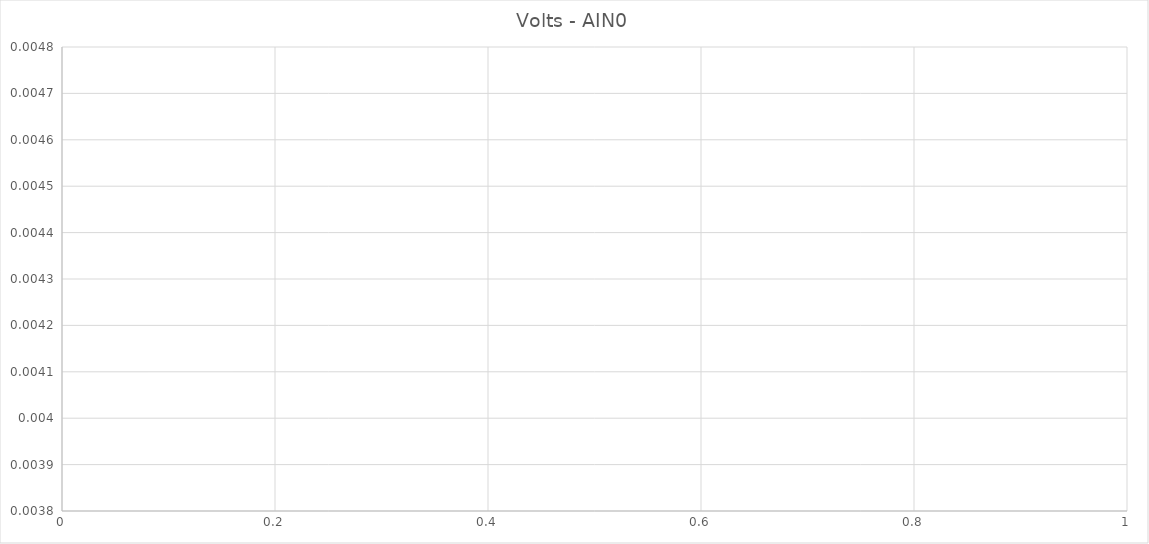
| Category | Volts - AIN0 |
|---|---|
| 0 | 0.004 |
| 1 | 0.004 |
| 2 | 0.004 |
| 3 | 0.004 |
| 4 | 0.004 |
| 5 | 0.004 |
| 6 | 0.004 |
| 7 | 0.004 |
| 8 | 0.004 |
| 9 | 0.004 |
| 10 | 0.004 |
| 11 | 0.004 |
| 12 | 0.004 |
| 13 | 0.004 |
| 14 | 0.004 |
| 15 | 0.004 |
| 16 | 0.004 |
| 17 | 0.004 |
| 18 | 0.004 |
| 19 | 0.004 |
| 20 | 0.004 |
| 21 | 0.004 |
| 22 | 0.004 |
| 23 | 0.004 |
| 24 | 0.004 |
| 25 | 0.004 |
| 26 | 0.004 |
| 27 | 0.004 |
| 28 | 0.004 |
| 29 | 0.004 |
| 30 | 0.004 |
| 31 | 0.004 |
| 32 | 0.004 |
| 33 | 0.004 |
| 34 | 0.004 |
| 35 | 0.004 |
| 36 | 0.004 |
| 37 | 0.004 |
| 38 | 0.004 |
| 39 | 0.004 |
| 40 | 0.004 |
| 41 | 0.004 |
| 42 | 0.004 |
| 43 | 0.004 |
| 44 | 0.004 |
| 45 | 0.004 |
| 46 | 0.004 |
| 47 | 0.004 |
| 48 | 0.004 |
| 49 | 0.004 |
| 50 | 0.004 |
| 51 | 0.004 |
| 52 | 0.004 |
| 53 | 0.004 |
| 54 | 0.004 |
| 55 | 0.004 |
| 56 | 0.004 |
| 57 | 0.004 |
| 58 | 0.004 |
| 59 | 0.004 |
| 60 | 0.004 |
| 61 | 0.004 |
| 62 | 0.004 |
| 63 | 0.004 |
| 64 | 0.004 |
| 65 | 0.004 |
| 66 | 0.004 |
| 67 | 0.004 |
| 68 | 0.004 |
| 69 | 0.004 |
| 70 | 0.004 |
| 71 | 0.004 |
| 72 | 0.004 |
| 73 | 0.004 |
| 74 | 0.004 |
| 75 | 0.004 |
| 76 | 0.004 |
| 77 | 0.004 |
| 78 | 0.004 |
| 79 | 0.004 |
| 80 | 0.004 |
| 81 | 0.004 |
| 82 | 0.004 |
| 83 | 0.004 |
| 84 | 0.004 |
| 85 | 0.004 |
| 86 | 0.004 |
| 87 | 0.004 |
| 88 | 0.004 |
| 89 | 0.004 |
| 90 | 0.004 |
| 91 | 0.004 |
| 92 | 0.004 |
| 93 | 0.004 |
| 94 | 0.004 |
| 95 | 0.004 |
| 96 | 0.004 |
| 97 | 0.004 |
| 98 | 0.004 |
| 99 | 0.004 |
| 100 | 0.004 |
| 101 | 0.004 |
| 102 | 0.004 |
| 103 | 0.004 |
| 104 | 0.004 |
| 105 | 0.004 |
| 106 | 0.004 |
| 107 | 0.004 |
| 108 | 0.004 |
| 109 | 0.004 |
| 110 | 0.004 |
| 111 | 0.004 |
| 112 | 0.004 |
| 113 | 0.004 |
| 114 | 0.004 |
| 115 | 0.004 |
| 116 | 0.004 |
| 117 | 0.004 |
| 118 | 0.004 |
| 119 | 0.004 |
| 120 | 0.004 |
| 121 | 0.004 |
| 122 | 0.004 |
| 123 | 0.004 |
| 124 | 0.004 |
| 125 | 0.004 |
| 126 | 0.004 |
| 127 | 0.004 |
| 128 | 0.004 |
| 129 | 0.004 |
| 130 | 0.004 |
| 131 | 0.004 |
| 132 | 0.004 |
| 133 | 0.004 |
| 134 | 0.004 |
| 135 | 0.004 |
| 136 | 0.004 |
| 137 | 0.004 |
| 138 | 0.004 |
| 139 | 0.004 |
| 140 | 0.004 |
| 141 | 0.004 |
| 142 | 0.004 |
| 143 | 0.004 |
| 144 | 0.004 |
| 145 | 0.004 |
| 146 | 0.004 |
| 147 | 0.004 |
| 148 | 0.004 |
| 149 | 0.004 |
| 150 | 0.004 |
| 151 | 0.004 |
| 152 | 0.004 |
| 153 | 0.004 |
| 154 | 0.004 |
| 155 | 0.004 |
| 156 | 0.004 |
| 157 | 0.004 |
| 158 | 0.004 |
| 159 | 0.004 |
| 160 | 0.004 |
| 161 | 0.004 |
| 162 | 0.004 |
| 163 | 0.004 |
| 164 | 0.004 |
| 165 | 0.004 |
| 166 | 0.004 |
| 167 | 0.004 |
| 168 | 0.004 |
| 169 | 0.004 |
| 170 | 0.004 |
| 171 | 0.004 |
| 172 | 0.004 |
| 173 | 0.004 |
| 174 | 0.004 |
| 175 | 0.004 |
| 176 | 0.004 |
| 177 | 0.004 |
| 178 | 0.004 |
| 179 | 0.004 |
| 180 | 0.004 |
| 181 | 0.004 |
| 182 | 0.004 |
| 183 | 0.004 |
| 184 | 0.004 |
| 185 | 0.004 |
| 186 | 0.004 |
| 187 | 0.004 |
| 188 | 0.004 |
| 189 | 0.004 |
| 190 | 0.004 |
| 191 | 0.004 |
| 192 | 0.004 |
| 193 | 0.004 |
| 194 | 0.004 |
| 195 | 0.004 |
| 196 | 0.004 |
| 197 | 0.004 |
| 198 | 0.004 |
| 199 | 0.004 |
| 200 | 0.004 |
| 201 | 0.004 |
| 202 | 0.004 |
| 203 | 0.004 |
| 204 | 0.004 |
| 205 | 0.004 |
| 206 | 0.004 |
| 207 | 0.004 |
| 208 | 0.004 |
| 209 | 0.004 |
| 210 | 0.004 |
| 211 | 0.004 |
| 212 | 0.004 |
| 213 | 0.004 |
| 214 | 0.004 |
| 215 | 0.004 |
| 216 | 0.004 |
| 217 | 0.004 |
| 218 | 0.004 |
| 219 | 0.004 |
| 220 | 0.004 |
| 221 | 0.004 |
| 222 | 0.004 |
| 223 | 0.004 |
| 224 | 0.004 |
| 225 | 0.004 |
| 226 | 0.004 |
| 227 | 0.004 |
| 228 | 0.004 |
| 229 | 0.004 |
| 230 | 0.004 |
| 231 | 0.004 |
| 232 | 0.004 |
| 233 | 0.004 |
| 234 | 0.004 |
| 235 | 0.004 |
| 236 | 0.004 |
| 237 | 0.004 |
| 238 | 0.004 |
| 239 | 0.004 |
| 240 | 0.004 |
| 241 | 0.004 |
| 242 | 0.004 |
| 243 | 0.004 |
| 244 | 0.004 |
| 245 | 0.004 |
| 246 | 0.004 |
| 247 | 0.004 |
| 248 | 0.004 |
| 249 | 0.004 |
| 250 | 0.004 |
| 251 | 0.004 |
| 252 | 0.004 |
| 253 | 0.004 |
| 254 | 0.004 |
| 255 | 0.004 |
| 256 | 0.004 |
| 257 | 0.004 |
| 258 | 0.004 |
| 259 | 0.004 |
| 260 | 0.004 |
| 261 | 0.004 |
| 262 | 0.004 |
| 263 | 0.004 |
| 264 | 0.004 |
| 265 | 0.004 |
| 266 | 0.004 |
| 267 | 0.004 |
| 268 | 0.004 |
| 269 | 0.004 |
| 270 | 0.004 |
| 271 | 0.004 |
| 272 | 0.004 |
| 273 | 0.004 |
| 274 | 0.004 |
| 275 | 0.004 |
| 276 | 0.004 |
| 277 | 0.004 |
| 278 | 0.004 |
| 279 | 0.004 |
| 280 | 0.004 |
| 281 | 0.004 |
| 282 | 0.004 |
| 283 | 0.004 |
| 284 | 0.004 |
| 285 | 0.004 |
| 286 | 0.004 |
| 287 | 0.004 |
| 288 | 0.004 |
| 289 | 0.004 |
| 290 | 0.004 |
| 291 | 0.004 |
| 292 | 0.004 |
| 293 | 0.004 |
| 294 | 0.004 |
| 295 | 0.004 |
| 296 | 0.004 |
| 297 | 0.004 |
| 298 | 0.004 |
| 299 | 0.004 |
| 300 | 0.004 |
| 301 | 0.004 |
| 302 | 0.004 |
| 303 | 0.004 |
| 304 | 0.004 |
| 305 | 0.004 |
| 306 | 0.004 |
| 307 | 0.004 |
| 308 | 0.004 |
| 309 | 0.004 |
| 310 | 0.004 |
| 311 | 0.004 |
| 312 | 0.004 |
| 313 | 0.004 |
| 314 | 0.004 |
| 315 | 0.004 |
| 316 | 0.004 |
| 317 | 0.004 |
| 318 | 0.004 |
| 319 | 0.004 |
| 320 | 0.004 |
| 321 | 0.004 |
| 322 | 0.004 |
| 323 | 0.004 |
| 324 | 0.004 |
| 325 | 0.004 |
| 326 | 0.004 |
| 327 | 0.004 |
| 328 | 0.004 |
| 329 | 0.004 |
| 330 | 0.004 |
| 331 | 0.004 |
| 332 | 0.004 |
| 333 | 0.004 |
| 334 | 0.004 |
| 335 | 0.004 |
| 336 | 0.004 |
| 337 | 0.004 |
| 338 | 0.004 |
| 339 | 0.004 |
| 340 | 0.004 |
| 341 | 0.004 |
| 342 | 0.004 |
| 343 | 0.004 |
| 344 | 0.004 |
| 345 | 0.004 |
| 346 | 0.004 |
| 347 | 0.004 |
| 348 | 0.004 |
| 349 | 0.004 |
| 350 | 0.004 |
| 351 | 0.004 |
| 352 | 0.004 |
| 353 | 0.004 |
| 354 | 0.004 |
| 355 | 0.004 |
| 356 | 0.004 |
| 357 | 0.004 |
| 358 | 0.004 |
| 359 | 0.004 |
| 360 | 0.004 |
| 361 | 0.004 |
| 362 | 0.004 |
| 363 | 0.004 |
| 364 | 0.004 |
| 365 | 0.004 |
| 366 | 0.004 |
| 367 | 0.004 |
| 368 | 0.004 |
| 369 | 0.004 |
| 370 | 0.004 |
| 371 | 0.004 |
| 372 | 0.004 |
| 373 | 0.004 |
| 374 | 0.004 |
| 375 | 0.004 |
| 376 | 0.004 |
| 377 | 0.004 |
| 378 | 0.004 |
| 379 | 0.004 |
| 380 | 0.004 |
| 381 | 0.004 |
| 382 | 0.004 |
| 383 | 0.004 |
| 384 | 0.004 |
| 385 | 0.004 |
| 386 | 0.004 |
| 387 | 0.004 |
| 388 | 0.004 |
| 389 | 0.004 |
| 390 | 0.004 |
| 391 | 0.004 |
| 392 | 0.004 |
| 393 | 0.004 |
| 394 | 0.004 |
| 395 | 0.004 |
| 396 | 0.004 |
| 397 | 0.004 |
| 398 | 0.004 |
| 399 | 0.004 |
| 400 | 0.004 |
| 401 | 0.004 |
| 402 | 0.004 |
| 403 | 0.004 |
| 404 | 0.004 |
| 405 | 0.004 |
| 406 | 0.004 |
| 407 | 0.004 |
| 408 | 0.004 |
| 409 | 0.004 |
| 410 | 0.004 |
| 411 | 0.004 |
| 412 | 0.004 |
| 413 | 0.004 |
| 414 | 0.004 |
| 415 | 0.004 |
| 416 | 0.004 |
| 417 | 0.004 |
| 418 | 0.004 |
| 419 | 0.004 |
| 420 | 0.004 |
| 421 | 0.004 |
| 422 | 0.004 |
| 423 | 0.004 |
| 424 | 0.004 |
| 425 | 0.004 |
| 426 | 0.004 |
| 427 | 0.004 |
| 428 | 0.004 |
| 429 | 0.004 |
| 430 | 0.004 |
| 431 | 0.004 |
| 432 | 0.004 |
| 433 | 0.004 |
| 434 | 0.004 |
| 435 | 0.004 |
| 436 | 0.004 |
| 437 | 0.004 |
| 438 | 0.004 |
| 439 | 0.004 |
| 440 | 0.004 |
| 441 | 0.004 |
| 442 | 0.004 |
| 443 | 0.004 |
| 444 | 0.004 |
| 445 | 0.004 |
| 446 | 0.004 |
| 447 | 0.004 |
| 448 | 0.004 |
| 449 | 0.004 |
| 450 | 0.004 |
| 451 | 0.004 |
| 452 | 0.004 |
| 453 | 0.004 |
| 454 | 0.004 |
| 455 | 0.004 |
| 456 | 0.004 |
| 457 | 0.004 |
| 458 | 0.004 |
| 459 | 0.004 |
| 460 | 0.004 |
| 461 | 0.004 |
| 462 | 0.004 |
| 463 | 0.004 |
| 464 | 0.004 |
| 465 | 0.004 |
| 466 | 0.004 |
| 467 | 0.004 |
| 468 | 0.004 |
| 469 | 0.004 |
| 470 | 0.004 |
| 471 | 0.004 |
| 472 | 0.004 |
| 473 | 0.004 |
| 474 | 0.004 |
| 475 | 0.004 |
| 476 | 0.004 |
| 477 | 0.004 |
| 478 | 0.004 |
| 479 | 0.004 |
| 480 | 0.004 |
| 481 | 0.004 |
| 482 | 0.004 |
| 483 | 0.004 |
| 484 | 0.004 |
| 485 | 0.004 |
| 486 | 0.004 |
| 487 | 0.004 |
| 488 | 0.004 |
| 489 | 0.004 |
| 490 | 0.004 |
| 491 | 0.004 |
| 492 | 0.004 |
| 493 | 0.004 |
| 494 | 0.004 |
| 495 | 0.004 |
| 496 | 0.004 |
| 497 | 0.004 |
| 498 | 0.004 |
| 499 | 0.004 |
| 500 | 0.004 |
| 501 | 0.004 |
| 502 | 0.004 |
| 503 | 0.004 |
| 504 | 0.004 |
| 505 | 0.004 |
| 506 | 0.004 |
| 507 | 0.004 |
| 508 | 0.004 |
| 509 | 0.004 |
| 510 | 0.004 |
| 511 | 0.004 |
| 512 | 0.004 |
| 513 | 0.004 |
| 514 | 0.004 |
| 515 | 0.004 |
| 516 | 0.004 |
| 517 | 0.004 |
| 518 | 0.004 |
| 519 | 0.004 |
| 520 | 0.004 |
| 521 | 0.004 |
| 522 | 0.004 |
| 523 | 0.004 |
| 524 | 0.004 |
| 525 | 0.004 |
| 526 | 0.004 |
| 527 | 0.004 |
| 528 | 0.004 |
| 529 | 0.004 |
| 530 | 0.004 |
| 531 | 0.004 |
| 532 | 0.004 |
| 533 | 0.004 |
| 534 | 0.004 |
| 535 | 0.004 |
| 536 | 0.004 |
| 537 | 0.004 |
| 538 | 0.004 |
| 539 | 0.004 |
| 540 | 0.004 |
| 541 | 0.004 |
| 542 | 0.004 |
| 543 | 0.004 |
| 544 | 0.004 |
| 545 | 0.004 |
| 546 | 0.004 |
| 547 | 0.004 |
| 548 | 0.004 |
| 549 | 0.004 |
| 550 | 0.004 |
| 551 | 0.004 |
| 552 | 0.004 |
| 553 | 0.004 |
| 554 | 0.004 |
| 555 | 0.004 |
| 556 | 0.004 |
| 557 | 0.004 |
| 558 | 0.004 |
| 559 | 0.004 |
| 560 | 0.004 |
| 561 | 0.004 |
| 562 | 0.004 |
| 563 | 0.004 |
| 564 | 0.004 |
| 565 | 0.004 |
| 566 | 0.004 |
| 567 | 0.004 |
| 568 | 0.004 |
| 569 | 0.004 |
| 570 | 0.004 |
| 571 | 0.004 |
| 572 | 0.004 |
| 573 | 0.004 |
| 574 | 0.004 |
| 575 | 0.004 |
| 576 | 0.004 |
| 577 | 0.004 |
| 578 | 0.004 |
| 579 | 0.004 |
| 580 | 0.004 |
| 581 | 0.004 |
| 582 | 0.004 |
| 583 | 0.004 |
| 584 | 0.004 |
| 585 | 0.004 |
| 586 | 0.004 |
| 587 | 0.004 |
| 588 | 0.004 |
| 589 | 0.004 |
| 590 | 0.004 |
| 591 | 0.004 |
| 592 | 0.004 |
| 593 | 0.004 |
| 594 | 0.004 |
| 595 | 0.004 |
| 596 | 0.004 |
| 597 | 0.004 |
| 598 | 0.004 |
| 599 | 0.004 |
| 600 | 0.004 |
| 601 | 0.004 |
| 602 | 0.004 |
| 603 | 0.004 |
| 604 | 0.004 |
| 605 | 0.004 |
| 606 | 0.004 |
| 607 | 0.004 |
| 608 | 0.004 |
| 609 | 0.004 |
| 610 | 0.004 |
| 611 | 0.004 |
| 612 | 0.004 |
| 613 | 0.004 |
| 614 | 0.004 |
| 615 | 0.004 |
| 616 | 0.004 |
| 617 | 0.004 |
| 618 | 0.004 |
| 619 | 0.004 |
| 620 | 0.004 |
| 621 | 0.004 |
| 622 | 0.004 |
| 623 | 0.004 |
| 624 | 0.004 |
| 625 | 0.004 |
| 626 | 0.004 |
| 627 | 0.004 |
| 628 | 0.004 |
| 629 | 0.004 |
| 630 | 0.004 |
| 631 | 0.004 |
| 632 | 0.004 |
| 633 | 0.004 |
| 634 | 0.004 |
| 635 | 0.004 |
| 636 | 0.004 |
| 637 | 0.004 |
| 638 | 0.004 |
| 639 | 0.004 |
| 640 | 0.004 |
| 641 | 0.004 |
| 642 | 0.004 |
| 643 | 0.004 |
| 644 | 0.004 |
| 645 | 0.004 |
| 646 | 0.004 |
| 647 | 0.004 |
| 648 | 0.004 |
| 649 | 0.004 |
| 650 | 0.004 |
| 651 | 0.004 |
| 652 | 0.004 |
| 653 | 0.004 |
| 654 | 0.004 |
| 655 | 0.004 |
| 656 | 0.004 |
| 657 | 0.004 |
| 658 | 0.004 |
| 659 | 0.004 |
| 660 | 0.004 |
| 661 | 0.004 |
| 662 | 0.004 |
| 663 | 0.004 |
| 664 | 0.004 |
| 665 | 0.004 |
| 666 | 0.004 |
| 667 | 0.004 |
| 668 | 0.004 |
| 669 | 0.004 |
| 670 | 0.004 |
| 671 | 0.004 |
| 672 | 0.004 |
| 673 | 0.004 |
| 674 | 0.004 |
| 675 | 0.004 |
| 676 | 0.004 |
| 677 | 0.004 |
| 678 | 0.004 |
| 679 | 0.004 |
| 680 | 0.004 |
| 681 | 0.004 |
| 682 | 0.004 |
| 683 | 0.004 |
| 684 | 0.004 |
| 685 | 0.004 |
| 686 | 0.004 |
| 687 | 0.004 |
| 688 | 0.004 |
| 689 | 0.004 |
| 690 | 0.004 |
| 691 | 0.004 |
| 692 | 0.004 |
| 693 | 0.004 |
| 694 | 0.004 |
| 695 | 0.004 |
| 696 | 0.004 |
| 697 | 0.004 |
| 698 | 0.004 |
| 699 | 0.004 |
| 700 | 0.004 |
| 701 | 0.004 |
| 702 | 0.004 |
| 703 | 0.004 |
| 704 | 0.004 |
| 705 | 0.004 |
| 706 | 0.004 |
| 707 | 0.004 |
| 708 | 0.004 |
| 709 | 0.004 |
| 710 | 0.004 |
| 711 | 0.004 |
| 712 | 0.004 |
| 713 | 0.004 |
| 714 | 0.004 |
| 715 | 0.004 |
| 716 | 0.004 |
| 717 | 0.004 |
| 718 | 0.004 |
| 719 | 0.004 |
| 720 | 0.004 |
| 721 | 0.004 |
| 722 | 0.004 |
| 723 | 0.004 |
| 724 | 0.004 |
| 725 | 0.004 |
| 726 | 0.004 |
| 727 | 0.004 |
| 728 | 0.004 |
| 729 | 0.004 |
| 730 | 0.004 |
| 731 | 0.004 |
| 732 | 0.004 |
| 733 | 0.004 |
| 734 | 0.004 |
| 735 | 0.004 |
| 736 | 0.004 |
| 737 | 0.004 |
| 738 | 0.004 |
| 739 | 0.004 |
| 740 | 0.004 |
| 741 | 0.004 |
| 742 | 0.004 |
| 743 | 0.004 |
| 744 | 0.004 |
| 745 | 0.004 |
| 746 | 0.004 |
| 747 | 0.004 |
| 748 | 0.004 |
| 749 | 0.004 |
| 750 | 0.004 |
| 751 | 0.004 |
| 752 | 0.004 |
| 753 | 0.004 |
| 754 | 0.004 |
| 755 | 0.004 |
| 756 | 0.004 |
| 757 | 0.004 |
| 758 | 0.004 |
| 759 | 0.004 |
| 760 | 0.004 |
| 761 | 0.004 |
| 762 | 0.004 |
| 763 | 0.004 |
| 764 | 0.004 |
| 765 | 0.004 |
| 766 | 0.004 |
| 767 | 0.004 |
| 768 | 0.004 |
| 769 | 0.004 |
| 770 | 0.004 |
| 771 | 0.004 |
| 772 | 0.004 |
| 773 | 0.004 |
| 774 | 0.004 |
| 775 | 0.004 |
| 776 | 0.004 |
| 777 | 0.004 |
| 778 | 0.004 |
| 779 | 0.004 |
| 780 | 0.004 |
| 781 | 0.004 |
| 782 | 0.004 |
| 783 | 0.004 |
| 784 | 0.004 |
| 785 | 0.004 |
| 786 | 0.004 |
| 787 | 0.004 |
| 788 | 0.004 |
| 789 | 0.004 |
| 790 | 0.004 |
| 791 | 0.004 |
| 792 | 0.004 |
| 793 | 0.004 |
| 794 | 0.004 |
| 795 | 0.004 |
| 796 | 0.004 |
| 797 | 0.004 |
| 798 | 0.004 |
| 799 | 0.004 |
| 800 | 0.004 |
| 801 | 0.004 |
| 802 | 0.004 |
| 803 | 0.004 |
| 804 | 0.004 |
| 805 | 0.004 |
| 806 | 0.004 |
| 807 | 0.004 |
| 808 | 0.004 |
| 809 | 0.004 |
| 810 | 0.004 |
| 811 | 0.004 |
| 812 | 0.004 |
| 813 | 0.004 |
| 814 | 0.004 |
| 815 | 0.004 |
| 816 | 0.004 |
| 817 | 0.004 |
| 818 | 0.004 |
| 819 | 0.004 |
| 820 | 0.004 |
| 821 | 0.004 |
| 822 | 0.004 |
| 823 | 0.004 |
| 824 | 0.004 |
| 825 | 0.004 |
| 826 | 0.004 |
| 827 | 0.004 |
| 828 | 0.004 |
| 829 | 0.004 |
| 830 | 0.004 |
| 831 | 0.004 |
| 832 | 0.004 |
| 833 | 0.004 |
| 834 | 0.004 |
| 835 | 0.004 |
| 836 | 0.004 |
| 837 | 0.004 |
| 838 | 0.004 |
| 839 | 0.004 |
| 840 | 0.004 |
| 841 | 0.004 |
| 842 | 0.004 |
| 843 | 0.004 |
| 844 | 0.004 |
| 845 | 0.004 |
| 846 | 0.004 |
| 847 | 0.004 |
| 848 | 0.004 |
| 849 | 0.004 |
| 850 | 0.004 |
| 851 | 0.004 |
| 852 | 0.004 |
| 853 | 0.004 |
| 854 | 0.004 |
| 855 | 0.004 |
| 856 | 0.004 |
| 857 | 0.004 |
| 858 | 0.004 |
| 859 | 0.004 |
| 860 | 0.004 |
| 861 | 0.004 |
| 862 | 0.004 |
| 863 | 0.004 |
| 864 | 0.004 |
| 865 | 0.004 |
| 866 | 0.004 |
| 867 | 0.004 |
| 868 | 0.004 |
| 869 | 0.004 |
| 870 | 0.004 |
| 871 | 0.004 |
| 872 | 0.004 |
| 873 | 0.004 |
| 874 | 0.004 |
| 875 | 0.004 |
| 876 | 0.004 |
| 877 | 0.004 |
| 878 | 0.004 |
| 879 | 0.004 |
| 880 | 0.004 |
| 881 | 0.004 |
| 882 | 0.004 |
| 883 | 0.004 |
| 884 | 0.004 |
| 885 | 0.004 |
| 886 | 0.004 |
| 887 | 0.004 |
| 888 | 0.004 |
| 889 | 0.004 |
| 890 | 0.004 |
| 891 | 0.004 |
| 892 | 0.004 |
| 893 | 0.004 |
| 894 | 0.004 |
| 895 | 0.004 |
| 896 | 0.004 |
| 897 | 0.004 |
| 898 | 0.004 |
| 899 | 0.004 |
| 900 | 0.004 |
| 901 | 0.004 |
| 902 | 0.004 |
| 903 | 0.004 |
| 904 | 0.004 |
| 905 | 0.004 |
| 906 | 0.004 |
| 907 | 0.004 |
| 908 | 0.004 |
| 909 | 0.004 |
| 910 | 0.004 |
| 911 | 0.004 |
| 912 | 0.004 |
| 913 | 0.004 |
| 914 | 0.004 |
| 915 | 0.004 |
| 916 | 0.004 |
| 917 | 0.004 |
| 918 | 0.004 |
| 919 | 0.004 |
| 920 | 0.004 |
| 921 | 0.004 |
| 922 | 0.004 |
| 923 | 0.004 |
| 924 | 0.004 |
| 925 | 0.004 |
| 926 | 0.004 |
| 927 | 0.004 |
| 928 | 0.004 |
| 929 | 0.004 |
| 930 | 0.004 |
| 931 | 0.004 |
| 932 | 0.004 |
| 933 | 0.004 |
| 934 | 0.004 |
| 935 | 0.004 |
| 936 | 0.004 |
| 937 | 0.004 |
| 938 | 0.004 |
| 939 | 0.004 |
| 940 | 0.004 |
| 941 | 0.004 |
| 942 | 0.004 |
| 943 | 0.004 |
| 944 | 0.004 |
| 945 | 0.004 |
| 946 | 0.004 |
| 947 | 0.004 |
| 948 | 0.004 |
| 949 | 0.004 |
| 950 | 0.004 |
| 951 | 0.004 |
| 952 | 0.004 |
| 953 | 0.004 |
| 954 | 0.004 |
| 955 | 0.004 |
| 956 | 0.004 |
| 957 | 0.004 |
| 958 | 0.004 |
| 959 | 0.004 |
| 960 | 0.004 |
| 961 | 0.004 |
| 962 | 0.004 |
| 963 | 0.004 |
| 964 | 0.004 |
| 965 | 0.004 |
| 966 | 0.004 |
| 967 | 0.004 |
| 968 | 0.004 |
| 969 | 0.004 |
| 970 | 0.004 |
| 971 | 0.004 |
| 972 | 0.004 |
| 973 | 0.004 |
| 974 | 0.004 |
| 975 | 0.004 |
| 976 | 0.004 |
| 977 | 0.004 |
| 978 | 0.004 |
| 979 | 0.004 |
| 980 | 0.004 |
| 981 | 0.004 |
| 982 | 0.004 |
| 983 | 0.004 |
| 984 | 0.004 |
| 985 | 0.004 |
| 986 | 0.004 |
| 987 | 0.004 |
| 988 | 0.004 |
| 989 | 0.004 |
| 990 | 0.004 |
| 991 | 0.004 |
| 992 | 0.004 |
| 993 | 0.004 |
| 994 | 0.004 |
| 995 | 0.004 |
| 996 | 0.004 |
| 997 | 0.004 |
| 998 | 0.004 |
| 999 | 0.004 |
| 1000 | 0.004 |
| 1001 | 0.004 |
| 1002 | 0.004 |
| 1003 | 0.004 |
| 1004 | 0.004 |
| 1005 | 0.004 |
| 1006 | 0.004 |
| 1007 | 0.004 |
| 1008 | 0.004 |
| 1009 | 0.004 |
| 1010 | 0.004 |
| 1011 | 0.004 |
| 1012 | 0.004 |
| 1013 | 0.004 |
| 1014 | 0.004 |
| 1015 | 0.004 |
| 1016 | 0.004 |
| 1017 | 0.004 |
| 1018 | 0.004 |
| 1019 | 0.004 |
| 1020 | 0.004 |
| 1021 | 0.004 |
| 1022 | 0.004 |
| 1023 | 0.004 |
| 1024 | 0.004 |
| 1025 | 0.004 |
| 1026 | 0.004 |
| 1027 | 0.004 |
| 1028 | 0.004 |
| 1029 | 0.004 |
| 1030 | 0.004 |
| 1031 | 0.004 |
| 1032 | 0.004 |
| 1033 | 0.004 |
| 1034 | 0.004 |
| 1035 | 0.004 |
| 1036 | 0.004 |
| 1037 | 0.004 |
| 1038 | 0.004 |
| 1039 | 0.004 |
| 1040 | 0.004 |
| 1041 | 0.004 |
| 1042 | 0.004 |
| 1043 | 0.004 |
| 1044 | 0.004 |
| 1045 | 0.004 |
| 1046 | 0.004 |
| 1047 | 0.004 |
| 1048 | 0.004 |
| 1049 | 0.004 |
| 1050 | 0.004 |
| 1051 | 0.004 |
| 1052 | 0.004 |
| 1053 | 0.004 |
| 1054 | 0.004 |
| 1055 | 0.004 |
| 1056 | 0.004 |
| 1057 | 0.004 |
| 1058 | 0.004 |
| 1059 | 0.004 |
| 1060 | 0.004 |
| 1061 | 0.004 |
| 1062 | 0.004 |
| 1063 | 0.004 |
| 1064 | 0.004 |
| 1065 | 0.004 |
| 1066 | 0.004 |
| 1067 | 0.004 |
| 1068 | 0.004 |
| 1069 | 0.004 |
| 1070 | 0.004 |
| 1071 | 0.004 |
| 1072 | 0.004 |
| 1073 | 0.004 |
| 1074 | 0.004 |
| 1075 | 0.004 |
| 1076 | 0.004 |
| 1077 | 0.004 |
| 1078 | 0.004 |
| 1079 | 0.004 |
| 1080 | 0.004 |
| 1081 | 0.004 |
| 1082 | 0.004 |
| 1083 | 0.004 |
| 1084 | 0.004 |
| 1085 | 0.004 |
| 1086 | 0.004 |
| 1087 | 0.004 |
| 1088 | 0.004 |
| 1089 | 0.004 |
| 1090 | 0.004 |
| 1091 | 0.004 |
| 1092 | 0.004 |
| 1093 | 0.004 |
| 1094 | 0.004 |
| 1095 | 0.004 |
| 1096 | 0.004 |
| 1097 | 0.004 |
| 1098 | 0.004 |
| 1099 | 0.004 |
| 1100 | 0.004 |
| 1101 | 0.004 |
| 1102 | 0.004 |
| 1103 | 0.004 |
| 1104 | 0.004 |
| 1105 | 0.004 |
| 1106 | 0.004 |
| 1107 | 0.004 |
| 1108 | 0.004 |
| 1109 | 0.004 |
| 1110 | 0.004 |
| 1111 | 0.004 |
| 1112 | 0.004 |
| 1113 | 0.004 |
| 1114 | 0.004 |
| 1115 | 0.004 |
| 1116 | 0.004 |
| 1117 | 0.004 |
| 1118 | 0.004 |
| 1119 | 0.004 |
| 1120 | 0.004 |
| 1121 | 0.004 |
| 1122 | 0.004 |
| 1123 | 0.004 |
| 1124 | 0.004 |
| 1125 | 0.004 |
| 1126 | 0.004 |
| 1127 | 0.004 |
| 1128 | 0.004 |
| 1129 | 0.004 |
| 1130 | 0.004 |
| 1131 | 0.004 |
| 1132 | 0.004 |
| 1133 | 0.004 |
| 1134 | 0.004 |
| 1135 | 0.004 |
| 1136 | 0.004 |
| 1137 | 0.004 |
| 1138 | 0.004 |
| 1139 | 0.004 |
| 1140 | 0.004 |
| 1141 | 0.004 |
| 1142 | 0.004 |
| 1143 | 0.004 |
| 1144 | 0.004 |
| 1145 | 0.004 |
| 1146 | 0.004 |
| 1147 | 0.004 |
| 1148 | 0.004 |
| 1149 | 0.004 |
| 1150 | 0.004 |
| 1151 | 0.004 |
| 1152 | 0.004 |
| 1153 | 0.004 |
| 1154 | 0.004 |
| 1155 | 0.004 |
| 1156 | 0.004 |
| 1157 | 0.004 |
| 1158 | 0.004 |
| 1159 | 0.004 |
| 1160 | 0.004 |
| 1161 | 0.004 |
| 1162 | 0.004 |
| 1163 | 0.004 |
| 1164 | 0.004 |
| 1165 | 0.004 |
| 1166 | 0.004 |
| 1167 | 0.004 |
| 1168 | 0.004 |
| 1169 | 0.004 |
| 1170 | 0.004 |
| 1171 | 0.004 |
| 1172 | 0.004 |
| 1173 | 0.004 |
| 1174 | 0.004 |
| 1175 | 0.004 |
| 1176 | 0.004 |
| 1177 | 0.004 |
| 1178 | 0.004 |
| 1179 | 0.004 |
| 1180 | 0.004 |
| 1181 | 0.004 |
| 1182 | 0.004 |
| 1183 | 0.004 |
| 1184 | 0.004 |
| 1185 | 0.004 |
| 1186 | 0.004 |
| 1187 | 0.004 |
| 1188 | 0.004 |
| 1189 | 0.004 |
| 1190 | 0.004 |
| 1191 | 0.004 |
| 1192 | 0.004 |
| 1193 | 0.004 |
| 1194 | 0.004 |
| 1195 | 0.004 |
| 1196 | 0.004 |
| 1197 | 0.004 |
| 1198 | 0.004 |
| 1199 | 0.004 |
| 1200 | 0.004 |
| 1201 | 0.004 |
| 1202 | 0.004 |
| 1203 | 0.004 |
| 1204 | 0.004 |
| 1205 | 0.004 |
| 1206 | 0.004 |
| 1207 | 0.004 |
| 1208 | 0.004 |
| 1209 | 0.004 |
| 1210 | 0.004 |
| 1211 | 0.004 |
| 1212 | 0.004 |
| 1213 | 0.004 |
| 1214 | 0.004 |
| 1215 | 0.004 |
| 1216 | 0.004 |
| 1217 | 0.004 |
| 1218 | 0.004 |
| 1219 | 0.004 |
| 1220 | 0.004 |
| 1221 | 0.004 |
| 1222 | 0.004 |
| 1223 | 0.004 |
| 1224 | 0.004 |
| 1225 | 0.004 |
| 1226 | 0.004 |
| 1227 | 0.004 |
| 1228 | 0.004 |
| 1229 | 0.004 |
| 1230 | 0.004 |
| 1231 | 0.004 |
| 1232 | 0.004 |
| 1233 | 0.004 |
| 1234 | 0.004 |
| 1235 | 0.004 |
| 1236 | 0.004 |
| 1237 | 0.004 |
| 1238 | 0.004 |
| 1239 | 0.004 |
| 1240 | 0.004 |
| 1241 | 0.004 |
| 1242 | 0.004 |
| 1243 | 0.004 |
| 1244 | 0.004 |
| 1245 | 0.004 |
| 1246 | 0.004 |
| 1247 | 0.004 |
| 1248 | 0.004 |
| 1249 | 0.004 |
| 1250 | 0.004 |
| 1251 | 0.004 |
| 1252 | 0.004 |
| 1253 | 0.004 |
| 1254 | 0.004 |
| 1255 | 0.004 |
| 1256 | 0.004 |
| 1257 | 0.004 |
| 1258 | 0.004 |
| 1259 | 0.004 |
| 1260 | 0.004 |
| 1261 | 0.004 |
| 1262 | 0.004 |
| 1263 | 0.004 |
| 1264 | 0.004 |
| 1265 | 0.004 |
| 1266 | 0.004 |
| 1267 | 0.004 |
| 1268 | 0.004 |
| 1269 | 0.004 |
| 1270 | 0.004 |
| 1271 | 0.004 |
| 1272 | 0.004 |
| 1273 | 0.004 |
| 1274 | 0.004 |
| 1275 | 0.004 |
| 1276 | 0.004 |
| 1277 | 0.004 |
| 1278 | 0.004 |
| 1279 | 0.004 |
| 1280 | 0.004 |
| 1281 | 0.004 |
| 1282 | 0.004 |
| 1283 | 0.004 |
| 1284 | 0.004 |
| 1285 | 0.004 |
| 1286 | 0.004 |
| 1287 | 0.004 |
| 1288 | 0.004 |
| 1289 | 0.004 |
| 1290 | 0.004 |
| 1291 | 0.004 |
| 1292 | 0.004 |
| 1293 | 0.004 |
| 1294 | 0.004 |
| 1295 | 0.004 |
| 1296 | 0.004 |
| 1297 | 0.004 |
| 1298 | 0.004 |
| 1299 | 0.004 |
| 1300 | 0.004 |
| 1301 | 0.004 |
| 1302 | 0.004 |
| 1303 | 0.004 |
| 1304 | 0.004 |
| 1305 | 0.004 |
| 1306 | 0.004 |
| 1307 | 0.004 |
| 1308 | 0.004 |
| 1309 | 0.004 |
| 1310 | 0.004 |
| 1311 | 0.004 |
| 1312 | 0.004 |
| 1313 | 0.004 |
| 1314 | 0.004 |
| 1315 | 0.004 |
| 1316 | 0.004 |
| 1317 | 0.004 |
| 1318 | 0.004 |
| 1319 | 0.004 |
| 1320 | 0.004 |
| 1321 | 0.004 |
| 1322 | 0.004 |
| 1323 | 0.004 |
| 1324 | 0.004 |
| 1325 | 0.004 |
| 1326 | 0.004 |
| 1327 | 0.004 |
| 1328 | 0.004 |
| 1329 | 0.004 |
| 1330 | 0.004 |
| 1331 | 0.004 |
| 1332 | 0.004 |
| 1333 | 0.004 |
| 1334 | 0.004 |
| 1335 | 0.004 |
| 1336 | 0.004 |
| 1337 | 0.004 |
| 1338 | 0.004 |
| 1339 | 0.004 |
| 1340 | 0.004 |
| 1341 | 0.004 |
| 1342 | 0.004 |
| 1343 | 0.004 |
| 1344 | 0.004 |
| 1345 | 0.004 |
| 1346 | 0.004 |
| 1347 | 0.004 |
| 1348 | 0.004 |
| 1349 | 0.004 |
| 1350 | 0.004 |
| 1351 | 0.004 |
| 1352 | 0.004 |
| 1353 | 0.004 |
| 1354 | 0.004 |
| 1355 | 0.004 |
| 1356 | 0.004 |
| 1357 | 0.004 |
| 1358 | 0.004 |
| 1359 | 0.004 |
| 1360 | 0.004 |
| 1361 | 0.004 |
| 1362 | 0.004 |
| 1363 | 0.004 |
| 1364 | 0.004 |
| 1365 | 0.004 |
| 1366 | 0.004 |
| 1367 | 0.004 |
| 1368 | 0.004 |
| 1369 | 0.004 |
| 1370 | 0.004 |
| 1371 | 0.004 |
| 1372 | 0.004 |
| 1373 | 0.004 |
| 1374 | 0.004 |
| 1375 | 0.004 |
| 1376 | 0.004 |
| 1377 | 0.004 |
| 1378 | 0.004 |
| 1379 | 0.004 |
| 1380 | 0.004 |
| 1381 | 0.004 |
| 1382 | 0.004 |
| 1383 | 0.004 |
| 1384 | 0.004 |
| 1385 | 0.004 |
| 1386 | 0.004 |
| 1387 | 0.004 |
| 1388 | 0.004 |
| 1389 | 0.004 |
| 1390 | 0.004 |
| 1391 | 0.004 |
| 1392 | 0.004 |
| 1393 | 0.004 |
| 1394 | 0.004 |
| 1395 | 0.004 |
| 1396 | 0.004 |
| 1397 | 0.004 |
| 1398 | 0.004 |
| 1399 | 0.004 |
| 1400 | 0.004 |
| 1401 | 0.004 |
| 1402 | 0.004 |
| 1403 | 0.004 |
| 1404 | 0.004 |
| 1405 | 0.004 |
| 1406 | 0.004 |
| 1407 | 0.004 |
| 1408 | 0.004 |
| 1409 | 0.004 |
| 1410 | 0.004 |
| 1411 | 0.004 |
| 1412 | 0.004 |
| 1413 | 0.004 |
| 1414 | 0.004 |
| 1415 | 0.004 |
| 1416 | 0.004 |
| 1417 | 0.004 |
| 1418 | 0.004 |
| 1419 | 0.004 |
| 1420 | 0.004 |
| 1421 | 0.004 |
| 1422 | 0.004 |
| 1423 | 0.004 |
| 1424 | 0.004 |
| 1425 | 0.004 |
| 1426 | 0.004 |
| 1427 | 0.004 |
| 1428 | 0.004 |
| 1429 | 0.004 |
| 1430 | 0.004 |
| 1431 | 0.004 |
| 1432 | 0.004 |
| 1433 | 0.004 |
| 1434 | 0.004 |
| 1435 | 0.004 |
| 1436 | 0.004 |
| 1437 | 0.004 |
| 1438 | 0.004 |
| 1439 | 0.004 |
| 1440 | 0.004 |
| 1441 | 0.004 |
| 1442 | 0.004 |
| 1443 | 0.004 |
| 1444 | 0.004 |
| 1445 | 0.004 |
| 1446 | 0.004 |
| 1447 | 0.004 |
| 1448 | 0.004 |
| 1449 | 0.004 |
| 1450 | 0.004 |
| 1451 | 0.004 |
| 1452 | 0.004 |
| 1453 | 0.004 |
| 1454 | 0.004 |
| 1455 | 0.004 |
| 1456 | 0.004 |
| 1457 | 0.004 |
| 1458 | 0.004 |
| 1459 | 0.004 |
| 1460 | 0.004 |
| 1461 | 0.004 |
| 1462 | 0.004 |
| 1463 | 0.004 |
| 1464 | 0.004 |
| 1465 | 0.004 |
| 1466 | 0.004 |
| 1467 | 0.004 |
| 1468 | 0.004 |
| 1469 | 0.004 |
| 1470 | 0.004 |
| 1471 | 0.004 |
| 1472 | 0.004 |
| 1473 | 0.004 |
| 1474 | 0.004 |
| 1475 | 0.004 |
| 1476 | 0.004 |
| 1477 | 0.004 |
| 1478 | 0.004 |
| 1479 | 0.004 |
| 1480 | 0.004 |
| 1481 | 0.004 |
| 1482 | 0.004 |
| 1483 | 0.004 |
| 1484 | 0.004 |
| 1485 | 0.004 |
| 1486 | 0.004 |
| 1487 | 0.004 |
| 1488 | 0.004 |
| 1489 | 0.004 |
| 1490 | 0.004 |
| 1491 | 0.004 |
| 1492 | 0.004 |
| 1493 | 0.004 |
| 1494 | 0.004 |
| 1495 | 0.004 |
| 1496 | 0.004 |
| 1497 | 0.004 |
| 1498 | 0.004 |
| 1499 | 0.004 |
| 1500 | 0.004 |
| 1501 | 0.004 |
| 1502 | 0.004 |
| 1503 | 0.004 |
| 1504 | 0.004 |
| 1505 | 0.004 |
| 1506 | 0.004 |
| 1507 | 0.004 |
| 1508 | 0.004 |
| 1509 | 0.004 |
| 1510 | 0.004 |
| 1511 | 0.004 |
| 1512 | 0.004 |
| 1513 | 0.004 |
| 1514 | 0.004 |
| 1515 | 0.004 |
| 1516 | 0.004 |
| 1517 | 0.004 |
| 1518 | 0.004 |
| 1519 | 0.004 |
| 1520 | 0.004 |
| 1521 | 0.004 |
| 1522 | 0.004 |
| 1523 | 0.004 |
| 1524 | 0.004 |
| 1525 | 0.004 |
| 1526 | 0.004 |
| 1527 | 0.004 |
| 1528 | 0.004 |
| 1529 | 0.004 |
| 1530 | 0.004 |
| 1531 | 0.004 |
| 1532 | 0.004 |
| 1533 | 0.004 |
| 1534 | 0.004 |
| 1535 | 0.004 |
| 1536 | 0.004 |
| 1537 | 0.004 |
| 1538 | 0.004 |
| 1539 | 0.004 |
| 1540 | 0.004 |
| 1541 | 0.004 |
| 1542 | 0.004 |
| 1543 | 0.004 |
| 1544 | 0.004 |
| 1545 | 0.004 |
| 1546 | 0.004 |
| 1547 | 0.004 |
| 1548 | 0.004 |
| 1549 | 0.004 |
| 1550 | 0.004 |
| 1551 | 0.004 |
| 1552 | 0.004 |
| 1553 | 0.004 |
| 1554 | 0.004 |
| 1555 | 0.004 |
| 1556 | 0.004 |
| 1557 | 0.004 |
| 1558 | 0.004 |
| 1559 | 0.004 |
| 1560 | 0.004 |
| 1561 | 0.004 |
| 1562 | 0.004 |
| 1563 | 0.004 |
| 1564 | 0.004 |
| 1565 | 0.004 |
| 1566 | 0.004 |
| 1567 | 0.004 |
| 1568 | 0.004 |
| 1569 | 0.004 |
| 1570 | 0.004 |
| 1571 | 0.004 |
| 1572 | 0.004 |
| 1573 | 0.004 |
| 1574 | 0.004 |
| 1575 | 0.004 |
| 1576 | 0.004 |
| 1577 | 0.004 |
| 1578 | 0.004 |
| 1579 | 0.004 |
| 1580 | 0.004 |
| 1581 | 0.004 |
| 1582 | 0.004 |
| 1583 | 0.004 |
| 1584 | 0.004 |
| 1585 | 0.004 |
| 1586 | 0.004 |
| 1587 | 0.004 |
| 1588 | 0.004 |
| 1589 | 0.004 |
| 1590 | 0.004 |
| 1591 | 0.004 |
| 1592 | 0.004 |
| 1593 | 0.004 |
| 1594 | 0.004 |
| 1595 | 0.004 |
| 1596 | 0.004 |
| 1597 | 0.004 |
| 1598 | 0.004 |
| 1599 | 0.004 |
| 1600 | 0.004 |
| 1601 | 0.004 |
| 1602 | 0.004 |
| 1603 | 0.004 |
| 1604 | 0.004 |
| 1605 | 0.004 |
| 1606 | 0.004 |
| 1607 | 0.004 |
| 1608 | 0.004 |
| 1609 | 0.004 |
| 1610 | 0.004 |
| 1611 | 0.004 |
| 1612 | 0.004 |
| 1613 | 0.004 |
| 1614 | 0.004 |
| 1615 | 0.004 |
| 1616 | 0.004 |
| 1617 | 0.004 |
| 1618 | 0.004 |
| 1619 | 0.004 |
| 1620 | 0.004 |
| 1621 | 0.004 |
| 1622 | 0.004 |
| 1623 | 0.004 |
| 1624 | 0.004 |
| 1625 | 0.004 |
| 1626 | 0.004 |
| 1627 | 0.004 |
| 1628 | 0.004 |
| 1629 | 0.004 |
| 1630 | 0.004 |
| 1631 | 0.004 |
| 1632 | 0.004 |
| 1633 | 0.004 |
| 1634 | 0.004 |
| 1635 | 0.004 |
| 1636 | 0.004 |
| 1637 | 0.004 |
| 1638 | 0.004 |
| 1639 | 0.004 |
| 1640 | 0.004 |
| 1641 | 0.004 |
| 1642 | 0.004 |
| 1643 | 0.004 |
| 1644 | 0.004 |
| 1645 | 0.004 |
| 1646 | 0.004 |
| 1647 | 0.004 |
| 1648 | 0.004 |
| 1649 | 0.004 |
| 1650 | 0.004 |
| 1651 | 0.004 |
| 1652 | 0.004 |
| 1653 | 0.004 |
| 1654 | 0.004 |
| 1655 | 0.004 |
| 1656 | 0.004 |
| 1657 | 0.004 |
| 1658 | 0.004 |
| 1659 | 0.004 |
| 1660 | 0.004 |
| 1661 | 0.004 |
| 1662 | 0.004 |
| 1663 | 0.004 |
| 1664 | 0.004 |
| 1665 | 0.004 |
| 1666 | 0.004 |
| 1667 | 0.004 |
| 1668 | 0.004 |
| 1669 | 0.004 |
| 1670 | 0.004 |
| 1671 | 0.004 |
| 1672 | 0.004 |
| 1673 | 0.004 |
| 1674 | 0.004 |
| 1675 | 0.004 |
| 1676 | 0.004 |
| 1677 | 0.004 |
| 1678 | 0.004 |
| 1679 | 0.004 |
| 1680 | 0.004 |
| 1681 | 0.004 |
| 1682 | 0.004 |
| 1683 | 0.004 |
| 1684 | 0.004 |
| 1685 | 0.004 |
| 1686 | 0.004 |
| 1687 | 0.004 |
| 1688 | 0.004 |
| 1689 | 0.004 |
| 1690 | 0.004 |
| 1691 | 0.004 |
| 1692 | 0.004 |
| 1693 | 0.004 |
| 1694 | 0.004 |
| 1695 | 0.004 |
| 1696 | 0.004 |
| 1697 | 0.004 |
| 1698 | 0.004 |
| 1699 | 0.004 |
| 1700 | 0.004 |
| 1701 | 0.004 |
| 1702 | 0.004 |
| 1703 | 0.004 |
| 1704 | 0.004 |
| 1705 | 0.004 |
| 1706 | 0.004 |
| 1707 | 0.004 |
| 1708 | 0.004 |
| 1709 | 0.004 |
| 1710 | 0.004 |
| 1711 | 0.004 |
| 1712 | 0.004 |
| 1713 | 0.004 |
| 1714 | 0.004 |
| 1715 | 0.004 |
| 1716 | 0.004 |
| 1717 | 0.004 |
| 1718 | 0.004 |
| 1719 | 0.004 |
| 1720 | 0.004 |
| 1721 | 0.004 |
| 1722 | 0.004 |
| 1723 | 0.004 |
| 1724 | 0.004 |
| 1725 | 0.004 |
| 1726 | 0.004 |
| 1727 | 0.004 |
| 1728 | 0.004 |
| 1729 | 0.004 |
| 1730 | 0.004 |
| 1731 | 0.004 |
| 1732 | 0.004 |
| 1733 | 0.004 |
| 1734 | 0.004 |
| 1735 | 0.004 |
| 1736 | 0.004 |
| 1737 | 0.004 |
| 1738 | 0.004 |
| 1739 | 0.004 |
| 1740 | 0.004 |
| 1741 | 0.004 |
| 1742 | 0.004 |
| 1743 | 0.004 |
| 1744 | 0.004 |
| 1745 | 0.004 |
| 1746 | 0.004 |
| 1747 | 0.004 |
| 1748 | 0.004 |
| 1749 | 0.004 |
| 1750 | 0.004 |
| 1751 | 0.004 |
| 1752 | 0.004 |
| 1753 | 0.004 |
| 1754 | 0.004 |
| 1755 | 0.004 |
| 1756 | 0.004 |
| 1757 | 0.004 |
| 1758 | 0.004 |
| 1759 | 0.004 |
| 1760 | 0.004 |
| 1761 | 0.004 |
| 1762 | 0.004 |
| 1763 | 0.004 |
| 1764 | 0.004 |
| 1765 | 0.004 |
| 1766 | 0.004 |
| 1767 | 0.004 |
| 1768 | 0.004 |
| 1769 | 0.004 |
| 1770 | 0.004 |
| 1771 | 0.004 |
| 1772 | 0.004 |
| 1773 | 0.004 |
| 1774 | 0.004 |
| 1775 | 0.004 |
| 1776 | 0.004 |
| 1777 | 0.004 |
| 1778 | 0.004 |
| 1779 | 0.004 |
| 1780 | 0.004 |
| 1781 | 0.004 |
| 1782 | 0.004 |
| 1783 | 0.004 |
| 1784 | 0.004 |
| 1785 | 0.004 |
| 1786 | 0.004 |
| 1787 | 0.004 |
| 1788 | 0.004 |
| 1789 | 0.004 |
| 1790 | 0.004 |
| 1791 | 0.004 |
| 1792 | 0.004 |
| 1793 | 0.004 |
| 1794 | 0.004 |
| 1795 | 0.004 |
| 1796 | 0.004 |
| 1797 | 0.004 |
| 1798 | 0.004 |
| 1799 | 0.004 |
| 1800 | 0.004 |
| 1801 | 0.004 |
| 1802 | 0.004 |
| 1803 | 0.004 |
| 1804 | 0.004 |
| 1805 | 0.004 |
| 1806 | 0.004 |
| 1807 | 0.004 |
| 1808 | 0.004 |
| 1809 | 0.004 |
| 1810 | 0.004 |
| 1811 | 0.004 |
| 1812 | 0.004 |
| 1813 | 0.004 |
| 1814 | 0.004 |
| 1815 | 0.004 |
| 1816 | 0.004 |
| 1817 | 0.004 |
| 1818 | 0.004 |
| 1819 | 0.004 |
| 1820 | 0.004 |
| 1821 | 0.004 |
| 1822 | 0.004 |
| 1823 | 0.004 |
| 1824 | 0.004 |
| 1825 | 0.004 |
| 1826 | 0.004 |
| 1827 | 0.004 |
| 1828 | 0.004 |
| 1829 | 0.004 |
| 1830 | 0.004 |
| 1831 | 0.004 |
| 1832 | 0.004 |
| 1833 | 0.004 |
| 1834 | 0.004 |
| 1835 | 0.004 |
| 1836 | 0.004 |
| 1837 | 0.004 |
| 1838 | 0.004 |
| 1839 | 0.004 |
| 1840 | 0.004 |
| 1841 | 0.004 |
| 1842 | 0.004 |
| 1843 | 0.004 |
| 1844 | 0.004 |
| 1845 | 0.004 |
| 1846 | 0.004 |
| 1847 | 0.004 |
| 1848 | 0.004 |
| 1849 | 0.004 |
| 1850 | 0.004 |
| 1851 | 0.004 |
| 1852 | 0.004 |
| 1853 | 0.004 |
| 1854 | 0.004 |
| 1855 | 0.004 |
| 1856 | 0.004 |
| 1857 | 0.004 |
| 1858 | 0.004 |
| 1859 | 0.004 |
| 1860 | 0.004 |
| 1861 | 0.004 |
| 1862 | 0.004 |
| 1863 | 0.004 |
| 1864 | 0.004 |
| 1865 | 0.004 |
| 1866 | 0.004 |
| 1867 | 0.004 |
| 1868 | 0.004 |
| 1869 | 0.004 |
| 1870 | 0.004 |
| 1871 | 0.004 |
| 1872 | 0.004 |
| 1873 | 0.004 |
| 1874 | 0.004 |
| 1875 | 0.004 |
| 1876 | 0.004 |
| 1877 | 0.004 |
| 1878 | 0.004 |
| 1879 | 0.004 |
| 1880 | 0.004 |
| 1881 | 0.004 |
| 1882 | 0.004 |
| 1883 | 0.004 |
| 1884 | 0.004 |
| 1885 | 0.004 |
| 1886 | 0.004 |
| 1887 | 0.004 |
| 1888 | 0.004 |
| 1889 | 0.004 |
| 1890 | 0.004 |
| 1891 | 0.004 |
| 1892 | 0.004 |
| 1893 | 0.004 |
| 1894 | 0.004 |
| 1895 | 0.004 |
| 1896 | 0.004 |
| 1897 | 0.004 |
| 1898 | 0.004 |
| 1899 | 0.004 |
| 1900 | 0.004 |
| 1901 | 0.004 |
| 1902 | 0.004 |
| 1903 | 0.004 |
| 1904 | 0.004 |
| 1905 | 0.004 |
| 1906 | 0.004 |
| 1907 | 0.004 |
| 1908 | 0.004 |
| 1909 | 0.004 |
| 1910 | 0.004 |
| 1911 | 0.004 |
| 1912 | 0.004 |
| 1913 | 0.004 |
| 1914 | 0.004 |
| 1915 | 0.004 |
| 1916 | 0.004 |
| 1917 | 0.004 |
| 1918 | 0.004 |
| 1919 | 0.004 |
| 1920 | 0.004 |
| 1921 | 0.004 |
| 1922 | 0.004 |
| 1923 | 0.004 |
| 1924 | 0.004 |
| 1925 | 0.004 |
| 1926 | 0.004 |
| 1927 | 0.004 |
| 1928 | 0.004 |
| 1929 | 0.004 |
| 1930 | 0.004 |
| 1931 | 0.004 |
| 1932 | 0.004 |
| 1933 | 0.004 |
| 1934 | 0.004 |
| 1935 | 0.004 |
| 1936 | 0.004 |
| 1937 | 0.004 |
| 1938 | 0.004 |
| 1939 | 0.004 |
| 1940 | 0.004 |
| 1941 | 0.004 |
| 1942 | 0.004 |
| 1943 | 0.004 |
| 1944 | 0.004 |
| 1945 | 0.004 |
| 1946 | 0.004 |
| 1947 | 0.004 |
| 1948 | 0.004 |
| 1949 | 0.004 |
| 1950 | 0.004 |
| 1951 | 0.004 |
| 1952 | 0.004 |
| 1953 | 0.004 |
| 1954 | 0.004 |
| 1955 | 0.004 |
| 1956 | 0.004 |
| 1957 | 0.004 |
| 1958 | 0.004 |
| 1959 | 0.004 |
| 1960 | 0.004 |
| 1961 | 0.004 |
| 1962 | 0.004 |
| 1963 | 0.004 |
| 1964 | 0.004 |
| 1965 | 0.004 |
| 1966 | 0.004 |
| 1967 | 0.004 |
| 1968 | 0.004 |
| 1969 | 0.004 |
| 1970 | 0.004 |
| 1971 | 0.004 |
| 1972 | 0.004 |
| 1973 | 0.004 |
| 1974 | 0.004 |
| 1975 | 0.004 |
| 1976 | 0.004 |
| 1977 | 0.004 |
| 1978 | 0.004 |
| 1979 | 0.004 |
| 1980 | 0.004 |
| 1981 | 0.004 |
| 1982 | 0.004 |
| 1983 | 0.004 |
| 1984 | 0.004 |
| 1985 | 0.004 |
| 1986 | 0.004 |
| 1987 | 0.004 |
| 1988 | 0.004 |
| 1989 | 0.004 |
| 1990 | 0.004 |
| 1991 | 0.004 |
| 1992 | 0.004 |
| 1993 | 0.004 |
| 1994 | 0.004 |
| 1995 | 0.004 |
| 1996 | 0.004 |
| 1997 | 0.004 |
| 1998 | 0.004 |
| 1999 | 0.004 |
| 2000 | 0.004 |
| 2001 | 0.004 |
| 2002 | 0.004 |
| 2003 | 0.004 |
| 2004 | 0.004 |
| 2005 | 0.004 |
| 2006 | 0.004 |
| 2007 | 0.004 |
| 2008 | 0.004 |
| 2009 | 0.004 |
| 2010 | 0.004 |
| 2011 | 0.004 |
| 2012 | 0.004 |
| 2013 | 0.004 |
| 2014 | 0.004 |
| 2015 | 0.004 |
| 2016 | 0.004 |
| 2017 | 0.004 |
| 2018 | 0.004 |
| 2019 | 0.004 |
| 2020 | 0.004 |
| 2021 | 0.004 |
| 2022 | 0.004 |
| 2023 | 0.004 |
| 2024 | 0.004 |
| 2025 | 0.004 |
| 2026 | 0.004 |
| 2027 | 0.004 |
| 2028 | 0.004 |
| 2029 | 0.004 |
| 2030 | 0.004 |
| 2031 | 0.004 |
| 2032 | 0.004 |
| 2033 | 0.004 |
| 2034 | 0.004 |
| 2035 | 0.004 |
| 2036 | 0.004 |
| 2037 | 0.004 |
| 2038 | 0.004 |
| 2039 | 0.004 |
| 2040 | 0.004 |
| 2041 | 0.004 |
| 2042 | 0.004 |
| 2043 | 0.004 |
| 2044 | 0.004 |
| 2045 | 0.004 |
| 2046 | 0.004 |
| 2047 | 0.004 |
| 2048 | 0.004 |
| 2049 | 0.004 |
| 2050 | 0.004 |
| 2051 | 0.004 |
| 2052 | 0.004 |
| 2053 | 0.004 |
| 2054 | 0.004 |
| 2055 | 0.004 |
| 2056 | 0.004 |
| 2057 | 0.004 |
| 2058 | 0.004 |
| 2059 | 0.004 |
| 2060 | 0.004 |
| 2061 | 0.004 |
| 2062 | 0.004 |
| 2063 | 0.004 |
| 2064 | 0.004 |
| 2065 | 0.004 |
| 2066 | 0.004 |
| 2067 | 0.004 |
| 2068 | 0.004 |
| 2069 | 0.004 |
| 2070 | 0.004 |
| 2071 | 0.004 |
| 2072 | 0.004 |
| 2073 | 0.004 |
| 2074 | 0.004 |
| 2075 | 0.004 |
| 2076 | 0.004 |
| 2077 | 0.004 |
| 2078 | 0.004 |
| 2079 | 0.004 |
| 2080 | 0.004 |
| 2081 | 0.004 |
| 2082 | 0.004 |
| 2083 | 0.004 |
| 2084 | 0.004 |
| 2085 | 0.004 |
| 2086 | 0.004 |
| 2087 | 0.004 |
| 2088 | 0.004 |
| 2089 | 0.004 |
| 2090 | 0.004 |
| 2091 | 0.004 |
| 2092 | 0.004 |
| 2093 | 0.004 |
| 2094 | 0.004 |
| 2095 | 0.004 |
| 2096 | 0.004 |
| 2097 | 0.004 |
| 2098 | 0.004 |
| 2099 | 0.004 |
| 2100 | 0.004 |
| 2101 | 0.004 |
| 2102 | 0.004 |
| 2103 | 0.004 |
| 2104 | 0.004 |
| 2105 | 0.004 |
| 2106 | 0.004 |
| 2107 | 0.004 |
| 2108 | 0.004 |
| 2109 | 0.004 |
| 2110 | 0.004 |
| 2111 | 0.004 |
| 2112 | 0.004 |
| 2113 | 0.004 |
| 2114 | 0.004 |
| 2115 | 0.004 |
| 2116 | 0.004 |
| 2117 | 0.004 |
| 2118 | 0.004 |
| 2119 | 0.004 |
| 2120 | 0.004 |
| 2121 | 0.004 |
| 2122 | 0.004 |
| 2123 | 0.004 |
| 2124 | 0.004 |
| 2125 | 0.004 |
| 2126 | 0.004 |
| 2127 | 0.004 |
| 2128 | 0.004 |
| 2129 | 0.004 |
| 2130 | 0.004 |
| 2131 | 0.004 |
| 2132 | 0.004 |
| 2133 | 0.004 |
| 2134 | 0.004 |
| 2135 | 0.004 |
| 2136 | 0.004 |
| 2137 | 0.004 |
| 2138 | 0.004 |
| 2139 | 0.004 |
| 2140 | 0.004 |
| 2141 | 0.004 |
| 2142 | 0.004 |
| 2143 | 0.004 |
| 2144 | 0.004 |
| 2145 | 0.004 |
| 2146 | 0.004 |
| 2147 | 0.004 |
| 2148 | 0.004 |
| 2149 | 0.004 |
| 2150 | 0.004 |
| 2151 | 0.004 |
| 2152 | 0.004 |
| 2153 | 0.004 |
| 2154 | 0.004 |
| 2155 | 0.004 |
| 2156 | 0.004 |
| 2157 | 0.004 |
| 2158 | 0.004 |
| 2159 | 0.004 |
| 2160 | 0.004 |
| 2161 | 0.004 |
| 2162 | 0.004 |
| 2163 | 0.004 |
| 2164 | 0.004 |
| 2165 | 0.004 |
| 2166 | 0.004 |
| 2167 | 0.004 |
| 2168 | 0.004 |
| 2169 | 0.004 |
| 2170 | 0.004 |
| 2171 | 0.004 |
| 2172 | 0.004 |
| 2173 | 0.004 |
| 2174 | 0.004 |
| 2175 | 0.004 |
| 2176 | 0.004 |
| 2177 | 0.004 |
| 2178 | 0.004 |
| 2179 | 0.004 |
| 2180 | 0.004 |
| 2181 | 0.004 |
| 2182 | 0.004 |
| 2183 | 0.004 |
| 2184 | 0.004 |
| 2185 | 0.004 |
| 2186 | 0.004 |
| 2187 | 0.004 |
| 2188 | 0.004 |
| 2189 | 0.004 |
| 2190 | 0.004 |
| 2191 | 0.004 |
| 2192 | 0.004 |
| 2193 | 0.004 |
| 2194 | 0.004 |
| 2195 | 0.004 |
| 2196 | 0.004 |
| 2197 | 0.004 |
| 2198 | 0.004 |
| 2199 | 0.004 |
| 2200 | 0.004 |
| 2201 | 0.004 |
| 2202 | 0.004 |
| 2203 | 0.004 |
| 2204 | 0.004 |
| 2205 | 0.004 |
| 2206 | 0.004 |
| 2207 | 0.004 |
| 2208 | 0.004 |
| 2209 | 0.004 |
| 2210 | 0.004 |
| 2211 | 0.004 |
| 2212 | 0.004 |
| 2213 | 0.004 |
| 2214 | 0.004 |
| 2215 | 0.004 |
| 2216 | 0.004 |
| 2217 | 0.004 |
| 2218 | 0.004 |
| 2219 | 0.004 |
| 2220 | 0.004 |
| 2221 | 0.004 |
| 2222 | 0.004 |
| 2223 | 0.004 |
| 2224 | 0.004 |
| 2225 | 0.004 |
| 2226 | 0.004 |
| 2227 | 0.004 |
| 2228 | 0.004 |
| 2229 | 0.004 |
| 2230 | 0.004 |
| 2231 | 0.004 |
| 2232 | 0.004 |
| 2233 | 0.004 |
| 2234 | 0.004 |
| 2235 | 0.004 |
| 2236 | 0.004 |
| 2237 | 0.004 |
| 2238 | 0.004 |
| 2239 | 0.004 |
| 2240 | 0.004 |
| 2241 | 0.004 |
| 2242 | 0.004 |
| 2243 | 0.004 |
| 2244 | 0.004 |
| 2245 | 0.004 |
| 2246 | 0.004 |
| 2247 | 0.004 |
| 2248 | 0.004 |
| 2249 | 0.004 |
| 2250 | 0.004 |
| 2251 | 0.004 |
| 2252 | 0.004 |
| 2253 | 0.004 |
| 2254 | 0.004 |
| 2255 | 0.004 |
| 2256 | 0.004 |
| 2257 | 0.004 |
| 2258 | 0.004 |
| 2259 | 0.004 |
| 2260 | 0.004 |
| 2261 | 0.004 |
| 2262 | 0.004 |
| 2263 | 0.004 |
| 2264 | 0.004 |
| 2265 | 0.004 |
| 2266 | 0.004 |
| 2267 | 0.004 |
| 2268 | 0.004 |
| 2269 | 0.004 |
| 2270 | 0.004 |
| 2271 | 0.004 |
| 2272 | 0.004 |
| 2273 | 0.004 |
| 2274 | 0.004 |
| 2275 | 0.004 |
| 2276 | 0.004 |
| 2277 | 0.004 |
| 2278 | 0.004 |
| 2279 | 0.004 |
| 2280 | 0.004 |
| 2281 | 0.004 |
| 2282 | 0.004 |
| 2283 | 0.004 |
| 2284 | 0.004 |
| 2285 | 0.004 |
| 2286 | 0.004 |
| 2287 | 0.004 |
| 2288 | 0.004 |
| 2289 | 0.004 |
| 2290 | 0.004 |
| 2291 | 0.004 |
| 2292 | 0.004 |
| 2293 | 0.004 |
| 2294 | 0.004 |
| 2295 | 0.004 |
| 2296 | 0.004 |
| 2297 | 0.004 |
| 2298 | 0.004 |
| 2299 | 0.004 |
| 2300 | 0.004 |
| 2301 | 0.004 |
| 2302 | 0.004 |
| 2303 | 0.004 |
| 2304 | 0.004 |
| 2305 | 0.004 |
| 2306 | 0.004 |
| 2307 | 0.004 |
| 2308 | 0.004 |
| 2309 | 0.004 |
| 2310 | 0.004 |
| 2311 | 0.004 |
| 2312 | 0.004 |
| 2313 | 0.004 |
| 2314 | 0.004 |
| 2315 | 0.004 |
| 2316 | 0.004 |
| 2317 | 0.004 |
| 2318 | 0.004 |
| 2319 | 0.004 |
| 2320 | 0.004 |
| 2321 | 0.004 |
| 2322 | 0.004 |
| 2323 | 0.004 |
| 2324 | 0.004 |
| 2325 | 0.004 |
| 2326 | 0.004 |
| 2327 | 0.004 |
| 2328 | 0.004 |
| 2329 | 0.004 |
| 2330 | 0.004 |
| 2331 | 0.004 |
| 2332 | 0.004 |
| 2333 | 0.004 |
| 2334 | 0.004 |
| 2335 | 0.004 |
| 2336 | 0.004 |
| 2337 | 0.004 |
| 2338 | 0.004 |
| 2339 | 0.004 |
| 2340 | 0.004 |
| 2341 | 0.004 |
| 2342 | 0.004 |
| 2343 | 0.004 |
| 2344 | 0.004 |
| 2345 | 0.004 |
| 2346 | 0.004 |
| 2347 | 0.004 |
| 2348 | 0.004 |
| 2349 | 0.004 |
| 2350 | 0.004 |
| 2351 | 0.004 |
| 2352 | 0.004 |
| 2353 | 0.004 |
| 2354 | 0.004 |
| 2355 | 0.004 |
| 2356 | 0.004 |
| 2357 | 0.004 |
| 2358 | 0.004 |
| 2359 | 0.004 |
| 2360 | 0.004 |
| 2361 | 0.004 |
| 2362 | 0.004 |
| 2363 | 0.004 |
| 2364 | 0.004 |
| 2365 | 0.004 |
| 2366 | 0.004 |
| 2367 | 0.004 |
| 2368 | 0.004 |
| 2369 | 0.004 |
| 2370 | 0.004 |
| 2371 | 0.004 |
| 2372 | 0.004 |
| 2373 | 0.004 |
| 2374 | 0.004 |
| 2375 | 0.004 |
| 2376 | 0.004 |
| 2377 | 0.004 |
| 2378 | 0.004 |
| 2379 | 0.004 |
| 2380 | 0.004 |
| 2381 | 0.004 |
| 2382 | 0.004 |
| 2383 | 0.004 |
| 2384 | 0.004 |
| 2385 | 0.004 |
| 2386 | 0.004 |
| 2387 | 0.004 |
| 2388 | 0.004 |
| 2389 | 0.004 |
| 2390 | 0.004 |
| 2391 | 0.004 |
| 2392 | 0.004 |
| 2393 | 0.004 |
| 2394 | 0.004 |
| 2395 | 0.004 |
| 2396 | 0.004 |
| 2397 | 0.004 |
| 2398 | 0.004 |
| 2399 | 0.004 |
| 2400 | 0.004 |
| 2401 | 0.004 |
| 2402 | 0.004 |
| 2403 | 0.004 |
| 2404 | 0.004 |
| 2405 | 0.004 |
| 2406 | 0.004 |
| 2407 | 0.004 |
| 2408 | 0.004 |
| 2409 | 0.004 |
| 2410 | 0.004 |
| 2411 | 0.004 |
| 2412 | 0.004 |
| 2413 | 0.004 |
| 2414 | 0.004 |
| 2415 | 0.004 |
| 2416 | 0.004 |
| 2417 | 0.004 |
| 2418 | 0.004 |
| 2419 | 0.004 |
| 2420 | 0.004 |
| 2421 | 0.004 |
| 2422 | 0.004 |
| 2423 | 0.004 |
| 2424 | 0.004 |
| 2425 | 0.004 |
| 2426 | 0.004 |
| 2427 | 0.004 |
| 2428 | 0.004 |
| 2429 | 0.004 |
| 2430 | 0.004 |
| 2431 | 0.004 |
| 2432 | 0.004 |
| 2433 | 0.004 |
| 2434 | 0.004 |
| 2435 | 0.004 |
| 2436 | 0.004 |
| 2437 | 0.004 |
| 2438 | 0.004 |
| 2439 | 0.004 |
| 2440 | 0.004 |
| 2441 | 0.004 |
| 2442 | 0.004 |
| 2443 | 0.004 |
| 2444 | 0.004 |
| 2445 | 0.004 |
| 2446 | 0.004 |
| 2447 | 0.004 |
| 2448 | 0.004 |
| 2449 | 0.004 |
| 2450 | 0.004 |
| 2451 | 0.004 |
| 2452 | 0.004 |
| 2453 | 0.004 |
| 2454 | 0.004 |
| 2455 | 0.004 |
| 2456 | 0.004 |
| 2457 | 0.004 |
| 2458 | 0.004 |
| 2459 | 0.004 |
| 2460 | 0.004 |
| 2461 | 0.004 |
| 2462 | 0.004 |
| 2463 | 0.004 |
| 2464 | 0.004 |
| 2465 | 0.004 |
| 2466 | 0.004 |
| 2467 | 0.004 |
| 2468 | 0.004 |
| 2469 | 0.004 |
| 2470 | 0.004 |
| 2471 | 0.004 |
| 2472 | 0.004 |
| 2473 | 0.004 |
| 2474 | 0.004 |
| 2475 | 0.004 |
| 2476 | 0.004 |
| 2477 | 0.004 |
| 2478 | 0.004 |
| 2479 | 0.004 |
| 2480 | 0.004 |
| 2481 | 0.004 |
| 2482 | 0.004 |
| 2483 | 0.004 |
| 2484 | 0.004 |
| 2485 | 0.004 |
| 2486 | 0.004 |
| 2487 | 0.004 |
| 2488 | 0.004 |
| 2489 | 0.004 |
| 2490 | 0.004 |
| 2491 | 0.004 |
| 2492 | 0.004 |
| 2493 | 0.004 |
| 2494 | 0.004 |
| 2495 | 0.004 |
| 2496 | 0.004 |
| 2497 | 0.004 |
| 2498 | 0.004 |
| 2499 | 0.004 |
| 2500 | 0.004 |
| 2501 | 0.004 |
| 2502 | 0.004 |
| 2503 | 0.004 |
| 2504 | 0.004 |
| 2505 | 0.004 |
| 2506 | 0.004 |
| 2507 | 0.004 |
| 2508 | 0.004 |
| 2509 | 0.004 |
| 2510 | 0.004 |
| 2511 | 0.004 |
| 2512 | 0.004 |
| 2513 | 0.004 |
| 2514 | 0.004 |
| 2515 | 0.004 |
| 2516 | 0.004 |
| 2517 | 0.004 |
| 2518 | 0.004 |
| 2519 | 0.004 |
| 2520 | 0.004 |
| 2521 | 0.004 |
| 2522 | 0.004 |
| 2523 | 0.004 |
| 2524 | 0.004 |
| 2525 | 0.004 |
| 2526 | 0.004 |
| 2527 | 0.004 |
| 2528 | 0.004 |
| 2529 | 0.004 |
| 2530 | 0.004 |
| 2531 | 0.004 |
| 2532 | 0.004 |
| 2533 | 0.004 |
| 2534 | 0.004 |
| 2535 | 0.004 |
| 2536 | 0.004 |
| 2537 | 0.004 |
| 2538 | 0.004 |
| 2539 | 0.004 |
| 2540 | 0.004 |
| 2541 | 0.004 |
| 2542 | 0.004 |
| 2543 | 0.004 |
| 2544 | 0.004 |
| 2545 | 0.004 |
| 2546 | 0.004 |
| 2547 | 0.004 |
| 2548 | 0.004 |
| 2549 | 0.004 |
| 2550 | 0.004 |
| 2551 | 0.004 |
| 2552 | 0.004 |
| 2553 | 0.004 |
| 2554 | 0.004 |
| 2555 | 0.004 |
| 2556 | 0.004 |
| 2557 | 0.004 |
| 2558 | 0.004 |
| 2559 | 0.004 |
| 2560 | 0.004 |
| 2561 | 0.004 |
| 2562 | 0.004 |
| 2563 | 0.004 |
| 2564 | 0.004 |
| 2565 | 0.004 |
| 2566 | 0.004 |
| 2567 | 0.004 |
| 2568 | 0.004 |
| 2569 | 0.004 |
| 2570 | 0.004 |
| 2571 | 0.004 |
| 2572 | 0.004 |
| 2573 | 0.004 |
| 2574 | 0.004 |
| 2575 | 0.004 |
| 2576 | 0.004 |
| 2577 | 0.004 |
| 2578 | 0.004 |
| 2579 | 0.004 |
| 2580 | 0.004 |
| 2581 | 0.004 |
| 2582 | 0.004 |
| 2583 | 0.004 |
| 2584 | 0.004 |
| 2585 | 0.004 |
| 2586 | 0.004 |
| 2587 | 0.004 |
| 2588 | 0.004 |
| 2589 | 0.004 |
| 2590 | 0.004 |
| 2591 | 0.004 |
| 2592 | 0.004 |
| 2593 | 0.004 |
| 2594 | 0.004 |
| 2595 | 0.004 |
| 2596 | 0.004 |
| 2597 | 0.004 |
| 2598 | 0.004 |
| 2599 | 0.004 |
| 2600 | 0.004 |
| 2601 | 0.004 |
| 2602 | 0.004 |
| 2603 | 0.004 |
| 2604 | 0.004 |
| 2605 | 0.004 |
| 2606 | 0.004 |
| 2607 | 0.004 |
| 2608 | 0.004 |
| 2609 | 0.004 |
| 2610 | 0.004 |
| 2611 | 0.004 |
| 2612 | 0.004 |
| 2613 | 0.004 |
| 2614 | 0.004 |
| 2615 | 0.004 |
| 2616 | 0.004 |
| 2617 | 0.004 |
| 2618 | 0.004 |
| 2619 | 0.004 |
| 2620 | 0.004 |
| 2621 | 0.004 |
| 2622 | 0.004 |
| 2623 | 0.004 |
| 2624 | 0.004 |
| 2625 | 0.004 |
| 2626 | 0.004 |
| 2627 | 0.004 |
| 2628 | 0.004 |
| 2629 | 0.004 |
| 2630 | 0.004 |
| 2631 | 0.004 |
| 2632 | 0.004 |
| 2633 | 0.004 |
| 2634 | 0.004 |
| 2635 | 0.004 |
| 2636 | 0.004 |
| 2637 | 0.004 |
| 2638 | 0.004 |
| 2639 | 0.004 |
| 2640 | 0.004 |
| 2641 | 0.004 |
| 2642 | 0.004 |
| 2643 | 0.004 |
| 2644 | 0.004 |
| 2645 | 0.004 |
| 2646 | 0.004 |
| 2647 | 0.004 |
| 2648 | 0.004 |
| 2649 | 0.004 |
| 2650 | 0.004 |
| 2651 | 0.004 |
| 2652 | 0.004 |
| 2653 | 0.004 |
| 2654 | 0.004 |
| 2655 | 0.004 |
| 2656 | 0.004 |
| 2657 | 0.004 |
| 2658 | 0.004 |
| 2659 | 0.004 |
| 2660 | 0.004 |
| 2661 | 0.004 |
| 2662 | 0.004 |
| 2663 | 0.004 |
| 2664 | 0.004 |
| 2665 | 0.004 |
| 2666 | 0.004 |
| 2667 | 0.004 |
| 2668 | 0.004 |
| 2669 | 0.004 |
| 2670 | 0.004 |
| 2671 | 0.004 |
| 2672 | 0.004 |
| 2673 | 0.004 |
| 2674 | 0.004 |
| 2675 | 0.004 |
| 2676 | 0.004 |
| 2677 | 0.004 |
| 2678 | 0.004 |
| 2679 | 0.004 |
| 2680 | 0.004 |
| 2681 | 0.004 |
| 2682 | 0.004 |
| 2683 | 0.004 |
| 2684 | 0.004 |
| 2685 | 0.004 |
| 2686 | 0.004 |
| 2687 | 0.004 |
| 2688 | 0.004 |
| 2689 | 0.004 |
| 2690 | 0.004 |
| 2691 | 0.004 |
| 2692 | 0.004 |
| 2693 | 0.004 |
| 2694 | 0.004 |
| 2695 | 0.004 |
| 2696 | 0.004 |
| 2697 | 0.004 |
| 2698 | 0.004 |
| 2699 | 0.004 |
| 2700 | 0.004 |
| 2701 | 0.004 |
| 2702 | 0.004 |
| 2703 | 0.004 |
| 2704 | 0.004 |
| 2705 | 0.004 |
| 2706 | 0.004 |
| 2707 | 0.004 |
| 2708 | 0.004 |
| 2709 | 0.004 |
| 2710 | 0.004 |
| 2711 | 0.004 |
| 2712 | 0.004 |
| 2713 | 0.004 |
| 2714 | 0.004 |
| 2715 | 0.004 |
| 2716 | 0.004 |
| 2717 | 0.004 |
| 2718 | 0.004 |
| 2719 | 0.004 |
| 2720 | 0.004 |
| 2721 | 0.004 |
| 2722 | 0.004 |
| 2723 | 0.004 |
| 2724 | 0.004 |
| 2725 | 0.004 |
| 2726 | 0.004 |
| 2727 | 0.004 |
| 2728 | 0.004 |
| 2729 | 0.004 |
| 2730 | 0.004 |
| 2731 | 0.004 |
| 2732 | 0.004 |
| 2733 | 0.004 |
| 2734 | 0.004 |
| 2735 | 0.004 |
| 2736 | 0.004 |
| 2737 | 0.004 |
| 2738 | 0.004 |
| 2739 | 0.004 |
| 2740 | 0.004 |
| 2741 | 0.004 |
| 2742 | 0.004 |
| 2743 | 0.004 |
| 2744 | 0.004 |
| 2745 | 0.004 |
| 2746 | 0.004 |
| 2747 | 0.004 |
| 2748 | 0.004 |
| 2749 | 0.004 |
| 2750 | 0.004 |
| 2751 | 0.004 |
| 2752 | 0.004 |
| 2753 | 0.004 |
| 2754 | 0.004 |
| 2755 | 0.004 |
| 2756 | 0.004 |
| 2757 | 0.004 |
| 2758 | 0.004 |
| 2759 | 0.004 |
| 2760 | 0.004 |
| 2761 | 0.004 |
| 2762 | 0.004 |
| 2763 | 0.004 |
| 2764 | 0.004 |
| 2765 | 0.004 |
| 2766 | 0.004 |
| 2767 | 0.004 |
| 2768 | 0.004 |
| 2769 | 0.004 |
| 2770 | 0.004 |
| 2771 | 0.004 |
| 2772 | 0.004 |
| 2773 | 0.004 |
| 2774 | 0.004 |
| 2775 | 0.004 |
| 2776 | 0.004 |
| 2777 | 0.004 |
| 2778 | 0.004 |
| 2779 | 0.004 |
| 2780 | 0.004 |
| 2781 | 0.004 |
| 2782 | 0.004 |
| 2783 | 0.004 |
| 2784 | 0.004 |
| 2785 | 0.004 |
| 2786 | 0.004 |
| 2787 | 0.004 |
| 2788 | 0.004 |
| 2789 | 0.004 |
| 2790 | 0.004 |
| 2791 | 0.004 |
| 2792 | 0.004 |
| 2793 | 0.004 |
| 2794 | 0.004 |
| 2795 | 0.004 |
| 2796 | 0.004 |
| 2797 | 0.004 |
| 2798 | 0.004 |
| 2799 | 0.004 |
| 2800 | 0.004 |
| 2801 | 0.004 |
| 2802 | 0.004 |
| 2803 | 0.004 |
| 2804 | 0.004 |
| 2805 | 0.004 |
| 2806 | 0.004 |
| 2807 | 0.004 |
| 2808 | 0.004 |
| 2809 | 0.004 |
| 2810 | 0.004 |
| 2811 | 0.004 |
| 2812 | 0.004 |
| 2813 | 0.004 |
| 2814 | 0.004 |
| 2815 | 0.004 |
| 2816 | 0.004 |
| 2817 | 0.004 |
| 2818 | 0.004 |
| 2819 | 0.004 |
| 2820 | 0.004 |
| 2821 | 0.004 |
| 2822 | 0.004 |
| 2823 | 0.004 |
| 2824 | 0.004 |
| 2825 | 0.004 |
| 2826 | 0.004 |
| 2827 | 0.004 |
| 2828 | 0.004 |
| 2829 | 0.004 |
| 2830 | 0.004 |
| 2831 | 0.004 |
| 2832 | 0.004 |
| 2833 | 0.004 |
| 2834 | 0.004 |
| 2835 | 0.004 |
| 2836 | 0.004 |
| 2837 | 0.004 |
| 2838 | 0.004 |
| 2839 | 0.004 |
| 2840 | 0.004 |
| 2841 | 0.004 |
| 2842 | 0.004 |
| 2843 | 0.004 |
| 2844 | 0.004 |
| 2845 | 0.004 |
| 2846 | 0.004 |
| 2847 | 0.004 |
| 2848 | 0.004 |
| 2849 | 0.004 |
| 2850 | 0.004 |
| 2851 | 0.004 |
| 2852 | 0.004 |
| 2853 | 0.004 |
| 2854 | 0.004 |
| 2855 | 0.004 |
| 2856 | 0.004 |
| 2857 | 0.004 |
| 2858 | 0.004 |
| 2859 | 0.004 |
| 2860 | 0.004 |
| 2861 | 0.004 |
| 2862 | 0.004 |
| 2863 | 0.004 |
| 2864 | 0.004 |
| 2865 | 0.004 |
| 2866 | 0.004 |
| 2867 | 0.004 |
| 2868 | 0.004 |
| 2869 | 0.004 |
| 2870 | 0.004 |
| 2871 | 0.004 |
| 2872 | 0.004 |
| 2873 | 0.004 |
| 2874 | 0.004 |
| 2875 | 0.004 |
| 2876 | 0.004 |
| 2877 | 0.004 |
| 2878 | 0.004 |
| 2879 | 0.004 |
| 2880 | 0.004 |
| 2881 | 0.004 |
| 2882 | 0.004 |
| 2883 | 0.004 |
| 2884 | 0.004 |
| 2885 | 0.004 |
| 2886 | 0.004 |
| 2887 | 0.004 |
| 2888 | 0.004 |
| 2889 | 0.004 |
| 2890 | 0.004 |
| 2891 | 0.004 |
| 2892 | 0.004 |
| 2893 | 0.004 |
| 2894 | 0.004 |
| 2895 | 0.004 |
| 2896 | 0.004 |
| 2897 | 0.004 |
| 2898 | 0.004 |
| 2899 | 0.004 |
| 2900 | 0.004 |
| 2901 | 0.004 |
| 2902 | 0.004 |
| 2903 | 0.004 |
| 2904 | 0.004 |
| 2905 | 0.004 |
| 2906 | 0.004 |
| 2907 | 0.004 |
| 2908 | 0.004 |
| 2909 | 0.004 |
| 2910 | 0.004 |
| 2911 | 0.004 |
| 2912 | 0.004 |
| 2913 | 0.004 |
| 2914 | 0.004 |
| 2915 | 0.004 |
| 2916 | 0.004 |
| 2917 | 0.004 |
| 2918 | 0.004 |
| 2919 | 0.004 |
| 2920 | 0.004 |
| 2921 | 0.004 |
| 2922 | 0.004 |
| 2923 | 0.004 |
| 2924 | 0.004 |
| 2925 | 0.004 |
| 2926 | 0.004 |
| 2927 | 0.004 |
| 2928 | 0.004 |
| 2929 | 0.004 |
| 2930 | 0.004 |
| 2931 | 0.004 |
| 2932 | 0.004 |
| 2933 | 0.004 |
| 2934 | 0.004 |
| 2935 | 0.004 |
| 2936 | 0.004 |
| 2937 | 0.004 |
| 2938 | 0.004 |
| 2939 | 0.004 |
| 2940 | 0.004 |
| 2941 | 0.004 |
| 2942 | 0.004 |
| 2943 | 0.004 |
| 2944 | 0.004 |
| 2945 | 0.004 |
| 2946 | 0.004 |
| 2947 | 0.004 |
| 2948 | 0.004 |
| 2949 | 0.004 |
| 2950 | 0.004 |
| 2951 | 0.004 |
| 2952 | 0.004 |
| 2953 | 0.004 |
| 2954 | 0.004 |
| 2955 | 0.004 |
| 2956 | 0.004 |
| 2957 | 0.004 |
| 2958 | 0.004 |
| 2959 | 0.004 |
| 2960 | 0.004 |
| 2961 | 0.004 |
| 2962 | 0.004 |
| 2963 | 0.004 |
| 2964 | 0.004 |
| 2965 | 0.004 |
| 2966 | 0.004 |
| 2967 | 0.004 |
| 2968 | 0.004 |
| 2969 | 0.004 |
| 2970 | 0.004 |
| 2971 | 0.004 |
| 2972 | 0.004 |
| 2973 | 0.004 |
| 2974 | 0.004 |
| 2975 | 0.004 |
| 2976 | 0.004 |
| 2977 | 0.004 |
| 2978 | 0.004 |
| 2979 | 0.004 |
| 2980 | 0.004 |
| 2981 | 0.004 |
| 2982 | 0.004 |
| 2983 | 0.004 |
| 2984 | 0.004 |
| 2985 | 0.004 |
| 2986 | 0.004 |
| 2987 | 0.004 |
| 2988 | 0.004 |
| 2989 | 0.004 |
| 2990 | 0.004 |
| 2991 | 0.004 |
| 2992 | 0.004 |
| 2993 | 0.004 |
| 2994 | 0.004 |
| 2995 | 0.004 |
| 2996 | 0.004 |
| 2997 | 0.004 |
| 2998 | 0.004 |
| 2999 | 0.004 |
| 3000 | 0.004 |
| 3001 | 0.004 |
| 3002 | 0.004 |
| 3003 | 0.004 |
| 3004 | 0.004 |
| 3005 | 0.004 |
| 3006 | 0.004 |
| 3007 | 0.004 |
| 3008 | 0.004 |
| 3009 | 0.004 |
| 3010 | 0.004 |
| 3011 | 0.004 |
| 3012 | 0.004 |
| 3013 | 0.004 |
| 3014 | 0.004 |
| 3015 | 0.004 |
| 3016 | 0.004 |
| 3017 | 0.004 |
| 3018 | 0.004 |
| 3019 | 0.004 |
| 3020 | 0.004 |
| 3021 | 0.004 |
| 3022 | 0.004 |
| 3023 | 0.004 |
| 3024 | 0.004 |
| 3025 | 0.004 |
| 3026 | 0.004 |
| 3027 | 0.004 |
| 3028 | 0.004 |
| 3029 | 0.004 |
| 3030 | 0.004 |
| 3031 | 0.004 |
| 3032 | 0.004 |
| 3033 | 0.004 |
| 3034 | 0.004 |
| 3035 | 0.004 |
| 3036 | 0.004 |
| 3037 | 0.004 |
| 3038 | 0.004 |
| 3039 | 0.004 |
| 3040 | 0.004 |
| 3041 | 0.004 |
| 3042 | 0.004 |
| 3043 | 0.004 |
| 3044 | 0.004 |
| 3045 | 0.004 |
| 3046 | 0.004 |
| 3047 | 0.004 |
| 3048 | 0.004 |
| 3049 | 0.004 |
| 3050 | 0.004 |
| 3051 | 0.004 |
| 3052 | 0.004 |
| 3053 | 0.004 |
| 3054 | 0.004 |
| 3055 | 0.004 |
| 3056 | 0.004 |
| 3057 | 0.004 |
| 3058 | 0.004 |
| 3059 | 0.004 |
| 3060 | 0.004 |
| 3061 | 0.004 |
| 3062 | 0.004 |
| 3063 | 0.004 |
| 3064 | 0.004 |
| 3065 | 0.004 |
| 3066 | 0.004 |
| 3067 | 0.004 |
| 3068 | 0.004 |
| 3069 | 0.004 |
| 3070 | 0.004 |
| 3071 | 0.004 |
| 3072 | 0.004 |
| 3073 | 0.004 |
| 3074 | 0.004 |
| 3075 | 0.004 |
| 3076 | 0.004 |
| 3077 | 0.004 |
| 3078 | 0.004 |
| 3079 | 0.004 |
| 3080 | 0.004 |
| 3081 | 0.004 |
| 3082 | 0.004 |
| 3083 | 0.004 |
| 3084 | 0.004 |
| 3085 | 0.004 |
| 3086 | 0.004 |
| 3087 | 0.004 |
| 3088 | 0.004 |
| 3089 | 0.004 |
| 3090 | 0.004 |
| 3091 | 0.004 |
| 3092 | 0.004 |
| 3093 | 0.004 |
| 3094 | 0.004 |
| 3095 | 0.004 |
| 3096 | 0.004 |
| 3097 | 0.004 |
| 3098 | 0.004 |
| 3099 | 0.004 |
| 3100 | 0.004 |
| 3101 | 0.004 |
| 3102 | 0.004 |
| 3103 | 0.004 |
| 3104 | 0.004 |
| 3105 | 0.004 |
| 3106 | 0.004 |
| 3107 | 0.004 |
| 3108 | 0.004 |
| 3109 | 0.004 |
| 3110 | 0.004 |
| 3111 | 0.004 |
| 3112 | 0.004 |
| 3113 | 0.004 |
| 3114 | 0.004 |
| 3115 | 0.004 |
| 3116 | 0.004 |
| 3117 | 0.004 |
| 3118 | 0.004 |
| 3119 | 0.004 |
| 3120 | 0.004 |
| 3121 | 0.004 |
| 3122 | 0.004 |
| 3123 | 0.004 |
| 3124 | 0.004 |
| 3125 | 0.004 |
| 3126 | 0.004 |
| 3127 | 0.004 |
| 3128 | 0.004 |
| 3129 | 0.004 |
| 3130 | 0.004 |
| 3131 | 0.004 |
| 3132 | 0.004 |
| 3133 | 0.004 |
| 3134 | 0.004 |
| 3135 | 0.004 |
| 3136 | 0.004 |
| 3137 | 0.004 |
| 3138 | 0.004 |
| 3139 | 0.004 |
| 3140 | 0.004 |
| 3141 | 0.004 |
| 3142 | 0.004 |
| 3143 | 0.004 |
| 3144 | 0.004 |
| 3145 | 0.004 |
| 3146 | 0.004 |
| 3147 | 0.004 |
| 3148 | 0.004 |
| 3149 | 0.004 |
| 3150 | 0.004 |
| 3151 | 0.004 |
| 3152 | 0.004 |
| 3153 | 0.004 |
| 3154 | 0.004 |
| 3155 | 0.004 |
| 3156 | 0.004 |
| 3157 | 0.004 |
| 3158 | 0.004 |
| 3159 | 0.004 |
| 3160 | 0.004 |
| 3161 | 0.004 |
| 3162 | 0.004 |
| 3163 | 0.004 |
| 3164 | 0.004 |
| 3165 | 0.004 |
| 3166 | 0.004 |
| 3167 | 0.004 |
| 3168 | 0.004 |
| 3169 | 0.004 |
| 3170 | 0.004 |
| 3171 | 0.004 |
| 3172 | 0.004 |
| 3173 | 0.004 |
| 3174 | 0.004 |
| 3175 | 0.004 |
| 3176 | 0.004 |
| 3177 | 0.004 |
| 3178 | 0.004 |
| 3179 | 0.004 |
| 3180 | 0.004 |
| 3181 | 0.004 |
| 3182 | 0.004 |
| 3183 | 0.004 |
| 3184 | 0.004 |
| 3185 | 0.004 |
| 3186 | 0.004 |
| 3187 | 0.004 |
| 3188 | 0.004 |
| 3189 | 0.004 |
| 3190 | 0.004 |
| 3191 | 0.004 |
| 3192 | 0.004 |
| 3193 | 0.004 |
| 3194 | 0.004 |
| 3195 | 0.004 |
| 3196 | 0.004 |
| 3197 | 0.004 |
| 3198 | 0.004 |
| 3199 | 0.004 |
| 3200 | 0.004 |
| 3201 | 0.004 |
| 3202 | 0.004 |
| 3203 | 0.004 |
| 3204 | 0.004 |
| 3205 | 0.004 |
| 3206 | 0.004 |
| 3207 | 0.004 |
| 3208 | 0.004 |
| 3209 | 0.004 |
| 3210 | 0.004 |
| 3211 | 0.004 |
| 3212 | 0.004 |
| 3213 | 0.004 |
| 3214 | 0.004 |
| 3215 | 0.004 |
| 3216 | 0.004 |
| 3217 | 0.004 |
| 3218 | 0.004 |
| 3219 | 0.004 |
| 3220 | 0.004 |
| 3221 | 0.004 |
| 3222 | 0.004 |
| 3223 | 0.004 |
| 3224 | 0.004 |
| 3225 | 0.004 |
| 3226 | 0.004 |
| 3227 | 0.004 |
| 3228 | 0.004 |
| 3229 | 0.004 |
| 3230 | 0.004 |
| 3231 | 0.004 |
| 3232 | 0.004 |
| 3233 | 0.004 |
| 3234 | 0.004 |
| 3235 | 0.004 |
| 3236 | 0.004 |
| 3237 | 0.004 |
| 3238 | 0.004 |
| 3239 | 0.004 |
| 3240 | 0.004 |
| 3241 | 0.004 |
| 3242 | 0.004 |
| 3243 | 0.004 |
| 3244 | 0.004 |
| 3245 | 0.004 |
| 3246 | 0.004 |
| 3247 | 0.004 |
| 3248 | 0.004 |
| 3249 | 0.004 |
| 3250 | 0.004 |
| 3251 | 0.004 |
| 3252 | 0.004 |
| 3253 | 0.004 |
| 3254 | 0.004 |
| 3255 | 0.004 |
| 3256 | 0.004 |
| 3257 | 0.004 |
| 3258 | 0.004 |
| 3259 | 0.004 |
| 3260 | 0.004 |
| 3261 | 0.004 |
| 3262 | 0.004 |
| 3263 | 0.004 |
| 3264 | 0.004 |
| 3265 | 0.004 |
| 3266 | 0.004 |
| 3267 | 0.004 |
| 3268 | 0.004 |
| 3269 | 0.004 |
| 3270 | 0.004 |
| 3271 | 0.004 |
| 3272 | 0.004 |
| 3273 | 0.004 |
| 3274 | 0.004 |
| 3275 | 0.004 |
| 3276 | 0.004 |
| 3277 | 0.004 |
| 3278 | 0.004 |
| 3279 | 0.004 |
| 3280 | 0.004 |
| 3281 | 0.004 |
| 3282 | 0.004 |
| 3283 | 0.004 |
| 3284 | 0.004 |
| 3285 | 0.004 |
| 3286 | 0.004 |
| 3287 | 0.004 |
| 3288 | 0.004 |
| 3289 | 0.004 |
| 3290 | 0.004 |
| 3291 | 0.004 |
| 3292 | 0.004 |
| 3293 | 0.004 |
| 3294 | 0.004 |
| 3295 | 0.004 |
| 3296 | 0.004 |
| 3297 | 0.004 |
| 3298 | 0.004 |
| 3299 | 0.004 |
| 3300 | 0.004 |
| 3301 | 0.004 |
| 3302 | 0.004 |
| 3303 | 0.004 |
| 3304 | 0.004 |
| 3305 | 0.004 |
| 3306 | 0.004 |
| 3307 | 0.004 |
| 3308 | 0.004 |
| 3309 | 0.004 |
| 3310 | 0.004 |
| 3311 | 0.004 |
| 3312 | 0.004 |
| 3313 | 0.004 |
| 3314 | 0.004 |
| 3315 | 0.004 |
| 3316 | 0.004 |
| 3317 | 0.004 |
| 3318 | 0.004 |
| 3319 | 0.004 |
| 3320 | 0.004 |
| 3321 | 0.004 |
| 3322 | 0.004 |
| 3323 | 0.004 |
| 3324 | 0.004 |
| 3325 | 0.004 |
| 3326 | 0.004 |
| 3327 | 0.004 |
| 3328 | 0.004 |
| 3329 | 0.004 |
| 3330 | 0.004 |
| 3331 | 0.004 |
| 3332 | 0.004 |
| 3333 | 0.004 |
| 3334 | 0.004 |
| 3335 | 0.004 |
| 3336 | 0.004 |
| 3337 | 0.004 |
| 3338 | 0.004 |
| 3339 | 0.004 |
| 3340 | 0.004 |
| 3341 | 0.004 |
| 3342 | 0.004 |
| 3343 | 0.004 |
| 3344 | 0.004 |
| 3345 | 0.004 |
| 3346 | 0.004 |
| 3347 | 0.004 |
| 3348 | 0.004 |
| 3349 | 0.004 |
| 3350 | 0.004 |
| 3351 | 0.004 |
| 3352 | 0.004 |
| 3353 | 0.004 |
| 3354 | 0.004 |
| 3355 | 0.004 |
| 3356 | 0.004 |
| 3357 | 0.004 |
| 3358 | 0.004 |
| 3359 | 0.004 |
| 3360 | 0.004 |
| 3361 | 0.004 |
| 3362 | 0.004 |
| 3363 | 0.004 |
| 3364 | 0.004 |
| 3365 | 0.004 |
| 3366 | 0.004 |
| 3367 | 0.004 |
| 3368 | 0.004 |
| 3369 | 0.004 |
| 3370 | 0.004 |
| 3371 | 0.004 |
| 3372 | 0.004 |
| 3373 | 0.004 |
| 3374 | 0.004 |
| 3375 | 0.004 |
| 3376 | 0.004 |
| 3377 | 0.004 |
| 3378 | 0.004 |
| 3379 | 0.004 |
| 3380 | 0.004 |
| 3381 | 0.004 |
| 3382 | 0.004 |
| 3383 | 0.004 |
| 3384 | 0.004 |
| 3385 | 0.004 |
| 3386 | 0.004 |
| 3387 | 0.004 |
| 3388 | 0.004 |
| 3389 | 0.004 |
| 3390 | 0.004 |
| 3391 | 0.004 |
| 3392 | 0.004 |
| 3393 | 0.004 |
| 3394 | 0.004 |
| 3395 | 0.004 |
| 3396 | 0.004 |
| 3397 | 0.004 |
| 3398 | 0.004 |
| 3399 | 0.004 |
| 3400 | 0.004 |
| 3401 | 0.004 |
| 3402 | 0.004 |
| 3403 | 0.004 |
| 3404 | 0.004 |
| 3405 | 0.004 |
| 3406 | 0.004 |
| 3407 | 0.004 |
| 3408 | 0.004 |
| 3409 | 0.004 |
| 3410 | 0.004 |
| 3411 | 0.004 |
| 3412 | 0.004 |
| 3413 | 0.004 |
| 3414 | 0.004 |
| 3415 | 0.004 |
| 3416 | 0.004 |
| 3417 | 0.004 |
| 3418 | 0.004 |
| 3419 | 0.004 |
| 3420 | 0.004 |
| 3421 | 0.004 |
| 3422 | 0.004 |
| 3423 | 0.004 |
| 3424 | 0.004 |
| 3425 | 0.004 |
| 3426 | 0.004 |
| 3427 | 0.004 |
| 3428 | 0.004 |
| 3429 | 0.004 |
| 3430 | 0.004 |
| 3431 | 0.004 |
| 3432 | 0.004 |
| 3433 | 0.004 |
| 3434 | 0.004 |
| 3435 | 0.004 |
| 3436 | 0.004 |
| 3437 | 0.004 |
| 3438 | 0.004 |
| 3439 | 0.004 |
| 3440 | 0.004 |
| 3441 | 0.004 |
| 3442 | 0.004 |
| 3443 | 0.004 |
| 3444 | 0.004 |
| 3445 | 0.004 |
| 3446 | 0.004 |
| 3447 | 0.004 |
| 3448 | 0.004 |
| 3449 | 0.004 |
| 3450 | 0.004 |
| 3451 | 0.004 |
| 3452 | 0.004 |
| 3453 | 0.004 |
| 3454 | 0.004 |
| 3455 | 0.004 |
| 3456 | 0.004 |
| 3457 | 0.004 |
| 3458 | 0.004 |
| 3459 | 0.004 |
| 3460 | 0.004 |
| 3461 | 0.004 |
| 3462 | 0.004 |
| 3463 | 0.004 |
| 3464 | 0.004 |
| 3465 | 0.004 |
| 3466 | 0.004 |
| 3467 | 0.004 |
| 3468 | 0.004 |
| 3469 | 0.004 |
| 3470 | 0.004 |
| 3471 | 0.004 |
| 3472 | 0.004 |
| 3473 | 0.004 |
| 3474 | 0.004 |
| 3475 | 0.004 |
| 3476 | 0.004 |
| 3477 | 0.004 |
| 3478 | 0.004 |
| 3479 | 0.004 |
| 3480 | 0.004 |
| 3481 | 0.004 |
| 3482 | 0.004 |
| 3483 | 0.004 |
| 3484 | 0.004 |
| 3485 | 0.004 |
| 3486 | 0.004 |
| 3487 | 0.004 |
| 3488 | 0.004 |
| 3489 | 0.004 |
| 3490 | 0.004 |
| 3491 | 0.004 |
| 3492 | 0.004 |
| 3493 | 0.004 |
| 3494 | 0.004 |
| 3495 | 0.004 |
| 3496 | 0.004 |
| 3497 | 0.004 |
| 3498 | 0.004 |
| 3499 | 0.004 |
| 3500 | 0.004 |
| 3501 | 0.004 |
| 3502 | 0.004 |
| 3503 | 0.004 |
| 3504 | 0.004 |
| 3505 | 0.004 |
| 3506 | 0.004 |
| 3507 | 0.004 |
| 3508 | 0.004 |
| 3509 | 0.004 |
| 3510 | 0.004 |
| 3511 | 0.004 |
| 3512 | 0.004 |
| 3513 | 0.004 |
| 3514 | 0.004 |
| 3515 | 0.004 |
| 3516 | 0.004 |
| 3517 | 0.004 |
| 3518 | 0.004 |
| 3519 | 0.004 |
| 3520 | 0.004 |
| 3521 | 0.004 |
| 3522 | 0.004 |
| 3523 | 0.004 |
| 3524 | 0.004 |
| 3525 | 0.004 |
| 3526 | 0.004 |
| 3527 | 0.004 |
| 3528 | 0.004 |
| 3529 | 0.004 |
| 3530 | 0.004 |
| 3531 | 0.004 |
| 3532 | 0.004 |
| 3533 | 0.004 |
| 3534 | 0.004 |
| 3535 | 0.004 |
| 3536 | 0.004 |
| 3537 | 0.004 |
| 3538 | 0.004 |
| 3539 | 0.004 |
| 3540 | 0.004 |
| 3541 | 0.004 |
| 3542 | 0.004 |
| 3543 | 0.004 |
| 3544 | 0.004 |
| 3545 | 0.004 |
| 3546 | 0.004 |
| 3547 | 0.004 |
| 3548 | 0.004 |
| 3549 | 0.004 |
| 3550 | 0.004 |
| 3551 | 0.004 |
| 3552 | 0.004 |
| 3553 | 0.004 |
| 3554 | 0.004 |
| 3555 | 0.004 |
| 3556 | 0.004 |
| 3557 | 0.004 |
| 3558 | 0.004 |
| 3559 | 0.004 |
| 3560 | 0.004 |
| 3561 | 0.004 |
| 3562 | 0.004 |
| 3563 | 0.004 |
| 3564 | 0.004 |
| 3565 | 0.004 |
| 3566 | 0.004 |
| 3567 | 0.004 |
| 3568 | 0.004 |
| 3569 | 0.004 |
| 3570 | 0.004 |
| 3571 | 0.004 |
| 3572 | 0.004 |
| 3573 | 0.004 |
| 3574 | 0.004 |
| 3575 | 0.004 |
| 3576 | 0.004 |
| 3577 | 0.004 |
| 3578 | 0.004 |
| 3579 | 0.004 |
| 3580 | 0.004 |
| 3581 | 0.004 |
| 3582 | 0.004 |
| 3583 | 0.004 |
| 3584 | 0.004 |
| 3585 | 0.004 |
| 3586 | 0.004 |
| 3587 | 0.004 |
| 3588 | 0.004 |
| 3589 | 0.004 |
| 3590 | 0.004 |
| 3591 | 0.004 |
| 3592 | 0.004 |
| 3593 | 0.004 |
| 3594 | 0.004 |
| 3595 | 0.004 |
| 3596 | 0.004 |
| 3597 | 0.004 |
| 3598 | 0.004 |
| 3599 | 0.004 |
| 3600 | 0.004 |
| 3601 | 0.004 |
| 3602 | 0.004 |
| 3603 | 0.004 |
| 3604 | 0.004 |
| 3605 | 0.004 |
| 3606 | 0.004 |
| 3607 | 0.004 |
| 3608 | 0.004 |
| 3609 | 0.004 |
| 3610 | 0.004 |
| 3611 | 0.004 |
| 3612 | 0.004 |
| 3613 | 0.004 |
| 3614 | 0.004 |
| 3615 | 0.004 |
| 3616 | 0.004 |
| 3617 | 0.004 |
| 3618 | 0.004 |
| 3619 | 0.004 |
| 3620 | 0.004 |
| 3621 | 0.004 |
| 3622 | 0.004 |
| 3623 | 0.004 |
| 3624 | 0.004 |
| 3625 | 0.004 |
| 3626 | 0.004 |
| 3627 | 0.004 |
| 3628 | 0.004 |
| 3629 | 0.004 |
| 3630 | 0.004 |
| 3631 | 0.004 |
| 3632 | 0.004 |
| 3633 | 0.004 |
| 3634 | 0.004 |
| 3635 | 0.004 |
| 3636 | 0.004 |
| 3637 | 0.004 |
| 3638 | 0.004 |
| 3639 | 0.004 |
| 3640 | 0.004 |
| 3641 | 0.004 |
| 3642 | 0.004 |
| 3643 | 0.004 |
| 3644 | 0.004 |
| 3645 | 0.004 |
| 3646 | 0.004 |
| 3647 | 0.004 |
| 3648 | 0.004 |
| 3649 | 0.004 |
| 3650 | 0.004 |
| 3651 | 0.004 |
| 3652 | 0.004 |
| 3653 | 0.004 |
| 3654 | 0.004 |
| 3655 | 0.004 |
| 3656 | 0.004 |
| 3657 | 0.004 |
| 3658 | 0.004 |
| 3659 | 0.004 |
| 3660 | 0.004 |
| 3661 | 0.004 |
| 3662 | 0.004 |
| 3663 | 0.004 |
| 3664 | 0.004 |
| 3665 | 0.004 |
| 3666 | 0.004 |
| 3667 | 0.004 |
| 3668 | 0.004 |
| 3669 | 0.004 |
| 3670 | 0.004 |
| 3671 | 0.004 |
| 3672 | 0.004 |
| 3673 | 0.004 |
| 3674 | 0.004 |
| 3675 | 0.004 |
| 3676 | 0.004 |
| 3677 | 0.004 |
| 3678 | 0.004 |
| 3679 | 0.004 |
| 3680 | 0.004 |
| 3681 | 0.004 |
| 3682 | 0.004 |
| 3683 | 0.004 |
| 3684 | 0.004 |
| 3685 | 0.004 |
| 3686 | 0.004 |
| 3687 | 0.004 |
| 3688 | 0.004 |
| 3689 | 0.004 |
| 3690 | 0.004 |
| 3691 | 0.004 |
| 3692 | 0.004 |
| 3693 | 0.004 |
| 3694 | 0.004 |
| 3695 | 0.004 |
| 3696 | 0.004 |
| 3697 | 0.004 |
| 3698 | 0.004 |
| 3699 | 0.004 |
| 3700 | 0.004 |
| 3701 | 0.004 |
| 3702 | 0.004 |
| 3703 | 0.004 |
| 3704 | 0.004 |
| 3705 | 0.004 |
| 3706 | 0.004 |
| 3707 | 0.004 |
| 3708 | 0.004 |
| 3709 | 0.004 |
| 3710 | 0.004 |
| 3711 | 0.004 |
| 3712 | 0.004 |
| 3713 | 0.004 |
| 3714 | 0.004 |
| 3715 | 0.004 |
| 3716 | 0.004 |
| 3717 | 0.004 |
| 3718 | 0.004 |
| 3719 | 0.004 |
| 3720 | 0.004 |
| 3721 | 0.004 |
| 3722 | 0.004 |
| 3723 | 0.004 |
| 3724 | 0.004 |
| 3725 | 0.004 |
| 3726 | 0.004 |
| 3727 | 0.004 |
| 3728 | 0.004 |
| 3729 | 0.004 |
| 3730 | 0.004 |
| 3731 | 0.004 |
| 3732 | 0.004 |
| 3733 | 0.004 |
| 3734 | 0.004 |
| 3735 | 0.004 |
| 3736 | 0.004 |
| 3737 | 0.004 |
| 3738 | 0.004 |
| 3739 | 0.004 |
| 3740 | 0.004 |
| 3741 | 0.004 |
| 3742 | 0.004 |
| 3743 | 0.004 |
| 3744 | 0.004 |
| 3745 | 0.004 |
| 3746 | 0.004 |
| 3747 | 0.004 |
| 3748 | 0.004 |
| 3749 | 0.004 |
| 3750 | 0.004 |
| 3751 | 0.004 |
| 3752 | 0.004 |
| 3753 | 0.004 |
| 3754 | 0.004 |
| 3755 | 0.004 |
| 3756 | 0.004 |
| 3757 | 0.004 |
| 3758 | 0.004 |
| 3759 | 0.004 |
| 3760 | 0.004 |
| 3761 | 0.004 |
| 3762 | 0.004 |
| 3763 | 0.004 |
| 3764 | 0.004 |
| 3765 | 0.004 |
| 3766 | 0.004 |
| 3767 | 0.004 |
| 3768 | 0.004 |
| 3769 | 0.004 |
| 3770 | 0.004 |
| 3771 | 0.004 |
| 3772 | 0.004 |
| 3773 | 0.004 |
| 3774 | 0.004 |
| 3775 | 0.004 |
| 3776 | 0.004 |
| 3777 | 0.004 |
| 3778 | 0.004 |
| 3779 | 0.004 |
| 3780 | 0.004 |
| 3781 | 0.004 |
| 3782 | 0.004 |
| 3783 | 0.004 |
| 3784 | 0.004 |
| 3785 | 0.004 |
| 3786 | 0.004 |
| 3787 | 0.004 |
| 3788 | 0.004 |
| 3789 | 0.004 |
| 3790 | 0.004 |
| 3791 | 0.004 |
| 3792 | 0.004 |
| 3793 | 0.004 |
| 3794 | 0.004 |
| 3795 | 0.004 |
| 3796 | 0.004 |
| 3797 | 0.004 |
| 3798 | 0.004 |
| 3799 | 0.004 |
| 3800 | 0.004 |
| 3801 | 0.004 |
| 3802 | 0.004 |
| 3803 | 0.004 |
| 3804 | 0.004 |
| 3805 | 0.004 |
| 3806 | 0.004 |
| 3807 | 0.004 |
| 3808 | 0.004 |
| 3809 | 0.004 |
| 3810 | 0.004 |
| 3811 | 0.004 |
| 3812 | 0.004 |
| 3813 | 0.004 |
| 3814 | 0.004 |
| 3815 | 0.004 |
| 3816 | 0.004 |
| 3817 | 0.004 |
| 3818 | 0.004 |
| 3819 | 0.004 |
| 3820 | 0.004 |
| 3821 | 0.004 |
| 3822 | 0.004 |
| 3823 | 0.004 |
| 3824 | 0.004 |
| 3825 | 0.004 |
| 3826 | 0.004 |
| 3827 | 0.004 |
| 3828 | 0.004 |
| 3829 | 0.004 |
| 3830 | 0.004 |
| 3831 | 0.004 |
| 3832 | 0.004 |
| 3833 | 0.004 |
| 3834 | 0.004 |
| 3835 | 0.004 |
| 3836 | 0.004 |
| 3837 | 0.004 |
| 3838 | 0.004 |
| 3839 | 0.004 |
| 3840 | 0.004 |
| 3841 | 0.004 |
| 3842 | 0.004 |
| 3843 | 0.004 |
| 3844 | 0.004 |
| 3845 | 0.004 |
| 3846 | 0.004 |
| 3847 | 0.004 |
| 3848 | 0.004 |
| 3849 | 0.004 |
| 3850 | 0.004 |
| 3851 | 0.004 |
| 3852 | 0.004 |
| 3853 | 0.004 |
| 3854 | 0.004 |
| 3855 | 0.004 |
| 3856 | 0.004 |
| 3857 | 0.004 |
| 3858 | 0.004 |
| 3859 | 0.004 |
| 3860 | 0.004 |
| 3861 | 0.004 |
| 3862 | 0.004 |
| 3863 | 0.004 |
| 3864 | 0.004 |
| 3865 | 0.004 |
| 3866 | 0.004 |
| 3867 | 0.004 |
| 3868 | 0.004 |
| 3869 | 0.004 |
| 3870 | 0.004 |
| 3871 | 0.004 |
| 3872 | 0.004 |
| 3873 | 0.004 |
| 3874 | 0.004 |
| 3875 | 0.004 |
| 3876 | 0.004 |
| 3877 | 0.004 |
| 3878 | 0.004 |
| 3879 | 0.004 |
| 3880 | 0.004 |
| 3881 | 0.004 |
| 3882 | 0.004 |
| 3883 | 0.004 |
| 3884 | 0.004 |
| 3885 | 0.004 |
| 3886 | 0.004 |
| 3887 | 0.004 |
| 3888 | 0.004 |
| 3889 | 0.004 |
| 3890 | 0.004 |
| 3891 | 0.004 |
| 3892 | 0.004 |
| 3893 | 0.004 |
| 3894 | 0.004 |
| 3895 | 0.004 |
| 3896 | 0.004 |
| 3897 | 0.004 |
| 3898 | 0.004 |
| 3899 | 0.004 |
| 3900 | 0.004 |
| 3901 | 0.004 |
| 3902 | 0.004 |
| 3903 | 0.004 |
| 3904 | 0.004 |
| 3905 | 0.004 |
| 3906 | 0.004 |
| 3907 | 0.004 |
| 3908 | 0.004 |
| 3909 | 0.004 |
| 3910 | 0.004 |
| 3911 | 0.004 |
| 3912 | 0.004 |
| 3913 | 0.004 |
| 3914 | 0.004 |
| 3915 | 0.004 |
| 3916 | 0.004 |
| 3917 | 0.004 |
| 3918 | 0.004 |
| 3919 | 0.004 |
| 3920 | 0.004 |
| 3921 | 0.004 |
| 3922 | 0.004 |
| 3923 | 0.004 |
| 3924 | 0.004 |
| 3925 | 0.004 |
| 3926 | 0.004 |
| 3927 | 0.004 |
| 3928 | 0.004 |
| 3929 | 0.004 |
| 3930 | 0.004 |
| 3931 | 0.004 |
| 3932 | 0.004 |
| 3933 | 0.004 |
| 3934 | 0.004 |
| 3935 | 0.004 |
| 3936 | 0.004 |
| 3937 | 0.004 |
| 3938 | 0.004 |
| 3939 | 0.004 |
| 3940 | 0.004 |
| 3941 | 0.004 |
| 3942 | 0.004 |
| 3943 | 0.004 |
| 3944 | 0.004 |
| 3945 | 0.004 |
| 3946 | 0.004 |
| 3947 | 0.004 |
| 3948 | 0.004 |
| 3949 | 0.004 |
| 3950 | 0.004 |
| 3951 | 0.004 |
| 3952 | 0.004 |
| 3953 | 0.004 |
| 3954 | 0.004 |
| 3955 | 0.004 |
| 3956 | 0.004 |
| 3957 | 0.004 |
| 3958 | 0.004 |
| 3959 | 0.004 |
| 3960 | 0.004 |
| 3961 | 0.004 |
| 3962 | 0.004 |
| 3963 | 0.004 |
| 3964 | 0.004 |
| 3965 | 0.004 |
| 3966 | 0.004 |
| 3967 | 0.004 |
| 3968 | 0.004 |
| 3969 | 0.004 |
| 3970 | 0.004 |
| 3971 | 0.004 |
| 3972 | 0.004 |
| 3973 | 0.004 |
| 3974 | 0.004 |
| 3975 | 0.004 |
| 3976 | 0.004 |
| 3977 | 0.004 |
| 3978 | 0.004 |
| 3979 | 0.004 |
| 3980 | 0.004 |
| 3981 | 0.004 |
| 3982 | 0.004 |
| 3983 | 0.004 |
| 3984 | 0.004 |
| 3985 | 0.004 |
| 3986 | 0.004 |
| 3987 | 0.004 |
| 3988 | 0.004 |
| 3989 | 0.004 |
| 3990 | 0.004 |
| 3991 | 0.004 |
| 3992 | 0.004 |
| 3993 | 0.004 |
| 3994 | 0.004 |
| 3995 | 0.004 |
| 3996 | 0.004 |
| 3997 | 0.004 |
| 3998 | 0.004 |
| 3999 | 0.004 |
| 4000 | 0.004 |
| 4001 | 0.004 |
| 4002 | 0.004 |
| 4003 | 0.004 |
| 4004 | 0.004 |
| 4005 | 0.004 |
| 4006 | 0.004 |
| 4007 | 0.004 |
| 4008 | 0.004 |
| 4009 | 0.004 |
| 4010 | 0.004 |
| 4011 | 0.004 |
| 4012 | 0.004 |
| 4013 | 0.004 |
| 4014 | 0.004 |
| 4015 | 0.004 |
| 4016 | 0.004 |
| 4017 | 0.004 |
| 4018 | 0.004 |
| 4019 | 0.004 |
| 4020 | 0.004 |
| 4021 | 0.004 |
| 4022 | 0.004 |
| 4023 | 0.004 |
| 4024 | 0.004 |
| 4025 | 0.004 |
| 4026 | 0.004 |
| 4027 | 0.004 |
| 4028 | 0.004 |
| 4029 | 0.004 |
| 4030 | 0.004 |
| 4031 | 0.004 |
| 4032 | 0.004 |
| 4033 | 0.004 |
| 4034 | 0.004 |
| 4035 | 0.004 |
| 4036 | 0.004 |
| 4037 | 0.004 |
| 4038 | 0.004 |
| 4039 | 0.004 |
| 4040 | 0.004 |
| 4041 | 0.004 |
| 4042 | 0.004 |
| 4043 | 0.004 |
| 4044 | 0.004 |
| 4045 | 0.004 |
| 4046 | 0.004 |
| 4047 | 0.004 |
| 4048 | 0.004 |
| 4049 | 0.004 |
| 4050 | 0.004 |
| 4051 | 0.004 |
| 4052 | 0.004 |
| 4053 | 0.004 |
| 4054 | 0.004 |
| 4055 | 0.004 |
| 4056 | 0.004 |
| 4057 | 0.004 |
| 4058 | 0.004 |
| 4059 | 0.004 |
| 4060 | 0.004 |
| 4061 | 0.004 |
| 4062 | 0.004 |
| 4063 | 0.004 |
| 4064 | 0.004 |
| 4065 | 0.004 |
| 4066 | 0.004 |
| 4067 | 0.004 |
| 4068 | 0.004 |
| 4069 | 0.004 |
| 4070 | 0.004 |
| 4071 | 0.004 |
| 4072 | 0.004 |
| 4073 | 0.004 |
| 4074 | 0.004 |
| 4075 | 0.004 |
| 4076 | 0.004 |
| 4077 | 0.004 |
| 4078 | 0.004 |
| 4079 | 0.004 |
| 4080 | 0.004 |
| 4081 | 0.004 |
| 4082 | 0.004 |
| 4083 | 0.004 |
| 4084 | 0.004 |
| 4085 | 0.004 |
| 4086 | 0.004 |
| 4087 | 0.004 |
| 4088 | 0.004 |
| 4089 | 0.004 |
| 4090 | 0.004 |
| 4091 | 0.004 |
| 4092 | 0.004 |
| 4093 | 0.004 |
| 4094 | 0.004 |
| 4095 | 0.004 |
| 4096 | 0.004 |
| 4097 | 0.004 |
| 4098 | 0.004 |
| 4099 | 0.004 |
| 4100 | 0.004 |
| 4101 | 0.004 |
| 4102 | 0.004 |
| 4103 | 0.004 |
| 4104 | 0.004 |
| 4105 | 0.004 |
| 4106 | 0.004 |
| 4107 | 0.004 |
| 4108 | 0.004 |
| 4109 | 0.004 |
| 4110 | 0.004 |
| 4111 | 0.004 |
| 4112 | 0.004 |
| 4113 | 0.004 |
| 4114 | 0.004 |
| 4115 | 0.004 |
| 4116 | 0.004 |
| 4117 | 0.004 |
| 4118 | 0.004 |
| 4119 | 0.004 |
| 4120 | 0.004 |
| 4121 | 0.004 |
| 4122 | 0.004 |
| 4123 | 0.004 |
| 4124 | 0.004 |
| 4125 | 0.004 |
| 4126 | 0.004 |
| 4127 | 0.004 |
| 4128 | 0.004 |
| 4129 | 0.004 |
| 4130 | 0.004 |
| 4131 | 0.004 |
| 4132 | 0.004 |
| 4133 | 0.004 |
| 4134 | 0.004 |
| 4135 | 0.004 |
| 4136 | 0.004 |
| 4137 | 0.004 |
| 4138 | 0.004 |
| 4139 | 0.004 |
| 4140 | 0.004 |
| 4141 | 0.004 |
| 4142 | 0.004 |
| 4143 | 0.004 |
| 4144 | 0.004 |
| 4145 | 0.004 |
| 4146 | 0.004 |
| 4147 | 0.004 |
| 4148 | 0.004 |
| 4149 | 0.004 |
| 4150 | 0.004 |
| 4151 | 0.004 |
| 4152 | 0.004 |
| 4153 | 0.004 |
| 4154 | 0.004 |
| 4155 | 0.004 |
| 4156 | 0.004 |
| 4157 | 0.004 |
| 4158 | 0.004 |
| 4159 | 0.004 |
| 4160 | 0.004 |
| 4161 | 0.004 |
| 4162 | 0.004 |
| 4163 | 0.004 |
| 4164 | 0.004 |
| 4165 | 0.004 |
| 4166 | 0.004 |
| 4167 | 0.004 |
| 4168 | 0.004 |
| 4169 | 0.004 |
| 4170 | 0.004 |
| 4171 | 0.004 |
| 4172 | 0.004 |
| 4173 | 0.004 |
| 4174 | 0.004 |
| 4175 | 0.004 |
| 4176 | 0.004 |
| 4177 | 0.004 |
| 4178 | 0.004 |
| 4179 | 0.004 |
| 4180 | 0.004 |
| 4181 | 0.004 |
| 4182 | 0.004 |
| 4183 | 0.004 |
| 4184 | 0.004 |
| 4185 | 0.004 |
| 4186 | 0.004 |
| 4187 | 0.004 |
| 4188 | 0.004 |
| 4189 | 0.004 |
| 4190 | 0.004 |
| 4191 | 0.004 |
| 4192 | 0.004 |
| 4193 | 0.004 |
| 4194 | 0.004 |
| 4195 | 0.004 |
| 4196 | 0.004 |
| 4197 | 0.004 |
| 4198 | 0.004 |
| 4199 | 0.004 |
| 4200 | 0.004 |
| 4201 | 0.004 |
| 4202 | 0.004 |
| 4203 | 0.004 |
| 4204 | 0.004 |
| 4205 | 0.004 |
| 4206 | 0.004 |
| 4207 | 0.004 |
| 4208 | 0.004 |
| 4209 | 0.004 |
| 4210 | 0.004 |
| 4211 | 0.004 |
| 4212 | 0.004 |
| 4213 | 0.004 |
| 4214 | 0.004 |
| 4215 | 0.004 |
| 4216 | 0.004 |
| 4217 | 0.004 |
| 4218 | 0.004 |
| 4219 | 0.004 |
| 4220 | 0.004 |
| 4221 | 0.004 |
| 4222 | 0.004 |
| 4223 | 0.004 |
| 4224 | 0.004 |
| 4225 | 0.004 |
| 4226 | 0.004 |
| 4227 | 0.004 |
| 4228 | 0.004 |
| 4229 | 0.004 |
| 4230 | 0.004 |
| 4231 | 0.004 |
| 4232 | 0.004 |
| 4233 | 0.004 |
| 4234 | 0.004 |
| 4235 | 0.004 |
| 4236 | 0.004 |
| 4237 | 0.004 |
| 4238 | 0.004 |
| 4239 | 0.004 |
| 4240 | 0.004 |
| 4241 | 0.004 |
| 4242 | 0.004 |
| 4243 | 0.004 |
| 4244 | 0.004 |
| 4245 | 0.004 |
| 4246 | 0.004 |
| 4247 | 0.004 |
| 4248 | 0.004 |
| 4249 | 0.004 |
| 4250 | 0.004 |
| 4251 | 0.004 |
| 4252 | 0.004 |
| 4253 | 0.004 |
| 4254 | 0.004 |
| 4255 | 0.004 |
| 4256 | 0.004 |
| 4257 | 0.004 |
| 4258 | 0.004 |
| 4259 | 0.004 |
| 4260 | 0.004 |
| 4261 | 0.004 |
| 4262 | 0.004 |
| 4263 | 0.004 |
| 4264 | 0.004 |
| 4265 | 0.004 |
| 4266 | 0.004 |
| 4267 | 0.004 |
| 4268 | 0.004 |
| 4269 | 0.004 |
| 4270 | 0.004 |
| 4271 | 0.004 |
| 4272 | 0.004 |
| 4273 | 0.004 |
| 4274 | 0.004 |
| 4275 | 0.004 |
| 4276 | 0.004 |
| 4277 | 0.004 |
| 4278 | 0.004 |
| 4279 | 0.004 |
| 4280 | 0.004 |
| 4281 | 0.004 |
| 4282 | 0.004 |
| 4283 | 0.004 |
| 4284 | 0.004 |
| 4285 | 0.004 |
| 4286 | 0.004 |
| 4287 | 0.004 |
| 4288 | 0.004 |
| 4289 | 0.004 |
| 4290 | 0.004 |
| 4291 | 0.004 |
| 4292 | 0.004 |
| 4293 | 0.004 |
| 4294 | 0.004 |
| 4295 | 0.004 |
| 4296 | 0.004 |
| 4297 | 0.004 |
| 4298 | 0.004 |
| 4299 | 0.004 |
| 4300 | 0.004 |
| 4301 | 0.004 |
| 4302 | 0.004 |
| 4303 | 0.004 |
| 4304 | 0.004 |
| 4305 | 0.004 |
| 4306 | 0.004 |
| 4307 | 0.004 |
| 4308 | 0.004 |
| 4309 | 0.004 |
| 4310 | 0.004 |
| 4311 | 0.004 |
| 4312 | 0.004 |
| 4313 | 0.004 |
| 4314 | 0.004 |
| 4315 | 0.004 |
| 4316 | 0.004 |
| 4317 | 0.004 |
| 4318 | 0.004 |
| 4319 | 0.004 |
| 4320 | 0.004 |
| 4321 | 0.004 |
| 4322 | 0.004 |
| 4323 | 0.004 |
| 4324 | 0.004 |
| 4325 | 0.004 |
| 4326 | 0.004 |
| 4327 | 0.004 |
| 4328 | 0.004 |
| 4329 | 0.004 |
| 4330 | 0.004 |
| 4331 | 0.004 |
| 4332 | 0.004 |
| 4333 | 0.004 |
| 4334 | 0.004 |
| 4335 | 0.004 |
| 4336 | 0.004 |
| 4337 | 0.004 |
| 4338 | 0.004 |
| 4339 | 0.004 |
| 4340 | 0.004 |
| 4341 | 0.004 |
| 4342 | 0.004 |
| 4343 | 0.004 |
| 4344 | 0.004 |
| 4345 | 0.004 |
| 4346 | 0.004 |
| 4347 | 0.004 |
| 4348 | 0.004 |
| 4349 | 0.004 |
| 4350 | 0.004 |
| 4351 | 0.004 |
| 4352 | 0.004 |
| 4353 | 0.004 |
| 4354 | 0.004 |
| 4355 | 0.004 |
| 4356 | 0.004 |
| 4357 | 0.004 |
| 4358 | 0.004 |
| 4359 | 0.004 |
| 4360 | 0.004 |
| 4361 | 0.004 |
| 4362 | 0.004 |
| 4363 | 0.004 |
| 4364 | 0.004 |
| 4365 | 0.004 |
| 4366 | 0.004 |
| 4367 | 0.004 |
| 4368 | 0.004 |
| 4369 | 0.004 |
| 4370 | 0.004 |
| 4371 | 0.004 |
| 4372 | 0.004 |
| 4373 | 0.004 |
| 4374 | 0.004 |
| 4375 | 0.004 |
| 4376 | 0.004 |
| 4377 | 0.004 |
| 4378 | 0.004 |
| 4379 | 0.004 |
| 4380 | 0.004 |
| 4381 | 0.004 |
| 4382 | 0.004 |
| 4383 | 0.004 |
| 4384 | 0.004 |
| 4385 | 0.004 |
| 4386 | 0.004 |
| 4387 | 0.004 |
| 4388 | 0.004 |
| 4389 | 0.004 |
| 4390 | 0.004 |
| 4391 | 0.004 |
| 4392 | 0.004 |
| 4393 | 0.004 |
| 4394 | 0.004 |
| 4395 | 0.004 |
| 4396 | 0.004 |
| 4397 | 0.004 |
| 4398 | 0.004 |
| 4399 | 0.004 |
| 4400 | 0.004 |
| 4401 | 0.004 |
| 4402 | 0.004 |
| 4403 | 0.004 |
| 4404 | 0.004 |
| 4405 | 0.004 |
| 4406 | 0.004 |
| 4407 | 0.004 |
| 4408 | 0.004 |
| 4409 | 0.004 |
| 4410 | 0.004 |
| 4411 | 0.004 |
| 4412 | 0.004 |
| 4413 | 0.004 |
| 4414 | 0.004 |
| 4415 | 0.004 |
| 4416 | 0.004 |
| 4417 | 0.004 |
| 4418 | 0.004 |
| 4419 | 0.004 |
| 4420 | 0.004 |
| 4421 | 0.004 |
| 4422 | 0.004 |
| 4423 | 0.004 |
| 4424 | 0.004 |
| 4425 | 0.004 |
| 4426 | 0.004 |
| 4427 | 0.004 |
| 4428 | 0.004 |
| 4429 | 0.004 |
| 4430 | 0.004 |
| 4431 | 0.004 |
| 4432 | 0.004 |
| 4433 | 0.004 |
| 4434 | 0.004 |
| 4435 | 0.004 |
| 4436 | 0.004 |
| 4437 | 0.004 |
| 4438 | 0.004 |
| 4439 | 0.004 |
| 4440 | 0.004 |
| 4441 | 0.004 |
| 4442 | 0.004 |
| 4443 | 0.004 |
| 4444 | 0.004 |
| 4445 | 0.004 |
| 4446 | 0.004 |
| 4447 | 0.004 |
| 4448 | 0.004 |
| 4449 | 0.004 |
| 4450 | 0.004 |
| 4451 | 0.004 |
| 4452 | 0.004 |
| 4453 | 0.004 |
| 4454 | 0.004 |
| 4455 | 0.004 |
| 4456 | 0.004 |
| 4457 | 0.004 |
| 4458 | 0.004 |
| 4459 | 0.004 |
| 4460 | 0.004 |
| 4461 | 0.004 |
| 4462 | 0.004 |
| 4463 | 0.004 |
| 4464 | 0.004 |
| 4465 | 0.004 |
| 4466 | 0.004 |
| 4467 | 0.004 |
| 4468 | 0.004 |
| 4469 | 0.004 |
| 4470 | 0.004 |
| 4471 | 0.004 |
| 4472 | 0.004 |
| 4473 | 0.004 |
| 4474 | 0.004 |
| 4475 | 0.004 |
| 4476 | 0.004 |
| 4477 | 0.004 |
| 4478 | 0.004 |
| 4479 | 0.004 |
| 4480 | 0.004 |
| 4481 | 0.004 |
| 4482 | 0.004 |
| 4483 | 0.004 |
| 4484 | 0.004 |
| 4485 | 0.004 |
| 4486 | 0.004 |
| 4487 | 0.004 |
| 4488 | 0.004 |
| 4489 | 0.004 |
| 4490 | 0.004 |
| 4491 | 0.004 |
| 4492 | 0.004 |
| 4493 | 0.004 |
| 4494 | 0.004 |
| 4495 | 0.004 |
| 4496 | 0.004 |
| 4497 | 0.004 |
| 4498 | 0.004 |
| 4499 | 0.004 |
| 4500 | 0.004 |
| 4501 | 0.004 |
| 4502 | 0.004 |
| 4503 | 0.004 |
| 4504 | 0.004 |
| 4505 | 0.004 |
| 4506 | 0.004 |
| 4507 | 0.004 |
| 4508 | 0.004 |
| 4509 | 0.004 |
| 4510 | 0.004 |
| 4511 | 0.004 |
| 4512 | 0.004 |
| 4513 | 0.004 |
| 4514 | 0.004 |
| 4515 | 0.004 |
| 4516 | 0.004 |
| 4517 | 0.004 |
| 4518 | 0.004 |
| 4519 | 0.004 |
| 4520 | 0.004 |
| 4521 | 0.004 |
| 4522 | 0.004 |
| 4523 | 0.004 |
| 4524 | 0.004 |
| 4525 | 0.004 |
| 4526 | 0.004 |
| 4527 | 0.004 |
| 4528 | 0.004 |
| 4529 | 0.004 |
| 4530 | 0.004 |
| 4531 | 0.004 |
| 4532 | 0.004 |
| 4533 | 0.004 |
| 4534 | 0.004 |
| 4535 | 0.004 |
| 4536 | 0.004 |
| 4537 | 0.004 |
| 4538 | 0.004 |
| 4539 | 0.004 |
| 4540 | 0.004 |
| 4541 | 0.004 |
| 4542 | 0.004 |
| 4543 | 0.004 |
| 4544 | 0.004 |
| 4545 | 0.004 |
| 4546 | 0.004 |
| 4547 | 0.004 |
| 4548 | 0.004 |
| 4549 | 0.004 |
| 4550 | 0.004 |
| 4551 | 0.004 |
| 4552 | 0.004 |
| 4553 | 0.004 |
| 4554 | 0.004 |
| 4555 | 0.004 |
| 4556 | 0.004 |
| 4557 | 0.004 |
| 4558 | 0.004 |
| 4559 | 0.004 |
| 4560 | 0.004 |
| 4561 | 0.004 |
| 4562 | 0.004 |
| 4563 | 0.004 |
| 4564 | 0.004 |
| 4565 | 0.004 |
| 4566 | 0.004 |
| 4567 | 0.004 |
| 4568 | 0.004 |
| 4569 | 0.004 |
| 4570 | 0.004 |
| 4571 | 0.004 |
| 4572 | 0.004 |
| 4573 | 0.004 |
| 4574 | 0.004 |
| 4575 | 0.004 |
| 4576 | 0.004 |
| 4577 | 0.004 |
| 4578 | 0.004 |
| 4579 | 0.004 |
| 4580 | 0.004 |
| 4581 | 0.004 |
| 4582 | 0.004 |
| 4583 | 0.004 |
| 4584 | 0.004 |
| 4585 | 0.004 |
| 4586 | 0.004 |
| 4587 | 0.004 |
| 4588 | 0.004 |
| 4589 | 0.004 |
| 4590 | 0.004 |
| 4591 | 0.004 |
| 4592 | 0.004 |
| 4593 | 0.004 |
| 4594 | 0.004 |
| 4595 | 0.004 |
| 4596 | 0.004 |
| 4597 | 0.004 |
| 4598 | 0.004 |
| 4599 | 0.004 |
| 4600 | 0.004 |
| 4601 | 0.004 |
| 4602 | 0.004 |
| 4603 | 0.004 |
| 4604 | 0.004 |
| 4605 | 0.004 |
| 4606 | 0.004 |
| 4607 | 0.004 |
| 4608 | 0.004 |
| 4609 | 0.004 |
| 4610 | 0.004 |
| 4611 | 0.004 |
| 4612 | 0.004 |
| 4613 | 0.004 |
| 4614 | 0.004 |
| 4615 | 0.004 |
| 4616 | 0.004 |
| 4617 | 0.004 |
| 4618 | 0.004 |
| 4619 | 0.004 |
| 4620 | 0.004 |
| 4621 | 0.004 |
| 4622 | 0.004 |
| 4623 | 0.004 |
| 4624 | 0.004 |
| 4625 | 0.004 |
| 4626 | 0.004 |
| 4627 | 0.004 |
| 4628 | 0.004 |
| 4629 | 0.004 |
| 4630 | 0.004 |
| 4631 | 0.004 |
| 4632 | 0.004 |
| 4633 | 0.004 |
| 4634 | 0.004 |
| 4635 | 0.004 |
| 4636 | 0.004 |
| 4637 | 0.004 |
| 4638 | 0.004 |
| 4639 | 0.004 |
| 4640 | 0.004 |
| 4641 | 0.004 |
| 4642 | 0.004 |
| 4643 | 0.004 |
| 4644 | 0.004 |
| 4645 | 0.004 |
| 4646 | 0.004 |
| 4647 | 0.004 |
| 4648 | 0.004 |
| 4649 | 0.004 |
| 4650 | 0.004 |
| 4651 | 0.004 |
| 4652 | 0.004 |
| 4653 | 0.004 |
| 4654 | 0.004 |
| 4655 | 0.004 |
| 4656 | 0.004 |
| 4657 | 0.004 |
| 4658 | 0.004 |
| 4659 | 0.004 |
| 4660 | 0.004 |
| 4661 | 0.004 |
| 4662 | 0.004 |
| 4663 | 0.004 |
| 4664 | 0.004 |
| 4665 | 0.004 |
| 4666 | 0.004 |
| 4667 | 0.004 |
| 4668 | 0.004 |
| 4669 | 0.004 |
| 4670 | 0.004 |
| 4671 | 0.004 |
| 4672 | 0.004 |
| 4673 | 0.004 |
| 4674 | 0.004 |
| 4675 | 0.004 |
| 4676 | 0.004 |
| 4677 | 0.004 |
| 4678 | 0.004 |
| 4679 | 0.004 |
| 4680 | 0.004 |
| 4681 | 0.004 |
| 4682 | 0.004 |
| 4683 | 0.004 |
| 4684 | 0.004 |
| 4685 | 0.004 |
| 4686 | 0.004 |
| 4687 | 0.004 |
| 4688 | 0.004 |
| 4689 | 0.004 |
| 4690 | 0.004 |
| 4691 | 0.004 |
| 4692 | 0.004 |
| 4693 | 0.004 |
| 4694 | 0.004 |
| 4695 | 0.004 |
| 4696 | 0.004 |
| 4697 | 0.004 |
| 4698 | 0.004 |
| 4699 | 0.004 |
| 4700 | 0.004 |
| 4701 | 0.004 |
| 4702 | 0.004 |
| 4703 | 0.004 |
| 4704 | 0.004 |
| 4705 | 0.004 |
| 4706 | 0.004 |
| 4707 | 0.004 |
| 4708 | 0.004 |
| 4709 | 0.004 |
| 4710 | 0.004 |
| 4711 | 0.004 |
| 4712 | 0.004 |
| 4713 | 0.004 |
| 4714 | 0.004 |
| 4715 | 0.004 |
| 4716 | 0.004 |
| 4717 | 0.004 |
| 4718 | 0.004 |
| 4719 | 0.004 |
| 4720 | 0.004 |
| 4721 | 0.004 |
| 4722 | 0.004 |
| 4723 | 0.004 |
| 4724 | 0.004 |
| 4725 | 0.004 |
| 4726 | 0.004 |
| 4727 | 0.004 |
| 4728 | 0.004 |
| 4729 | 0.004 |
| 4730 | 0.004 |
| 4731 | 0.004 |
| 4732 | 0.004 |
| 4733 | 0.004 |
| 4734 | 0.004 |
| 4735 | 0.004 |
| 4736 | 0.004 |
| 4737 | 0.004 |
| 4738 | 0.004 |
| 4739 | 0.004 |
| 4740 | 0.004 |
| 4741 | 0.004 |
| 4742 | 0.004 |
| 4743 | 0.004 |
| 4744 | 0.004 |
| 4745 | 0.004 |
| 4746 | 0.004 |
| 4747 | 0.004 |
| 4748 | 0.004 |
| 4749 | 0.004 |
| 4750 | 0.004 |
| 4751 | 0.004 |
| 4752 | 0.004 |
| 4753 | 0.004 |
| 4754 | 0.004 |
| 4755 | 0.004 |
| 4756 | 0.004 |
| 4757 | 0.004 |
| 4758 | 0.004 |
| 4759 | 0.004 |
| 4760 | 0.004 |
| 4761 | 0.004 |
| 4762 | 0.004 |
| 4763 | 0.004 |
| 4764 | 0.004 |
| 4765 | 0.004 |
| 4766 | 0.004 |
| 4767 | 0.004 |
| 4768 | 0.004 |
| 4769 | 0.004 |
| 4770 | 0.004 |
| 4771 | 0.004 |
| 4772 | 0.004 |
| 4773 | 0.004 |
| 4774 | 0.004 |
| 4775 | 0.004 |
| 4776 | 0.004 |
| 4777 | 0.004 |
| 4778 | 0.004 |
| 4779 | 0.004 |
| 4780 | 0.004 |
| 4781 | 0.004 |
| 4782 | 0.004 |
| 4783 | 0.004 |
| 4784 | 0.004 |
| 4785 | 0.004 |
| 4786 | 0.004 |
| 4787 | 0.004 |
| 4788 | 0.004 |
| 4789 | 0.004 |
| 4790 | 0.004 |
| 4791 | 0.004 |
| 4792 | 0.004 |
| 4793 | 0.004 |
| 4794 | 0.004 |
| 4795 | 0.004 |
| 4796 | 0.004 |
| 4797 | 0.004 |
| 4798 | 0.004 |
| 4799 | 0.004 |
| 4800 | 0.004 |
| 4801 | 0.004 |
| 4802 | 0.004 |
| 4803 | 0.004 |
| 4804 | 0.004 |
| 4805 | 0.004 |
| 4806 | 0.004 |
| 4807 | 0.004 |
| 4808 | 0.004 |
| 4809 | 0.004 |
| 4810 | 0.004 |
| 4811 | 0.004 |
| 4812 | 0.004 |
| 4813 | 0.004 |
| 4814 | 0.004 |
| 4815 | 0.004 |
| 4816 | 0.004 |
| 4817 | 0.004 |
| 4818 | 0.004 |
| 4819 | 0.004 |
| 4820 | 0.004 |
| 4821 | 0.004 |
| 4822 | 0.004 |
| 4823 | 0.004 |
| 4824 | 0.004 |
| 4825 | 0.004 |
| 4826 | 0.004 |
| 4827 | 0.004 |
| 4828 | 0.004 |
| 4829 | 0.004 |
| 4830 | 0.004 |
| 4831 | 0.004 |
| 4832 | 0.004 |
| 4833 | 0.004 |
| 4834 | 0.004 |
| 4835 | 0.004 |
| 4836 | 0.004 |
| 4837 | 0.004 |
| 4838 | 0.004 |
| 4839 | 0.004 |
| 4840 | 0.004 |
| 4841 | 0.004 |
| 4842 | 0.004 |
| 4843 | 0.004 |
| 4844 | 0.004 |
| 4845 | 0.004 |
| 4846 | 0.004 |
| 4847 | 0.004 |
| 4848 | 0.004 |
| 4849 | 0.004 |
| 4850 | 0.004 |
| 4851 | 0.004 |
| 4852 | 0.004 |
| 4853 | 0.004 |
| 4854 | 0.004 |
| 4855 | 0.004 |
| 4856 | 0.004 |
| 4857 | 0.004 |
| 4858 | 0.004 |
| 4859 | 0.004 |
| 4860 | 0.004 |
| 4861 | 0.004 |
| 4862 | 0.004 |
| 4863 | 0.004 |
| 4864 | 0.004 |
| 4865 | 0.004 |
| 4866 | 0.004 |
| 4867 | 0.004 |
| 4868 | 0.004 |
| 4869 | 0.004 |
| 4870 | 0.004 |
| 4871 | 0.004 |
| 4872 | 0.004 |
| 4873 | 0.004 |
| 4874 | 0.004 |
| 4875 | 0.004 |
| 4876 | 0.004 |
| 4877 | 0.004 |
| 4878 | 0.004 |
| 4879 | 0.004 |
| 4880 | 0.004 |
| 4881 | 0.004 |
| 4882 | 0.004 |
| 4883 | 0.004 |
| 4884 | 0.004 |
| 4885 | 0.004 |
| 4886 | 0.004 |
| 4887 | 0.004 |
| 4888 | 0.004 |
| 4889 | 0.004 |
| 4890 | 0.004 |
| 4891 | 0.004 |
| 4892 | 0.004 |
| 4893 | 0.004 |
| 4894 | 0.004 |
| 4895 | 0.004 |
| 4896 | 0.004 |
| 4897 | 0.004 |
| 4898 | 0.004 |
| 4899 | 0.004 |
| 4900 | 0.004 |
| 4901 | 0.004 |
| 4902 | 0.004 |
| 4903 | 0.004 |
| 4904 | 0.004 |
| 4905 | 0.004 |
| 4906 | 0.004 |
| 4907 | 0.004 |
| 4908 | 0.004 |
| 4909 | 0.004 |
| 4910 | 0.004 |
| 4911 | 0.004 |
| 4912 | 0.004 |
| 4913 | 0.004 |
| 4914 | 0.004 |
| 4915 | 0.004 |
| 4916 | 0.004 |
| 4917 | 0.004 |
| 4918 | 0.004 |
| 4919 | 0.004 |
| 4920 | 0.004 |
| 4921 | 0.004 |
| 4922 | 0.004 |
| 4923 | 0.004 |
| 4924 | 0.004 |
| 4925 | 0.004 |
| 4926 | 0.004 |
| 4927 | 0.004 |
| 4928 | 0.004 |
| 4929 | 0.004 |
| 4930 | 0.004 |
| 4931 | 0.004 |
| 4932 | 0.004 |
| 4933 | 0.004 |
| 4934 | 0.004 |
| 4935 | 0.004 |
| 4936 | 0.004 |
| 4937 | 0.004 |
| 4938 | 0.004 |
| 4939 | 0.004 |
| 4940 | 0.004 |
| 4941 | 0.004 |
| 4942 | 0.004 |
| 4943 | 0.004 |
| 4944 | 0.004 |
| 4945 | 0.004 |
| 4946 | 0.004 |
| 4947 | 0.004 |
| 4948 | 0.004 |
| 4949 | 0.004 |
| 4950 | 0.004 |
| 4951 | 0.004 |
| 4952 | 0.004 |
| 4953 | 0.004 |
| 4954 | 0.004 |
| 4955 | 0.004 |
| 4956 | 0.004 |
| 4957 | 0.004 |
| 4958 | 0.004 |
| 4959 | 0.004 |
| 4960 | 0.004 |
| 4961 | 0.004 |
| 4962 | 0.004 |
| 4963 | 0.004 |
| 4964 | 0.004 |
| 4965 | 0.004 |
| 4966 | 0.004 |
| 4967 | 0.004 |
| 4968 | 0.004 |
| 4969 | 0.004 |
| 4970 | 0.004 |
| 4971 | 0.004 |
| 4972 | 0.004 |
| 4973 | 0.004 |
| 4974 | 0.004 |
| 4975 | 0.004 |
| 4976 | 0.004 |
| 4977 | 0.004 |
| 4978 | 0.004 |
| 4979 | 0.004 |
| 4980 | 0.004 |
| 4981 | 0.004 |
| 4982 | 0.004 |
| 4983 | 0.004 |
| 4984 | 0.004 |
| 4985 | 0.004 |
| 4986 | 0.004 |
| 4987 | 0.004 |
| 4988 | 0.004 |
| 4989 | 0.004 |
| 4990 | 0.004 |
| 4991 | 0.004 |
| 4992 | 0.004 |
| 4993 | 0.004 |
| 4994 | 0.004 |
| 4995 | 0.004 |
| 4996 | 0.004 |
| 4997 | 0.004 |
| 4998 | 0.004 |
| 4999 | 0.004 |
| 5000 | 0.004 |
| 5001 | 0.004 |
| 5002 | 0.004 |
| 5003 | 0.004 |
| 5004 | 0.004 |
| 5005 | 0.004 |
| 5006 | 0.004 |
| 5007 | 0.004 |
| 5008 | 0.004 |
| 5009 | 0.004 |
| 5010 | 0.004 |
| 5011 | 0.004 |
| 5012 | 0.004 |
| 5013 | 0.004 |
| 5014 | 0.004 |
| 5015 | 0.004 |
| 5016 | 0.004 |
| 5017 | 0.004 |
| 5018 | 0.004 |
| 5019 | 0.004 |
| 5020 | 0.004 |
| 5021 | 0.004 |
| 5022 | 0.004 |
| 5023 | 0.004 |
| 5024 | 0.004 |
| 5025 | 0.004 |
| 5026 | 0.004 |
| 5027 | 0.004 |
| 5028 | 0.004 |
| 5029 | 0.004 |
| 5030 | 0.004 |
| 5031 | 0.004 |
| 5032 | 0.004 |
| 5033 | 0.004 |
| 5034 | 0.004 |
| 5035 | 0.004 |
| 5036 | 0.004 |
| 5037 | 0.004 |
| 5038 | 0.004 |
| 5039 | 0.004 |
| 5040 | 0.004 |
| 5041 | 0.004 |
| 5042 | 0.004 |
| 5043 | 0.004 |
| 5044 | 0.004 |
| 5045 | 0.004 |
| 5046 | 0.004 |
| 5047 | 0.004 |
| 5048 | 0.004 |
| 5049 | 0.004 |
| 5050 | 0.004 |
| 5051 | 0.004 |
| 5052 | 0.004 |
| 5053 | 0.004 |
| 5054 | 0.004 |
| 5055 | 0.004 |
| 5056 | 0.004 |
| 5057 | 0.004 |
| 5058 | 0.004 |
| 5059 | 0.004 |
| 5060 | 0.004 |
| 5061 | 0.004 |
| 5062 | 0.004 |
| 5063 | 0.004 |
| 5064 | 0.004 |
| 5065 | 0.004 |
| 5066 | 0.004 |
| 5067 | 0.004 |
| 5068 | 0.004 |
| 5069 | 0.004 |
| 5070 | 0.004 |
| 5071 | 0.004 |
| 5072 | 0.004 |
| 5073 | 0.004 |
| 5074 | 0.004 |
| 5075 | 0.004 |
| 5076 | 0.004 |
| 5077 | 0.004 |
| 5078 | 0.004 |
| 5079 | 0.004 |
| 5080 | 0.004 |
| 5081 | 0.004 |
| 5082 | 0.004 |
| 5083 | 0.004 |
| 5084 | 0.004 |
| 5085 | 0.004 |
| 5086 | 0.004 |
| 5087 | 0.004 |
| 5088 | 0.004 |
| 5089 | 0.004 |
| 5090 | 0.004 |
| 5091 | 0.004 |
| 5092 | 0.004 |
| 5093 | 0.004 |
| 5094 | 0.004 |
| 5095 | 0.004 |
| 5096 | 0.004 |
| 5097 | 0.004 |
| 5098 | 0.004 |
| 5099 | 0.004 |
| 5100 | 0.004 |
| 5101 | 0.004 |
| 5102 | 0.004 |
| 5103 | 0.004 |
| 5104 | 0.004 |
| 5105 | 0.004 |
| 5106 | 0.004 |
| 5107 | 0.004 |
| 5108 | 0.004 |
| 5109 | 0.004 |
| 5110 | 0.004 |
| 5111 | 0.004 |
| 5112 | 0.004 |
| 5113 | 0.004 |
| 5114 | 0.004 |
| 5115 | 0.004 |
| 5116 | 0.004 |
| 5117 | 0.004 |
| 5118 | 0.004 |
| 5119 | 0.004 |
| 5120 | 0.004 |
| 5121 | 0.004 |
| 5122 | 0.004 |
| 5123 | 0.004 |
| 5124 | 0.004 |
| 5125 | 0.004 |
| 5126 | 0.004 |
| 5127 | 0.004 |
| 5128 | 0.004 |
| 5129 | 0.004 |
| 5130 | 0.004 |
| 5131 | 0.004 |
| 5132 | 0.004 |
| 5133 | 0.004 |
| 5134 | 0.004 |
| 5135 | 0.004 |
| 5136 | 0.004 |
| 5137 | 0.004 |
| 5138 | 0.004 |
| 5139 | 0.004 |
| 5140 | 0.004 |
| 5141 | 0.004 |
| 5142 | 0.004 |
| 5143 | 0.004 |
| 5144 | 0.004 |
| 5145 | 0.004 |
| 5146 | 0.004 |
| 5147 | 0.004 |
| 5148 | 0.004 |
| 5149 | 0.004 |
| 5150 | 0.004 |
| 5151 | 0.004 |
| 5152 | 0.004 |
| 5153 | 0.004 |
| 5154 | 0.004 |
| 5155 | 0.004 |
| 5156 | 0.004 |
| 5157 | 0.004 |
| 5158 | 0.004 |
| 5159 | 0.004 |
| 5160 | 0.004 |
| 5161 | 0.004 |
| 5162 | 0.004 |
| 5163 | 0.004 |
| 5164 | 0.004 |
| 5165 | 0.004 |
| 5166 | 0.004 |
| 5167 | 0.004 |
| 5168 | 0.004 |
| 5169 | 0.004 |
| 5170 | 0.004 |
| 5171 | 0.004 |
| 5172 | 0.004 |
| 5173 | 0.004 |
| 5174 | 0.004 |
| 5175 | 0.004 |
| 5176 | 0.004 |
| 5177 | 0.004 |
| 5178 | 0.004 |
| 5179 | 0.004 |
| 5180 | 0.004 |
| 5181 | 0.004 |
| 5182 | 0.004 |
| 5183 | 0.004 |
| 5184 | 0.004 |
| 5185 | 0.004 |
| 5186 | 0.004 |
| 5187 | 0.004 |
| 5188 | 0.004 |
| 5189 | 0.004 |
| 5190 | 0.004 |
| 5191 | 0.004 |
| 5192 | 0.004 |
| 5193 | 0.004 |
| 5194 | 0.004 |
| 5195 | 0.004 |
| 5196 | 0.004 |
| 5197 | 0.004 |
| 5198 | 0.004 |
| 5199 | 0.004 |
| 5200 | 0.004 |
| 5201 | 0.004 |
| 5202 | 0.004 |
| 5203 | 0.004 |
| 5204 | 0.004 |
| 5205 | 0.004 |
| 5206 | 0.004 |
| 5207 | 0.004 |
| 5208 | 0.004 |
| 5209 | 0.004 |
| 5210 | 0.004 |
| 5211 | 0.004 |
| 5212 | 0.004 |
| 5213 | 0.004 |
| 5214 | 0.004 |
| 5215 | 0.004 |
| 5216 | 0.004 |
| 5217 | 0.004 |
| 5218 | 0.004 |
| 5219 | 0.004 |
| 5220 | 0.004 |
| 5221 | 0.004 |
| 5222 | 0.004 |
| 5223 | 0.004 |
| 5224 | 0.004 |
| 5225 | 0.004 |
| 5226 | 0.004 |
| 5227 | 0.004 |
| 5228 | 0.004 |
| 5229 | 0.004 |
| 5230 | 0.004 |
| 5231 | 0.004 |
| 5232 | 0.004 |
| 5233 | 0.004 |
| 5234 | 0.004 |
| 5235 | 0.004 |
| 5236 | 0.004 |
| 5237 | 0.004 |
| 5238 | 0.004 |
| 5239 | 0.004 |
| 5240 | 0.004 |
| 5241 | 0.004 |
| 5242 | 0.004 |
| 5243 | 0.004 |
| 5244 | 0.004 |
| 5245 | 0.004 |
| 5246 | 0.004 |
| 5247 | 0.004 |
| 5248 | 0.004 |
| 5249 | 0.004 |
| 5250 | 0.004 |
| 5251 | 0.004 |
| 5252 | 0.004 |
| 5253 | 0.004 |
| 5254 | 0.004 |
| 5255 | 0.004 |
| 5256 | 0.004 |
| 5257 | 0.004 |
| 5258 | 0.004 |
| 5259 | 0.004 |
| 5260 | 0.004 |
| 5261 | 0.004 |
| 5262 | 0.004 |
| 5263 | 0.004 |
| 5264 | 0.004 |
| 5265 | 0.004 |
| 5266 | 0.004 |
| 5267 | 0.004 |
| 5268 | 0.004 |
| 5269 | 0.004 |
| 5270 | 0.004 |
| 5271 | 0.004 |
| 5272 | 0.004 |
| 5273 | 0.004 |
| 5274 | 0.004 |
| 5275 | 0.004 |
| 5276 | 0.004 |
| 5277 | 0.004 |
| 5278 | 0.004 |
| 5279 | 0.004 |
| 5280 | 0.004 |
| 5281 | 0.004 |
| 5282 | 0.004 |
| 5283 | 0.004 |
| 5284 | 0.004 |
| 5285 | 0.004 |
| 5286 | 0.004 |
| 5287 | 0.004 |
| 5288 | 0.004 |
| 5289 | 0.004 |
| 5290 | 0.004 |
| 5291 | 0.004 |
| 5292 | 0.004 |
| 5293 | 0.004 |
| 5294 | 0.004 |
| 5295 | 0.004 |
| 5296 | 0.004 |
| 5297 | 0.004 |
| 5298 | 0.004 |
| 5299 | 0.004 |
| 5300 | 0.004 |
| 5301 | 0.004 |
| 5302 | 0.004 |
| 5303 | 0.004 |
| 5304 | 0.004 |
| 5305 | 0.004 |
| 5306 | 0.004 |
| 5307 | 0.004 |
| 5308 | 0.004 |
| 5309 | 0.004 |
| 5310 | 0.004 |
| 5311 | 0.004 |
| 5312 | 0.004 |
| 5313 | 0.004 |
| 5314 | 0.004 |
| 5315 | 0.004 |
| 5316 | 0.004 |
| 5317 | 0.004 |
| 5318 | 0.004 |
| 5319 | 0.004 |
| 5320 | 0.004 |
| 5321 | 0.004 |
| 5322 | 0.004 |
| 5323 | 0.004 |
| 5324 | 0.004 |
| 5325 | 0.004 |
| 5326 | 0.004 |
| 5327 | 0.004 |
| 5328 | 0.004 |
| 5329 | 0.004 |
| 5330 | 0.004 |
| 5331 | 0.004 |
| 5332 | 0.004 |
| 5333 | 0.004 |
| 5334 | 0.004 |
| 5335 | 0.004 |
| 5336 | 0.004 |
| 5337 | 0.004 |
| 5338 | 0.004 |
| 5339 | 0.004 |
| 5340 | 0.004 |
| 5341 | 0.004 |
| 5342 | 0.004 |
| 5343 | 0.004 |
| 5344 | 0.004 |
| 5345 | 0.004 |
| 5346 | 0.004 |
| 5347 | 0.004 |
| 5348 | 0.004 |
| 5349 | 0.004 |
| 5350 | 0.004 |
| 5351 | 0.004 |
| 5352 | 0.004 |
| 5353 | 0.004 |
| 5354 | 0.004 |
| 5355 | 0.004 |
| 5356 | 0.004 |
| 5357 | 0.004 |
| 5358 | 0.004 |
| 5359 | 0.004 |
| 5360 | 0.004 |
| 5361 | 0.004 |
| 5362 | 0.004 |
| 5363 | 0.004 |
| 5364 | 0.004 |
| 5365 | 0.004 |
| 5366 | 0.004 |
| 5367 | 0.004 |
| 5368 | 0.004 |
| 5369 | 0.004 |
| 5370 | 0.004 |
| 5371 | 0.004 |
| 5372 | 0.004 |
| 5373 | 0.004 |
| 5374 | 0.004 |
| 5375 | 0.004 |
| 5376 | 0.004 |
| 5377 | 0.004 |
| 5378 | 0.004 |
| 5379 | 0.004 |
| 5380 | 0.004 |
| 5381 | 0.004 |
| 5382 | 0.004 |
| 5383 | 0.004 |
| 5384 | 0.004 |
| 5385 | 0.004 |
| 5386 | 0.004 |
| 5387 | 0.004 |
| 5388 | 0.004 |
| 5389 | 0.004 |
| 5390 | 0.004 |
| 5391 | 0.004 |
| 5392 | 0.004 |
| 5393 | 0.004 |
| 5394 | 0.004 |
| 5395 | 0.004 |
| 5396 | 0.004 |
| 5397 | 0.004 |
| 5398 | 0.004 |
| 5399 | 0.004 |
| 5400 | 0.004 |
| 5401 | 0.004 |
| 5402 | 0.004 |
| 5403 | 0.004 |
| 5404 | 0.004 |
| 5405 | 0.004 |
| 5406 | 0.004 |
| 5407 | 0.004 |
| 5408 | 0.004 |
| 5409 | 0.004 |
| 5410 | 0.004 |
| 5411 | 0.004 |
| 5412 | 0.004 |
| 5413 | 0.004 |
| 5414 | 0.004 |
| 5415 | 0.004 |
| 5416 | 0.004 |
| 5417 | 0.004 |
| 5418 | 0.004 |
| 5419 | 0.004 |
| 5420 | 0.004 |
| 5421 | 0.004 |
| 5422 | 0.004 |
| 5423 | 0.004 |
| 5424 | 0.004 |
| 5425 | 0.004 |
| 5426 | 0.004 |
| 5427 | 0.004 |
| 5428 | 0.004 |
| 5429 | 0.004 |
| 5430 | 0.004 |
| 5431 | 0.004 |
| 5432 | 0.004 |
| 5433 | 0.004 |
| 5434 | 0.004 |
| 5435 | 0.004 |
| 5436 | 0.004 |
| 5437 | 0.004 |
| 5438 | 0.004 |
| 5439 | 0.004 |
| 5440 | 0.004 |
| 5441 | 0.004 |
| 5442 | 0.004 |
| 5443 | 0.004 |
| 5444 | 0.004 |
| 5445 | 0.004 |
| 5446 | 0.004 |
| 5447 | 0.004 |
| 5448 | 0.004 |
| 5449 | 0.004 |
| 5450 | 0.004 |
| 5451 | 0.004 |
| 5452 | 0.004 |
| 5453 | 0.004 |
| 5454 | 0.004 |
| 5455 | 0.004 |
| 5456 | 0.004 |
| 5457 | 0.004 |
| 5458 | 0.004 |
| 5459 | 0.004 |
| 5460 | 0.004 |
| 5461 | 0.004 |
| 5462 | 0.004 |
| 5463 | 0.004 |
| 5464 | 0.004 |
| 5465 | 0.004 |
| 5466 | 0.004 |
| 5467 | 0.004 |
| 5468 | 0.004 |
| 5469 | 0.004 |
| 5470 | 0.004 |
| 5471 | 0.004 |
| 5472 | 0.004 |
| 5473 | 0.004 |
| 5474 | 0.004 |
| 5475 | 0.004 |
| 5476 | 0.004 |
| 5477 | 0.004 |
| 5478 | 0.004 |
| 5479 | 0.004 |
| 5480 | 0.004 |
| 5481 | 0.004 |
| 5482 | 0.004 |
| 5483 | 0.004 |
| 5484 | 0.004 |
| 5485 | 0.004 |
| 5486 | 0.004 |
| 5487 | 0.004 |
| 5488 | 0.004 |
| 5489 | 0.004 |
| 5490 | 0.004 |
| 5491 | 0.004 |
| 5492 | 0.004 |
| 5493 | 0.004 |
| 5494 | 0.004 |
| 5495 | 0.004 |
| 5496 | 0.004 |
| 5497 | 0.004 |
| 5498 | 0.004 |
| 5499 | 0.004 |
| 5500 | 0.004 |
| 5501 | 0.004 |
| 5502 | 0.004 |
| 5503 | 0.004 |
| 5504 | 0.004 |
| 5505 | 0.004 |
| 5506 | 0.004 |
| 5507 | 0.004 |
| 5508 | 0.004 |
| 5509 | 0.004 |
| 5510 | 0.004 |
| 5511 | 0.004 |
| 5512 | 0.004 |
| 5513 | 0.004 |
| 5514 | 0.004 |
| 5515 | 0.004 |
| 5516 | 0.004 |
| 5517 | 0.004 |
| 5518 | 0.004 |
| 5519 | 0.004 |
| 5520 | 0.004 |
| 5521 | 0.004 |
| 5522 | 0.004 |
| 5523 | 0.004 |
| 5524 | 0.004 |
| 5525 | 0.004 |
| 5526 | 0.004 |
| 5527 | 0.004 |
| 5528 | 0.004 |
| 5529 | 0.004 |
| 5530 | 0.004 |
| 5531 | 0.004 |
| 5532 | 0.004 |
| 5533 | 0.004 |
| 5534 | 0.004 |
| 5535 | 0.004 |
| 5536 | 0.004 |
| 5537 | 0.004 |
| 5538 | 0.004 |
| 5539 | 0.004 |
| 5540 | 0.004 |
| 5541 | 0.004 |
| 5542 | 0.004 |
| 5543 | 0.004 |
| 5544 | 0.004 |
| 5545 | 0.004 |
| 5546 | 0.004 |
| 5547 | 0.004 |
| 5548 | 0.004 |
| 5549 | 0.004 |
| 5550 | 0.004 |
| 5551 | 0.004 |
| 5552 | 0.004 |
| 5553 | 0.004 |
| 5554 | 0.004 |
| 5555 | 0.004 |
| 5556 | 0.004 |
| 5557 | 0.004 |
| 5558 | 0.004 |
| 5559 | 0.004 |
| 5560 | 0.004 |
| 5561 | 0.004 |
| 5562 | 0.004 |
| 5563 | 0.004 |
| 5564 | 0.004 |
| 5565 | 0.004 |
| 5566 | 0.004 |
| 5567 | 0.004 |
| 5568 | 0.004 |
| 5569 | 0.004 |
| 5570 | 0.004 |
| 5571 | 0.004 |
| 5572 | 0.004 |
| 5573 | 0.004 |
| 5574 | 0.004 |
| 5575 | 0.004 |
| 5576 | 0.004 |
| 5577 | 0.004 |
| 5578 | 0.004 |
| 5579 | 0.004 |
| 5580 | 0.004 |
| 5581 | 0.004 |
| 5582 | 0.004 |
| 5583 | 0.004 |
| 5584 | 0.004 |
| 5585 | 0.004 |
| 5586 | 0.004 |
| 5587 | 0.004 |
| 5588 | 0.004 |
| 5589 | 0.004 |
| 5590 | 0.004 |
| 5591 | 0.004 |
| 5592 | 0.004 |
| 5593 | 0.004 |
| 5594 | 0.004 |
| 5595 | 0.004 |
| 5596 | 0.004 |
| 5597 | 0.004 |
| 5598 | 0.004 |
| 5599 | 0.004 |
| 5600 | 0.004 |
| 5601 | 0.004 |
| 5602 | 0.004 |
| 5603 | 0.004 |
| 5604 | 0.004 |
| 5605 | 0.004 |
| 5606 | 0.004 |
| 5607 | 0.004 |
| 5608 | 0.004 |
| 5609 | 0.004 |
| 5610 | 0.004 |
| 5611 | 0.004 |
| 5612 | 0.004 |
| 5613 | 0.004 |
| 5614 | 0.004 |
| 5615 | 0.004 |
| 5616 | 0.004 |
| 5617 | 0.004 |
| 5618 | 0.004 |
| 5619 | 0.004 |
| 5620 | 0.004 |
| 5621 | 0.004 |
| 5622 | 0.004 |
| 5623 | 0.004 |
| 5624 | 0.004 |
| 5625 | 0.004 |
| 5626 | 0.004 |
| 5627 | 0.004 |
| 5628 | 0.004 |
| 5629 | 0.004 |
| 5630 | 0.004 |
| 5631 | 0.004 |
| 5632 | 0.004 |
| 5633 | 0.004 |
| 5634 | 0.004 |
| 5635 | 0.004 |
| 5636 | 0.004 |
| 5637 | 0.004 |
| 5638 | 0.004 |
| 5639 | 0.004 |
| 5640 | 0.004 |
| 5641 | 0.004 |
| 5642 | 0.004 |
| 5643 | 0.004 |
| 5644 | 0.004 |
| 5645 | 0.004 |
| 5646 | 0.004 |
| 5647 | 0.004 |
| 5648 | 0.004 |
| 5649 | 0.004 |
| 5650 | 0.004 |
| 5651 | 0.004 |
| 5652 | 0.004 |
| 5653 | 0.004 |
| 5654 | 0.004 |
| 5655 | 0.004 |
| 5656 | 0.004 |
| 5657 | 0.004 |
| 5658 | 0.004 |
| 5659 | 0.004 |
| 5660 | 0.004 |
| 5661 | 0.004 |
| 5662 | 0.004 |
| 5663 | 0.004 |
| 5664 | 0.004 |
| 5665 | 0.004 |
| 5666 | 0.004 |
| 5667 | 0.004 |
| 5668 | 0.004 |
| 5669 | 0.004 |
| 5670 | 0.004 |
| 5671 | 0.004 |
| 5672 | 0.004 |
| 5673 | 0.004 |
| 5674 | 0.004 |
| 5675 | 0.004 |
| 5676 | 0.004 |
| 5677 | 0.004 |
| 5678 | 0.004 |
| 5679 | 0.004 |
| 5680 | 0.004 |
| 5681 | 0.004 |
| 5682 | 0.004 |
| 5683 | 0.004 |
| 5684 | 0.004 |
| 5685 | 0.004 |
| 5686 | 0.004 |
| 5687 | 0.004 |
| 5688 | 0.004 |
| 5689 | 0.004 |
| 5690 | 0.004 |
| 5691 | 0.004 |
| 5692 | 0.004 |
| 5693 | 0.004 |
| 5694 | 0.004 |
| 5695 | 0.004 |
| 5696 | 0.004 |
| 5697 | 0.004 |
| 5698 | 0.004 |
| 5699 | 0.004 |
| 5700 | 0.004 |
| 5701 | 0.004 |
| 5702 | 0.004 |
| 5703 | 0.004 |
| 5704 | 0.004 |
| 5705 | 0.004 |
| 5706 | 0.004 |
| 5707 | 0.004 |
| 5708 | 0.004 |
| 5709 | 0.004 |
| 5710 | 0.004 |
| 5711 | 0.004 |
| 5712 | 0.004 |
| 5713 | 0.004 |
| 5714 | 0.004 |
| 5715 | 0.004 |
| 5716 | 0.004 |
| 5717 | 0.004 |
| 5718 | 0.004 |
| 5719 | 0.004 |
| 5720 | 0.004 |
| 5721 | 0.004 |
| 5722 | 0.004 |
| 5723 | 0.004 |
| 5724 | 0.004 |
| 5725 | 0.004 |
| 5726 | 0.004 |
| 5727 | 0.004 |
| 5728 | 0.004 |
| 5729 | 0.004 |
| 5730 | 0.004 |
| 5731 | 0.004 |
| 5732 | 0.004 |
| 5733 | 0.004 |
| 5734 | 0.004 |
| 5735 | 0.004 |
| 5736 | 0.004 |
| 5737 | 0.004 |
| 5738 | 0.004 |
| 5739 | 0.004 |
| 5740 | 0.004 |
| 5741 | 0.004 |
| 5742 | 0.004 |
| 5743 | 0.004 |
| 5744 | 0.004 |
| 5745 | 0.004 |
| 5746 | 0.004 |
| 5747 | 0.004 |
| 5748 | 0.004 |
| 5749 | 0.004 |
| 5750 | 0.004 |
| 5751 | 0.004 |
| 5752 | 0.004 |
| 5753 | 0.004 |
| 5754 | 0.004 |
| 5755 | 0.004 |
| 5756 | 0.004 |
| 5757 | 0.004 |
| 5758 | 0.004 |
| 5759 | 0.004 |
| 5760 | 0.004 |
| 5761 | 0.004 |
| 5762 | 0.004 |
| 5763 | 0.004 |
| 5764 | 0.004 |
| 5765 | 0.004 |
| 5766 | 0.004 |
| 5767 | 0.004 |
| 5768 | 0.004 |
| 5769 | 0.004 |
| 5770 | 0.004 |
| 5771 | 0.004 |
| 5772 | 0.004 |
| 5773 | 0.004 |
| 5774 | 0.004 |
| 5775 | 0.004 |
| 5776 | 0.004 |
| 5777 | 0.004 |
| 5778 | 0.004 |
| 5779 | 0.004 |
| 5780 | 0.004 |
| 5781 | 0.004 |
| 5782 | 0.004 |
| 5783 | 0.004 |
| 5784 | 0.004 |
| 5785 | 0.004 |
| 5786 | 0.004 |
| 5787 | 0.004 |
| 5788 | 0.004 |
| 5789 | 0.004 |
| 5790 | 0.004 |
| 5791 | 0.004 |
| 5792 | 0.004 |
| 5793 | 0.004 |
| 5794 | 0.004 |
| 5795 | 0.004 |
| 5796 | 0.004 |
| 5797 | 0.004 |
| 5798 | 0.004 |
| 5799 | 0.004 |
| 5800 | 0.004 |
| 5801 | 0.004 |
| 5802 | 0.004 |
| 5803 | 0.004 |
| 5804 | 0.004 |
| 5805 | 0.004 |
| 5806 | 0.004 |
| 5807 | 0.004 |
| 5808 | 0.004 |
| 5809 | 0.004 |
| 5810 | 0.004 |
| 5811 | 0.004 |
| 5812 | 0.004 |
| 5813 | 0.004 |
| 5814 | 0.004 |
| 5815 | 0.004 |
| 5816 | 0.004 |
| 5817 | 0.004 |
| 5818 | 0.004 |
| 5819 | 0.004 |
| 5820 | 0.004 |
| 5821 | 0.004 |
| 5822 | 0.004 |
| 5823 | 0.004 |
| 5824 | 0.004 |
| 5825 | 0.004 |
| 5826 | 0.004 |
| 5827 | 0.004 |
| 5828 | 0.004 |
| 5829 | 0.004 |
| 5830 | 0.004 |
| 5831 | 0.004 |
| 5832 | 0.004 |
| 5833 | 0.004 |
| 5834 | 0.004 |
| 5835 | 0.004 |
| 5836 | 0.004 |
| 5837 | 0.004 |
| 5838 | 0.004 |
| 5839 | 0.004 |
| 5840 | 0.004 |
| 5841 | 0.004 |
| 5842 | 0.004 |
| 5843 | 0.004 |
| 5844 | 0.004 |
| 5845 | 0.004 |
| 5846 | 0.004 |
| 5847 | 0.004 |
| 5848 | 0.004 |
| 5849 | 0.004 |
| 5850 | 0.004 |
| 5851 | 0.004 |
| 5852 | 0.004 |
| 5853 | 0.004 |
| 5854 | 0.004 |
| 5855 | 0.004 |
| 5856 | 0.004 |
| 5857 | 0.004 |
| 5858 | 0.004 |
| 5859 | 0.004 |
| 5860 | 0.004 |
| 5861 | 0.004 |
| 5862 | 0.004 |
| 5863 | 0.004 |
| 5864 | 0.004 |
| 5865 | 0.004 |
| 5866 | 0.004 |
| 5867 | 0.004 |
| 5868 | 0.004 |
| 5869 | 0.004 |
| 5870 | 0.004 |
| 5871 | 0.004 |
| 5872 | 0.004 |
| 5873 | 0.004 |
| 5874 | 0.004 |
| 5875 | 0.004 |
| 5876 | 0.004 |
| 5877 | 0.004 |
| 5878 | 0.004 |
| 5879 | 0.004 |
| 5880 | 0.004 |
| 5881 | 0.004 |
| 5882 | 0.004 |
| 5883 | 0.004 |
| 5884 | 0.004 |
| 5885 | 0.004 |
| 5886 | 0.004 |
| 5887 | 0.004 |
| 5888 | 0.004 |
| 5889 | 0.004 |
| 5890 | 0.004 |
| 5891 | 0.004 |
| 5892 | 0.004 |
| 5893 | 0.004 |
| 5894 | 0.004 |
| 5895 | 0.004 |
| 5896 | 0.004 |
| 5897 | 0.004 |
| 5898 | 0.004 |
| 5899 | 0.004 |
| 5900 | 0.004 |
| 5901 | 0.004 |
| 5902 | 0.004 |
| 5903 | 0.004 |
| 5904 | 0.004 |
| 5905 | 0.004 |
| 5906 | 0.004 |
| 5907 | 0.004 |
| 5908 | 0.004 |
| 5909 | 0.004 |
| 5910 | 0.004 |
| 5911 | 0.004 |
| 5912 | 0.004 |
| 5913 | 0.004 |
| 5914 | 0.004 |
| 5915 | 0.004 |
| 5916 | 0.004 |
| 5917 | 0.004 |
| 5918 | 0.004 |
| 5919 | 0.004 |
| 5920 | 0.004 |
| 5921 | 0.004 |
| 5922 | 0.004 |
| 5923 | 0.004 |
| 5924 | 0.004 |
| 5925 | 0.004 |
| 5926 | 0.004 |
| 5927 | 0.004 |
| 5928 | 0.004 |
| 5929 | 0.004 |
| 5930 | 0.004 |
| 5931 | 0.004 |
| 5932 | 0.004 |
| 5933 | 0.004 |
| 5934 | 0.004 |
| 5935 | 0.004 |
| 5936 | 0.004 |
| 5937 | 0.004 |
| 5938 | 0.004 |
| 5939 | 0.004 |
| 5940 | 0.004 |
| 5941 | 0.004 |
| 5942 | 0.004 |
| 5943 | 0.004 |
| 5944 | 0.004 |
| 5945 | 0.004 |
| 5946 | 0.004 |
| 5947 | 0.004 |
| 5948 | 0.004 |
| 5949 | 0.004 |
| 5950 | 0.004 |
| 5951 | 0.004 |
| 5952 | 0.004 |
| 5953 | 0.004 |
| 5954 | 0.004 |
| 5955 | 0.004 |
| 5956 | 0.004 |
| 5957 | 0.004 |
| 5958 | 0.004 |
| 5959 | 0.004 |
| 5960 | 0.004 |
| 5961 | 0.004 |
| 5962 | 0.004 |
| 5963 | 0.004 |
| 5964 | 0.004 |
| 5965 | 0.004 |
| 5966 | 0.004 |
| 5967 | 0.004 |
| 5968 | 0.004 |
| 5969 | 0.004 |
| 5970 | 0.004 |
| 5971 | 0.004 |
| 5972 | 0.004 |
| 5973 | 0.004 |
| 5974 | 0.004 |
| 5975 | 0.004 |
| 5976 | 0.004 |
| 5977 | 0.004 |
| 5978 | 0.004 |
| 5979 | 0.004 |
| 5980 | 0.004 |
| 5981 | 0.004 |
| 5982 | 0.004 |
| 5983 | 0.004 |
| 5984 | 0.004 |
| 5985 | 0.004 |
| 5986 | 0.004 |
| 5987 | 0.004 |
| 5988 | 0.004 |
| 5989 | 0.004 |
| 5990 | 0.004 |
| 5991 | 0.004 |
| 5992 | 0.004 |
| 5993 | 0.004 |
| 5994 | 0.004 |
| 5995 | 0.004 |
| 5996 | 0.004 |
| 5997 | 0.004 |
| 5998 | 0.004 |
| 5999 | 0.004 |
| 6000 | 0.004 |
| 6001 | 0.004 |
| 6002 | 0.004 |
| 6003 | 0.004 |
| 6004 | 0.004 |
| 6005 | 0.004 |
| 6006 | 0.004 |
| 6007 | 0.004 |
| 6008 | 0.004 |
| 6009 | 0.004 |
| 6010 | 0.004 |
| 6011 | 0.004 |
| 6012 | 0.004 |
| 6013 | 0.004 |
| 6014 | 0.004 |
| 6015 | 0.004 |
| 6016 | 0.004 |
| 6017 | 0.004 |
| 6018 | 0.004 |
| 6019 | 0.004 |
| 6020 | 0.004 |
| 6021 | 0.004 |
| 6022 | 0.004 |
| 6023 | 0.004 |
| 6024 | 0.004 |
| 6025 | 0.004 |
| 6026 | 0.004 |
| 6027 | 0.004 |
| 6028 | 0.004 |
| 6029 | 0.004 |
| 6030 | 0.004 |
| 6031 | 0.004 |
| 6032 | 0.004 |
| 6033 | 0.004 |
| 6034 | 0.004 |
| 6035 | 0.004 |
| 6036 | 0.004 |
| 6037 | 0.004 |
| 6038 | 0.004 |
| 6039 | 0.004 |
| 6040 | 0.004 |
| 6041 | 0.004 |
| 6042 | 0.004 |
| 6043 | 0.004 |
| 6044 | 0.004 |
| 6045 | 0.004 |
| 6046 | 0.004 |
| 6047 | 0.004 |
| 6048 | 0.004 |
| 6049 | 0.004 |
| 6050 | 0.004 |
| 6051 | 0.004 |
| 6052 | 0.004 |
| 6053 | 0.004 |
| 6054 | 0.004 |
| 6055 | 0.004 |
| 6056 | 0.004 |
| 6057 | 0.004 |
| 6058 | 0.004 |
| 6059 | 0.004 |
| 6060 | 0.004 |
| 6061 | 0.004 |
| 6062 | 0.004 |
| 6063 | 0.004 |
| 6064 | 0.004 |
| 6065 | 0.004 |
| 6066 | 0.004 |
| 6067 | 0.004 |
| 6068 | 0.004 |
| 6069 | 0.004 |
| 6070 | 0.004 |
| 6071 | 0.004 |
| 6072 | 0.004 |
| 6073 | 0.004 |
| 6074 | 0.004 |
| 6075 | 0.004 |
| 6076 | 0.004 |
| 6077 | 0.004 |
| 6078 | 0.004 |
| 6079 | 0.004 |
| 6080 | 0.004 |
| 6081 | 0.004 |
| 6082 | 0.004 |
| 6083 | 0.004 |
| 6084 | 0.004 |
| 6085 | 0.004 |
| 6086 | 0.004 |
| 6087 | 0.004 |
| 6088 | 0.004 |
| 6089 | 0.004 |
| 6090 | 0.004 |
| 6091 | 0.004 |
| 6092 | 0.004 |
| 6093 | 0.004 |
| 6094 | 0.004 |
| 6095 | 0.004 |
| 6096 | 0.004 |
| 6097 | 0.004 |
| 6098 | 0.004 |
| 6099 | 0.004 |
| 6100 | 0.004 |
| 6101 | 0.004 |
| 6102 | 0.004 |
| 6103 | 0.004 |
| 6104 | 0.004 |
| 6105 | 0.004 |
| 6106 | 0.004 |
| 6107 | 0.004 |
| 6108 | 0.004 |
| 6109 | 0.004 |
| 6110 | 0.004 |
| 6111 | 0.004 |
| 6112 | 0.004 |
| 6113 | 0.004 |
| 6114 | 0.004 |
| 6115 | 0.004 |
| 6116 | 0.004 |
| 6117 | 0.004 |
| 6118 | 0.004 |
| 6119 | 0.004 |
| 6120 | 0.004 |
| 6121 | 0.004 |
| 6122 | 0.004 |
| 6123 | 0.004 |
| 6124 | 0.004 |
| 6125 | 0.004 |
| 6126 | 0.004 |
| 6127 | 0.004 |
| 6128 | 0.004 |
| 6129 | 0.004 |
| 6130 | 0.004 |
| 6131 | 0.004 |
| 6132 | 0.004 |
| 6133 | 0.004 |
| 6134 | 0.004 |
| 6135 | 0.004 |
| 6136 | 0.004 |
| 6137 | 0.004 |
| 6138 | 0.004 |
| 6139 | 0.004 |
| 6140 | 0.004 |
| 6141 | 0.004 |
| 6142 | 0.004 |
| 6143 | 0.004 |
| 6144 | 0.004 |
| 6145 | 0.004 |
| 6146 | 0.004 |
| 6147 | 0.004 |
| 6148 | 0.004 |
| 6149 | 0.004 |
| 6150 | 0.004 |
| 6151 | 0.004 |
| 6152 | 0.004 |
| 6153 | 0.004 |
| 6154 | 0.004 |
| 6155 | 0.004 |
| 6156 | 0.004 |
| 6157 | 0.004 |
| 6158 | 0.004 |
| 6159 | 0.004 |
| 6160 | 0.004 |
| 6161 | 0.004 |
| 6162 | 0.004 |
| 6163 | 0.004 |
| 6164 | 0.004 |
| 6165 | 0.004 |
| 6166 | 0.004 |
| 6167 | 0.004 |
| 6168 | 0.004 |
| 6169 | 0.004 |
| 6170 | 0.004 |
| 6171 | 0.004 |
| 6172 | 0.004 |
| 6173 | 0.004 |
| 6174 | 0.004 |
| 6175 | 0.004 |
| 6176 | 0.004 |
| 6177 | 0.004 |
| 6178 | 0.004 |
| 6179 | 0.004 |
| 6180 | 0.004 |
| 6181 | 0.004 |
| 6182 | 0.004 |
| 6183 | 0.004 |
| 6184 | 0.004 |
| 6185 | 0.004 |
| 6186 | 0.004 |
| 6187 | 0.004 |
| 6188 | 0.004 |
| 6189 | 0.004 |
| 6190 | 0.004 |
| 6191 | 0.004 |
| 6192 | 0.004 |
| 6193 | 0.004 |
| 6194 | 0.004 |
| 6195 | 0.004 |
| 6196 | 0.004 |
| 6197 | 0.004 |
| 6198 | 0.004 |
| 6199 | 0.004 |
| 6200 | 0.004 |
| 6201 | 0.004 |
| 6202 | 0.004 |
| 6203 | 0.004 |
| 6204 | 0.004 |
| 6205 | 0.004 |
| 6206 | 0.004 |
| 6207 | 0.004 |
| 6208 | 0.004 |
| 6209 | 0.004 |
| 6210 | 0.004 |
| 6211 | 0.004 |
| 6212 | 0.004 |
| 6213 | 0.004 |
| 6214 | 0.004 |
| 6215 | 0.004 |
| 6216 | 0.004 |
| 6217 | 0.004 |
| 6218 | 0.004 |
| 6219 | 0.004 |
| 6220 | 0.004 |
| 6221 | 0.004 |
| 6222 | 0.004 |
| 6223 | 0.004 |
| 6224 | 0.004 |
| 6225 | 0.004 |
| 6226 | 0.004 |
| 6227 | 0.004 |
| 6228 | 0.004 |
| 6229 | 0.004 |
| 6230 | 0.004 |
| 6231 | 0.004 |
| 6232 | 0.004 |
| 6233 | 0.004 |
| 6234 | 0.004 |
| 6235 | 0.004 |
| 6236 | 0.004 |
| 6237 | 0.004 |
| 6238 | 0.004 |
| 6239 | 0.004 |
| 6240 | 0.004 |
| 6241 | 0.004 |
| 6242 | 0.004 |
| 6243 | 0.004 |
| 6244 | 0.004 |
| 6245 | 0.004 |
| 6246 | 0.004 |
| 6247 | 0.004 |
| 6248 | 0.004 |
| 6249 | 0.004 |
| 6250 | 0.004 |
| 6251 | 0.004 |
| 6252 | 0.004 |
| 6253 | 0.004 |
| 6254 | 0.004 |
| 6255 | 0.004 |
| 6256 | 0.004 |
| 6257 | 0.004 |
| 6258 | 0.004 |
| 6259 | 0.004 |
| 6260 | 0.004 |
| 6261 | 0.004 |
| 6262 | 0.004 |
| 6263 | 0.004 |
| 6264 | 0.004 |
| 6265 | 0.004 |
| 6266 | 0.004 |
| 6267 | 0.004 |
| 6268 | 0.004 |
| 6269 | 0.004 |
| 6270 | 0.004 |
| 6271 | 0.004 |
| 6272 | 0.004 |
| 6273 | 0.004 |
| 6274 | 0.004 |
| 6275 | 0.004 |
| 6276 | 0.004 |
| 6277 | 0.004 |
| 6278 | 0.004 |
| 6279 | 0.004 |
| 6280 | 0.004 |
| 6281 | 0.004 |
| 6282 | 0.004 |
| 6283 | 0.004 |
| 6284 | 0.004 |
| 6285 | 0.004 |
| 6286 | 0.004 |
| 6287 | 0.004 |
| 6288 | 0.004 |
| 6289 | 0.004 |
| 6290 | 0.004 |
| 6291 | 0.004 |
| 6292 | 0.004 |
| 6293 | 0.004 |
| 6294 | 0.004 |
| 6295 | 0.004 |
| 6296 | 0.004 |
| 6297 | 0.004 |
| 6298 | 0.004 |
| 6299 | 0.004 |
| 6300 | 0.004 |
| 6301 | 0.004 |
| 6302 | 0.004 |
| 6303 | 0.004 |
| 6304 | 0.004 |
| 6305 | 0.004 |
| 6306 | 0.004 |
| 6307 | 0.004 |
| 6308 | 0.004 |
| 6309 | 0.004 |
| 6310 | 0.004 |
| 6311 | 0.004 |
| 6312 | 0.004 |
| 6313 | 0.004 |
| 6314 | 0.004 |
| 6315 | 0.004 |
| 6316 | 0.004 |
| 6317 | 0.004 |
| 6318 | 0.004 |
| 6319 | 0.004 |
| 6320 | 0.004 |
| 6321 | 0.004 |
| 6322 | 0.004 |
| 6323 | 0.004 |
| 6324 | 0.004 |
| 6325 | 0.004 |
| 6326 | 0.004 |
| 6327 | 0.004 |
| 6328 | 0.004 |
| 6329 | 0.004 |
| 6330 | 0.004 |
| 6331 | 0.004 |
| 6332 | 0.004 |
| 6333 | 0.004 |
| 6334 | 0.004 |
| 6335 | 0.004 |
| 6336 | 0.004 |
| 6337 | 0.004 |
| 6338 | 0.004 |
| 6339 | 0.004 |
| 6340 | 0.004 |
| 6341 | 0.004 |
| 6342 | 0.004 |
| 6343 | 0.004 |
| 6344 | 0.004 |
| 6345 | 0.004 |
| 6346 | 0.004 |
| 6347 | 0.004 |
| 6348 | 0.004 |
| 6349 | 0.004 |
| 6350 | 0.004 |
| 6351 | 0.004 |
| 6352 | 0.004 |
| 6353 | 0.004 |
| 6354 | 0.004 |
| 6355 | 0.004 |
| 6356 | 0.004 |
| 6357 | 0.004 |
| 6358 | 0.004 |
| 6359 | 0.004 |
| 6360 | 0.004 |
| 6361 | 0.004 |
| 6362 | 0.004 |
| 6363 | 0.004 |
| 6364 | 0.004 |
| 6365 | 0.004 |
| 6366 | 0.004 |
| 6367 | 0.004 |
| 6368 | 0.004 |
| 6369 | 0.004 |
| 6370 | 0.004 |
| 6371 | 0.004 |
| 6372 | 0.004 |
| 6373 | 0.004 |
| 6374 | 0.004 |
| 6375 | 0.004 |
| 6376 | 0.004 |
| 6377 | 0.004 |
| 6378 | 0.004 |
| 6379 | 0.004 |
| 6380 | 0.004 |
| 6381 | 0.004 |
| 6382 | 0.004 |
| 6383 | 0.004 |
| 6384 | 0.004 |
| 6385 | 0.004 |
| 6386 | 0.004 |
| 6387 | 0.004 |
| 6388 | 0.004 |
| 6389 | 0.004 |
| 6390 | 0.004 |
| 6391 | 0.004 |
| 6392 | 0.004 |
| 6393 | 0.004 |
| 6394 | 0.004 |
| 6395 | 0.004 |
| 6396 | 0.004 |
| 6397 | 0.004 |
| 6398 | 0.004 |
| 6399 | 0.004 |
| 6400 | 0.004 |
| 6401 | 0.004 |
| 6402 | 0.004 |
| 6403 | 0.004 |
| 6404 | 0.004 |
| 6405 | 0.004 |
| 6406 | 0.004 |
| 6407 | 0.004 |
| 6408 | 0.004 |
| 6409 | 0.004 |
| 6410 | 0.004 |
| 6411 | 0.004 |
| 6412 | 0.004 |
| 6413 | 0.004 |
| 6414 | 0.004 |
| 6415 | 0.004 |
| 6416 | 0.004 |
| 6417 | 0.004 |
| 6418 | 0.004 |
| 6419 | 0.004 |
| 6420 | 0.004 |
| 6421 | 0.004 |
| 6422 | 0.004 |
| 6423 | 0.004 |
| 6424 | 0.004 |
| 6425 | 0.004 |
| 6426 | 0.004 |
| 6427 | 0.004 |
| 6428 | 0.004 |
| 6429 | 0.004 |
| 6430 | 0.004 |
| 6431 | 0.004 |
| 6432 | 0.004 |
| 6433 | 0.004 |
| 6434 | 0.004 |
| 6435 | 0.004 |
| 6436 | 0.004 |
| 6437 | 0.004 |
| 6438 | 0.004 |
| 6439 | 0.004 |
| 6440 | 0.004 |
| 6441 | 0.004 |
| 6442 | 0.004 |
| 6443 | 0.004 |
| 6444 | 0.004 |
| 6445 | 0.004 |
| 6446 | 0.004 |
| 6447 | 0.004 |
| 6448 | 0.004 |
| 6449 | 0.004 |
| 6450 | 0.004 |
| 6451 | 0.004 |
| 6452 | 0.004 |
| 6453 | 0.004 |
| 6454 | 0.004 |
| 6455 | 0.004 |
| 6456 | 0.004 |
| 6457 | 0.004 |
| 6458 | 0.004 |
| 6459 | 0.004 |
| 6460 | 0.004 |
| 6461 | 0.004 |
| 6462 | 0.004 |
| 6463 | 0.004 |
| 6464 | 0.004 |
| 6465 | 0.004 |
| 6466 | 0.004 |
| 6467 | 0.004 |
| 6468 | 0.004 |
| 6469 | 0.004 |
| 6470 | 0.004 |
| 6471 | 0.004 |
| 6472 | 0.004 |
| 6473 | 0.004 |
| 6474 | 0.004 |
| 6475 | 0.004 |
| 6476 | 0.004 |
| 6477 | 0.004 |
| 6478 | 0.004 |
| 6479 | 0.004 |
| 6480 | 0.004 |
| 6481 | 0.004 |
| 6482 | 0.004 |
| 6483 | 0.004 |
| 6484 | 0.004 |
| 6485 | 0.004 |
| 6486 | 0.004 |
| 6487 | 0.004 |
| 6488 | 0.004 |
| 6489 | 0.004 |
| 6490 | 0.004 |
| 6491 | 0.004 |
| 6492 | 0.004 |
| 6493 | 0.004 |
| 6494 | 0.004 |
| 6495 | 0.004 |
| 6496 | 0.004 |
| 6497 | 0.004 |
| 6498 | 0.004 |
| 6499 | 0.004 |
| 6500 | 0.004 |
| 6501 | 0.004 |
| 6502 | 0.004 |
| 6503 | 0.004 |
| 6504 | 0.004 |
| 6505 | 0.004 |
| 6506 | 0.004 |
| 6507 | 0.004 |
| 6508 | 0.004 |
| 6509 | 0.004 |
| 6510 | 0.004 |
| 6511 | 0.004 |
| 6512 | 0.004 |
| 6513 | 0.004 |
| 6514 | 0.004 |
| 6515 | 0.004 |
| 6516 | 0.004 |
| 6517 | 0.004 |
| 6518 | 0.004 |
| 6519 | 0.004 |
| 6520 | 0.004 |
| 6521 | 0.004 |
| 6522 | 0.004 |
| 6523 | 0.004 |
| 6524 | 0.004 |
| 6525 | 0.004 |
| 6526 | 0.004 |
| 6527 | 0.004 |
| 6528 | 0.004 |
| 6529 | 0.004 |
| 6530 | 0.004 |
| 6531 | 0.004 |
| 6532 | 0.004 |
| 6533 | 0.004 |
| 6534 | 0.004 |
| 6535 | 0.004 |
| 6536 | 0.004 |
| 6537 | 0.004 |
| 6538 | 0.004 |
| 6539 | 0.004 |
| 6540 | 0.004 |
| 6541 | 0.004 |
| 6542 | 0.004 |
| 6543 | 0.004 |
| 6544 | 0.004 |
| 6545 | 0.004 |
| 6546 | 0.004 |
| 6547 | 0.004 |
| 6548 | 0.004 |
| 6549 | 0.004 |
| 6550 | 0.004 |
| 6551 | 0.004 |
| 6552 | 0.004 |
| 6553 | 0.004 |
| 6554 | 0.004 |
| 6555 | 0.004 |
| 6556 | 0.004 |
| 6557 | 0.004 |
| 6558 | 0.004 |
| 6559 | 0.004 |
| 6560 | 0.004 |
| 6561 | 0.004 |
| 6562 | 0.004 |
| 6563 | 0.004 |
| 6564 | 0.004 |
| 6565 | 0.004 |
| 6566 | 0.004 |
| 6567 | 0.004 |
| 6568 | 0.004 |
| 6569 | 0.004 |
| 6570 | 0.004 |
| 6571 | 0.004 |
| 6572 | 0.004 |
| 6573 | 0.004 |
| 6574 | 0.004 |
| 6575 | 0.004 |
| 6576 | 0.004 |
| 6577 | 0.004 |
| 6578 | 0.004 |
| 6579 | 0.004 |
| 6580 | 0.004 |
| 6581 | 0.004 |
| 6582 | 0.004 |
| 6583 | 0.004 |
| 6584 | 0.004 |
| 6585 | 0.004 |
| 6586 | 0.004 |
| 6587 | 0.004 |
| 6588 | 0.004 |
| 6589 | 0.004 |
| 6590 | 0.004 |
| 6591 | 0.004 |
| 6592 | 0.004 |
| 6593 | 0.004 |
| 6594 | 0.004 |
| 6595 | 0.004 |
| 6596 | 0.004 |
| 6597 | 0.004 |
| 6598 | 0.004 |
| 6599 | 0.004 |
| 6600 | 0.004 |
| 6601 | 0.004 |
| 6602 | 0.004 |
| 6603 | 0.004 |
| 6604 | 0.004 |
| 6605 | 0.004 |
| 6606 | 0.004 |
| 6607 | 0.004 |
| 6608 | 0.004 |
| 6609 | 0.004 |
| 6610 | 0.004 |
| 6611 | 0.004 |
| 6612 | 0.004 |
| 6613 | 0.004 |
| 6614 | 0.004 |
| 6615 | 0.004 |
| 6616 | 0.004 |
| 6617 | 0.004 |
| 6618 | 0.004 |
| 6619 | 0.004 |
| 6620 | 0.004 |
| 6621 | 0.004 |
| 6622 | 0.004 |
| 6623 | 0.004 |
| 6624 | 0.004 |
| 6625 | 0.004 |
| 6626 | 0.004 |
| 6627 | 0.004 |
| 6628 | 0.004 |
| 6629 | 0.004 |
| 6630 | 0.004 |
| 6631 | 0.004 |
| 6632 | 0.004 |
| 6633 | 0.004 |
| 6634 | 0.004 |
| 6635 | 0.004 |
| 6636 | 0.004 |
| 6637 | 0.004 |
| 6638 | 0.004 |
| 6639 | 0.004 |
| 6640 | 0.004 |
| 6641 | 0.004 |
| 6642 | 0.004 |
| 6643 | 0.004 |
| 6644 | 0.004 |
| 6645 | 0.004 |
| 6646 | 0.004 |
| 6647 | 0.004 |
| 6648 | 0.004 |
| 6649 | 0.004 |
| 6650 | 0.004 |
| 6651 | 0.004 |
| 6652 | 0.004 |
| 6653 | 0.004 |
| 6654 | 0.004 |
| 6655 | 0.004 |
| 6656 | 0.004 |
| 6657 | 0.004 |
| 6658 | 0.004 |
| 6659 | 0.004 |
| 6660 | 0.004 |
| 6661 | 0.004 |
| 6662 | 0.004 |
| 6663 | 0.004 |
| 6664 | 0.004 |
| 6665 | 0.004 |
| 6666 | 0.004 |
| 6667 | 0.004 |
| 6668 | 0.004 |
| 6669 | 0.004 |
| 6670 | 0.004 |
| 6671 | 0.004 |
| 6672 | 0.004 |
| 6673 | 0.004 |
| 6674 | 0.004 |
| 6675 | 0.004 |
| 6676 | 0.004 |
| 6677 | 0.004 |
| 6678 | 0.004 |
| 6679 | 0.004 |
| 6680 | 0.004 |
| 6681 | 0.004 |
| 6682 | 0.004 |
| 6683 | 0.004 |
| 6684 | 0.004 |
| 6685 | 0.004 |
| 6686 | 0.004 |
| 6687 | 0.004 |
| 6688 | 0.004 |
| 6689 | 0.004 |
| 6690 | 0.004 |
| 6691 | 0.004 |
| 6692 | 0.004 |
| 6693 | 0.004 |
| 6694 | 0.004 |
| 6695 | 0.004 |
| 6696 | 0.004 |
| 6697 | 0.004 |
| 6698 | 0.004 |
| 6699 | 0.004 |
| 6700 | 0.004 |
| 6701 | 0.004 |
| 6702 | 0.004 |
| 6703 | 0.004 |
| 6704 | 0.004 |
| 6705 | 0.004 |
| 6706 | 0.004 |
| 6707 | 0.004 |
| 6708 | 0.004 |
| 6709 | 0.004 |
| 6710 | 0.004 |
| 6711 | 0.004 |
| 6712 | 0.004 |
| 6713 | 0.004 |
| 6714 | 0.004 |
| 6715 | 0.004 |
| 6716 | 0.004 |
| 6717 | 0.004 |
| 6718 | 0.004 |
| 6719 | 0.004 |
| 6720 | 0.004 |
| 6721 | 0.004 |
| 6722 | 0.004 |
| 6723 | 0.004 |
| 6724 | 0.004 |
| 6725 | 0.004 |
| 6726 | 0.004 |
| 6727 | 0.004 |
| 6728 | 0.004 |
| 6729 | 0.004 |
| 6730 | 0.004 |
| 6731 | 0.004 |
| 6732 | 0.004 |
| 6733 | 0.004 |
| 6734 | 0.004 |
| 6735 | 0.004 |
| 6736 | 0.004 |
| 6737 | 0.004 |
| 6738 | 0.004 |
| 6739 | 0.004 |
| 6740 | 0.004 |
| 6741 | 0.004 |
| 6742 | 0.004 |
| 6743 | 0.004 |
| 6744 | 0.004 |
| 6745 | 0.004 |
| 6746 | 0.004 |
| 6747 | 0.004 |
| 6748 | 0.004 |
| 6749 | 0.004 |
| 6750 | 0.004 |
| 6751 | 0.004 |
| 6752 | 0.004 |
| 6753 | 0.004 |
| 6754 | 0.004 |
| 6755 | 0.004 |
| 6756 | 0.004 |
| 6757 | 0.004 |
| 6758 | 0.004 |
| 6759 | 0.004 |
| 6760 | 0.004 |
| 6761 | 0.004 |
| 6762 | 0.004 |
| 6763 | 0.004 |
| 6764 | 0.004 |
| 6765 | 0.004 |
| 6766 | 0.004 |
| 6767 | 0.004 |
| 6768 | 0.004 |
| 6769 | 0.004 |
| 6770 | 0.004 |
| 6771 | 0.004 |
| 6772 | 0.004 |
| 6773 | 0.004 |
| 6774 | 0.004 |
| 6775 | 0.004 |
| 6776 | 0.004 |
| 6777 | 0.004 |
| 6778 | 0.004 |
| 6779 | 0.004 |
| 6780 | 0.004 |
| 6781 | 0.004 |
| 6782 | 0.004 |
| 6783 | 0.004 |
| 6784 | 0.004 |
| 6785 | 0.004 |
| 6786 | 0.004 |
| 6787 | 0.004 |
| 6788 | 0.004 |
| 6789 | 0.004 |
| 6790 | 0.004 |
| 6791 | 0.004 |
| 6792 | 0.004 |
| 6793 | 0.004 |
| 6794 | 0.004 |
| 6795 | 0.004 |
| 6796 | 0.004 |
| 6797 | 0.004 |
| 6798 | 0.004 |
| 6799 | 0.004 |
| 6800 | 0.004 |
| 6801 | 0.004 |
| 6802 | 0.004 |
| 6803 | 0.004 |
| 6804 | 0.004 |
| 6805 | 0.004 |
| 6806 | 0.004 |
| 6807 | 0.004 |
| 6808 | 0.004 |
| 6809 | 0.004 |
| 6810 | 0.004 |
| 6811 | 0.004 |
| 6812 | 0.004 |
| 6813 | 0.004 |
| 6814 | 0.004 |
| 6815 | 0.004 |
| 6816 | 0.004 |
| 6817 | 0.004 |
| 6818 | 0.004 |
| 6819 | 0.004 |
| 6820 | 0.004 |
| 6821 | 0.004 |
| 6822 | 0.004 |
| 6823 | 0.004 |
| 6824 | 0.004 |
| 6825 | 0.004 |
| 6826 | 0.004 |
| 6827 | 0.004 |
| 6828 | 0.004 |
| 6829 | 0.004 |
| 6830 | 0.004 |
| 6831 | 0.004 |
| 6832 | 0.004 |
| 6833 | 0.004 |
| 6834 | 0.004 |
| 6835 | 0.004 |
| 6836 | 0.004 |
| 6837 | 0.004 |
| 6838 | 0.004 |
| 6839 | 0.004 |
| 6840 | 0.004 |
| 6841 | 0.004 |
| 6842 | 0.004 |
| 6843 | 0.004 |
| 6844 | 0.004 |
| 6845 | 0.004 |
| 6846 | 0.004 |
| 6847 | 0.004 |
| 6848 | 0.004 |
| 6849 | 0.004 |
| 6850 | 0.004 |
| 6851 | 0.004 |
| 6852 | 0.004 |
| 6853 | 0.004 |
| 6854 | 0.004 |
| 6855 | 0.004 |
| 6856 | 0.004 |
| 6857 | 0.004 |
| 6858 | 0.004 |
| 6859 | 0.004 |
| 6860 | 0.004 |
| 6861 | 0.004 |
| 6862 | 0.004 |
| 6863 | 0.004 |
| 6864 | 0.004 |
| 6865 | 0.004 |
| 6866 | 0.004 |
| 6867 | 0.004 |
| 6868 | 0.004 |
| 6869 | 0.004 |
| 6870 | 0.004 |
| 6871 | 0.004 |
| 6872 | 0.004 |
| 6873 | 0.004 |
| 6874 | 0.004 |
| 6875 | 0.004 |
| 6876 | 0.004 |
| 6877 | 0.004 |
| 6878 | 0.004 |
| 6879 | 0.004 |
| 6880 | 0.004 |
| 6881 | 0.004 |
| 6882 | 0.004 |
| 6883 | 0.004 |
| 6884 | 0.004 |
| 6885 | 0.004 |
| 6886 | 0.004 |
| 6887 | 0.004 |
| 6888 | 0.004 |
| 6889 | 0.004 |
| 6890 | 0.004 |
| 6891 | 0.004 |
| 6892 | 0.004 |
| 6893 | 0.004 |
| 6894 | 0.004 |
| 6895 | 0.004 |
| 6896 | 0.004 |
| 6897 | 0.004 |
| 6898 | 0.004 |
| 6899 | 0.004 |
| 6900 | 0.004 |
| 6901 | 0.004 |
| 6902 | 0.004 |
| 6903 | 0.004 |
| 6904 | 0.004 |
| 6905 | 0.004 |
| 6906 | 0.004 |
| 6907 | 0.004 |
| 6908 | 0.004 |
| 6909 | 0.004 |
| 6910 | 0.004 |
| 6911 | 0.004 |
| 6912 | 0.004 |
| 6913 | 0.004 |
| 6914 | 0.004 |
| 6915 | 0.004 |
| 6916 | 0.004 |
| 6917 | 0.004 |
| 6918 | 0.004 |
| 6919 | 0.004 |
| 6920 | 0.004 |
| 6921 | 0.004 |
| 6922 | 0.004 |
| 6923 | 0.004 |
| 6924 | 0.004 |
| 6925 | 0.004 |
| 6926 | 0.004 |
| 6927 | 0.004 |
| 6928 | 0.004 |
| 6929 | 0.004 |
| 6930 | 0.004 |
| 6931 | 0.004 |
| 6932 | 0.004 |
| 6933 | 0.004 |
| 6934 | 0.004 |
| 6935 | 0.004 |
| 6936 | 0.004 |
| 6937 | 0.004 |
| 6938 | 0.004 |
| 6939 | 0.004 |
| 6940 | 0.004 |
| 6941 | 0.004 |
| 6942 | 0.004 |
| 6943 | 0.004 |
| 6944 | 0.004 |
| 6945 | 0.004 |
| 6946 | 0.004 |
| 6947 | 0.004 |
| 6948 | 0.004 |
| 6949 | 0.004 |
| 6950 | 0.004 |
| 6951 | 0.004 |
| 6952 | 0.004 |
| 6953 | 0.004 |
| 6954 | 0.004 |
| 6955 | 0.004 |
| 6956 | 0.004 |
| 6957 | 0.004 |
| 6958 | 0.004 |
| 6959 | 0.004 |
| 6960 | 0.004 |
| 6961 | 0.004 |
| 6962 | 0.004 |
| 6963 | 0.004 |
| 6964 | 0.004 |
| 6965 | 0.004 |
| 6966 | 0.004 |
| 6967 | 0.004 |
| 6968 | 0.004 |
| 6969 | 0.004 |
| 6970 | 0.004 |
| 6971 | 0.004 |
| 6972 | 0.004 |
| 6973 | 0.004 |
| 6974 | 0.004 |
| 6975 | 0.004 |
| 6976 | 0.004 |
| 6977 | 0.004 |
| 6978 | 0.004 |
| 6979 | 0.004 |
| 6980 | 0.004 |
| 6981 | 0.004 |
| 6982 | 0.004 |
| 6983 | 0.004 |
| 6984 | 0.004 |
| 6985 | 0.004 |
| 6986 | 0.004 |
| 6987 | 0.004 |
| 6988 | 0.004 |
| 6989 | 0.004 |
| 6990 | 0.004 |
| 6991 | 0.004 |
| 6992 | 0.004 |
| 6993 | 0.004 |
| 6994 | 0.004 |
| 6995 | 0.004 |
| 6996 | 0.004 |
| 6997 | 0.004 |
| 6998 | 0.004 |
| 6999 | 0.004 |
| 7000 | 0.004 |
| 7001 | 0.004 |
| 7002 | 0.004 |
| 7003 | 0.004 |
| 7004 | 0.004 |
| 7005 | 0.004 |
| 7006 | 0.004 |
| 7007 | 0.004 |
| 7008 | 0.004 |
| 7009 | 0.004 |
| 7010 | 0.004 |
| 7011 | 0.004 |
| 7012 | 0.004 |
| 7013 | 0.004 |
| 7014 | 0.004 |
| 7015 | 0.004 |
| 7016 | 0.004 |
| 7017 | 0.004 |
| 7018 | 0.004 |
| 7019 | 0.004 |
| 7020 | 0.004 |
| 7021 | 0.004 |
| 7022 | 0.004 |
| 7023 | 0.004 |
| 7024 | 0.004 |
| 7025 | 0.004 |
| 7026 | 0.004 |
| 7027 | 0.004 |
| 7028 | 0.004 |
| 7029 | 0.004 |
| 7030 | 0.004 |
| 7031 | 0.004 |
| 7032 | 0.004 |
| 7033 | 0.004 |
| 7034 | 0.004 |
| 7035 | 0.004 |
| 7036 | 0.004 |
| 7037 | 0.004 |
| 7038 | 0.004 |
| 7039 | 0.004 |
| 7040 | 0.004 |
| 7041 | 0.004 |
| 7042 | 0.004 |
| 7043 | 0.004 |
| 7044 | 0.004 |
| 7045 | 0.004 |
| 7046 | 0.004 |
| 7047 | 0.004 |
| 7048 | 0.004 |
| 7049 | 0.004 |
| 7050 | 0.004 |
| 7051 | 0.004 |
| 7052 | 0.004 |
| 7053 | 0.004 |
| 7054 | 0.004 |
| 7055 | 0.004 |
| 7056 | 0.004 |
| 7057 | 0.004 |
| 7058 | 0.004 |
| 7059 | 0.004 |
| 7060 | 0.004 |
| 7061 | 0.004 |
| 7062 | 0.004 |
| 7063 | 0.004 |
| 7064 | 0.004 |
| 7065 | 0.004 |
| 7066 | 0.004 |
| 7067 | 0.004 |
| 7068 | 0.004 |
| 7069 | 0.004 |
| 7070 | 0.004 |
| 7071 | 0.004 |
| 7072 | 0.004 |
| 7073 | 0.004 |
| 7074 | 0.004 |
| 7075 | 0.004 |
| 7076 | 0.004 |
| 7077 | 0.004 |
| 7078 | 0.004 |
| 7079 | 0.004 |
| 7080 | 0.004 |
| 7081 | 0.004 |
| 7082 | 0.004 |
| 7083 | 0.004 |
| 7084 | 0.004 |
| 7085 | 0.004 |
| 7086 | 0.004 |
| 7087 | 0.004 |
| 7088 | 0.004 |
| 7089 | 0.004 |
| 7090 | 0.004 |
| 7091 | 0.004 |
| 7092 | 0.004 |
| 7093 | 0.004 |
| 7094 | 0.004 |
| 7095 | 0.004 |
| 7096 | 0.004 |
| 7097 | 0.004 |
| 7098 | 0.004 |
| 7099 | 0.004 |
| 7100 | 0.004 |
| 7101 | 0.004 |
| 7102 | 0.004 |
| 7103 | 0.004 |
| 7104 | 0.004 |
| 7105 | 0.004 |
| 7106 | 0.004 |
| 7107 | 0.004 |
| 7108 | 0.004 |
| 7109 | 0.004 |
| 7110 | 0.004 |
| 7111 | 0.004 |
| 7112 | 0.004 |
| 7113 | 0.004 |
| 7114 | 0.004 |
| 7115 | 0.004 |
| 7116 | 0.004 |
| 7117 | 0.004 |
| 7118 | 0.004 |
| 7119 | 0.004 |
| 7120 | 0.004 |
| 7121 | 0.004 |
| 7122 | 0.004 |
| 7123 | 0.004 |
| 7124 | 0.004 |
| 7125 | 0.004 |
| 7126 | 0.004 |
| 7127 | 0.004 |
| 7128 | 0.004 |
| 7129 | 0.004 |
| 7130 | 0.004 |
| 7131 | 0.004 |
| 7132 | 0.004 |
| 7133 | 0.004 |
| 7134 | 0.004 |
| 7135 | 0.004 |
| 7136 | 0.004 |
| 7137 | 0.004 |
| 7138 | 0.004 |
| 7139 | 0.004 |
| 7140 | 0.004 |
| 7141 | 0.004 |
| 7142 | 0.004 |
| 7143 | 0.004 |
| 7144 | 0.004 |
| 7145 | 0.004 |
| 7146 | 0.004 |
| 7147 | 0.004 |
| 7148 | 0.004 |
| 7149 | 0.004 |
| 7150 | 0.004 |
| 7151 | 0.004 |
| 7152 | 0.004 |
| 7153 | 0.004 |
| 7154 | 0.004 |
| 7155 | 0.004 |
| 7156 | 0.004 |
| 7157 | 0.004 |
| 7158 | 0.004 |
| 7159 | 0.004 |
| 7160 | 0.004 |
| 7161 | 0.004 |
| 7162 | 0.004 |
| 7163 | 0.004 |
| 7164 | 0.004 |
| 7165 | 0.004 |
| 7166 | 0.004 |
| 7167 | 0.004 |
| 7168 | 0.004 |
| 7169 | 0.004 |
| 7170 | 0.004 |
| 7171 | 0.004 |
| 7172 | 0.004 |
| 7173 | 0.004 |
| 7174 | 0.004 |
| 7175 | 0.004 |
| 7176 | 0.004 |
| 7177 | 0.004 |
| 7178 | 0.004 |
| 7179 | 0.004 |
| 7180 | 0.004 |
| 7181 | 0.004 |
| 7182 | 0.004 |
| 7183 | 0.004 |
| 7184 | 0.004 |
| 7185 | 0.004 |
| 7186 | 0.004 |
| 7187 | 0.004 |
| 7188 | 0.004 |
| 7189 | 0.004 |
| 7190 | 0.004 |
| 7191 | 0.004 |
| 7192 | 0.004 |
| 7193 | 0.004 |
| 7194 | 0.004 |
| 7195 | 0.004 |
| 7196 | 0.004 |
| 7197 | 0.004 |
| 7198 | 0.004 |
| 7199 | 0.004 |
| 7200 | 0.004 |
| 7201 | 0.004 |
| 7202 | 0.004 |
| 7203 | 0.004 |
| 7204 | 0.004 |
| 7205 | 0.004 |
| 7206 | 0.004 |
| 7207 | 0.004 |
| 7208 | 0.004 |
| 7209 | 0.004 |
| 7210 | 0.004 |
| 7211 | 0.004 |
| 7212 | 0.004 |
| 7213 | 0.004 |
| 7214 | 0.004 |
| 7215 | 0.004 |
| 7216 | 0.004 |
| 7217 | 0.004 |
| 7218 | 0.004 |
| 7219 | 0.004 |
| 7220 | 0.004 |
| 7221 | 0.004 |
| 7222 | 0.004 |
| 7223 | 0.004 |
| 7224 | 0.004 |
| 7225 | 0.004 |
| 7226 | 0.004 |
| 7227 | 0.004 |
| 7228 | 0.004 |
| 7229 | 0.004 |
| 7230 | 0.004 |
| 7231 | 0.004 |
| 7232 | 0.004 |
| 7233 | 0.004 |
| 7234 | 0.004 |
| 7235 | 0.004 |
| 7236 | 0.004 |
| 7237 | 0.004 |
| 7238 | 0.004 |
| 7239 | 0.004 |
| 7240 | 0.004 |
| 7241 | 0.004 |
| 7242 | 0.004 |
| 7243 | 0.004 |
| 7244 | 0.004 |
| 7245 | 0.004 |
| 7246 | 0.004 |
| 7247 | 0.004 |
| 7248 | 0.004 |
| 7249 | 0.004 |
| 7250 | 0.004 |
| 7251 | 0.004 |
| 7252 | 0.004 |
| 7253 | 0.004 |
| 7254 | 0.004 |
| 7255 | 0.004 |
| 7256 | 0.004 |
| 7257 | 0.004 |
| 7258 | 0.004 |
| 7259 | 0.004 |
| 7260 | 0.004 |
| 7261 | 0.004 |
| 7262 | 0.004 |
| 7263 | 0.004 |
| 7264 | 0.004 |
| 7265 | 0.004 |
| 7266 | 0.004 |
| 7267 | 0.004 |
| 7268 | 0.004 |
| 7269 | 0.004 |
| 7270 | 0.004 |
| 7271 | 0.004 |
| 7272 | 0.004 |
| 7273 | 0.004 |
| 7274 | 0.004 |
| 7275 | 0.004 |
| 7276 | 0.004 |
| 7277 | 0.004 |
| 7278 | 0.004 |
| 7279 | 0.004 |
| 7280 | 0.004 |
| 7281 | 0.004 |
| 7282 | 0.004 |
| 7283 | 0.004 |
| 7284 | 0.004 |
| 7285 | 0.004 |
| 7286 | 0.004 |
| 7287 | 0.004 |
| 7288 | 0.004 |
| 7289 | 0.004 |
| 7290 | 0.004 |
| 7291 | 0.004 |
| 7292 | 0.004 |
| 7293 | 0.004 |
| 7294 | 0.004 |
| 7295 | 0.004 |
| 7296 | 0.004 |
| 7297 | 0.004 |
| 7298 | 0.004 |
| 7299 | 0.004 |
| 7300 | 0.004 |
| 7301 | 0.004 |
| 7302 | 0.004 |
| 7303 | 0.004 |
| 7304 | 0.004 |
| 7305 | 0.004 |
| 7306 | 0.004 |
| 7307 | 0.004 |
| 7308 | 0.004 |
| 7309 | 0.004 |
| 7310 | 0.004 |
| 7311 | 0.004 |
| 7312 | 0.004 |
| 7313 | 0.004 |
| 7314 | 0.004 |
| 7315 | 0.004 |
| 7316 | 0.004 |
| 7317 | 0.004 |
| 7318 | 0.004 |
| 7319 | 0.004 |
| 7320 | 0.004 |
| 7321 | 0.004 |
| 7322 | 0.004 |
| 7323 | 0.004 |
| 7324 | 0.004 |
| 7325 | 0.004 |
| 7326 | 0.004 |
| 7327 | 0.004 |
| 7328 | 0.004 |
| 7329 | 0.004 |
| 7330 | 0.004 |
| 7331 | 0.004 |
| 7332 | 0.004 |
| 7333 | 0.004 |
| 7334 | 0.004 |
| 7335 | 0.004 |
| 7336 | 0.004 |
| 7337 | 0.004 |
| 7338 | 0.004 |
| 7339 | 0.004 |
| 7340 | 0.004 |
| 7341 | 0.004 |
| 7342 | 0.004 |
| 7343 | 0.004 |
| 7344 | 0.004 |
| 7345 | 0.004 |
| 7346 | 0.004 |
| 7347 | 0.004 |
| 7348 | 0.004 |
| 7349 | 0.004 |
| 7350 | 0.004 |
| 7351 | 0.004 |
| 7352 | 0.004 |
| 7353 | 0.004 |
| 7354 | 0.004 |
| 7355 | 0.004 |
| 7356 | 0.004 |
| 7357 | 0.004 |
| 7358 | 0.004 |
| 7359 | 0.004 |
| 7360 | 0.004 |
| 7361 | 0.004 |
| 7362 | 0.004 |
| 7363 | 0.004 |
| 7364 | 0.004 |
| 7365 | 0.004 |
| 7366 | 0.004 |
| 7367 | 0.004 |
| 7368 | 0.004 |
| 7369 | 0.004 |
| 7370 | 0.004 |
| 7371 | 0.004 |
| 7372 | 0.004 |
| 7373 | 0.004 |
| 7374 | 0.004 |
| 7375 | 0.004 |
| 7376 | 0.004 |
| 7377 | 0.004 |
| 7378 | 0.004 |
| 7379 | 0.004 |
| 7380 | 0.004 |
| 7381 | 0.004 |
| 7382 | 0.004 |
| 7383 | 0.004 |
| 7384 | 0.004 |
| 7385 | 0.004 |
| 7386 | 0.004 |
| 7387 | 0.004 |
| 7388 | 0.004 |
| 7389 | 0.004 |
| 7390 | 0.004 |
| 7391 | 0.004 |
| 7392 | 0.004 |
| 7393 | 0.004 |
| 7394 | 0.004 |
| 7395 | 0.004 |
| 7396 | 0.004 |
| 7397 | 0.004 |
| 7398 | 0.004 |
| 7399 | 0.004 |
| 7400 | 0.004 |
| 7401 | 0.004 |
| 7402 | 0.004 |
| 7403 | 0.004 |
| 7404 | 0.004 |
| 7405 | 0.004 |
| 7406 | 0.004 |
| 7407 | 0.004 |
| 7408 | 0.004 |
| 7409 | 0.004 |
| 7410 | 0.004 |
| 7411 | 0.004 |
| 7412 | 0.004 |
| 7413 | 0.004 |
| 7414 | 0.004 |
| 7415 | 0.004 |
| 7416 | 0.004 |
| 7417 | 0.004 |
| 7418 | 0.004 |
| 7419 | 0.004 |
| 7420 | 0.004 |
| 7421 | 0.004 |
| 7422 | 0.004 |
| 7423 | 0.004 |
| 7424 | 0.004 |
| 7425 | 0.004 |
| 7426 | 0.004 |
| 7427 | 0.004 |
| 7428 | 0.004 |
| 7429 | 0.004 |
| 7430 | 0.004 |
| 7431 | 0.004 |
| 7432 | 0.004 |
| 7433 | 0.004 |
| 7434 | 0.004 |
| 7435 | 0.004 |
| 7436 | 0.004 |
| 7437 | 0.004 |
| 7438 | 0.004 |
| 7439 | 0.004 |
| 7440 | 0.004 |
| 7441 | 0.004 |
| 7442 | 0.004 |
| 7443 | 0.004 |
| 7444 | 0.004 |
| 7445 | 0.004 |
| 7446 | 0.004 |
| 7447 | 0.004 |
| 7448 | 0.004 |
| 7449 | 0.004 |
| 7450 | 0.004 |
| 7451 | 0.004 |
| 7452 | 0.004 |
| 7453 | 0.004 |
| 7454 | 0.004 |
| 7455 | 0.004 |
| 7456 | 0.004 |
| 7457 | 0.004 |
| 7458 | 0.004 |
| 7459 | 0.004 |
| 7460 | 0.004 |
| 7461 | 0.004 |
| 7462 | 0.004 |
| 7463 | 0.004 |
| 7464 | 0.004 |
| 7465 | 0.004 |
| 7466 | 0.004 |
| 7467 | 0.004 |
| 7468 | 0.004 |
| 7469 | 0.004 |
| 7470 | 0.004 |
| 7471 | 0.004 |
| 7472 | 0.004 |
| 7473 | 0.004 |
| 7474 | 0.004 |
| 7475 | 0.004 |
| 7476 | 0.004 |
| 7477 | 0.004 |
| 7478 | 0.004 |
| 7479 | 0.004 |
| 7480 | 0.004 |
| 7481 | 0.004 |
| 7482 | 0.004 |
| 7483 | 0.004 |
| 7484 | 0.004 |
| 7485 | 0.004 |
| 7486 | 0.004 |
| 7487 | 0.004 |
| 7488 | 0.004 |
| 7489 | 0.004 |
| 7490 | 0.004 |
| 7491 | 0.004 |
| 7492 | 0.004 |
| 7493 | 0.004 |
| 7494 | 0.004 |
| 7495 | 0.004 |
| 7496 | 0.004 |
| 7497 | 0.004 |
| 7498 | 0.004 |
| 7499 | 0.004 |
| 7500 | 0.004 |
| 7501 | 0.004 |
| 7502 | 0.004 |
| 7503 | 0.004 |
| 7504 | 0.004 |
| 7505 | 0.004 |
| 7506 | 0.004 |
| 7507 | 0.004 |
| 7508 | 0.004 |
| 7509 | 0.004 |
| 7510 | 0.004 |
| 7511 | 0.004 |
| 7512 | 0.004 |
| 7513 | 0.004 |
| 7514 | 0.004 |
| 7515 | 0.004 |
| 7516 | 0.004 |
| 7517 | 0.004 |
| 7518 | 0.004 |
| 7519 | 0.004 |
| 7520 | 0.004 |
| 7521 | 0.004 |
| 7522 | 0.004 |
| 7523 | 0.004 |
| 7524 | 0.004 |
| 7525 | 0.004 |
| 7526 | 0.004 |
| 7527 | 0.004 |
| 7528 | 0.004 |
| 7529 | 0.004 |
| 7530 | 0.004 |
| 7531 | 0.004 |
| 7532 | 0.004 |
| 7533 | 0.004 |
| 7534 | 0.004 |
| 7535 | 0.004 |
| 7536 | 0.004 |
| 7537 | 0.004 |
| 7538 | 0.004 |
| 7539 | 0.004 |
| 7540 | 0.004 |
| 7541 | 0.004 |
| 7542 | 0.004 |
| 7543 | 0.004 |
| 7544 | 0.004 |
| 7545 | 0.004 |
| 7546 | 0.004 |
| 7547 | 0.004 |
| 7548 | 0.004 |
| 7549 | 0.004 |
| 7550 | 0.004 |
| 7551 | 0.004 |
| 7552 | 0.004 |
| 7553 | 0.004 |
| 7554 | 0.004 |
| 7555 | 0.004 |
| 7556 | 0.004 |
| 7557 | 0.004 |
| 7558 | 0.004 |
| 7559 | 0.004 |
| 7560 | 0.004 |
| 7561 | 0.004 |
| 7562 | 0.004 |
| 7563 | 0.004 |
| 7564 | 0.004 |
| 7565 | 0.004 |
| 7566 | 0.004 |
| 7567 | 0.004 |
| 7568 | 0.004 |
| 7569 | 0.004 |
| 7570 | 0.004 |
| 7571 | 0.004 |
| 7572 | 0.004 |
| 7573 | 0.004 |
| 7574 | 0.004 |
| 7575 | 0.004 |
| 7576 | 0.004 |
| 7577 | 0.004 |
| 7578 | 0.004 |
| 7579 | 0.004 |
| 7580 | 0.004 |
| 7581 | 0.004 |
| 7582 | 0.004 |
| 7583 | 0.004 |
| 7584 | 0.004 |
| 7585 | 0.004 |
| 7586 | 0.004 |
| 7587 | 0.004 |
| 7588 | 0.004 |
| 7589 | 0.004 |
| 7590 | 0.004 |
| 7591 | 0.004 |
| 7592 | 0.004 |
| 7593 | 0.004 |
| 7594 | 0.004 |
| 7595 | 0.004 |
| 7596 | 0.004 |
| 7597 | 0.004 |
| 7598 | 0.004 |
| 7599 | 0.004 |
| 7600 | 0.004 |
| 7601 | 0.004 |
| 7602 | 0.004 |
| 7603 | 0.004 |
| 7604 | 0.004 |
| 7605 | 0.004 |
| 7606 | 0.004 |
| 7607 | 0.004 |
| 7608 | 0.004 |
| 7609 | 0.004 |
| 7610 | 0.004 |
| 7611 | 0.004 |
| 7612 | 0.004 |
| 7613 | 0.004 |
| 7614 | 0.004 |
| 7615 | 0.004 |
| 7616 | 0.004 |
| 7617 | 0.004 |
| 7618 | 0.004 |
| 7619 | 0.004 |
| 7620 | 0.004 |
| 7621 | 0.004 |
| 7622 | 0.004 |
| 7623 | 0.004 |
| 7624 | 0.004 |
| 7625 | 0.004 |
| 7626 | 0.004 |
| 7627 | 0.004 |
| 7628 | 0.004 |
| 7629 | 0.004 |
| 7630 | 0.004 |
| 7631 | 0.004 |
| 7632 | 0.004 |
| 7633 | 0.004 |
| 7634 | 0.004 |
| 7635 | 0.004 |
| 7636 | 0.004 |
| 7637 | 0.004 |
| 7638 | 0.004 |
| 7639 | 0.004 |
| 7640 | 0.004 |
| 7641 | 0.004 |
| 7642 | 0.004 |
| 7643 | 0.004 |
| 7644 | 0.004 |
| 7645 | 0.004 |
| 7646 | 0.004 |
| 7647 | 0.004 |
| 7648 | 0.004 |
| 7649 | 0.004 |
| 7650 | 0.004 |
| 7651 | 0.004 |
| 7652 | 0.004 |
| 7653 | 0.004 |
| 7654 | 0.004 |
| 7655 | 0.004 |
| 7656 | 0.004 |
| 7657 | 0.004 |
| 7658 | 0.004 |
| 7659 | 0.004 |
| 7660 | 0.004 |
| 7661 | 0.004 |
| 7662 | 0.004 |
| 7663 | 0.004 |
| 7664 | 0.004 |
| 7665 | 0.004 |
| 7666 | 0.004 |
| 7667 | 0.004 |
| 7668 | 0.004 |
| 7669 | 0.004 |
| 7670 | 0.004 |
| 7671 | 0.004 |
| 7672 | 0.004 |
| 7673 | 0.004 |
| 7674 | 0.004 |
| 7675 | 0.004 |
| 7676 | 0.004 |
| 7677 | 0.004 |
| 7678 | 0.004 |
| 7679 | 0.004 |
| 7680 | 0.004 |
| 7681 | 0.004 |
| 7682 | 0.004 |
| 7683 | 0.004 |
| 7684 | 0.004 |
| 7685 | 0.004 |
| 7686 | 0.004 |
| 7687 | 0.004 |
| 7688 | 0.004 |
| 7689 | 0.004 |
| 7690 | 0.004 |
| 7691 | 0.004 |
| 7692 | 0.004 |
| 7693 | 0.004 |
| 7694 | 0.004 |
| 7695 | 0.004 |
| 7696 | 0.004 |
| 7697 | 0.004 |
| 7698 | 0.004 |
| 7699 | 0.004 |
| 7700 | 0.004 |
| 7701 | 0.004 |
| 7702 | 0.004 |
| 7703 | 0.004 |
| 7704 | 0.004 |
| 7705 | 0.004 |
| 7706 | 0.004 |
| 7707 | 0.004 |
| 7708 | 0.004 |
| 7709 | 0.004 |
| 7710 | 0.004 |
| 7711 | 0.004 |
| 7712 | 0.004 |
| 7713 | 0.004 |
| 7714 | 0.004 |
| 7715 | 0.004 |
| 7716 | 0.004 |
| 7717 | 0.004 |
| 7718 | 0.004 |
| 7719 | 0.004 |
| 7720 | 0.004 |
| 7721 | 0.004 |
| 7722 | 0.004 |
| 7723 | 0.004 |
| 7724 | 0.004 |
| 7725 | 0.004 |
| 7726 | 0.004 |
| 7727 | 0.004 |
| 7728 | 0.004 |
| 7729 | 0.004 |
| 7730 | 0.004 |
| 7731 | 0.004 |
| 7732 | 0.004 |
| 7733 | 0.004 |
| 7734 | 0.004 |
| 7735 | 0.004 |
| 7736 | 0.004 |
| 7737 | 0.004 |
| 7738 | 0.004 |
| 7739 | 0.004 |
| 7740 | 0.004 |
| 7741 | 0.004 |
| 7742 | 0.004 |
| 7743 | 0.004 |
| 7744 | 0.004 |
| 7745 | 0.004 |
| 7746 | 0.004 |
| 7747 | 0.004 |
| 7748 | 0.004 |
| 7749 | 0.004 |
| 7750 | 0.004 |
| 7751 | 0.004 |
| 7752 | 0.004 |
| 7753 | 0.004 |
| 7754 | 0.004 |
| 7755 | 0.004 |
| 7756 | 0.004 |
| 7757 | 0.004 |
| 7758 | 0.004 |
| 7759 | 0.004 |
| 7760 | 0.004 |
| 7761 | 0.004 |
| 7762 | 0.004 |
| 7763 | 0.004 |
| 7764 | 0.004 |
| 7765 | 0.004 |
| 7766 | 0.004 |
| 7767 | 0.004 |
| 7768 | 0.004 |
| 7769 | 0.004 |
| 7770 | 0.004 |
| 7771 | 0.004 |
| 7772 | 0.004 |
| 7773 | 0.004 |
| 7774 | 0.004 |
| 7775 | 0.004 |
| 7776 | 0.004 |
| 7777 | 0.004 |
| 7778 | 0.004 |
| 7779 | 0.004 |
| 7780 | 0.004 |
| 7781 | 0.004 |
| 7782 | 0.004 |
| 7783 | 0.004 |
| 7784 | 0.004 |
| 7785 | 0.004 |
| 7786 | 0.004 |
| 7787 | 0.004 |
| 7788 | 0.004 |
| 7789 | 0.004 |
| 7790 | 0.004 |
| 7791 | 0.004 |
| 7792 | 0.004 |
| 7793 | 0.004 |
| 7794 | 0.004 |
| 7795 | 0.004 |
| 7796 | 0.004 |
| 7797 | 0.004 |
| 7798 | 0.004 |
| 7799 | 0.004 |
| 7800 | 0.004 |
| 7801 | 0.004 |
| 7802 | 0.004 |
| 7803 | 0.004 |
| 7804 | 0.004 |
| 7805 | 0.004 |
| 7806 | 0.004 |
| 7807 | 0.004 |
| 7808 | 0.004 |
| 7809 | 0.004 |
| 7810 | 0.004 |
| 7811 | 0.004 |
| 7812 | 0.004 |
| 7813 | 0.004 |
| 7814 | 0.004 |
| 7815 | 0.004 |
| 7816 | 0.004 |
| 7817 | 0.004 |
| 7818 | 0.004 |
| 7819 | 0.004 |
| 7820 | 0.004 |
| 7821 | 0.004 |
| 7822 | 0.004 |
| 7823 | 0.004 |
| 7824 | 0.004 |
| 7825 | 0.004 |
| 7826 | 0.004 |
| 7827 | 0.004 |
| 7828 | 0.004 |
| 7829 | 0.004 |
| 7830 | 0.004 |
| 7831 | 0.004 |
| 7832 | 0.004 |
| 7833 | 0.004 |
| 7834 | 0.004 |
| 7835 | 0.004 |
| 7836 | 0.004 |
| 7837 | 0.004 |
| 7838 | 0.004 |
| 7839 | 0.004 |
| 7840 | 0.004 |
| 7841 | 0.004 |
| 7842 | 0.004 |
| 7843 | 0.004 |
| 7844 | 0.004 |
| 7845 | 0.004 |
| 7846 | 0.004 |
| 7847 | 0.004 |
| 7848 | 0.004 |
| 7849 | 0.004 |
| 7850 | 0.004 |
| 7851 | 0.004 |
| 7852 | 0.004 |
| 7853 | 0.004 |
| 7854 | 0.004 |
| 7855 | 0.004 |
| 7856 | 0.004 |
| 7857 | 0.004 |
| 7858 | 0.004 |
| 7859 | 0.004 |
| 7860 | 0.004 |
| 7861 | 0.004 |
| 7862 | 0.004 |
| 7863 | 0.004 |
| 7864 | 0.004 |
| 7865 | 0.004 |
| 7866 | 0.004 |
| 7867 | 0.004 |
| 7868 | 0.004 |
| 7869 | 0.004 |
| 7870 | 0.004 |
| 7871 | 0.004 |
| 7872 | 0.004 |
| 7873 | 0.004 |
| 7874 | 0.004 |
| 7875 | 0.004 |
| 7876 | 0.004 |
| 7877 | 0.004 |
| 7878 | 0.004 |
| 7879 | 0.004 |
| 7880 | 0.004 |
| 7881 | 0.004 |
| 7882 | 0.004 |
| 7883 | 0.004 |
| 7884 | 0.004 |
| 7885 | 0.004 |
| 7886 | 0.004 |
| 7887 | 0.004 |
| 7888 | 0.004 |
| 7889 | 0.004 |
| 7890 | 0.004 |
| 7891 | 0.004 |
| 7892 | 0.004 |
| 7893 | 0.004 |
| 7894 | 0.004 |
| 7895 | 0.004 |
| 7896 | 0.004 |
| 7897 | 0.004 |
| 7898 | 0.004 |
| 7899 | 0.004 |
| 7900 | 0.004 |
| 7901 | 0.004 |
| 7902 | 0.004 |
| 7903 | 0.004 |
| 7904 | 0.004 |
| 7905 | 0.004 |
| 7906 | 0.004 |
| 7907 | 0.004 |
| 7908 | 0.004 |
| 7909 | 0.004 |
| 7910 | 0.004 |
| 7911 | 0.004 |
| 7912 | 0.004 |
| 7913 | 0.004 |
| 7914 | 0.004 |
| 7915 | 0.004 |
| 7916 | 0.004 |
| 7917 | 0.004 |
| 7918 | 0.004 |
| 7919 | 0.004 |
| 7920 | 0.004 |
| 7921 | 0.004 |
| 7922 | 0.004 |
| 7923 | 0.004 |
| 7924 | 0.004 |
| 7925 | 0.004 |
| 7926 | 0.004 |
| 7927 | 0.004 |
| 7928 | 0.004 |
| 7929 | 0.004 |
| 7930 | 0.004 |
| 7931 | 0.004 |
| 7932 | 0.004 |
| 7933 | 0.004 |
| 7934 | 0.004 |
| 7935 | 0.004 |
| 7936 | 0.004 |
| 7937 | 0.004 |
| 7938 | 0.004 |
| 7939 | 0.004 |
| 7940 | 0.004 |
| 7941 | 0.004 |
| 7942 | 0.004 |
| 7943 | 0.004 |
| 7944 | 0.004 |
| 7945 | 0.004 |
| 7946 | 0.004 |
| 7947 | 0.004 |
| 7948 | 0.004 |
| 7949 | 0.004 |
| 7950 | 0.004 |
| 7951 | 0.004 |
| 7952 | 0.004 |
| 7953 | 0.004 |
| 7954 | 0.004 |
| 7955 | 0.004 |
| 7956 | 0.004 |
| 7957 | 0.004 |
| 7958 | 0.004 |
| 7959 | 0.004 |
| 7960 | 0.004 |
| 7961 | 0.004 |
| 7962 | 0.004 |
| 7963 | 0.004 |
| 7964 | 0.004 |
| 7965 | 0.004 |
| 7966 | 0.004 |
| 7967 | 0.004 |
| 7968 | 0.004 |
| 7969 | 0.004 |
| 7970 | 0.004 |
| 7971 | 0.004 |
| 7972 | 0.004 |
| 7973 | 0.004 |
| 7974 | 0.004 |
| 7975 | 0.004 |
| 7976 | 0.004 |
| 7977 | 0.004 |
| 7978 | 0.004 |
| 7979 | 0.004 |
| 7980 | 0.004 |
| 7981 | 0.004 |
| 7982 | 0.004 |
| 7983 | 0.004 |
| 7984 | 0.004 |
| 7985 | 0.004 |
| 7986 | 0.004 |
| 7987 | 0.004 |
| 7988 | 0.004 |
| 7989 | 0.004 |
| 7990 | 0.004 |
| 7991 | 0.004 |
| 7992 | 0.004 |
| 7993 | 0.004 |
| 7994 | 0.004 |
| 7995 | 0.004 |
| 7996 | 0.004 |
| 7997 | 0.004 |
| 7998 | 0.004 |
| 7999 | 0.004 |
| 8000 | 0.004 |
| 8001 | 0.004 |
| 8002 | 0.004 |
| 8003 | 0.004 |
| 8004 | 0.004 |
| 8005 | 0.004 |
| 8006 | 0.004 |
| 8007 | 0.004 |
| 8008 | 0.004 |
| 8009 | 0.004 |
| 8010 | 0.004 |
| 8011 | 0.004 |
| 8012 | 0.004 |
| 8013 | 0.004 |
| 8014 | 0.004 |
| 8015 | 0.004 |
| 8016 | 0.004 |
| 8017 | 0.004 |
| 8018 | 0.004 |
| 8019 | 0.004 |
| 8020 | 0.004 |
| 8021 | 0.004 |
| 8022 | 0.004 |
| 8023 | 0.004 |
| 8024 | 0.004 |
| 8025 | 0.004 |
| 8026 | 0.004 |
| 8027 | 0.004 |
| 8028 | 0.004 |
| 8029 | 0.004 |
| 8030 | 0.004 |
| 8031 | 0.004 |
| 8032 | 0.004 |
| 8033 | 0.004 |
| 8034 | 0.004 |
| 8035 | 0.004 |
| 8036 | 0.004 |
| 8037 | 0.004 |
| 8038 | 0.004 |
| 8039 | 0.004 |
| 8040 | 0.004 |
| 8041 | 0.004 |
| 8042 | 0.004 |
| 8043 | 0.004 |
| 8044 | 0.004 |
| 8045 | 0.004 |
| 8046 | 0.004 |
| 8047 | 0.004 |
| 8048 | 0.004 |
| 8049 | 0.004 |
| 8050 | 0.004 |
| 8051 | 0.004 |
| 8052 | 0.004 |
| 8053 | 0.004 |
| 8054 | 0.004 |
| 8055 | 0.004 |
| 8056 | 0.004 |
| 8057 | 0.004 |
| 8058 | 0.004 |
| 8059 | 0.004 |
| 8060 | 0.004 |
| 8061 | 0.004 |
| 8062 | 0.004 |
| 8063 | 0.004 |
| 8064 | 0.004 |
| 8065 | 0.004 |
| 8066 | 0.004 |
| 8067 | 0.004 |
| 8068 | 0.004 |
| 8069 | 0.004 |
| 8070 | 0.004 |
| 8071 | 0.004 |
| 8072 | 0.004 |
| 8073 | 0.004 |
| 8074 | 0.004 |
| 8075 | 0.004 |
| 8076 | 0.004 |
| 8077 | 0.004 |
| 8078 | 0.004 |
| 8079 | 0.004 |
| 8080 | 0.004 |
| 8081 | 0.004 |
| 8082 | 0.004 |
| 8083 | 0.004 |
| 8084 | 0.004 |
| 8085 | 0.004 |
| 8086 | 0.004 |
| 8087 | 0.004 |
| 8088 | 0.004 |
| 8089 | 0.004 |
| 8090 | 0.004 |
| 8091 | 0.004 |
| 8092 | 0.004 |
| 8093 | 0.004 |
| 8094 | 0.004 |
| 8095 | 0.004 |
| 8096 | 0.004 |
| 8097 | 0.004 |
| 8098 | 0.004 |
| 8099 | 0.004 |
| 8100 | 0.004 |
| 8101 | 0.004 |
| 8102 | 0.004 |
| 8103 | 0.004 |
| 8104 | 0.004 |
| 8105 | 0.004 |
| 8106 | 0.004 |
| 8107 | 0.004 |
| 8108 | 0.004 |
| 8109 | 0.004 |
| 8110 | 0.004 |
| 8111 | 0.004 |
| 8112 | 0.004 |
| 8113 | 0.004 |
| 8114 | 0.004 |
| 8115 | 0.004 |
| 8116 | 0.004 |
| 8117 | 0.004 |
| 8118 | 0.004 |
| 8119 | 0.004 |
| 8120 | 0.004 |
| 8121 | 0.004 |
| 8122 | 0.004 |
| 8123 | 0.004 |
| 8124 | 0.004 |
| 8125 | 0.004 |
| 8126 | 0.004 |
| 8127 | 0.004 |
| 8128 | 0.004 |
| 8129 | 0.004 |
| 8130 | 0.004 |
| 8131 | 0.004 |
| 8132 | 0.004 |
| 8133 | 0.004 |
| 8134 | 0.004 |
| 8135 | 0.004 |
| 8136 | 0.004 |
| 8137 | 0.004 |
| 8138 | 0.004 |
| 8139 | 0.004 |
| 8140 | 0.004 |
| 8141 | 0.004 |
| 8142 | 0.004 |
| 8143 | 0.004 |
| 8144 | 0.004 |
| 8145 | 0.004 |
| 8146 | 0.004 |
| 8147 | 0.004 |
| 8148 | 0.004 |
| 8149 | 0.004 |
| 8150 | 0.004 |
| 8151 | 0.004 |
| 8152 | 0.004 |
| 8153 | 0.004 |
| 8154 | 0.004 |
| 8155 | 0.004 |
| 8156 | 0.004 |
| 8157 | 0.004 |
| 8158 | 0.004 |
| 8159 | 0.004 |
| 8160 | 0.004 |
| 8161 | 0.004 |
| 8162 | 0.004 |
| 8163 | 0.004 |
| 8164 | 0.004 |
| 8165 | 0.004 |
| 8166 | 0.004 |
| 8167 | 0.004 |
| 8168 | 0.004 |
| 8169 | 0.004 |
| 8170 | 0.004 |
| 8171 | 0.004 |
| 8172 | 0.004 |
| 8173 | 0.004 |
| 8174 | 0.004 |
| 8175 | 0.004 |
| 8176 | 0.004 |
| 8177 | 0.004 |
| 8178 | 0.004 |
| 8179 | 0.004 |
| 8180 | 0.004 |
| 8181 | 0.004 |
| 8182 | 0.004 |
| 8183 | 0.004 |
| 8184 | 0.004 |
| 8185 | 0.004 |
| 8186 | 0.004 |
| 8187 | 0.004 |
| 8188 | 0.004 |
| 8189 | 0.004 |
| 8190 | 0.004 |
| 8191 | 0.004 |
| 8192 | 0.004 |
| 8193 | 0.004 |
| 8194 | 0.004 |
| 8195 | 0.004 |
| 8196 | 0.004 |
| 8197 | 0.004 |
| 8198 | 0.004 |
| 8199 | 0.004 |
| 8200 | 0.004 |
| 8201 | 0.004 |
| 8202 | 0.004 |
| 8203 | 0.004 |
| 8204 | 0.004 |
| 8205 | 0.004 |
| 8206 | 0.004 |
| 8207 | 0.004 |
| 8208 | 0.004 |
| 8209 | 0.004 |
| 8210 | 0.004 |
| 8211 | 0.004 |
| 8212 | 0.004 |
| 8213 | 0.004 |
| 8214 | 0.004 |
| 8215 | 0.004 |
| 8216 | 0.004 |
| 8217 | 0.004 |
| 8218 | 0.004 |
| 8219 | 0.004 |
| 8220 | 0.004 |
| 8221 | 0.004 |
| 8222 | 0.004 |
| 8223 | 0.004 |
| 8224 | 0.004 |
| 8225 | 0.004 |
| 8226 | 0.004 |
| 8227 | 0.004 |
| 8228 | 0.004 |
| 8229 | 0.004 |
| 8230 | 0.004 |
| 8231 | 0.004 |
| 8232 | 0.004 |
| 8233 | 0.004 |
| 8234 | 0.004 |
| 8235 | 0.004 |
| 8236 | 0.004 |
| 8237 | 0.004 |
| 8238 | 0.004 |
| 8239 | 0.004 |
| 8240 | 0.004 |
| 8241 | 0.004 |
| 8242 | 0.004 |
| 8243 | 0.004 |
| 8244 | 0.004 |
| 8245 | 0.004 |
| 8246 | 0.004 |
| 8247 | 0.004 |
| 8248 | 0.004 |
| 8249 | 0.004 |
| 8250 | 0.004 |
| 8251 | 0.004 |
| 8252 | 0.004 |
| 8253 | 0.004 |
| 8254 | 0.004 |
| 8255 | 0.004 |
| 8256 | 0.004 |
| 8257 | 0.004 |
| 8258 | 0.004 |
| 8259 | 0.004 |
| 8260 | 0.004 |
| 8261 | 0.004 |
| 8262 | 0.004 |
| 8263 | 0.004 |
| 8264 | 0.004 |
| 8265 | 0.004 |
| 8266 | 0.004 |
| 8267 | 0.004 |
| 8268 | 0.004 |
| 8269 | 0.004 |
| 8270 | 0.004 |
| 8271 | 0.004 |
| 8272 | 0.004 |
| 8273 | 0.004 |
| 8274 | 0.004 |
| 8275 | 0.004 |
| 8276 | 0.004 |
| 8277 | 0.004 |
| 8278 | 0.004 |
| 8279 | 0.004 |
| 8280 | 0.004 |
| 8281 | 0.004 |
| 8282 | 0.004 |
| 8283 | 0.004 |
| 8284 | 0.004 |
| 8285 | 0.004 |
| 8286 | 0.004 |
| 8287 | 0.004 |
| 8288 | 0.004 |
| 8289 | 0.004 |
| 8290 | 0.004 |
| 8291 | 0.004 |
| 8292 | 0.004 |
| 8293 | 0.004 |
| 8294 | 0.004 |
| 8295 | 0.004 |
| 8296 | 0.004 |
| 8297 | 0.004 |
| 8298 | 0.004 |
| 8299 | 0.004 |
| 8300 | 0.004 |
| 8301 | 0.004 |
| 8302 | 0.004 |
| 8303 | 0.004 |
| 8304 | 0.004 |
| 8305 | 0.004 |
| 8306 | 0.004 |
| 8307 | 0.004 |
| 8308 | 0.004 |
| 8309 | 0.004 |
| 8310 | 0.004 |
| 8311 | 0.004 |
| 8312 | 0.004 |
| 8313 | 0.004 |
| 8314 | 0.004 |
| 8315 | 0.004 |
| 8316 | 0.004 |
| 8317 | 0.004 |
| 8318 | 0.004 |
| 8319 | 0.004 |
| 8320 | 0.004 |
| 8321 | 0.004 |
| 8322 | 0.004 |
| 8323 | 0.004 |
| 8324 | 0.004 |
| 8325 | 0.004 |
| 8326 | 0.004 |
| 8327 | 0.004 |
| 8328 | 0.004 |
| 8329 | 0.004 |
| 8330 | 0.004 |
| 8331 | 0.004 |
| 8332 | 0.004 |
| 8333 | 0.004 |
| 8334 | 0.004 |
| 8335 | 0.004 |
| 8336 | 0.004 |
| 8337 | 0.004 |
| 8338 | 0.004 |
| 8339 | 0.004 |
| 8340 | 0.004 |
| 8341 | 0.004 |
| 8342 | 0.004 |
| 8343 | 0.004 |
| 8344 | 0.004 |
| 8345 | 0.004 |
| 8346 | 0.004 |
| 8347 | 0.004 |
| 8348 | 0.004 |
| 8349 | 0.004 |
| 8350 | 0.004 |
| 8351 | 0.004 |
| 8352 | 0.004 |
| 8353 | 0.004 |
| 8354 | 0.004 |
| 8355 | 0.004 |
| 8356 | 0.004 |
| 8357 | 0.004 |
| 8358 | 0.004 |
| 8359 | 0.004 |
| 8360 | 0.004 |
| 8361 | 0.004 |
| 8362 | 0.004 |
| 8363 | 0.004 |
| 8364 | 0.004 |
| 8365 | 0.004 |
| 8366 | 0.004 |
| 8367 | 0.004 |
| 8368 | 0.004 |
| 8369 | 0.004 |
| 8370 | 0.004 |
| 8371 | 0.004 |
| 8372 | 0.004 |
| 8373 | 0.004 |
| 8374 | 0.004 |
| 8375 | 0.004 |
| 8376 | 0.004 |
| 8377 | 0.004 |
| 8378 | 0.004 |
| 8379 | 0.004 |
| 8380 | 0.004 |
| 8381 | 0.004 |
| 8382 | 0.004 |
| 8383 | 0.004 |
| 8384 | 0.004 |
| 8385 | 0.004 |
| 8386 | 0.004 |
| 8387 | 0.004 |
| 8388 | 0.004 |
| 8389 | 0.004 |
| 8390 | 0.004 |
| 8391 | 0.004 |
| 8392 | 0.004 |
| 8393 | 0.004 |
| 8394 | 0.004 |
| 8395 | 0.004 |
| 8396 | 0.004 |
| 8397 | 0.004 |
| 8398 | 0.004 |
| 8399 | 0.004 |
| 8400 | 0.004 |
| 8401 | 0.004 |
| 8402 | 0.004 |
| 8403 | 0.004 |
| 8404 | 0.004 |
| 8405 | 0.004 |
| 8406 | 0.004 |
| 8407 | 0.004 |
| 8408 | 0.004 |
| 8409 | 0.004 |
| 8410 | 0.004 |
| 8411 | 0.004 |
| 8412 | 0.004 |
| 8413 | 0.004 |
| 8414 | 0.004 |
| 8415 | 0.004 |
| 8416 | 0.004 |
| 8417 | 0.004 |
| 8418 | 0.004 |
| 8419 | 0.004 |
| 8420 | 0.004 |
| 8421 | 0.004 |
| 8422 | 0.004 |
| 8423 | 0.004 |
| 8424 | 0.004 |
| 8425 | 0.004 |
| 8426 | 0.004 |
| 8427 | 0.004 |
| 8428 | 0.004 |
| 8429 | 0.004 |
| 8430 | 0.004 |
| 8431 | 0.004 |
| 8432 | 0.004 |
| 8433 | 0.004 |
| 8434 | 0.004 |
| 8435 | 0.004 |
| 8436 | 0.004 |
| 8437 | 0.004 |
| 8438 | 0.004 |
| 8439 | 0.004 |
| 8440 | 0.004 |
| 8441 | 0.004 |
| 8442 | 0.004 |
| 8443 | 0.004 |
| 8444 | 0.004 |
| 8445 | 0.004 |
| 8446 | 0.004 |
| 8447 | 0.004 |
| 8448 | 0.004 |
| 8449 | 0.004 |
| 8450 | 0.004 |
| 8451 | 0.004 |
| 8452 | 0.004 |
| 8453 | 0.004 |
| 8454 | 0.004 |
| 8455 | 0.004 |
| 8456 | 0.004 |
| 8457 | 0.004 |
| 8458 | 0.004 |
| 8459 | 0.004 |
| 8460 | 0.004 |
| 8461 | 0.004 |
| 8462 | 0.004 |
| 8463 | 0.004 |
| 8464 | 0.004 |
| 8465 | 0.004 |
| 8466 | 0.004 |
| 8467 | 0.004 |
| 8468 | 0.004 |
| 8469 | 0.004 |
| 8470 | 0.004 |
| 8471 | 0.004 |
| 8472 | 0.004 |
| 8473 | 0.004 |
| 8474 | 0.004 |
| 8475 | 0.004 |
| 8476 | 0.004 |
| 8477 | 0.004 |
| 8478 | 0.004 |
| 8479 | 0.004 |
| 8480 | 0.004 |
| 8481 | 0.004 |
| 8482 | 0.004 |
| 8483 | 0.004 |
| 8484 | 0.004 |
| 8485 | 0.004 |
| 8486 | 0.004 |
| 8487 | 0.004 |
| 8488 | 0.004 |
| 8489 | 0.004 |
| 8490 | 0.004 |
| 8491 | 0.004 |
| 8492 | 0.004 |
| 8493 | 0.004 |
| 8494 | 0.004 |
| 8495 | 0.004 |
| 8496 | 0.004 |
| 8497 | 0.004 |
| 8498 | 0.004 |
| 8499 | 0.004 |
| 8500 | 0.004 |
| 8501 | 0.004 |
| 8502 | 0.004 |
| 8503 | 0.004 |
| 8504 | 0.004 |
| 8505 | 0.004 |
| 8506 | 0.004 |
| 8507 | 0.004 |
| 8508 | 0.004 |
| 8509 | 0.004 |
| 8510 | 0.004 |
| 8511 | 0.004 |
| 8512 | 0.004 |
| 8513 | 0.004 |
| 8514 | 0.004 |
| 8515 | 0.004 |
| 8516 | 0.004 |
| 8517 | 0.004 |
| 8518 | 0.004 |
| 8519 | 0.004 |
| 8520 | 0.004 |
| 8521 | 0.004 |
| 8522 | 0.004 |
| 8523 | 0.004 |
| 8524 | 0.004 |
| 8525 | 0.004 |
| 8526 | 0.004 |
| 8527 | 0.004 |
| 8528 | 0.004 |
| 8529 | 0.004 |
| 8530 | 0.004 |
| 8531 | 0.004 |
| 8532 | 0.004 |
| 8533 | 0.004 |
| 8534 | 0.004 |
| 8535 | 0.004 |
| 8536 | 0.004 |
| 8537 | 0.004 |
| 8538 | 0.004 |
| 8539 | 0.004 |
| 8540 | 0.004 |
| 8541 | 0.004 |
| 8542 | 0.004 |
| 8543 | 0.004 |
| 8544 | 0.004 |
| 8545 | 0.004 |
| 8546 | 0.004 |
| 8547 | 0.004 |
| 8548 | 0.004 |
| 8549 | 0.004 |
| 8550 | 0.004 |
| 8551 | 0.004 |
| 8552 | 0.004 |
| 8553 | 0.004 |
| 8554 | 0.004 |
| 8555 | 0.004 |
| 8556 | 0.004 |
| 8557 | 0.004 |
| 8558 | 0.004 |
| 8559 | 0.004 |
| 8560 | 0.004 |
| 8561 | 0.004 |
| 8562 | 0.004 |
| 8563 | 0.004 |
| 8564 | 0.004 |
| 8565 | 0.004 |
| 8566 | 0.004 |
| 8567 | 0.004 |
| 8568 | 0.004 |
| 8569 | 0.004 |
| 8570 | 0.004 |
| 8571 | 0.004 |
| 8572 | 0.004 |
| 8573 | 0.004 |
| 8574 | 0.004 |
| 8575 | 0.004 |
| 8576 | 0.004 |
| 8577 | 0.004 |
| 8578 | 0.004 |
| 8579 | 0.004 |
| 8580 | 0.004 |
| 8581 | 0.004 |
| 8582 | 0.004 |
| 8583 | 0.004 |
| 8584 | 0.004 |
| 8585 | 0.004 |
| 8586 | 0.004 |
| 8587 | 0.004 |
| 8588 | 0.004 |
| 8589 | 0.004 |
| 8590 | 0.004 |
| 8591 | 0.004 |
| 8592 | 0.004 |
| 8593 | 0.004 |
| 8594 | 0.004 |
| 8595 | 0.004 |
| 8596 | 0.004 |
| 8597 | 0.004 |
| 8598 | 0.004 |
| 8599 | 0.004 |
| 8600 | 0.004 |
| 8601 | 0.004 |
| 8602 | 0.004 |
| 8603 | 0.004 |
| 8604 | 0.004 |
| 8605 | 0.004 |
| 8606 | 0.004 |
| 8607 | 0.004 |
| 8608 | 0.004 |
| 8609 | 0.004 |
| 8610 | 0.004 |
| 8611 | 0.004 |
| 8612 | 0.004 |
| 8613 | 0.004 |
| 8614 | 0.004 |
| 8615 | 0.004 |
| 8616 | 0.004 |
| 8617 | 0.004 |
| 8618 | 0.004 |
| 8619 | 0.004 |
| 8620 | 0.004 |
| 8621 | 0.004 |
| 8622 | 0.004 |
| 8623 | 0.004 |
| 8624 | 0.004 |
| 8625 | 0.004 |
| 8626 | 0.004 |
| 8627 | 0.004 |
| 8628 | 0.004 |
| 8629 | 0.004 |
| 8630 | 0.004 |
| 8631 | 0.004 |
| 8632 | 0.004 |
| 8633 | 0.004 |
| 8634 | 0.004 |
| 8635 | 0.004 |
| 8636 | 0.004 |
| 8637 | 0.004 |
| 8638 | 0.004 |
| 8639 | 0.004 |
| 8640 | 0.004 |
| 8641 | 0.004 |
| 8642 | 0.004 |
| 8643 | 0.004 |
| 8644 | 0.004 |
| 8645 | 0.004 |
| 8646 | 0.004 |
| 8647 | 0.004 |
| 8648 | 0.004 |
| 8649 | 0.004 |
| 8650 | 0.004 |
| 8651 | 0.004 |
| 8652 | 0.004 |
| 8653 | 0.004 |
| 8654 | 0.004 |
| 8655 | 0.004 |
| 8656 | 0.004 |
| 8657 | 0.004 |
| 8658 | 0.004 |
| 8659 | 0.004 |
| 8660 | 0.004 |
| 8661 | 0.004 |
| 8662 | 0.004 |
| 8663 | 0.004 |
| 8664 | 0.004 |
| 8665 | 0.004 |
| 8666 | 0.004 |
| 8667 | 0.004 |
| 8668 | 0.004 |
| 8669 | 0.004 |
| 8670 | 0.004 |
| 8671 | 0.004 |
| 8672 | 0.004 |
| 8673 | 0.004 |
| 8674 | 0.004 |
| 8675 | 0.004 |
| 8676 | 0.004 |
| 8677 | 0.004 |
| 8678 | 0.004 |
| 8679 | 0.004 |
| 8680 | 0.004 |
| 8681 | 0.004 |
| 8682 | 0.004 |
| 8683 | 0.004 |
| 8684 | 0.004 |
| 8685 | 0.004 |
| 8686 | 0.004 |
| 8687 | 0.004 |
| 8688 | 0.004 |
| 8689 | 0.004 |
| 8690 | 0.004 |
| 8691 | 0.004 |
| 8692 | 0.004 |
| 8693 | 0.004 |
| 8694 | 0.004 |
| 8695 | 0.004 |
| 8696 | 0.004 |
| 8697 | 0.004 |
| 8698 | 0.004 |
| 8699 | 0.004 |
| 8700 | 0.004 |
| 8701 | 0.004 |
| 8702 | 0.004 |
| 8703 | 0.004 |
| 8704 | 0.004 |
| 8705 | 0.004 |
| 8706 | 0.004 |
| 8707 | 0.004 |
| 8708 | 0.004 |
| 8709 | 0.004 |
| 8710 | 0.004 |
| 8711 | 0.004 |
| 8712 | 0.004 |
| 8713 | 0.004 |
| 8714 | 0.004 |
| 8715 | 0.004 |
| 8716 | 0.004 |
| 8717 | 0.004 |
| 8718 | 0.004 |
| 8719 | 0.004 |
| 8720 | 0.004 |
| 8721 | 0.004 |
| 8722 | 0.004 |
| 8723 | 0.004 |
| 8724 | 0.004 |
| 8725 | 0.004 |
| 8726 | 0.004 |
| 8727 | 0.004 |
| 8728 | 0.004 |
| 8729 | 0.004 |
| 8730 | 0.004 |
| 8731 | 0.004 |
| 8732 | 0.004 |
| 8733 | 0.004 |
| 8734 | 0.004 |
| 8735 | 0.004 |
| 8736 | 0.004 |
| 8737 | 0.004 |
| 8738 | 0.004 |
| 8739 | 0.004 |
| 8740 | 0.004 |
| 8741 | 0.004 |
| 8742 | 0.004 |
| 8743 | 0.004 |
| 8744 | 0.004 |
| 8745 | 0.004 |
| 8746 | 0.004 |
| 8747 | 0.004 |
| 8748 | 0.004 |
| 8749 | 0.004 |
| 8750 | 0.004 |
| 8751 | 0.004 |
| 8752 | 0.004 |
| 8753 | 0.004 |
| 8754 | 0.004 |
| 8755 | 0.004 |
| 8756 | 0.004 |
| 8757 | 0.004 |
| 8758 | 0.004 |
| 8759 | 0.004 |
| 8760 | 0.004 |
| 8761 | 0.004 |
| 8762 | 0.004 |
| 8763 | 0.004 |
| 8764 | 0.004 |
| 8765 | 0.004 |
| 8766 | 0.004 |
| 8767 | 0.004 |
| 8768 | 0.004 |
| 8769 | 0.004 |
| 8770 | 0.004 |
| 8771 | 0.004 |
| 8772 | 0.004 |
| 8773 | 0.004 |
| 8774 | 0.004 |
| 8775 | 0.004 |
| 8776 | 0.004 |
| 8777 | 0.004 |
| 8778 | 0.004 |
| 8779 | 0.004 |
| 8780 | 0.004 |
| 8781 | 0.004 |
| 8782 | 0.004 |
| 8783 | 0.004 |
| 8784 | 0.004 |
| 8785 | 0.004 |
| 8786 | 0.004 |
| 8787 | 0.004 |
| 8788 | 0.004 |
| 8789 | 0.004 |
| 8790 | 0.004 |
| 8791 | 0.004 |
| 8792 | 0.004 |
| 8793 | 0.004 |
| 8794 | 0.004 |
| 8795 | 0.004 |
| 8796 | 0.004 |
| 8797 | 0.004 |
| 8798 | 0.004 |
| 8799 | 0.004 |
| 8800 | 0.004 |
| 8801 | 0.004 |
| 8802 | 0.004 |
| 8803 | 0.004 |
| 8804 | 0.004 |
| 8805 | 0.004 |
| 8806 | 0.004 |
| 8807 | 0.004 |
| 8808 | 0.004 |
| 8809 | 0.004 |
| 8810 | 0.004 |
| 8811 | 0.004 |
| 8812 | 0.004 |
| 8813 | 0.004 |
| 8814 | 0.004 |
| 8815 | 0.004 |
| 8816 | 0.004 |
| 8817 | 0.004 |
| 8818 | 0.004 |
| 8819 | 0.004 |
| 8820 | 0.004 |
| 8821 | 0.004 |
| 8822 | 0.004 |
| 8823 | 0.004 |
| 8824 | 0.004 |
| 8825 | 0.004 |
| 8826 | 0.004 |
| 8827 | 0.004 |
| 8828 | 0.004 |
| 8829 | 0.004 |
| 8830 | 0.004 |
| 8831 | 0.004 |
| 8832 | 0.004 |
| 8833 | 0.004 |
| 8834 | 0.004 |
| 8835 | 0.004 |
| 8836 | 0.004 |
| 8837 | 0.004 |
| 8838 | 0.004 |
| 8839 | 0.004 |
| 8840 | 0.004 |
| 8841 | 0.004 |
| 8842 | 0.004 |
| 8843 | 0.004 |
| 8844 | 0.004 |
| 8845 | 0.004 |
| 8846 | 0.004 |
| 8847 | 0.004 |
| 8848 | 0.004 |
| 8849 | 0.004 |
| 8850 | 0.004 |
| 8851 | 0.004 |
| 8852 | 0.004 |
| 8853 | 0.004 |
| 8854 | 0.004 |
| 8855 | 0.004 |
| 8856 | 0.004 |
| 8857 | 0.004 |
| 8858 | 0.004 |
| 8859 | 0.004 |
| 8860 | 0.004 |
| 8861 | 0.004 |
| 8862 | 0.004 |
| 8863 | 0.004 |
| 8864 | 0.004 |
| 8865 | 0.004 |
| 8866 | 0.004 |
| 8867 | 0.004 |
| 8868 | 0.004 |
| 8869 | 0.004 |
| 8870 | 0.004 |
| 8871 | 0.004 |
| 8872 | 0.004 |
| 8873 | 0.004 |
| 8874 | 0.004 |
| 8875 | 0.004 |
| 8876 | 0.004 |
| 8877 | 0.004 |
| 8878 | 0.004 |
| 8879 | 0.004 |
| 8880 | 0.004 |
| 8881 | 0.004 |
| 8882 | 0.004 |
| 8883 | 0.004 |
| 8884 | 0.004 |
| 8885 | 0.004 |
| 8886 | 0.004 |
| 8887 | 0.004 |
| 8888 | 0.004 |
| 8889 | 0.004 |
| 8890 | 0.004 |
| 8891 | 0.004 |
| 8892 | 0.004 |
| 8893 | 0.004 |
| 8894 | 0.004 |
| 8895 | 0.004 |
| 8896 | 0.004 |
| 8897 | 0.004 |
| 8898 | 0.004 |
| 8899 | 0.004 |
| 8900 | 0.004 |
| 8901 | 0.004 |
| 8902 | 0.004 |
| 8903 | 0.004 |
| 8904 | 0.004 |
| 8905 | 0.004 |
| 8906 | 0.004 |
| 8907 | 0.004 |
| 8908 | 0.004 |
| 8909 | 0.004 |
| 8910 | 0.004 |
| 8911 | 0.004 |
| 8912 | 0.004 |
| 8913 | 0.004 |
| 8914 | 0.004 |
| 8915 | 0.004 |
| 8916 | 0.004 |
| 8917 | 0.004 |
| 8918 | 0.004 |
| 8919 | 0.004 |
| 8920 | 0.004 |
| 8921 | 0.004 |
| 8922 | 0.004 |
| 8923 | 0.004 |
| 8924 | 0.004 |
| 8925 | 0.004 |
| 8926 | 0.004 |
| 8927 | 0.004 |
| 8928 | 0.004 |
| 8929 | 0.004 |
| 8930 | 0.004 |
| 8931 | 0.004 |
| 8932 | 0.004 |
| 8933 | 0.004 |
| 8934 | 0.004 |
| 8935 | 0.004 |
| 8936 | 0.004 |
| 8937 | 0.004 |
| 8938 | 0.004 |
| 8939 | 0.004 |
| 8940 | 0.004 |
| 8941 | 0.004 |
| 8942 | 0.004 |
| 8943 | 0.004 |
| 8944 | 0.004 |
| 8945 | 0.004 |
| 8946 | 0.004 |
| 8947 | 0.004 |
| 8948 | 0.004 |
| 8949 | 0.004 |
| 8950 | 0.004 |
| 8951 | 0.004 |
| 8952 | 0.004 |
| 8953 | 0.004 |
| 8954 | 0.004 |
| 8955 | 0.004 |
| 8956 | 0.004 |
| 8957 | 0.004 |
| 8958 | 0.004 |
| 8959 | 0.004 |
| 8960 | 0.004 |
| 8961 | 0.004 |
| 8962 | 0.004 |
| 8963 | 0.004 |
| 8964 | 0.004 |
| 8965 | 0.004 |
| 8966 | 0.004 |
| 8967 | 0.004 |
| 8968 | 0.004 |
| 8969 | 0.004 |
| 8970 | 0.004 |
| 8971 | 0.004 |
| 8972 | 0.004 |
| 8973 | 0.004 |
| 8974 | 0.004 |
| 8975 | 0.004 |
| 8976 | 0.004 |
| 8977 | 0.004 |
| 8978 | 0.004 |
| 8979 | 0.004 |
| 8980 | 0.004 |
| 8981 | 0.004 |
| 8982 | 0.004 |
| 8983 | 0.004 |
| 8984 | 0.004 |
| 8985 | 0.004 |
| 8986 | 0.004 |
| 8987 | 0.004 |
| 8988 | 0.004 |
| 8989 | 0.004 |
| 8990 | 0.004 |
| 8991 | 0.004 |
| 8992 | 0.004 |
| 8993 | 0.004 |
| 8994 | 0.004 |
| 8995 | 0.004 |
| 8996 | 0.004 |
| 8997 | 0.004 |
| 8998 | 0.004 |
| 8999 | 0.004 |
| 9000 | 0.004 |
| 9001 | 0.004 |
| 9002 | 0.004 |
| 9003 | 0.004 |
| 9004 | 0.004 |
| 9005 | 0.004 |
| 9006 | 0.004 |
| 9007 | 0.004 |
| 9008 | 0.004 |
| 9009 | 0.004 |
| 9010 | 0.004 |
| 9011 | 0.004 |
| 9012 | 0.004 |
| 9013 | 0.004 |
| 9014 | 0.004 |
| 9015 | 0.004 |
| 9016 | 0.004 |
| 9017 | 0.004 |
| 9018 | 0.004 |
| 9019 | 0.004 |
| 9020 | 0.004 |
| 9021 | 0.004 |
| 9022 | 0.004 |
| 9023 | 0.004 |
| 9024 | 0.004 |
| 9025 | 0.004 |
| 9026 | 0.004 |
| 9027 | 0.004 |
| 9028 | 0.004 |
| 9029 | 0.004 |
| 9030 | 0.004 |
| 9031 | 0.004 |
| 9032 | 0.004 |
| 9033 | 0.004 |
| 9034 | 0.004 |
| 9035 | 0.004 |
| 9036 | 0.004 |
| 9037 | 0.004 |
| 9038 | 0.004 |
| 9039 | 0.004 |
| 9040 | 0.004 |
| 9041 | 0.004 |
| 9042 | 0.004 |
| 9043 | 0.004 |
| 9044 | 0.004 |
| 9045 | 0.004 |
| 9046 | 0.004 |
| 9047 | 0.004 |
| 9048 | 0.004 |
| 9049 | 0.004 |
| 9050 | 0.004 |
| 9051 | 0.004 |
| 9052 | 0.004 |
| 9053 | 0.004 |
| 9054 | 0.004 |
| 9055 | 0.004 |
| 9056 | 0.004 |
| 9057 | 0.004 |
| 9058 | 0.004 |
| 9059 | 0.004 |
| 9060 | 0.004 |
| 9061 | 0.004 |
| 9062 | 0.004 |
| 9063 | 0.004 |
| 9064 | 0.004 |
| 9065 | 0.004 |
| 9066 | 0.004 |
| 9067 | 0.004 |
| 9068 | 0.004 |
| 9069 | 0.004 |
| 9070 | 0.004 |
| 9071 | 0.004 |
| 9072 | 0.004 |
| 9073 | 0.004 |
| 9074 | 0.004 |
| 9075 | 0.004 |
| 9076 | 0.004 |
| 9077 | 0.004 |
| 9078 | 0.004 |
| 9079 | 0.004 |
| 9080 | 0.004 |
| 9081 | 0.004 |
| 9082 | 0.004 |
| 9083 | 0.004 |
| 9084 | 0.004 |
| 9085 | 0.004 |
| 9086 | 0.004 |
| 9087 | 0.004 |
| 9088 | 0.004 |
| 9089 | 0.004 |
| 9090 | 0.004 |
| 9091 | 0.004 |
| 9092 | 0.004 |
| 9093 | 0.004 |
| 9094 | 0.004 |
| 9095 | 0.004 |
| 9096 | 0.004 |
| 9097 | 0.004 |
| 9098 | 0.004 |
| 9099 | 0.004 |
| 9100 | 0.004 |
| 9101 | 0.004 |
| 9102 | 0.004 |
| 9103 | 0.004 |
| 9104 | 0.004 |
| 9105 | 0.004 |
| 9106 | 0.004 |
| 9107 | 0.004 |
| 9108 | 0.004 |
| 9109 | 0.004 |
| 9110 | 0.004 |
| 9111 | 0.004 |
| 9112 | 0.004 |
| 9113 | 0.004 |
| 9114 | 0.004 |
| 9115 | 0.004 |
| 9116 | 0.004 |
| 9117 | 0.004 |
| 9118 | 0.004 |
| 9119 | 0.004 |
| 9120 | 0.004 |
| 9121 | 0.004 |
| 9122 | 0.004 |
| 9123 | 0.004 |
| 9124 | 0.004 |
| 9125 | 0.004 |
| 9126 | 0.004 |
| 9127 | 0.004 |
| 9128 | 0.004 |
| 9129 | 0.004 |
| 9130 | 0.004 |
| 9131 | 0.004 |
| 9132 | 0.004 |
| 9133 | 0.004 |
| 9134 | 0.004 |
| 9135 | 0.004 |
| 9136 | 0.004 |
| 9137 | 0.004 |
| 9138 | 0.004 |
| 9139 | 0.004 |
| 9140 | 0.004 |
| 9141 | 0.004 |
| 9142 | 0.004 |
| 9143 | 0.004 |
| 9144 | 0.004 |
| 9145 | 0.004 |
| 9146 | 0.004 |
| 9147 | 0.004 |
| 9148 | 0.004 |
| 9149 | 0.004 |
| 9150 | 0.004 |
| 9151 | 0.004 |
| 9152 | 0.004 |
| 9153 | 0.004 |
| 9154 | 0.004 |
| 9155 | 0.004 |
| 9156 | 0.004 |
| 9157 | 0.004 |
| 9158 | 0.004 |
| 9159 | 0.004 |
| 9160 | 0.004 |
| 9161 | 0.004 |
| 9162 | 0.004 |
| 9163 | 0.004 |
| 9164 | 0.004 |
| 9165 | 0.004 |
| 9166 | 0.004 |
| 9167 | 0.004 |
| 9168 | 0.004 |
| 9169 | 0.004 |
| 9170 | 0.004 |
| 9171 | 0.004 |
| 9172 | 0.004 |
| 9173 | 0.004 |
| 9174 | 0.004 |
| 9175 | 0.004 |
| 9176 | 0.004 |
| 9177 | 0.004 |
| 9178 | 0.004 |
| 9179 | 0.004 |
| 9180 | 0.004 |
| 9181 | 0.004 |
| 9182 | 0.004 |
| 9183 | 0.004 |
| 9184 | 0.004 |
| 9185 | 0.004 |
| 9186 | 0.004 |
| 9187 | 0.004 |
| 9188 | 0.004 |
| 9189 | 0.004 |
| 9190 | 0.004 |
| 9191 | 0.004 |
| 9192 | 0.004 |
| 9193 | 0.004 |
| 9194 | 0.004 |
| 9195 | 0.004 |
| 9196 | 0.004 |
| 9197 | 0.004 |
| 9198 | 0.004 |
| 9199 | 0.004 |
| 9200 | 0.004 |
| 9201 | 0.004 |
| 9202 | 0.004 |
| 9203 | 0.004 |
| 9204 | 0.004 |
| 9205 | 0.004 |
| 9206 | 0.004 |
| 9207 | 0.004 |
| 9208 | 0.004 |
| 9209 | 0.004 |
| 9210 | 0.004 |
| 9211 | 0.004 |
| 9212 | 0.004 |
| 9213 | 0.004 |
| 9214 | 0.004 |
| 9215 | 0.004 |
| 9216 | 0.004 |
| 9217 | 0.004 |
| 9218 | 0.004 |
| 9219 | 0.004 |
| 9220 | 0.004 |
| 9221 | 0.004 |
| 9222 | 0.004 |
| 9223 | 0.004 |
| 9224 | 0.004 |
| 9225 | 0.004 |
| 9226 | 0.004 |
| 9227 | 0.004 |
| 9228 | 0.004 |
| 9229 | 0.004 |
| 9230 | 0.004 |
| 9231 | 0.004 |
| 9232 | 0.004 |
| 9233 | 0.004 |
| 9234 | 0.004 |
| 9235 | 0.004 |
| 9236 | 0.004 |
| 9237 | 0.004 |
| 9238 | 0.004 |
| 9239 | 0.004 |
| 9240 | 0.004 |
| 9241 | 0.004 |
| 9242 | 0.004 |
| 9243 | 0.004 |
| 9244 | 0.004 |
| 9245 | 0.004 |
| 9246 | 0.004 |
| 9247 | 0.004 |
| 9248 | 0.004 |
| 9249 | 0.004 |
| 9250 | 0.004 |
| 9251 | 0.004 |
| 9252 | 0.004 |
| 9253 | 0.004 |
| 9254 | 0.004 |
| 9255 | 0.004 |
| 9256 | 0.004 |
| 9257 | 0.004 |
| 9258 | 0.004 |
| 9259 | 0.004 |
| 9260 | 0.004 |
| 9261 | 0.004 |
| 9262 | 0.004 |
| 9263 | 0.004 |
| 9264 | 0.004 |
| 9265 | 0.004 |
| 9266 | 0.004 |
| 9267 | 0.004 |
| 9268 | 0.004 |
| 9269 | 0.004 |
| 9270 | 0.004 |
| 9271 | 0.004 |
| 9272 | 0.004 |
| 9273 | 0.004 |
| 9274 | 0.004 |
| 9275 | 0.004 |
| 9276 | 0.004 |
| 9277 | 0.004 |
| 9278 | 0.004 |
| 9279 | 0.004 |
| 9280 | 0.004 |
| 9281 | 0.004 |
| 9282 | 0.004 |
| 9283 | 0.004 |
| 9284 | 0.004 |
| 9285 | 0.004 |
| 9286 | 0.004 |
| 9287 | 0.004 |
| 9288 | 0.004 |
| 9289 | 0.004 |
| 9290 | 0.004 |
| 9291 | 0.004 |
| 9292 | 0.004 |
| 9293 | 0.004 |
| 9294 | 0.004 |
| 9295 | 0.004 |
| 9296 | 0.004 |
| 9297 | 0.004 |
| 9298 | 0.004 |
| 9299 | 0.004 |
| 9300 | 0.004 |
| 9301 | 0.004 |
| 9302 | 0.004 |
| 9303 | 0.004 |
| 9304 | 0.004 |
| 9305 | 0.004 |
| 9306 | 0.004 |
| 9307 | 0.004 |
| 9308 | 0.004 |
| 9309 | 0.004 |
| 9310 | 0.004 |
| 9311 | 0.004 |
| 9312 | 0.004 |
| 9313 | 0.004 |
| 9314 | 0.004 |
| 9315 | 0.004 |
| 9316 | 0.004 |
| 9317 | 0.004 |
| 9318 | 0.004 |
| 9319 | 0.004 |
| 9320 | 0.004 |
| 9321 | 0.004 |
| 9322 | 0.004 |
| 9323 | 0.004 |
| 9324 | 0.004 |
| 9325 | 0.004 |
| 9326 | 0.004 |
| 9327 | 0.004 |
| 9328 | 0.004 |
| 9329 | 0.004 |
| 9330 | 0.004 |
| 9331 | 0.004 |
| 9332 | 0.004 |
| 9333 | 0.004 |
| 9334 | 0.004 |
| 9335 | 0.004 |
| 9336 | 0.004 |
| 9337 | 0.004 |
| 9338 | 0.004 |
| 9339 | 0.004 |
| 9340 | 0.004 |
| 9341 | 0.004 |
| 9342 | 0.004 |
| 9343 | 0.004 |
| 9344 | 0.004 |
| 9345 | 0.004 |
| 9346 | 0.004 |
| 9347 | 0.004 |
| 9348 | 0.004 |
| 9349 | 0.004 |
| 9350 | 0.004 |
| 9351 | 0.004 |
| 9352 | 0.004 |
| 9353 | 0.004 |
| 9354 | 0.004 |
| 9355 | 0.004 |
| 9356 | 0.004 |
| 9357 | 0.004 |
| 9358 | 0.004 |
| 9359 | 0.004 |
| 9360 | 0.004 |
| 9361 | 0.004 |
| 9362 | 0.004 |
| 9363 | 0.004 |
| 9364 | 0.004 |
| 9365 | 0.004 |
| 9366 | 0.004 |
| 9367 | 0.004 |
| 9368 | 0.004 |
| 9369 | 0.004 |
| 9370 | 0.004 |
| 9371 | 0.004 |
| 9372 | 0.004 |
| 9373 | 0.004 |
| 9374 | 0.004 |
| 9375 | 0.004 |
| 9376 | 0.004 |
| 9377 | 0.004 |
| 9378 | 0.004 |
| 9379 | 0.004 |
| 9380 | 0.004 |
| 9381 | 0.004 |
| 9382 | 0.004 |
| 9383 | 0.004 |
| 9384 | 0.004 |
| 9385 | 0.004 |
| 9386 | 0.004 |
| 9387 | 0.004 |
| 9388 | 0.004 |
| 9389 | 0.004 |
| 9390 | 0.004 |
| 9391 | 0.004 |
| 9392 | 0.004 |
| 9393 | 0.004 |
| 9394 | 0.004 |
| 9395 | 0.004 |
| 9396 | 0.004 |
| 9397 | 0.004 |
| 9398 | 0.004 |
| 9399 | 0.004 |
| 9400 | 0.004 |
| 9401 | 0.004 |
| 9402 | 0.004 |
| 9403 | 0.004 |
| 9404 | 0.004 |
| 9405 | 0.004 |
| 9406 | 0.004 |
| 9407 | 0.004 |
| 9408 | 0.004 |
| 9409 | 0.004 |
| 9410 | 0.004 |
| 9411 | 0.004 |
| 9412 | 0.004 |
| 9413 | 0.004 |
| 9414 | 0.004 |
| 9415 | 0.004 |
| 9416 | 0.004 |
| 9417 | 0.004 |
| 9418 | 0.004 |
| 9419 | 0.004 |
| 9420 | 0.004 |
| 9421 | 0.004 |
| 9422 | 0.004 |
| 9423 | 0.004 |
| 9424 | 0.004 |
| 9425 | 0.004 |
| 9426 | 0.004 |
| 9427 | 0.004 |
| 9428 | 0.004 |
| 9429 | 0.004 |
| 9430 | 0.004 |
| 9431 | 0.004 |
| 9432 | 0.004 |
| 9433 | 0.004 |
| 9434 | 0.004 |
| 9435 | 0.004 |
| 9436 | 0.004 |
| 9437 | 0.004 |
| 9438 | 0.004 |
| 9439 | 0.004 |
| 9440 | 0.004 |
| 9441 | 0.004 |
| 9442 | 0.004 |
| 9443 | 0.004 |
| 9444 | 0.004 |
| 9445 | 0.004 |
| 9446 | 0.004 |
| 9447 | 0.004 |
| 9448 | 0.004 |
| 9449 | 0.004 |
| 9450 | 0.004 |
| 9451 | 0.004 |
| 9452 | 0.004 |
| 9453 | 0.004 |
| 9454 | 0.004 |
| 9455 | 0.004 |
| 9456 | 0.004 |
| 9457 | 0.004 |
| 9458 | 0.004 |
| 9459 | 0.004 |
| 9460 | 0.004 |
| 9461 | 0.004 |
| 9462 | 0.004 |
| 9463 | 0.004 |
| 9464 | 0.004 |
| 9465 | 0.004 |
| 9466 | 0.004 |
| 9467 | 0.004 |
| 9468 | 0.004 |
| 9469 | 0.004 |
| 9470 | 0.004 |
| 9471 | 0.004 |
| 9472 | 0.004 |
| 9473 | 0.004 |
| 9474 | 0.004 |
| 9475 | 0.004 |
| 9476 | 0.004 |
| 9477 | 0.004 |
| 9478 | 0.004 |
| 9479 | 0.004 |
| 9480 | 0.004 |
| 9481 | 0.004 |
| 9482 | 0.004 |
| 9483 | 0.004 |
| 9484 | 0.004 |
| 9485 | 0.004 |
| 9486 | 0.004 |
| 9487 | 0.004 |
| 9488 | 0.004 |
| 9489 | 0.004 |
| 9490 | 0.004 |
| 9491 | 0.004 |
| 9492 | 0.004 |
| 9493 | 0.004 |
| 9494 | 0.004 |
| 9495 | 0.004 |
| 9496 | 0.004 |
| 9497 | 0.004 |
| 9498 | 0.004 |
| 9499 | 0.004 |
| 9500 | 0.004 |
| 9501 | 0.004 |
| 9502 | 0.004 |
| 9503 | 0.004 |
| 9504 | 0.004 |
| 9505 | 0.004 |
| 9506 | 0.004 |
| 9507 | 0.004 |
| 9508 | 0.004 |
| 9509 | 0.004 |
| 9510 | 0.004 |
| 9511 | 0.004 |
| 9512 | 0.004 |
| 9513 | 0.004 |
| 9514 | 0.004 |
| 9515 | 0.004 |
| 9516 | 0.004 |
| 9517 | 0.004 |
| 9518 | 0.004 |
| 9519 | 0.004 |
| 9520 | 0.004 |
| 9521 | 0.004 |
| 9522 | 0.004 |
| 9523 | 0.004 |
| 9524 | 0.004 |
| 9525 | 0.004 |
| 9526 | 0.004 |
| 9527 | 0.004 |
| 9528 | 0.004 |
| 9529 | 0.004 |
| 9530 | 0.004 |
| 9531 | 0.004 |
| 9532 | 0.004 |
| 9533 | 0.004 |
| 9534 | 0.004 |
| 9535 | 0.004 |
| 9536 | 0.004 |
| 9537 | 0.004 |
| 9538 | 0.004 |
| 9539 | 0.004 |
| 9540 | 0.004 |
| 9541 | 0.004 |
| 9542 | 0.004 |
| 9543 | 0.004 |
| 9544 | 0.004 |
| 9545 | 0.004 |
| 9546 | 0.004 |
| 9547 | 0.004 |
| 9548 | 0.004 |
| 9549 | 0.004 |
| 9550 | 0.004 |
| 9551 | 0.004 |
| 9552 | 0.004 |
| 9553 | 0.004 |
| 9554 | 0.004 |
| 9555 | 0.004 |
| 9556 | 0.004 |
| 9557 | 0.004 |
| 9558 | 0.004 |
| 9559 | 0.004 |
| 9560 | 0.004 |
| 9561 | 0.004 |
| 9562 | 0.004 |
| 9563 | 0.004 |
| 9564 | 0.004 |
| 9565 | 0.004 |
| 9566 | 0.004 |
| 9567 | 0.004 |
| 9568 | 0.004 |
| 9569 | 0.004 |
| 9570 | 0.004 |
| 9571 | 0.004 |
| 9572 | 0.004 |
| 9573 | 0.004 |
| 9574 | 0.004 |
| 9575 | 0.004 |
| 9576 | 0.004 |
| 9577 | 0.004 |
| 9578 | 0.004 |
| 9579 | 0.004 |
| 9580 | 0.004 |
| 9581 | 0.004 |
| 9582 | 0.004 |
| 9583 | 0.004 |
| 9584 | 0.004 |
| 9585 | 0.004 |
| 9586 | 0.004 |
| 9587 | 0.004 |
| 9588 | 0.004 |
| 9589 | 0.004 |
| 9590 | 0.004 |
| 9591 | 0.004 |
| 9592 | 0.004 |
| 9593 | 0.004 |
| 9594 | 0.004 |
| 9595 | 0.004 |
| 9596 | 0.004 |
| 9597 | 0.004 |
| 9598 | 0.004 |
| 9599 | 0.004 |
| 9600 | 0.004 |
| 9601 | 0.004 |
| 9602 | 0.004 |
| 9603 | 0.004 |
| 9604 | 0.004 |
| 9605 | 0.004 |
| 9606 | 0.004 |
| 9607 | 0.004 |
| 9608 | 0.004 |
| 9609 | 0.004 |
| 9610 | 0.004 |
| 9611 | 0.004 |
| 9612 | 0.004 |
| 9613 | 0.004 |
| 9614 | 0.004 |
| 9615 | 0.004 |
| 9616 | 0.004 |
| 9617 | 0.004 |
| 9618 | 0.004 |
| 9619 | 0.004 |
| 9620 | 0.004 |
| 9621 | 0.004 |
| 9622 | 0.004 |
| 9623 | 0.004 |
| 9624 | 0.004 |
| 9625 | 0.004 |
| 9626 | 0.004 |
| 9627 | 0.004 |
| 9628 | 0.004 |
| 9629 | 0.004 |
| 9630 | 0.004 |
| 9631 | 0.004 |
| 9632 | 0.004 |
| 9633 | 0.004 |
| 9634 | 0.004 |
| 9635 | 0.004 |
| 9636 | 0.004 |
| 9637 | 0.004 |
| 9638 | 0.004 |
| 9639 | 0.004 |
| 9640 | 0.004 |
| 9641 | 0.004 |
| 9642 | 0.004 |
| 9643 | 0.004 |
| 9644 | 0.004 |
| 9645 | 0.004 |
| 9646 | 0.004 |
| 9647 | 0.004 |
| 9648 | 0.004 |
| 9649 | 0.004 |
| 9650 | 0.004 |
| 9651 | 0.004 |
| 9652 | 0.004 |
| 9653 | 0.004 |
| 9654 | 0.004 |
| 9655 | 0.004 |
| 9656 | 0.004 |
| 9657 | 0.004 |
| 9658 | 0.004 |
| 9659 | 0.004 |
| 9660 | 0.004 |
| 9661 | 0.004 |
| 9662 | 0.004 |
| 9663 | 0.004 |
| 9664 | 0.004 |
| 9665 | 0.004 |
| 9666 | 0.004 |
| 9667 | 0.004 |
| 9668 | 0.004 |
| 9669 | 0.004 |
| 9670 | 0.004 |
| 9671 | 0.004 |
| 9672 | 0.004 |
| 9673 | 0.004 |
| 9674 | 0.004 |
| 9675 | 0.004 |
| 9676 | 0.004 |
| 9677 | 0.004 |
| 9678 | 0.004 |
| 9679 | 0.004 |
| 9680 | 0.004 |
| 9681 | 0.004 |
| 9682 | 0.004 |
| 9683 | 0.004 |
| 9684 | 0.004 |
| 9685 | 0.004 |
| 9686 | 0.004 |
| 9687 | 0.004 |
| 9688 | 0.004 |
| 9689 | 0.004 |
| 9690 | 0.004 |
| 9691 | 0.004 |
| 9692 | 0.004 |
| 9693 | 0.004 |
| 9694 | 0.004 |
| 9695 | 0.004 |
| 9696 | 0.004 |
| 9697 | 0.004 |
| 9698 | 0.004 |
| 9699 | 0.004 |
| 9700 | 0.004 |
| 9701 | 0.004 |
| 9702 | 0.004 |
| 9703 | 0.004 |
| 9704 | 0.004 |
| 9705 | 0.004 |
| 9706 | 0.004 |
| 9707 | 0.004 |
| 9708 | 0.004 |
| 9709 | 0.004 |
| 9710 | 0.004 |
| 9711 | 0.004 |
| 9712 | 0.004 |
| 9713 | 0.004 |
| 9714 | 0.004 |
| 9715 | 0.004 |
| 9716 | 0.004 |
| 9717 | 0.004 |
| 9718 | 0.004 |
| 9719 | 0.004 |
| 9720 | 0.004 |
| 9721 | 0.004 |
| 9722 | 0.004 |
| 9723 | 0.004 |
| 9724 | 0.004 |
| 9725 | 0.004 |
| 9726 | 0.004 |
| 9727 | 0.004 |
| 9728 | 0.004 |
| 9729 | 0.004 |
| 9730 | 0.004 |
| 9731 | 0.004 |
| 9732 | 0.004 |
| 9733 | 0.004 |
| 9734 | 0.004 |
| 9735 | 0.004 |
| 9736 | 0.004 |
| 9737 | 0.004 |
| 9738 | 0.004 |
| 9739 | 0.004 |
| 9740 | 0.004 |
| 9741 | 0.004 |
| 9742 | 0.004 |
| 9743 | 0.004 |
| 9744 | 0.004 |
| 9745 | 0.004 |
| 9746 | 0.004 |
| 9747 | 0.004 |
| 9748 | 0.004 |
| 9749 | 0.004 |
| 9750 | 0.004 |
| 9751 | 0.004 |
| 9752 | 0.004 |
| 9753 | 0.004 |
| 9754 | 0.004 |
| 9755 | 0.004 |
| 9756 | 0.004 |
| 9757 | 0.004 |
| 9758 | 0.004 |
| 9759 | 0.004 |
| 9760 | 0.004 |
| 9761 | 0.004 |
| 9762 | 0.004 |
| 9763 | 0.004 |
| 9764 | 0.004 |
| 9765 | 0.004 |
| 9766 | 0.004 |
| 9767 | 0.004 |
| 9768 | 0.004 |
| 9769 | 0.004 |
| 9770 | 0.004 |
| 9771 | 0.004 |
| 9772 | 0.004 |
| 9773 | 0.004 |
| 9774 | 0.004 |
| 9775 | 0.004 |
| 9776 | 0.004 |
| 9777 | 0.004 |
| 9778 | 0.004 |
| 9779 | 0.004 |
| 9780 | 0.004 |
| 9781 | 0.004 |
| 9782 | 0.004 |
| 9783 | 0.004 |
| 9784 | 0.004 |
| 9785 | 0.004 |
| 9786 | 0.004 |
| 9787 | 0.004 |
| 9788 | 0.004 |
| 9789 | 0.004 |
| 9790 | 0.004 |
| 9791 | 0.004 |
| 9792 | 0.004 |
| 9793 | 0.004 |
| 9794 | 0.004 |
| 9795 | 0.004 |
| 9796 | 0.004 |
| 9797 | 0.004 |
| 9798 | 0.004 |
| 9799 | 0.004 |
| 9800 | 0.004 |
| 9801 | 0.004 |
| 9802 | 0.004 |
| 9803 | 0.004 |
| 9804 | 0.004 |
| 9805 | 0.004 |
| 9806 | 0.004 |
| 9807 | 0.004 |
| 9808 | 0.004 |
| 9809 | 0.004 |
| 9810 | 0.004 |
| 9811 | 0.004 |
| 9812 | 0.004 |
| 9813 | 0.004 |
| 9814 | 0.004 |
| 9815 | 0.004 |
| 9816 | 0.004 |
| 9817 | 0.004 |
| 9818 | 0.004 |
| 9819 | 0.004 |
| 9820 | 0.004 |
| 9821 | 0.004 |
| 9822 | 0.004 |
| 9823 | 0.004 |
| 9824 | 0.004 |
| 9825 | 0.004 |
| 9826 | 0.004 |
| 9827 | 0.004 |
| 9828 | 0.004 |
| 9829 | 0.004 |
| 9830 | 0.004 |
| 9831 | 0.004 |
| 9832 | 0.004 |
| 9833 | 0.004 |
| 9834 | 0.004 |
| 9835 | 0.004 |
| 9836 | 0.004 |
| 9837 | 0.004 |
| 9838 | 0.004 |
| 9839 | 0.004 |
| 9840 | 0.004 |
| 9841 | 0.004 |
| 9842 | 0.004 |
| 9843 | 0.004 |
| 9844 | 0.004 |
| 9845 | 0.004 |
| 9846 | 0.004 |
| 9847 | 0.004 |
| 9848 | 0.004 |
| 9849 | 0.004 |
| 9850 | 0.004 |
| 9851 | 0.004 |
| 9852 | 0.004 |
| 9853 | 0.004 |
| 9854 | 0.004 |
| 9855 | 0.004 |
| 9856 | 0.004 |
| 9857 | 0.004 |
| 9858 | 0.004 |
| 9859 | 0.004 |
| 9860 | 0.004 |
| 9861 | 0.004 |
| 9862 | 0.004 |
| 9863 | 0.004 |
| 9864 | 0.004 |
| 9865 | 0.004 |
| 9866 | 0.004 |
| 9867 | 0.004 |
| 9868 | 0.004 |
| 9869 | 0.004 |
| 9870 | 0.004 |
| 9871 | 0.004 |
| 9872 | 0.004 |
| 9873 | 0.004 |
| 9874 | 0.004 |
| 9875 | 0.004 |
| 9876 | 0.004 |
| 9877 | 0.004 |
| 9878 | 0.004 |
| 9879 | 0.004 |
| 9880 | 0.004 |
| 9881 | 0.004 |
| 9882 | 0.004 |
| 9883 | 0.004 |
| 9884 | 0.004 |
| 9885 | 0.004 |
| 9886 | 0.004 |
| 9887 | 0.004 |
| 9888 | 0.004 |
| 9889 | 0.004 |
| 9890 | 0.004 |
| 9891 | 0.004 |
| 9892 | 0.004 |
| 9893 | 0.004 |
| 9894 | 0.004 |
| 9895 | 0.004 |
| 9896 | 0.004 |
| 9897 | 0.004 |
| 9898 | 0.004 |
| 9899 | 0.004 |
| 9900 | 0.004 |
| 9901 | 0.004 |
| 9902 | 0.004 |
| 9903 | 0.004 |
| 9904 | 0.004 |
| 9905 | 0.004 |
| 9906 | 0.004 |
| 9907 | 0.004 |
| 9908 | 0.004 |
| 9909 | 0.004 |
| 9910 | 0.004 |
| 9911 | 0.004 |
| 9912 | 0.004 |
| 9913 | 0.004 |
| 9914 | 0.004 |
| 9915 | 0.004 |
| 9916 | 0.004 |
| 9917 | 0.004 |
| 9918 | 0.004 |
| 9919 | 0.004 |
| 9920 | 0.004 |
| 9921 | 0.004 |
| 9922 | 0.004 |
| 9923 | 0.004 |
| 9924 | 0.004 |
| 9925 | 0.004 |
| 9926 | 0.004 |
| 9927 | 0.004 |
| 9928 | 0.004 |
| 9929 | 0.004 |
| 9930 | 0.004 |
| 9931 | 0.004 |
| 9932 | 0.004 |
| 9933 | 0.004 |
| 9934 | 0.004 |
| 9935 | 0.004 |
| 9936 | 0.004 |
| 9937 | 0.004 |
| 9938 | 0.004 |
| 9939 | 0.004 |
| 9940 | 0.004 |
| 9941 | 0.004 |
| 9942 | 0.004 |
| 9943 | 0.004 |
| 9944 | 0.004 |
| 9945 | 0.004 |
| 9946 | 0.004 |
| 9947 | 0.004 |
| 9948 | 0.004 |
| 9949 | 0.004 |
| 9950 | 0.004 |
| 9951 | 0.004 |
| 9952 | 0.004 |
| 9953 | 0.004 |
| 9954 | 0.004 |
| 9955 | 0.004 |
| 9956 | 0.004 |
| 9957 | 0.004 |
| 9958 | 0.004 |
| 9959 | 0.004 |
| 9960 | 0.004 |
| 9961 | 0.004 |
| 9962 | 0.004 |
| 9963 | 0.004 |
| 9964 | 0.004 |
| 9965 | 0.004 |
| 9966 | 0.004 |
| 9967 | 0.004 |
| 9968 | 0.004 |
| 9969 | 0.004 |
| 9970 | 0.004 |
| 9971 | 0.004 |
| 9972 | 0.004 |
| 9973 | 0.004 |
| 9974 | 0.004 |
| 9975 | 0.004 |
| 9976 | 0.004 |
| 9977 | 0.004 |
| 9978 | 0.004 |
| 9979 | 0.004 |
| 9980 | 0.004 |
| 9981 | 0.004 |
| 9982 | 0.004 |
| 9983 | 0.004 |
| 9984 | 0.004 |
| 9985 | 0.004 |
| 9986 | 0.004 |
| 9987 | 0.004 |
| 9988 | 0.004 |
| 9989 | 0.004 |
| 9990 | 0.004 |
| 9991 | 0.004 |
| 9992 | 0.004 |
| 9993 | 0.004 |
| 9994 | 0.004 |
| 9995 | 0.004 |
| 9996 | 0.004 |
| 9997 | 0.004 |
| 9998 | 0.004 |
| 9999 | 0.004 |
| 10000 | 0.004 |
| 10001 | 0.004 |
| 10002 | 0.004 |
| 10003 | 0.004 |
| 10004 | 0.004 |
| 10005 | 0.004 |
| 10006 | 0.004 |
| 10007 | 0.004 |
| 10008 | 0.004 |
| 10009 | 0.004 |
| 10010 | 0.004 |
| 10011 | 0.004 |
| 10012 | 0.004 |
| 10013 | 0.004 |
| 10014 | 0.004 |
| 10015 | 0.004 |
| 10016 | 0.004 |
| 10017 | 0.004 |
| 10018 | 0.004 |
| 10019 | 0.004 |
| 10020 | 0.004 |
| 10021 | 0.004 |
| 10022 | 0.004 |
| 10023 | 0.004 |
| 10024 | 0.004 |
| 10025 | 0.004 |
| 10026 | 0.004 |
| 10027 | 0.004 |
| 10028 | 0.004 |
| 10029 | 0.004 |
| 10030 | 0.004 |
| 10031 | 0.004 |
| 10032 | 0.004 |
| 10033 | 0.004 |
| 10034 | 0.004 |
| 10035 | 0.004 |
| 10036 | 0.004 |
| 10037 | 0.004 |
| 10038 | 0.004 |
| 10039 | 0.004 |
| 10040 | 0.004 |
| 10041 | 0.004 |
| 10042 | 0.004 |
| 10043 | 0.004 |
| 10044 | 0.004 |
| 10045 | 0.004 |
| 10046 | 0.004 |
| 10047 | 0.004 |
| 10048 | 0.004 |
| 10049 | 0.004 |
| 10050 | 0.004 |
| 10051 | 0.004 |
| 10052 | 0.004 |
| 10053 | 0.004 |
| 10054 | 0.004 |
| 10055 | 0.004 |
| 10056 | 0.004 |
| 10057 | 0.004 |
| 10058 | 0.004 |
| 10059 | 0.004 |
| 10060 | 0.004 |
| 10061 | 0.004 |
| 10062 | 0.004 |
| 10063 | 0.004 |
| 10064 | 0.004 |
| 10065 | 0.004 |
| 10066 | 0.004 |
| 10067 | 0.004 |
| 10068 | 0.004 |
| 10069 | 0.004 |
| 10070 | 0.004 |
| 10071 | 0.004 |
| 10072 | 0.004 |
| 10073 | 0.004 |
| 10074 | 0.004 |
| 10075 | 0.004 |
| 10076 | 0.004 |
| 10077 | 0.004 |
| 10078 | 0.004 |
| 10079 | 0.004 |
| 10080 | 0.004 |
| 10081 | 0.004 |
| 10082 | 0.004 |
| 10083 | 0.004 |
| 10084 | 0.004 |
| 10085 | 0.004 |
| 10086 | 0.004 |
| 10087 | 0.004 |
| 10088 | 0.004 |
| 10089 | 0.004 |
| 10090 | 0.004 |
| 10091 | 0.004 |
| 10092 | 0.004 |
| 10093 | 0.004 |
| 10094 | 0.004 |
| 10095 | 0.004 |
| 10096 | 0.004 |
| 10097 | 0.004 |
| 10098 | 0.004 |
| 10099 | 0.004 |
| 10100 | 0.004 |
| 10101 | 0.004 |
| 10102 | 0.004 |
| 10103 | 0.004 |
| 10104 | 0.004 |
| 10105 | 0.004 |
| 10106 | 0.004 |
| 10107 | 0.004 |
| 10108 | 0.004 |
| 10109 | 0.004 |
| 10110 | 0.004 |
| 10111 | 0.004 |
| 10112 | 0.004 |
| 10113 | 0.004 |
| 10114 | 0.004 |
| 10115 | 0.004 |
| 10116 | 0.004 |
| 10117 | 0.004 |
| 10118 | 0.004 |
| 10119 | 0.004 |
| 10120 | 0.004 |
| 10121 | 0.004 |
| 10122 | 0.004 |
| 10123 | 0.004 |
| 10124 | 0.004 |
| 10125 | 0.004 |
| 10126 | 0.004 |
| 10127 | 0.004 |
| 10128 | 0.004 |
| 10129 | 0.004 |
| 10130 | 0.004 |
| 10131 | 0.004 |
| 10132 | 0.004 |
| 10133 | 0.004 |
| 10134 | 0.004 |
| 10135 | 0.004 |
| 10136 | 0.004 |
| 10137 | 0.004 |
| 10138 | 0.004 |
| 10139 | 0.004 |
| 10140 | 0.004 |
| 10141 | 0.004 |
| 10142 | 0.004 |
| 10143 | 0.004 |
| 10144 | 0.004 |
| 10145 | 0.004 |
| 10146 | 0.004 |
| 10147 | 0.004 |
| 10148 | 0.004 |
| 10149 | 0.004 |
| 10150 | 0.004 |
| 10151 | 0.004 |
| 10152 | 0.004 |
| 10153 | 0.004 |
| 10154 | 0.004 |
| 10155 | 0.004 |
| 10156 | 0.004 |
| 10157 | 0.004 |
| 10158 | 0.004 |
| 10159 | 0.004 |
| 10160 | 0.004 |
| 10161 | 0.004 |
| 10162 | 0.004 |
| 10163 | 0.004 |
| 10164 | 0.004 |
| 10165 | 0.004 |
| 10166 | 0.004 |
| 10167 | 0.004 |
| 10168 | 0.004 |
| 10169 | 0.004 |
| 10170 | 0.004 |
| 10171 | 0.004 |
| 10172 | 0.004 |
| 10173 | 0.004 |
| 10174 | 0.004 |
| 10175 | 0.004 |
| 10176 | 0.004 |
| 10177 | 0.004 |
| 10178 | 0.004 |
| 10179 | 0.004 |
| 10180 | 0.004 |
| 10181 | 0.004 |
| 10182 | 0.004 |
| 10183 | 0.004 |
| 10184 | 0.004 |
| 10185 | 0.004 |
| 10186 | 0.004 |
| 10187 | 0.004 |
| 10188 | 0.004 |
| 10189 | 0.004 |
| 10190 | 0.004 |
| 10191 | 0.004 |
| 10192 | 0.004 |
| 10193 | 0.004 |
| 10194 | 0.004 |
| 10195 | 0.004 |
| 10196 | 0.004 |
| 10197 | 0.004 |
| 10198 | 0.004 |
| 10199 | 0.004 |
| 10200 | 0.004 |
| 10201 | 0.004 |
| 10202 | 0.004 |
| 10203 | 0.004 |
| 10204 | 0.004 |
| 10205 | 0.004 |
| 10206 | 0.004 |
| 10207 | 0.004 |
| 10208 | 0.004 |
| 10209 | 0.004 |
| 10210 | 0.004 |
| 10211 | 0.004 |
| 10212 | 0.004 |
| 10213 | 0.004 |
| 10214 | 0.004 |
| 10215 | 0.004 |
| 10216 | 0.004 |
| 10217 | 0.004 |
| 10218 | 0.004 |
| 10219 | 0.004 |
| 10220 | 0.004 |
| 10221 | 0.004 |
| 10222 | 0.004 |
| 10223 | 0.004 |
| 10224 | 0.004 |
| 10225 | 0.004 |
| 10226 | 0.004 |
| 10227 | 0.004 |
| 10228 | 0.004 |
| 10229 | 0.004 |
| 10230 | 0.004 |
| 10231 | 0.004 |
| 10232 | 0.004 |
| 10233 | 0.004 |
| 10234 | 0.004 |
| 10235 | 0.004 |
| 10236 | 0.004 |
| 10237 | 0.004 |
| 10238 | 0.004 |
| 10239 | 0.004 |
| 10240 | 0.004 |
| 10241 | 0.004 |
| 10242 | 0.004 |
| 10243 | 0.004 |
| 10244 | 0.004 |
| 10245 | 0.004 |
| 10246 | 0.004 |
| 10247 | 0.004 |
| 10248 | 0.004 |
| 10249 | 0.004 |
| 10250 | 0.004 |
| 10251 | 0.004 |
| 10252 | 0.004 |
| 10253 | 0.004 |
| 10254 | 0.004 |
| 10255 | 0.004 |
| 10256 | 0.004 |
| 10257 | 0.004 |
| 10258 | 0.004 |
| 10259 | 0.004 |
| 10260 | 0.004 |
| 10261 | 0.004 |
| 10262 | 0.004 |
| 10263 | 0.004 |
| 10264 | 0.004 |
| 10265 | 0.004 |
| 10266 | 0.004 |
| 10267 | 0.004 |
| 10268 | 0.004 |
| 10269 | 0.004 |
| 10270 | 0.004 |
| 10271 | 0.004 |
| 10272 | 0.004 |
| 10273 | 0.004 |
| 10274 | 0.004 |
| 10275 | 0.004 |
| 10276 | 0.004 |
| 10277 | 0.004 |
| 10278 | 0.004 |
| 10279 | 0.004 |
| 10280 | 0.004 |
| 10281 | 0.004 |
| 10282 | 0.004 |
| 10283 | 0.004 |
| 10284 | 0.004 |
| 10285 | 0.004 |
| 10286 | 0.004 |
| 10287 | 0.004 |
| 10288 | 0.004 |
| 10289 | 0.004 |
| 10290 | 0.004 |
| 10291 | 0.004 |
| 10292 | 0.004 |
| 10293 | 0.004 |
| 10294 | 0.004 |
| 10295 | 0.004 |
| 10296 | 0.004 |
| 10297 | 0.004 |
| 10298 | 0.004 |
| 10299 | 0.004 |
| 10300 | 0.004 |
| 10301 | 0.004 |
| 10302 | 0.004 |
| 10303 | 0.004 |
| 10304 | 0.004 |
| 10305 | 0.004 |
| 10306 | 0.004 |
| 10307 | 0.004 |
| 10308 | 0.004 |
| 10309 | 0.004 |
| 10310 | 0.004 |
| 10311 | 0.004 |
| 10312 | 0.004 |
| 10313 | 0.004 |
| 10314 | 0.004 |
| 10315 | 0.004 |
| 10316 | 0.004 |
| 10317 | 0.004 |
| 10318 | 0.004 |
| 10319 | 0.004 |
| 10320 | 0.004 |
| 10321 | 0.004 |
| 10322 | 0.004 |
| 10323 | 0.004 |
| 10324 | 0.004 |
| 10325 | 0.004 |
| 10326 | 0.004 |
| 10327 | 0.004 |
| 10328 | 0.004 |
| 10329 | 0.004 |
| 10330 | 0.004 |
| 10331 | 0.004 |
| 10332 | 0.004 |
| 10333 | 0.004 |
| 10334 | 0.004 |
| 10335 | 0.004 |
| 10336 | 0.004 |
| 10337 | 0.004 |
| 10338 | 0.004 |
| 10339 | 0.004 |
| 10340 | 0.004 |
| 10341 | 0.004 |
| 10342 | 0.004 |
| 10343 | 0.004 |
| 10344 | 0.004 |
| 10345 | 0.004 |
| 10346 | 0.004 |
| 10347 | 0.004 |
| 10348 | 0.004 |
| 10349 | 0.004 |
| 10350 | 0.004 |
| 10351 | 0.004 |
| 10352 | 0.004 |
| 10353 | 0.004 |
| 10354 | 0.004 |
| 10355 | 0.004 |
| 10356 | 0.004 |
| 10357 | 0.004 |
| 10358 | 0.004 |
| 10359 | 0.004 |
| 10360 | 0.004 |
| 10361 | 0.004 |
| 10362 | 0.004 |
| 10363 | 0.004 |
| 10364 | 0.004 |
| 10365 | 0.004 |
| 10366 | 0.004 |
| 10367 | 0.004 |
| 10368 | 0.004 |
| 10369 | 0.004 |
| 10370 | 0.004 |
| 10371 | 0.004 |
| 10372 | 0.004 |
| 10373 | 0.004 |
| 10374 | 0.004 |
| 10375 | 0.004 |
| 10376 | 0.004 |
| 10377 | 0.004 |
| 10378 | 0.004 |
| 10379 | 0.004 |
| 10380 | 0.004 |
| 10381 | 0.004 |
| 10382 | 0.004 |
| 10383 | 0.004 |
| 10384 | 0.004 |
| 10385 | 0.004 |
| 10386 | 0.004 |
| 10387 | 0.004 |
| 10388 | 0.004 |
| 10389 | 0.004 |
| 10390 | 0.004 |
| 10391 | 0.004 |
| 10392 | 0.004 |
| 10393 | 0.004 |
| 10394 | 0.004 |
| 10395 | 0.004 |
| 10396 | 0.004 |
| 10397 | 0.004 |
| 10398 | 0.004 |
| 10399 | 0.004 |
| 10400 | 0.004 |
| 10401 | 0.004 |
| 10402 | 0.004 |
| 10403 | 0.004 |
| 10404 | 0.004 |
| 10405 | 0.004 |
| 10406 | 0.004 |
| 10407 | 0.004 |
| 10408 | 0.004 |
| 10409 | 0.004 |
| 10410 | 0.004 |
| 10411 | 0.004 |
| 10412 | 0.004 |
| 10413 | 0.004 |
| 10414 | 0.004 |
| 10415 | 0.004 |
| 10416 | 0.004 |
| 10417 | 0.004 |
| 10418 | 0.004 |
| 10419 | 0.004 |
| 10420 | 0.004 |
| 10421 | 0.004 |
| 10422 | 0.004 |
| 10423 | 0.004 |
| 10424 | 0.004 |
| 10425 | 0.004 |
| 10426 | 0.004 |
| 10427 | 0.004 |
| 10428 | 0.004 |
| 10429 | 0.004 |
| 10430 | 0.004 |
| 10431 | 0.004 |
| 10432 | 0.004 |
| 10433 | 0.004 |
| 10434 | 0.004 |
| 10435 | 0.004 |
| 10436 | 0.004 |
| 10437 | 0.004 |
| 10438 | 0.004 |
| 10439 | 0.004 |
| 10440 | 0.004 |
| 10441 | 0.004 |
| 10442 | 0.004 |
| 10443 | 0.004 |
| 10444 | 0.004 |
| 10445 | 0.004 |
| 10446 | 0.004 |
| 10447 | 0.004 |
| 10448 | 0.005 |
| 10449 | 0.005 |
| 10450 | 0.005 |
| 10451 | 0.004 |
| 10452 | 0.004 |
| 10453 | 0.004 |
| 10454 | 0.004 |
| 10455 | 0.004 |
| 10456 | 0.004 |
| 10457 | 0.004 |
| 10458 | 0.004 |
| 10459 | 0.004 |
| 10460 | 0.004 |
| 10461 | 0.004 |
| 10462 | 0.004 |
| 10463 | 0.004 |
| 10464 | 0.004 |
| 10465 | 0.004 |
| 10466 | 0.004 |
| 10467 | 0.004 |
| 10468 | 0.004 |
| 10469 | 0.004 |
| 10470 | 0.004 |
| 10471 | 0.004 |
| 10472 | 0.004 |
| 10473 | 0.005 |
| 10474 | 0.005 |
| 10475 | 0.004 |
| 10476 | 0.004 |
| 10477 | 0.004 |
| 10478 | 0.004 |
| 10479 | 0.004 |
| 10480 | 0.004 |
| 10481 | 0.004 |
| 10482 | 0.004 |
| 10483 | 0.004 |
| 10484 | 0.004 |
| 10485 | 0.004 |
| 10486 | 0.004 |
| 10487 | 0.004 |
| 10488 | 0.004 |
| 10489 | 0.004 |
| 10490 | 0.004 |
| 10491 | 0.004 |
| 10492 | 0.004 |
| 10493 | 0.004 |
| 10494 | 0.004 |
| 10495 | 0.004 |
| 10496 | 0.004 |
| 10497 | 0.004 |
| 10498 | 0.004 |
| 10499 | 0.004 |
| 10500 | 0.004 |
| 10501 | 0.004 |
| 10502 | 0.004 |
| 10503 | 0.004 |
| 10504 | 0.004 |
| 10505 | 0.004 |
| 10506 | 0.004 |
| 10507 | 0.004 |
| 10508 | 0.004 |
| 10509 | 0.004 |
| 10510 | 0.004 |
| 10511 | 0.004 |
| 10512 | 0.004 |
| 10513 | 0.004 |
| 10514 | 0.004 |
| 10515 | 0.004 |
| 10516 | 0.004 |
| 10517 | 0.004 |
| 10518 | 0.004 |
| 10519 | 0.004 |
| 10520 | 0.004 |
| 10521 | 0.004 |
| 10522 | 0.004 |
| 10523 | 0.004 |
| 10524 | 0.004 |
| 10525 | 0.004 |
| 10526 | 0.004 |
| 10527 | 0.004 |
| 10528 | 0.004 |
| 10529 | 0.004 |
| 10530 | 0.004 |
| 10531 | 0.004 |
| 10532 | 0.004 |
| 10533 | 0.004 |
| 10534 | 0.004 |
| 10535 | 0.004 |
| 10536 | 0.004 |
| 10537 | 0.004 |
| 10538 | 0.004 |
| 10539 | 0.004 |
| 10540 | 0.004 |
| 10541 | 0.004 |
| 10542 | 0.004 |
| 10543 | 0.004 |
| 10544 | 0.004 |
| 10545 | 0.004 |
| 10546 | 0.004 |
| 10547 | 0.004 |
| 10548 | 0.004 |
| 10549 | 0.004 |
| 10550 | 0.004 |
| 10551 | 0.004 |
| 10552 | 0.004 |
| 10553 | 0.004 |
| 10554 | 0.004 |
| 10555 | 0.004 |
| 10556 | 0.004 |
| 10557 | 0.004 |
| 10558 | 0.004 |
| 10559 | 0.004 |
| 10560 | 0.004 |
| 10561 | 0.004 |
| 10562 | 0.004 |
| 10563 | 0.004 |
| 10564 | 0.004 |
| 10565 | 0.004 |
| 10566 | 0.004 |
| 10567 | 0.004 |
| 10568 | 0.004 |
| 10569 | 0.004 |
| 10570 | 0.004 |
| 10571 | 0.004 |
| 10572 | 0.004 |
| 10573 | 0.004 |
| 10574 | 0.004 |
| 10575 | 0.004 |
| 10576 | 0.004 |
| 10577 | 0.004 |
| 10578 | 0.004 |
| 10579 | 0.004 |
| 10580 | 0.004 |
| 10581 | 0.004 |
| 10582 | 0.004 |
| 10583 | 0.004 |
| 10584 | 0.004 |
| 10585 | 0.004 |
| 10586 | 0.004 |
| 10587 | 0.004 |
| 10588 | 0.004 |
| 10589 | 0.004 |
| 10590 | 0.004 |
| 10591 | 0.004 |
| 10592 | 0.004 |
| 10593 | 0.004 |
| 10594 | 0.004 |
| 10595 | 0.004 |
| 10596 | 0.004 |
| 10597 | 0.004 |
| 10598 | 0.004 |
| 10599 | 0.004 |
| 10600 | 0.004 |
| 10601 | 0.004 |
| 10602 | 0.004 |
| 10603 | 0.004 |
| 10604 | 0.004 |
| 10605 | 0.004 |
| 10606 | 0.004 |
| 10607 | 0.004 |
| 10608 | 0.004 |
| 10609 | 0.004 |
| 10610 | 0.004 |
| 10611 | 0.004 |
| 10612 | 0.004 |
| 10613 | 0.004 |
| 10614 | 0.004 |
| 10615 | 0.004 |
| 10616 | 0.004 |
| 10617 | 0.004 |
| 10618 | 0.004 |
| 10619 | 0.004 |
| 10620 | 0.004 |
| 10621 | 0.004 |
| 10622 | 0.004 |
| 10623 | 0.004 |
| 10624 | 0.004 |
| 10625 | 0.004 |
| 10626 | 0.004 |
| 10627 | 0.004 |
| 10628 | 0.004 |
| 10629 | 0.004 |
| 10630 | 0.004 |
| 10631 | 0.004 |
| 10632 | 0.004 |
| 10633 | 0.004 |
| 10634 | 0.004 |
| 10635 | 0.004 |
| 10636 | 0.004 |
| 10637 | 0.004 |
| 10638 | 0.004 |
| 10639 | 0.004 |
| 10640 | 0.004 |
| 10641 | 0.004 |
| 10642 | 0.004 |
| 10643 | 0.004 |
| 10644 | 0.004 |
| 10645 | 0.004 |
| 10646 | 0.004 |
| 10647 | 0.004 |
| 10648 | 0.004 |
| 10649 | 0.004 |
| 10650 | 0.004 |
| 10651 | 0.004 |
| 10652 | 0.004 |
| 10653 | 0.004 |
| 10654 | 0.004 |
| 10655 | 0.004 |
| 10656 | 0.004 |
| 10657 | 0.004 |
| 10658 | 0.004 |
| 10659 | 0.004 |
| 10660 | 0.004 |
| 10661 | 0.004 |
| 10662 | 0.004 |
| 10663 | 0.004 |
| 10664 | 0.004 |
| 10665 | 0.004 |
| 10666 | 0.004 |
| 10667 | 0.004 |
| 10668 | 0.004 |
| 10669 | 0.004 |
| 10670 | 0.004 |
| 10671 | 0.004 |
| 10672 | 0.004 |
| 10673 | 0.004 |
| 10674 | 0.004 |
| 10675 | 0.004 |
| 10676 | 0.004 |
| 10677 | 0.004 |
| 10678 | 0.004 |
| 10679 | 0.004 |
| 10680 | 0.004 |
| 10681 | 0.004 |
| 10682 | 0.004 |
| 10683 | 0.004 |
| 10684 | 0.004 |
| 10685 | 0.004 |
| 10686 | 0.004 |
| 10687 | 0.004 |
| 10688 | 0.004 |
| 10689 | 0.004 |
| 10690 | 0.004 |
| 10691 | 0.004 |
| 10692 | 0.004 |
| 10693 | 0.004 |
| 10694 | 0.004 |
| 10695 | 0.004 |
| 10696 | 0.004 |
| 10697 | 0.004 |
| 10698 | 0.004 |
| 10699 | 0.004 |
| 10700 | 0.004 |
| 10701 | 0.004 |
| 10702 | 0.004 |
| 10703 | 0.004 |
| 10704 | 0.004 |
| 10705 | 0.004 |
| 10706 | 0.004 |
| 10707 | 0.004 |
| 10708 | 0.004 |
| 10709 | 0.004 |
| 10710 | 0.004 |
| 10711 | 0.004 |
| 10712 | 0.004 |
| 10713 | 0.004 |
| 10714 | 0.004 |
| 10715 | 0.004 |
| 10716 | 0.004 |
| 10717 | 0.004 |
| 10718 | 0.004 |
| 10719 | 0.004 |
| 10720 | 0.004 |
| 10721 | 0.004 |
| 10722 | 0.004 |
| 10723 | 0.004 |
| 10724 | 0.004 |
| 10725 | 0.004 |
| 10726 | 0.004 |
| 10727 | 0.004 |
| 10728 | 0.004 |
| 10729 | 0.004 |
| 10730 | 0.004 |
| 10731 | 0.004 |
| 10732 | 0.004 |
| 10733 | 0.004 |
| 10734 | 0.004 |
| 10735 | 0.004 |
| 10736 | 0.004 |
| 10737 | 0.004 |
| 10738 | 0.004 |
| 10739 | 0.004 |
| 10740 | 0.004 |
| 10741 | 0.004 |
| 10742 | 0.004 |
| 10743 | 0.004 |
| 10744 | 0.004 |
| 10745 | 0.004 |
| 10746 | 0.004 |
| 10747 | 0.004 |
| 10748 | 0.004 |
| 10749 | 0.004 |
| 10750 | 0.004 |
| 10751 | 0.004 |
| 10752 | 0.004 |
| 10753 | 0.004 |
| 10754 | 0.004 |
| 10755 | 0.004 |
| 10756 | 0.004 |
| 10757 | 0.004 |
| 10758 | 0.004 |
| 10759 | 0.004 |
| 10760 | 0.004 |
| 10761 | 0.004 |
| 10762 | 0.004 |
| 10763 | 0.004 |
| 10764 | 0.004 |
| 10765 | 0.004 |
| 10766 | 0.004 |
| 10767 | 0.004 |
| 10768 | 0.004 |
| 10769 | 0.004 |
| 10770 | 0.004 |
| 10771 | 0.004 |
| 10772 | 0.004 |
| 10773 | 0.004 |
| 10774 | 0.004 |
| 10775 | 0.004 |
| 10776 | 0.004 |
| 10777 | 0.004 |
| 10778 | 0.004 |
| 10779 | 0.004 |
| 10780 | 0.004 |
| 10781 | 0.004 |
| 10782 | 0.004 |
| 10783 | 0.004 |
| 10784 | 0.004 |
| 10785 | 0.004 |
| 10786 | 0.004 |
| 10787 | 0.004 |
| 10788 | 0.004 |
| 10789 | 0.004 |
| 10790 | 0.004 |
| 10791 | 0.004 |
| 10792 | 0.004 |
| 10793 | 0.004 |
| 10794 | 0.004 |
| 10795 | 0.004 |
| 10796 | 0.004 |
| 10797 | 0.004 |
| 10798 | 0.004 |
| 10799 | 0.004 |
| 10800 | 0.004 |
| 10801 | 0.004 |
| 10802 | 0.004 |
| 10803 | 0.004 |
| 10804 | 0.004 |
| 10805 | 0.004 |
| 10806 | 0.004 |
| 10807 | 0.004 |
| 10808 | 0.004 |
| 10809 | 0.004 |
| 10810 | 0.004 |
| 10811 | 0.004 |
| 10812 | 0.004 |
| 10813 | 0.004 |
| 10814 | 0.004 |
| 10815 | 0.004 |
| 10816 | 0.004 |
| 10817 | 0.004 |
| 10818 | 0.004 |
| 10819 | 0.004 |
| 10820 | 0.004 |
| 10821 | 0.004 |
| 10822 | 0.004 |
| 10823 | 0.004 |
| 10824 | 0.004 |
| 10825 | 0.004 |
| 10826 | 0.004 |
| 10827 | 0.004 |
| 10828 | 0.004 |
| 10829 | 0.004 |
| 10830 | 0.004 |
| 10831 | 0.004 |
| 10832 | 0.004 |
| 10833 | 0.004 |
| 10834 | 0.004 |
| 10835 | 0.004 |
| 10836 | 0.004 |
| 10837 | 0.004 |
| 10838 | 0.004 |
| 10839 | 0.004 |
| 10840 | 0.004 |
| 10841 | 0.004 |
| 10842 | 0.004 |
| 10843 | 0.004 |
| 10844 | 0.004 |
| 10845 | 0.004 |
| 10846 | 0.004 |
| 10847 | 0.004 |
| 10848 | 0.004 |
| 10849 | 0.004 |
| 10850 | 0.004 |
| 10851 | 0.004 |
| 10852 | 0.004 |
| 10853 | 0.004 |
| 10854 | 0.004 |
| 10855 | 0.004 |
| 10856 | 0.004 |
| 10857 | 0.004 |
| 10858 | 0.004 |
| 10859 | 0.004 |
| 10860 | 0.004 |
| 10861 | 0.004 |
| 10862 | 0.004 |
| 10863 | 0.004 |
| 10864 | 0.004 |
| 10865 | 0.004 |
| 10866 | 0.004 |
| 10867 | 0.004 |
| 10868 | 0.004 |
| 10869 | 0.004 |
| 10870 | 0.004 |
| 10871 | 0.004 |
| 10872 | 0.004 |
| 10873 | 0.004 |
| 10874 | 0.004 |
| 10875 | 0.004 |
| 10876 | 0.004 |
| 10877 | 0.004 |
| 10878 | 0.004 |
| 10879 | 0.004 |
| 10880 | 0.004 |
| 10881 | 0.004 |
| 10882 | 0.004 |
| 10883 | 0.004 |
| 10884 | 0.004 |
| 10885 | 0.004 |
| 10886 | 0.004 |
| 10887 | 0.004 |
| 10888 | 0.004 |
| 10889 | 0.004 |
| 10890 | 0.004 |
| 10891 | 0.004 |
| 10892 | 0.004 |
| 10893 | 0.004 |
| 10894 | 0.004 |
| 10895 | 0.004 |
| 10896 | 0.004 |
| 10897 | 0.004 |
| 10898 | 0.004 |
| 10899 | 0.004 |
| 10900 | 0.004 |
| 10901 | 0.004 |
| 10902 | 0.004 |
| 10903 | 0.004 |
| 10904 | 0.004 |
| 10905 | 0.004 |
| 10906 | 0.004 |
| 10907 | 0.004 |
| 10908 | 0.004 |
| 10909 | 0.004 |
| 10910 | 0.004 |
| 10911 | 0.004 |
| 10912 | 0.004 |
| 10913 | 0.004 |
| 10914 | 0.004 |
| 10915 | 0.004 |
| 10916 | 0.004 |
| 10917 | 0.004 |
| 10918 | 0.004 |
| 10919 | 0.004 |
| 10920 | 0.004 |
| 10921 | 0.004 |
| 10922 | 0.004 |
| 10923 | 0.004 |
| 10924 | 0.004 |
| 10925 | 0.004 |
| 10926 | 0.004 |
| 10927 | 0.004 |
| 10928 | 0.004 |
| 10929 | 0.004 |
| 10930 | 0.004 |
| 10931 | 0.004 |
| 10932 | 0.004 |
| 10933 | 0.004 |
| 10934 | 0.004 |
| 10935 | 0.004 |
| 10936 | 0.004 |
| 10937 | 0.004 |
| 10938 | 0.004 |
| 10939 | 0.004 |
| 10940 | 0.004 |
| 10941 | 0.004 |
| 10942 | 0.004 |
| 10943 | 0.004 |
| 10944 | 0.004 |
| 10945 | 0.004 |
| 10946 | 0.004 |
| 10947 | 0.004 |
| 10948 | 0.004 |
| 10949 | 0.004 |
| 10950 | 0.004 |
| 10951 | 0.004 |
| 10952 | 0.004 |
| 10953 | 0.004 |
| 10954 | 0.004 |
| 10955 | 0.004 |
| 10956 | 0.004 |
| 10957 | 0.004 |
| 10958 | 0.004 |
| 10959 | 0.004 |
| 10960 | 0.004 |
| 10961 | 0.004 |
| 10962 | 0.004 |
| 10963 | 0.004 |
| 10964 | 0.004 |
| 10965 | 0.004 |
| 10966 | 0.004 |
| 10967 | 0.004 |
| 10968 | 0.004 |
| 10969 | 0.004 |
| 10970 | 0.004 |
| 10971 | 0.004 |
| 10972 | 0.004 |
| 10973 | 0.004 |
| 10974 | 0.004 |
| 10975 | 0.004 |
| 10976 | 0.004 |
| 10977 | 0.004 |
| 10978 | 0.004 |
| 10979 | 0.004 |
| 10980 | 0.004 |
| 10981 | 0.004 |
| 10982 | 0.004 |
| 10983 | 0.004 |
| 10984 | 0.004 |
| 10985 | 0.004 |
| 10986 | 0.004 |
| 10987 | 0.004 |
| 10988 | 0.004 |
| 10989 | 0.004 |
| 10990 | 0.004 |
| 10991 | 0.004 |
| 10992 | 0.004 |
| 10993 | 0.004 |
| 10994 | 0.004 |
| 10995 | 0.004 |
| 10996 | 0.004 |
| 10997 | 0.004 |
| 10998 | 0.004 |
| 10999 | 0.004 |
| 11000 | 0.004 |
| 11001 | 0.004 |
| 11002 | 0.004 |
| 11003 | 0.004 |
| 11004 | 0.004 |
| 11005 | 0.004 |
| 11006 | 0.004 |
| 11007 | 0.004 |
| 11008 | 0.004 |
| 11009 | 0.004 |
| 11010 | 0.004 |
| 11011 | 0.004 |
| 11012 | 0.004 |
| 11013 | 0.004 |
| 11014 | 0.004 |
| 11015 | 0.004 |
| 11016 | 0.004 |
| 11017 | 0.004 |
| 11018 | 0.004 |
| 11019 | 0.004 |
| 11020 | 0.004 |
| 11021 | 0.004 |
| 11022 | 0.004 |
| 11023 | 0.004 |
| 11024 | 0.004 |
| 11025 | 0.004 |
| 11026 | 0.004 |
| 11027 | 0.004 |
| 11028 | 0.004 |
| 11029 | 0.004 |
| 11030 | 0.004 |
| 11031 | 0.004 |
| 11032 | 0.004 |
| 11033 | 0.004 |
| 11034 | 0.004 |
| 11035 | 0.004 |
| 11036 | 0.004 |
| 11037 | 0.004 |
| 11038 | 0.004 |
| 11039 | 0.004 |
| 11040 | 0.004 |
| 11041 | 0.004 |
| 11042 | 0.004 |
| 11043 | 0.004 |
| 11044 | 0.004 |
| 11045 | 0.004 |
| 11046 | 0.004 |
| 11047 | 0.004 |
| 11048 | 0.004 |
| 11049 | 0.004 |
| 11050 | 0.004 |
| 11051 | 0.004 |
| 11052 | 0.004 |
| 11053 | 0.004 |
| 11054 | 0.004 |
| 11055 | 0.004 |
| 11056 | 0.004 |
| 11057 | 0.004 |
| 11058 | 0.004 |
| 11059 | 0.004 |
| 11060 | 0.004 |
| 11061 | 0.004 |
| 11062 | 0.004 |
| 11063 | 0.004 |
| 11064 | 0.004 |
| 11065 | 0.004 |
| 11066 | 0.004 |
| 11067 | 0.004 |
| 11068 | 0.004 |
| 11069 | 0.004 |
| 11070 | 0.004 |
| 11071 | 0.004 |
| 11072 | 0.004 |
| 11073 | 0.004 |
| 11074 | 0.004 |
| 11075 | 0.004 |
| 11076 | 0.004 |
| 11077 | 0.004 |
| 11078 | 0.004 |
| 11079 | 0.004 |
| 11080 | 0.004 |
| 11081 | 0.004 |
| 11082 | 0.004 |
| 11083 | 0.004 |
| 11084 | 0.004 |
| 11085 | 0.004 |
| 11086 | 0.004 |
| 11087 | 0.004 |
| 11088 | 0.005 |
| 11089 | 0.004 |
| 11090 | 0.004 |
| 11091 | 0.004 |
| 11092 | 0.004 |
| 11093 | 0.004 |
| 11094 | 0.004 |
| 11095 | 0.004 |
| 11096 | 0.004 |
| 11097 | 0.004 |
| 11098 | 0.004 |
| 11099 | 0.004 |
| 11100 | 0.004 |
| 11101 | 0.004 |
| 11102 | 0.004 |
| 11103 | 0.004 |
| 11104 | 0.004 |
| 11105 | 0.004 |
| 11106 | 0.004 |
| 11107 | 0.004 |
| 11108 | 0.004 |
| 11109 | 0.004 |
| 11110 | 0.004 |
| 11111 | 0.004 |
| 11112 | 0.004 |
| 11113 | 0.004 |
| 11114 | 0.004 |
| 11115 | 0.004 |
| 11116 | 0.004 |
| 11117 | 0.004 |
| 11118 | 0.004 |
| 11119 | 0.004 |
| 11120 | 0.004 |
| 11121 | 0.004 |
| 11122 | 0.004 |
| 11123 | 0.004 |
| 11124 | 0.004 |
| 11125 | 0.004 |
| 11126 | 0.004 |
| 11127 | 0.004 |
| 11128 | 0.004 |
| 11129 | 0.004 |
| 11130 | 0.004 |
| 11131 | 0.004 |
| 11132 | 0.004 |
| 11133 | 0.004 |
| 11134 | 0.004 |
| 11135 | 0.004 |
| 11136 | 0.004 |
| 11137 | 0.004 |
| 11138 | 0.004 |
| 11139 | 0.004 |
| 11140 | 0.004 |
| 11141 | 0.004 |
| 11142 | 0.004 |
| 11143 | 0.004 |
| 11144 | 0.004 |
| 11145 | 0.004 |
| 11146 | 0.004 |
| 11147 | 0.004 |
| 11148 | 0.004 |
| 11149 | 0.004 |
| 11150 | 0.004 |
| 11151 | 0.004 |
| 11152 | 0.004 |
| 11153 | 0.004 |
| 11154 | 0.004 |
| 11155 | 0.004 |
| 11156 | 0.004 |
| 11157 | 0.004 |
| 11158 | 0.004 |
| 11159 | 0.004 |
| 11160 | 0.004 |
| 11161 | 0.004 |
| 11162 | 0.004 |
| 11163 | 0.004 |
| 11164 | 0.004 |
| 11165 | 0.004 |
| 11166 | 0.004 |
| 11167 | 0.004 |
| 11168 | 0.004 |
| 11169 | 0.004 |
| 11170 | 0.004 |
| 11171 | 0.004 |
| 11172 | 0.004 |
| 11173 | 0.004 |
| 11174 | 0.004 |
| 11175 | 0.004 |
| 11176 | 0.004 |
| 11177 | 0.004 |
| 11178 | 0.004 |
| 11179 | 0.004 |
| 11180 | 0.004 |
| 11181 | 0.004 |
| 11182 | 0.004 |
| 11183 | 0.004 |
| 11184 | 0.004 |
| 11185 | 0.004 |
| 11186 | 0.004 |
| 11187 | 0.004 |
| 11188 | 0.004 |
| 11189 | 0.004 |
| 11190 | 0.004 |
| 11191 | 0.004 |
| 11192 | 0.004 |
| 11193 | 0.004 |
| 11194 | 0.004 |
| 11195 | 0.004 |
| 11196 | 0.004 |
| 11197 | 0.004 |
| 11198 | 0.004 |
| 11199 | 0.004 |
| 11200 | 0.004 |
| 11201 | 0.004 |
| 11202 | 0.004 |
| 11203 | 0.004 |
| 11204 | 0.004 |
| 11205 | 0.004 |
| 11206 | 0.004 |
| 11207 | 0.004 |
| 11208 | 0.004 |
| 11209 | 0.004 |
| 11210 | 0.004 |
| 11211 | 0.004 |
| 11212 | 0.004 |
| 11213 | 0.004 |
| 11214 | 0.004 |
| 11215 | 0.004 |
| 11216 | 0.004 |
| 11217 | 0.004 |
| 11218 | 0.004 |
| 11219 | 0.004 |
| 11220 | 0.004 |
| 11221 | 0.004 |
| 11222 | 0.004 |
| 11223 | 0.004 |
| 11224 | 0.004 |
| 11225 | 0.004 |
| 11226 | 0.004 |
| 11227 | 0.004 |
| 11228 | 0.004 |
| 11229 | 0.004 |
| 11230 | 0.004 |
| 11231 | 0.004 |
| 11232 | 0.004 |
| 11233 | 0.004 |
| 11234 | 0.004 |
| 11235 | 0.004 |
| 11236 | 0.004 |
| 11237 | 0.004 |
| 11238 | 0.004 |
| 11239 | 0.004 |
| 11240 | 0.004 |
| 11241 | 0.004 |
| 11242 | 0.004 |
| 11243 | 0.004 |
| 11244 | 0.004 |
| 11245 | 0.004 |
| 11246 | 0.004 |
| 11247 | 0.004 |
| 11248 | 0.004 |
| 11249 | 0.004 |
| 11250 | 0.004 |
| 11251 | 0.004 |
| 11252 | 0.004 |
| 11253 | 0.004 |
| 11254 | 0.004 |
| 11255 | 0.004 |
| 11256 | 0.004 |
| 11257 | 0.004 |
| 11258 | 0.004 |
| 11259 | 0.004 |
| 11260 | 0.004 |
| 11261 | 0.004 |
| 11262 | 0.004 |
| 11263 | 0.004 |
| 11264 | 0.004 |
| 11265 | 0.004 |
| 11266 | 0.004 |
| 11267 | 0.004 |
| 11268 | 0.004 |
| 11269 | 0.004 |
| 11270 | 0.004 |
| 11271 | 0.004 |
| 11272 | 0.004 |
| 11273 | 0.004 |
| 11274 | 0.004 |
| 11275 | 0.004 |
| 11276 | 0.004 |
| 11277 | 0.004 |
| 11278 | 0.004 |
| 11279 | 0.004 |
| 11280 | 0.004 |
| 11281 | 0.004 |
| 11282 | 0.004 |
| 11283 | 0.004 |
| 11284 | 0.004 |
| 11285 | 0.004 |
| 11286 | 0.004 |
| 11287 | 0.004 |
| 11288 | 0.004 |
| 11289 | 0.004 |
| 11290 | 0.004 |
| 11291 | 0.004 |
| 11292 | 0.004 |
| 11293 | 0.004 |
| 11294 | 0.004 |
| 11295 | 0.004 |
| 11296 | 0.004 |
| 11297 | 0.004 |
| 11298 | 0.004 |
| 11299 | 0.004 |
| 11300 | 0.004 |
| 11301 | 0.004 |
| 11302 | 0.004 |
| 11303 | 0.004 |
| 11304 | 0.004 |
| 11305 | 0.004 |
| 11306 | 0.004 |
| 11307 | 0.004 |
| 11308 | 0.004 |
| 11309 | 0.004 |
| 11310 | 0.004 |
| 11311 | 0.004 |
| 11312 | 0.004 |
| 11313 | 0.004 |
| 11314 | 0.004 |
| 11315 | 0.004 |
| 11316 | 0.004 |
| 11317 | 0.004 |
| 11318 | 0.004 |
| 11319 | 0.004 |
| 11320 | 0.004 |
| 11321 | 0.004 |
| 11322 | 0.004 |
| 11323 | 0.004 |
| 11324 | 0.004 |
| 11325 | 0.004 |
| 11326 | 0.004 |
| 11327 | 0.004 |
| 11328 | 0.004 |
| 11329 | 0.004 |
| 11330 | 0.004 |
| 11331 | 0.004 |
| 11332 | 0.004 |
| 11333 | 0.004 |
| 11334 | 0.004 |
| 11335 | 0.004 |
| 11336 | 0.004 |
| 11337 | 0.004 |
| 11338 | 0.004 |
| 11339 | 0.004 |
| 11340 | 0.004 |
| 11341 | 0.004 |
| 11342 | 0.004 |
| 11343 | 0.004 |
| 11344 | 0.004 |
| 11345 | 0.004 |
| 11346 | 0.004 |
| 11347 | 0.004 |
| 11348 | 0.004 |
| 11349 | 0.004 |
| 11350 | 0.004 |
| 11351 | 0.004 |
| 11352 | 0.004 |
| 11353 | 0.004 |
| 11354 | 0.004 |
| 11355 | 0.004 |
| 11356 | 0.004 |
| 11357 | 0.004 |
| 11358 | 0.004 |
| 11359 | 0.004 |
| 11360 | 0.004 |
| 11361 | 0.004 |
| 11362 | 0.004 |
| 11363 | 0.004 |
| 11364 | 0.004 |
| 11365 | 0.004 |
| 11366 | 0.004 |
| 11367 | 0.004 |
| 11368 | 0.004 |
| 11369 | 0.004 |
| 11370 | 0.004 |
| 11371 | 0.004 |
| 11372 | 0.004 |
| 11373 | 0.004 |
| 11374 | 0.004 |
| 11375 | 0.004 |
| 11376 | 0.004 |
| 11377 | 0.004 |
| 11378 | 0.004 |
| 11379 | 0.004 |
| 11380 | 0.004 |
| 11381 | 0.004 |
| 11382 | 0.004 |
| 11383 | 0.004 |
| 11384 | 0.004 |
| 11385 | 0.004 |
| 11386 | 0.004 |
| 11387 | 0.004 |
| 11388 | 0.004 |
| 11389 | 0.004 |
| 11390 | 0.004 |
| 11391 | 0.004 |
| 11392 | 0.004 |
| 11393 | 0.004 |
| 11394 | 0.004 |
| 11395 | 0.004 |
| 11396 | 0.004 |
| 11397 | 0.004 |
| 11398 | 0.004 |
| 11399 | 0.004 |
| 11400 | 0.004 |
| 11401 | 0.004 |
| 11402 | 0.004 |
| 11403 | 0.004 |
| 11404 | 0.004 |
| 11405 | 0.004 |
| 11406 | 0.004 |
| 11407 | 0.004 |
| 11408 | 0.004 |
| 11409 | 0.004 |
| 11410 | 0.004 |
| 11411 | 0.004 |
| 11412 | 0.004 |
| 11413 | 0.004 |
| 11414 | 0.004 |
| 11415 | 0.004 |
| 11416 | 0.004 |
| 11417 | 0.004 |
| 11418 | 0.004 |
| 11419 | 0.004 |
| 11420 | 0.004 |
| 11421 | 0.004 |
| 11422 | 0.004 |
| 11423 | 0.004 |
| 11424 | 0.004 |
| 11425 | 0.004 |
| 11426 | 0.004 |
| 11427 | 0.004 |
| 11428 | 0.004 |
| 11429 | 0.004 |
| 11430 | 0.004 |
| 11431 | 0.004 |
| 11432 | 0.004 |
| 11433 | 0.004 |
| 11434 | 0.004 |
| 11435 | 0.004 |
| 11436 | 0.004 |
| 11437 | 0.004 |
| 11438 | 0.004 |
| 11439 | 0.004 |
| 11440 | 0.004 |
| 11441 | 0.004 |
| 11442 | 0.004 |
| 11443 | 0.004 |
| 11444 | 0.004 |
| 11445 | 0.004 |
| 11446 | 0.004 |
| 11447 | 0.004 |
| 11448 | 0.004 |
| 11449 | 0.004 |
| 11450 | 0.004 |
| 11451 | 0.004 |
| 11452 | 0.004 |
| 11453 | 0.004 |
| 11454 | 0.004 |
| 11455 | 0.004 |
| 11456 | 0.004 |
| 11457 | 0.004 |
| 11458 | 0.004 |
| 11459 | 0.004 |
| 11460 | 0.004 |
| 11461 | 0.004 |
| 11462 | 0.004 |
| 11463 | 0.004 |
| 11464 | 0.004 |
| 11465 | 0.004 |
| 11466 | 0.004 |
| 11467 | 0.004 |
| 11468 | 0.004 |
| 11469 | 0.004 |
| 11470 | 0.004 |
| 11471 | 0.004 |
| 11472 | 0.004 |
| 11473 | 0.004 |
| 11474 | 0.004 |
| 11475 | 0.004 |
| 11476 | 0.004 |
| 11477 | 0.004 |
| 11478 | 0.004 |
| 11479 | 0.004 |
| 11480 | 0.004 |
| 11481 | 0.004 |
| 11482 | 0.004 |
| 11483 | 0.004 |
| 11484 | 0.004 |
| 11485 | 0.004 |
| 11486 | 0.004 |
| 11487 | 0.004 |
| 11488 | 0.004 |
| 11489 | 0.004 |
| 11490 | 0.004 |
| 11491 | 0.004 |
| 11492 | 0.004 |
| 11493 | 0.004 |
| 11494 | 0.004 |
| 11495 | 0.004 |
| 11496 | 0.004 |
| 11497 | 0.004 |
| 11498 | 0.004 |
| 11499 | 0.004 |
| 11500 | 0.004 |
| 11501 | 0.004 |
| 11502 | 0.004 |
| 11503 | 0.004 |
| 11504 | 0.004 |
| 11505 | 0.004 |
| 11506 | 0.004 |
| 11507 | 0.004 |
| 11508 | 0.004 |
| 11509 | 0.004 |
| 11510 | 0.004 |
| 11511 | 0.004 |
| 11512 | 0.004 |
| 11513 | 0.004 |
| 11514 | 0.004 |
| 11515 | 0.004 |
| 11516 | 0.004 |
| 11517 | 0.004 |
| 11518 | 0.004 |
| 11519 | 0.004 |
| 11520 | 0.004 |
| 11521 | 0.004 |
| 11522 | 0.004 |
| 11523 | 0.004 |
| 11524 | 0.004 |
| 11525 | 0.004 |
| 11526 | 0.004 |
| 11527 | 0.004 |
| 11528 | 0.004 |
| 11529 | 0.004 |
| 11530 | 0.004 |
| 11531 | 0.004 |
| 11532 | 0.004 |
| 11533 | 0.004 |
| 11534 | 0.004 |
| 11535 | 0.004 |
| 11536 | 0.004 |
| 11537 | 0.004 |
| 11538 | 0.004 |
| 11539 | 0.004 |
| 11540 | 0.004 |
| 11541 | 0.004 |
| 11542 | 0.004 |
| 11543 | 0.004 |
| 11544 | 0.004 |
| 11545 | 0.004 |
| 11546 | 0.004 |
| 11547 | 0.004 |
| 11548 | 0.004 |
| 11549 | 0.004 |
| 11550 | 0.004 |
| 11551 | 0.004 |
| 11552 | 0.004 |
| 11553 | 0.004 |
| 11554 | 0.004 |
| 11555 | 0.004 |
| 11556 | 0.004 |
| 11557 | 0.004 |
| 11558 | 0.004 |
| 11559 | 0.004 |
| 11560 | 0.004 |
| 11561 | 0.004 |
| 11562 | 0.004 |
| 11563 | 0.004 |
| 11564 | 0.004 |
| 11565 | 0.004 |
| 11566 | 0.004 |
| 11567 | 0.004 |
| 11568 | 0.004 |
| 11569 | 0.004 |
| 11570 | 0.004 |
| 11571 | 0.004 |
| 11572 | 0.004 |
| 11573 | 0.004 |
| 11574 | 0.004 |
| 11575 | 0.004 |
| 11576 | 0.004 |
| 11577 | 0.004 |
| 11578 | 0.004 |
| 11579 | 0.004 |
| 11580 | 0.004 |
| 11581 | 0.004 |
| 11582 | 0.004 |
| 11583 | 0.004 |
| 11584 | 0.004 |
| 11585 | 0.004 |
| 11586 | 0.004 |
| 11587 | 0.004 |
| 11588 | 0.004 |
| 11589 | 0.004 |
| 11590 | 0.004 |
| 11591 | 0.004 |
| 11592 | 0.004 |
| 11593 | 0.004 |
| 11594 | 0.004 |
| 11595 | 0.004 |
| 11596 | 0.004 |
| 11597 | 0.004 |
| 11598 | 0.004 |
| 11599 | 0.004 |
| 11600 | 0.004 |
| 11601 | 0.004 |
| 11602 | 0.004 |
| 11603 | 0.004 |
| 11604 | 0.004 |
| 11605 | 0.004 |
| 11606 | 0.004 |
| 11607 | 0.004 |
| 11608 | 0.004 |
| 11609 | 0.004 |
| 11610 | 0.004 |
| 11611 | 0.004 |
| 11612 | 0.004 |
| 11613 | 0.004 |
| 11614 | 0.004 |
| 11615 | 0.004 |
| 11616 | 0.004 |
| 11617 | 0.004 |
| 11618 | 0.004 |
| 11619 | 0.004 |
| 11620 | 0.004 |
| 11621 | 0.004 |
| 11622 | 0.004 |
| 11623 | 0.004 |
| 11624 | 0.004 |
| 11625 | 0.004 |
| 11626 | 0.004 |
| 11627 | 0.004 |
| 11628 | 0.004 |
| 11629 | 0.004 |
| 11630 | 0.004 |
| 11631 | 0.004 |
| 11632 | 0.004 |
| 11633 | 0.004 |
| 11634 | 0.004 |
| 11635 | 0.004 |
| 11636 | 0.004 |
| 11637 | 0.004 |
| 11638 | 0.004 |
| 11639 | 0.004 |
| 11640 | 0.004 |
| 11641 | 0.004 |
| 11642 | 0.004 |
| 11643 | 0.004 |
| 11644 | 0.004 |
| 11645 | 0.004 |
| 11646 | 0.004 |
| 11647 | 0.004 |
| 11648 | 0.004 |
| 11649 | 0.004 |
| 11650 | 0.004 |
| 11651 | 0.004 |
| 11652 | 0.004 |
| 11653 | 0.004 |
| 11654 | 0.004 |
| 11655 | 0.004 |
| 11656 | 0.004 |
| 11657 | 0.004 |
| 11658 | 0.004 |
| 11659 | 0.004 |
| 11660 | 0.004 |
| 11661 | 0.004 |
| 11662 | 0.004 |
| 11663 | 0.004 |
| 11664 | 0.004 |
| 11665 | 0.004 |
| 11666 | 0.004 |
| 11667 | 0.004 |
| 11668 | 0.004 |
| 11669 | 0.004 |
| 11670 | 0.004 |
| 11671 | 0.004 |
| 11672 | 0.004 |
| 11673 | 0.004 |
| 11674 | 0.004 |
| 11675 | 0.004 |
| 11676 | 0.004 |
| 11677 | 0.004 |
| 11678 | 0.004 |
| 11679 | 0.004 |
| 11680 | 0.004 |
| 11681 | 0.004 |
| 11682 | 0.004 |
| 11683 | 0.004 |
| 11684 | 0.004 |
| 11685 | 0.004 |
| 11686 | 0.004 |
| 11687 | 0.004 |
| 11688 | 0.004 |
| 11689 | 0.004 |
| 11690 | 0.004 |
| 11691 | 0.004 |
| 11692 | 0.004 |
| 11693 | 0.004 |
| 11694 | 0.004 |
| 11695 | 0.004 |
| 11696 | 0.004 |
| 11697 | 0.004 |
| 11698 | 0.004 |
| 11699 | 0.004 |
| 11700 | 0.004 |
| 11701 | 0.004 |
| 11702 | 0.004 |
| 11703 | 0.004 |
| 11704 | 0.004 |
| 11705 | 0.004 |
| 11706 | 0.004 |
| 11707 | 0.004 |
| 11708 | 0.004 |
| 11709 | 0.004 |
| 11710 | 0.004 |
| 11711 | 0.004 |
| 11712 | 0.004 |
| 11713 | 0.004 |
| 11714 | 0.004 |
| 11715 | 0.004 |
| 11716 | 0.004 |
| 11717 | 0.004 |
| 11718 | 0.004 |
| 11719 | 0.004 |
| 11720 | 0.004 |
| 11721 | 0.004 |
| 11722 | 0.004 |
| 11723 | 0.004 |
| 11724 | 0.004 |
| 11725 | 0.004 |
| 11726 | 0.004 |
| 11727 | 0.004 |
| 11728 | 0.004 |
| 11729 | 0.004 |
| 11730 | 0.004 |
| 11731 | 0.004 |
| 11732 | 0.004 |
| 11733 | 0.004 |
| 11734 | 0.004 |
| 11735 | 0.004 |
| 11736 | 0.004 |
| 11737 | 0.004 |
| 11738 | 0.004 |
| 11739 | 0.004 |
| 11740 | 0.004 |
| 11741 | 0.004 |
| 11742 | 0.004 |
| 11743 | 0.004 |
| 11744 | 0.004 |
| 11745 | 0.004 |
| 11746 | 0.004 |
| 11747 | 0.004 |
| 11748 | 0.004 |
| 11749 | 0.004 |
| 11750 | 0.004 |
| 11751 | 0.004 |
| 11752 | 0.004 |
| 11753 | 0.004 |
| 11754 | 0.004 |
| 11755 | 0.004 |
| 11756 | 0.004 |
| 11757 | 0.004 |
| 11758 | 0.004 |
| 11759 | 0.004 |
| 11760 | 0.004 |
| 11761 | 0.004 |
| 11762 | 0.004 |
| 11763 | 0.004 |
| 11764 | 0.004 |
| 11765 | 0.004 |
| 11766 | 0.004 |
| 11767 | 0.004 |
| 11768 | 0.004 |
| 11769 | 0.004 |
| 11770 | 0.004 |
| 11771 | 0.004 |
| 11772 | 0.004 |
| 11773 | 0.004 |
| 11774 | 0.004 |
| 11775 | 0.004 |
| 11776 | 0.004 |
| 11777 | 0.004 |
| 11778 | 0.004 |
| 11779 | 0.004 |
| 11780 | 0.004 |
| 11781 | 0.004 |
| 11782 | 0.004 |
| 11783 | 0.004 |
| 11784 | 0.004 |
| 11785 | 0.004 |
| 11786 | 0.004 |
| 11787 | 0.004 |
| 11788 | 0.004 |
| 11789 | 0.004 |
| 11790 | 0.004 |
| 11791 | 0.004 |
| 11792 | 0.004 |
| 11793 | 0.004 |
| 11794 | 0.004 |
| 11795 | 0.004 |
| 11796 | 0.004 |
| 11797 | 0.004 |
| 11798 | 0.004 |
| 11799 | 0.004 |
| 11800 | 0.004 |
| 11801 | 0.004 |
| 11802 | 0.004 |
| 11803 | 0.004 |
| 11804 | 0.004 |
| 11805 | 0.004 |
| 11806 | 0.004 |
| 11807 | 0.004 |
| 11808 | 0.004 |
| 11809 | 0.004 |
| 11810 | 0.004 |
| 11811 | 0.004 |
| 11812 | 0.004 |
| 11813 | 0.004 |
| 11814 | 0.004 |
| 11815 | 0.004 |
| 11816 | 0.004 |
| 11817 | 0.004 |
| 11818 | 0.004 |
| 11819 | 0.004 |
| 11820 | 0.004 |
| 11821 | 0.004 |
| 11822 | 0.004 |
| 11823 | 0.004 |
| 11824 | 0.004 |
| 11825 | 0.004 |
| 11826 | 0.004 |
| 11827 | 0.004 |
| 11828 | 0.004 |
| 11829 | 0.004 |
| 11830 | 0.004 |
| 11831 | 0.004 |
| 11832 | 0.004 |
| 11833 | 0.004 |
| 11834 | 0.004 |
| 11835 | 0.004 |
| 11836 | 0.004 |
| 11837 | 0.004 |
| 11838 | 0.004 |
| 11839 | 0.004 |
| 11840 | 0.004 |
| 11841 | 0.004 |
| 11842 | 0.004 |
| 11843 | 0.004 |
| 11844 | 0.004 |
| 11845 | 0.004 |
| 11846 | 0.004 |
| 11847 | 0.004 |
| 11848 | 0.004 |
| 11849 | 0.004 |
| 11850 | 0.004 |
| 11851 | 0.004 |
| 11852 | 0.004 |
| 11853 | 0.004 |
| 11854 | 0.004 |
| 11855 | 0.004 |
| 11856 | 0.004 |
| 11857 | 0.004 |
| 11858 | 0.004 |
| 11859 | 0.004 |
| 11860 | 0.004 |
| 11861 | 0.004 |
| 11862 | 0.004 |
| 11863 | 0.004 |
| 11864 | 0.004 |
| 11865 | 0.004 |
| 11866 | 0.004 |
| 11867 | 0.004 |
| 11868 | 0.004 |
| 11869 | 0.004 |
| 11870 | 0.004 |
| 11871 | 0.004 |
| 11872 | 0.004 |
| 11873 | 0.004 |
| 11874 | 0.004 |
| 11875 | 0.004 |
| 11876 | 0.004 |
| 11877 | 0.004 |
| 11878 | 0.004 |
| 11879 | 0.004 |
| 11880 | 0.004 |
| 11881 | 0.004 |
| 11882 | 0.004 |
| 11883 | 0.004 |
| 11884 | 0.004 |
| 11885 | 0.004 |
| 11886 | 0.004 |
| 11887 | 0.004 |
| 11888 | 0.004 |
| 11889 | 0.004 |
| 11890 | 0.004 |
| 11891 | 0.004 |
| 11892 | 0.004 |
| 11893 | 0.004 |
| 11894 | 0.004 |
| 11895 | 0.004 |
| 11896 | 0.004 |
| 11897 | 0.004 |
| 11898 | 0.004 |
| 11899 | 0.004 |
| 11900 | 0.004 |
| 11901 | 0.004 |
| 11902 | 0.004 |
| 11903 | 0.004 |
| 11904 | 0.004 |
| 11905 | 0.004 |
| 11906 | 0.004 |
| 11907 | 0.004 |
| 11908 | 0.004 |
| 11909 | 0.004 |
| 11910 | 0.004 |
| 11911 | 0.004 |
| 11912 | 0.004 |
| 11913 | 0.004 |
| 11914 | 0.004 |
| 11915 | 0.004 |
| 11916 | 0.004 |
| 11917 | 0.004 |
| 11918 | 0.004 |
| 11919 | 0.004 |
| 11920 | 0.004 |
| 11921 | 0.004 |
| 11922 | 0.004 |
| 11923 | 0.004 |
| 11924 | 0.004 |
| 11925 | 0.004 |
| 11926 | 0.004 |
| 11927 | 0.004 |
| 11928 | 0.004 |
| 11929 | 0.004 |
| 11930 | 0.004 |
| 11931 | 0.004 |
| 11932 | 0.004 |
| 11933 | 0.004 |
| 11934 | 0.004 |
| 11935 | 0.004 |
| 11936 | 0.004 |
| 11937 | 0.004 |
| 11938 | 0.004 |
| 11939 | 0.004 |
| 11940 | 0.004 |
| 11941 | 0.004 |
| 11942 | 0.004 |
| 11943 | 0.004 |
| 11944 | 0.004 |
| 11945 | 0.004 |
| 11946 | 0.004 |
| 11947 | 0.004 |
| 11948 | 0.004 |
| 11949 | 0.004 |
| 11950 | 0.004 |
| 11951 | 0.004 |
| 11952 | 0.004 |
| 11953 | 0.004 |
| 11954 | 0.004 |
| 11955 | 0.004 |
| 11956 | 0.004 |
| 11957 | 0.004 |
| 11958 | 0.004 |
| 11959 | 0.004 |
| 11960 | 0.004 |
| 11961 | 0.004 |
| 11962 | 0.004 |
| 11963 | 0.004 |
| 11964 | 0.004 |
| 11965 | 0.004 |
| 11966 | 0.004 |
| 11967 | 0.004 |
| 11968 | 0.004 |
| 11969 | 0.004 |
| 11970 | 0.004 |
| 11971 | 0.004 |
| 11972 | 0.004 |
| 11973 | 0.004 |
| 11974 | 0.004 |
| 11975 | 0.004 |
| 11976 | 0.004 |
| 11977 | 0.004 |
| 11978 | 0.004 |
| 11979 | 0.004 |
| 11980 | 0.004 |
| 11981 | 0.004 |
| 11982 | 0.004 |
| 11983 | 0.004 |
| 11984 | 0.004 |
| 11985 | 0.004 |
| 11986 | 0.004 |
| 11987 | 0.004 |
| 11988 | 0.004 |
| 11989 | 0.004 |
| 11990 | 0.004 |
| 11991 | 0.004 |
| 11992 | 0.004 |
| 11993 | 0.004 |
| 11994 | 0.004 |
| 11995 | 0.004 |
| 11996 | 0.004 |
| 11997 | 0.004 |
| 11998 | 0.004 |
| 11999 | 0.004 |
| 12000 | 0.004 |
| 12001 | 0.004 |
| 12002 | 0.004 |
| 12003 | 0.004 |
| 12004 | 0.004 |
| 12005 | 0.004 |
| 12006 | 0.004 |
| 12007 | 0.004 |
| 12008 | 0.004 |
| 12009 | 0.004 |
| 12010 | 0.004 |
| 12011 | 0.004 |
| 12012 | 0.004 |
| 12013 | 0.004 |
| 12014 | 0.004 |
| 12015 | 0.004 |
| 12016 | 0.004 |
| 12017 | 0.004 |
| 12018 | 0.004 |
| 12019 | 0.004 |
| 12020 | 0.004 |
| 12021 | 0.004 |
| 12022 | 0.004 |
| 12023 | 0.004 |
| 12024 | 0.004 |
| 12025 | 0.004 |
| 12026 | 0.004 |
| 12027 | 0.004 |
| 12028 | 0.004 |
| 12029 | 0.004 |
| 12030 | 0.004 |
| 12031 | 0.004 |
| 12032 | 0.004 |
| 12033 | 0.004 |
| 12034 | 0.004 |
| 12035 | 0.004 |
| 12036 | 0.004 |
| 12037 | 0.004 |
| 12038 | 0.004 |
| 12039 | 0.004 |
| 12040 | 0.004 |
| 12041 | 0.004 |
| 12042 | 0.004 |
| 12043 | 0.004 |
| 12044 | 0.004 |
| 12045 | 0.004 |
| 12046 | 0.004 |
| 12047 | 0.004 |
| 12048 | 0.004 |
| 12049 | 0.004 |
| 12050 | 0.004 |
| 12051 | 0.004 |
| 12052 | 0.004 |
| 12053 | 0.004 |
| 12054 | 0.004 |
| 12055 | 0.004 |
| 12056 | 0.004 |
| 12057 | 0.004 |
| 12058 | 0.004 |
| 12059 | 0.004 |
| 12060 | 0.004 |
| 12061 | 0.004 |
| 12062 | 0.004 |
| 12063 | 0.004 |
| 12064 | 0.004 |
| 12065 | 0.004 |
| 12066 | 0.004 |
| 12067 | 0.004 |
| 12068 | 0.004 |
| 12069 | 0.004 |
| 12070 | 0.004 |
| 12071 | 0.004 |
| 12072 | 0.004 |
| 12073 | 0.004 |
| 12074 | 0.004 |
| 12075 | 0.004 |
| 12076 | 0.004 |
| 12077 | 0.004 |
| 12078 | 0.004 |
| 12079 | 0.004 |
| 12080 | 0.004 |
| 12081 | 0.004 |
| 12082 | 0.004 |
| 12083 | 0.004 |
| 12084 | 0.004 |
| 12085 | 0.004 |
| 12086 | 0.004 |
| 12087 | 0.004 |
| 12088 | 0.004 |
| 12089 | 0.004 |
| 12090 | 0.004 |
| 12091 | 0.004 |
| 12092 | 0.004 |
| 12093 | 0.004 |
| 12094 | 0.004 |
| 12095 | 0.004 |
| 12096 | 0.004 |
| 12097 | 0.004 |
| 12098 | 0.004 |
| 12099 | 0.004 |
| 12100 | 0.004 |
| 12101 | 0.004 |
| 12102 | 0.004 |
| 12103 | 0.004 |
| 12104 | 0.004 |
| 12105 | 0.004 |
| 12106 | 0.004 |
| 12107 | 0.004 |
| 12108 | 0.004 |
| 12109 | 0.004 |
| 12110 | 0.004 |
| 12111 | 0.004 |
| 12112 | 0.004 |
| 12113 | 0.004 |
| 12114 | 0.004 |
| 12115 | 0.004 |
| 12116 | 0.004 |
| 12117 | 0.004 |
| 12118 | 0.004 |
| 12119 | 0.004 |
| 12120 | 0.004 |
| 12121 | 0.004 |
| 12122 | 0.004 |
| 12123 | 0.004 |
| 12124 | 0.004 |
| 12125 | 0.004 |
| 12126 | 0.004 |
| 12127 | 0.004 |
| 12128 | 0.004 |
| 12129 | 0.004 |
| 12130 | 0.004 |
| 12131 | 0.004 |
| 12132 | 0.004 |
| 12133 | 0.004 |
| 12134 | 0.004 |
| 12135 | 0.004 |
| 12136 | 0.004 |
| 12137 | 0.004 |
| 12138 | 0.004 |
| 12139 | 0.004 |
| 12140 | 0.004 |
| 12141 | 0.004 |
| 12142 | 0.004 |
| 12143 | 0.004 |
| 12144 | 0.004 |
| 12145 | 0.004 |
| 12146 | 0.004 |
| 12147 | 0.004 |
| 12148 | 0.004 |
| 12149 | 0.004 |
| 12150 | 0.004 |
| 12151 | 0.004 |
| 12152 | 0.004 |
| 12153 | 0.004 |
| 12154 | 0.004 |
| 12155 | 0.004 |
| 12156 | 0.004 |
| 12157 | 0.004 |
| 12158 | 0.004 |
| 12159 | 0.004 |
| 12160 | 0.004 |
| 12161 | 0.004 |
| 12162 | 0.004 |
| 12163 | 0.004 |
| 12164 | 0.004 |
| 12165 | 0.004 |
| 12166 | 0.004 |
| 12167 | 0.004 |
| 12168 | 0.004 |
| 12169 | 0.004 |
| 12170 | 0.004 |
| 12171 | 0.004 |
| 12172 | 0.004 |
| 12173 | 0.004 |
| 12174 | 0.004 |
| 12175 | 0.004 |
| 12176 | 0.004 |
| 12177 | 0.004 |
| 12178 | 0.004 |
| 12179 | 0.004 |
| 12180 | 0.004 |
| 12181 | 0.004 |
| 12182 | 0.004 |
| 12183 | 0.004 |
| 12184 | 0.004 |
| 12185 | 0.004 |
| 12186 | 0.004 |
| 12187 | 0.004 |
| 12188 | 0.004 |
| 12189 | 0.004 |
| 12190 | 0.004 |
| 12191 | 0.004 |
| 12192 | 0.004 |
| 12193 | 0.004 |
| 12194 | 0.004 |
| 12195 | 0.004 |
| 12196 | 0.004 |
| 12197 | 0.004 |
| 12198 | 0.004 |
| 12199 | 0.004 |
| 12200 | 0.004 |
| 12201 | 0.004 |
| 12202 | 0.004 |
| 12203 | 0.004 |
| 12204 | 0.004 |
| 12205 | 0.004 |
| 12206 | 0.004 |
| 12207 | 0.004 |
| 12208 | 0.004 |
| 12209 | 0.004 |
| 12210 | 0.004 |
| 12211 | 0.004 |
| 12212 | 0.004 |
| 12213 | 0.004 |
| 12214 | 0.004 |
| 12215 | 0.004 |
| 12216 | 0.004 |
| 12217 | 0.004 |
| 12218 | 0.004 |
| 12219 | 0.004 |
| 12220 | 0.004 |
| 12221 | 0.004 |
| 12222 | 0.004 |
| 12223 | 0.004 |
| 12224 | 0.004 |
| 12225 | 0.004 |
| 12226 | 0.004 |
| 12227 | 0.004 |
| 12228 | 0.004 |
| 12229 | 0.004 |
| 12230 | 0.004 |
| 12231 | 0.004 |
| 12232 | 0.004 |
| 12233 | 0.004 |
| 12234 | 0.004 |
| 12235 | 0.004 |
| 12236 | 0.004 |
| 12237 | 0.004 |
| 12238 | 0.004 |
| 12239 | 0.004 |
| 12240 | 0.004 |
| 12241 | 0.004 |
| 12242 | 0.004 |
| 12243 | 0.004 |
| 12244 | 0.004 |
| 12245 | 0.004 |
| 12246 | 0.004 |
| 12247 | 0.004 |
| 12248 | 0.004 |
| 12249 | 0.004 |
| 12250 | 0.004 |
| 12251 | 0.004 |
| 12252 | 0.004 |
| 12253 | 0.004 |
| 12254 | 0.004 |
| 12255 | 0.004 |
| 12256 | 0.004 |
| 12257 | 0.004 |
| 12258 | 0.004 |
| 12259 | 0.004 |
| 12260 | 0.004 |
| 12261 | 0.004 |
| 12262 | 0.004 |
| 12263 | 0.004 |
| 12264 | 0.004 |
| 12265 | 0.004 |
| 12266 | 0.004 |
| 12267 | 0.004 |
| 12268 | 0.004 |
| 12269 | 0.004 |
| 12270 | 0.004 |
| 12271 | 0.004 |
| 12272 | 0.004 |
| 12273 | 0.004 |
| 12274 | 0.004 |
| 12275 | 0.004 |
| 12276 | 0.004 |
| 12277 | 0.004 |
| 12278 | 0.004 |
| 12279 | 0.004 |
| 12280 | 0.004 |
| 12281 | 0.004 |
| 12282 | 0.004 |
| 12283 | 0.004 |
| 12284 | 0.004 |
| 12285 | 0.004 |
| 12286 | 0.004 |
| 12287 | 0.004 |
| 12288 | 0.004 |
| 12289 | 0.004 |
| 12290 | 0.004 |
| 12291 | 0.004 |
| 12292 | 0.004 |
| 12293 | 0.004 |
| 12294 | 0.004 |
| 12295 | 0.004 |
| 12296 | 0.004 |
| 12297 | 0.004 |
| 12298 | 0.004 |
| 12299 | 0.004 |
| 12300 | 0.004 |
| 12301 | 0.004 |
| 12302 | 0.004 |
| 12303 | 0.004 |
| 12304 | 0.004 |
| 12305 | 0.004 |
| 12306 | 0.004 |
| 12307 | 0.004 |
| 12308 | 0.004 |
| 12309 | 0.004 |
| 12310 | 0.004 |
| 12311 | 0.004 |
| 12312 | 0.004 |
| 12313 | 0.004 |
| 12314 | 0.004 |
| 12315 | 0.004 |
| 12316 | 0.004 |
| 12317 | 0.004 |
| 12318 | 0.004 |
| 12319 | 0.004 |
| 12320 | 0.004 |
| 12321 | 0.004 |
| 12322 | 0.004 |
| 12323 | 0.004 |
| 12324 | 0.004 |
| 12325 | 0.004 |
| 12326 | 0.004 |
| 12327 | 0.004 |
| 12328 | 0.004 |
| 12329 | 0.004 |
| 12330 | 0.004 |
| 12331 | 0.004 |
| 12332 | 0.004 |
| 12333 | 0.004 |
| 12334 | 0.004 |
| 12335 | 0.004 |
| 12336 | 0.004 |
| 12337 | 0.004 |
| 12338 | 0.004 |
| 12339 | 0.004 |
| 12340 | 0.004 |
| 12341 | 0.004 |
| 12342 | 0.004 |
| 12343 | 0.004 |
| 12344 | 0.004 |
| 12345 | 0.004 |
| 12346 | 0.004 |
| 12347 | 0.004 |
| 12348 | 0.004 |
| 12349 | 0.004 |
| 12350 | 0.004 |
| 12351 | 0.004 |
| 12352 | 0.004 |
| 12353 | 0.004 |
| 12354 | 0.004 |
| 12355 | 0.004 |
| 12356 | 0.004 |
| 12357 | 0.004 |
| 12358 | 0.004 |
| 12359 | 0.004 |
| 12360 | 0.004 |
| 12361 | 0.004 |
| 12362 | 0.004 |
| 12363 | 0.004 |
| 12364 | 0.004 |
| 12365 | 0.004 |
| 12366 | 0.004 |
| 12367 | 0.004 |
| 12368 | 0.004 |
| 12369 | 0.004 |
| 12370 | 0.004 |
| 12371 | 0.004 |
| 12372 | 0.004 |
| 12373 | 0.004 |
| 12374 | 0.004 |
| 12375 | 0.004 |
| 12376 | 0.004 |
| 12377 | 0.004 |
| 12378 | 0.004 |
| 12379 | 0.004 |
| 12380 | 0.004 |
| 12381 | 0.004 |
| 12382 | 0.004 |
| 12383 | 0.004 |
| 12384 | 0.004 |
| 12385 | 0.004 |
| 12386 | 0.004 |
| 12387 | 0.004 |
| 12388 | 0.004 |
| 12389 | 0.004 |
| 12390 | 0.004 |
| 12391 | 0.004 |
| 12392 | 0.004 |
| 12393 | 0.004 |
| 12394 | 0.004 |
| 12395 | 0.004 |
| 12396 | 0.005 |
| 12397 | 0.004 |
| 12398 | 0.004 |
| 12399 | 0.004 |
| 12400 | 0.004 |
| 12401 | 0.004 |
| 12402 | 0.004 |
| 12403 | 0.004 |
| 12404 | 0.004 |
| 12405 | 0.004 |
| 12406 | 0.004 |
| 12407 | 0.004 |
| 12408 | 0.004 |
| 12409 | 0.004 |
| 12410 | 0.004 |
| 12411 | 0.004 |
| 12412 | 0.004 |
| 12413 | 0.004 |
| 12414 | 0.004 |
| 12415 | 0.004 |
| 12416 | 0.004 |
| 12417 | 0.004 |
| 12418 | 0.004 |
| 12419 | 0.004 |
| 12420 | 0.004 |
| 12421 | 0.004 |
| 12422 | 0.004 |
| 12423 | 0.004 |
| 12424 | 0.004 |
| 12425 | 0.004 |
| 12426 | 0.004 |
| 12427 | 0.004 |
| 12428 | 0.004 |
| 12429 | 0.004 |
| 12430 | 0.004 |
| 12431 | 0.004 |
| 12432 | 0.004 |
| 12433 | 0.004 |
| 12434 | 0.004 |
| 12435 | 0.004 |
| 12436 | 0.004 |
| 12437 | 0.004 |
| 12438 | 0.004 |
| 12439 | 0.004 |
| 12440 | 0.004 |
| 12441 | 0.004 |
| 12442 | 0.004 |
| 12443 | 0.004 |
| 12444 | 0.004 |
| 12445 | 0.004 |
| 12446 | 0.004 |
| 12447 | 0.004 |
| 12448 | 0.005 |
| 12449 | 0.004 |
| 12450 | 0.004 |
| 12451 | 0.004 |
| 12452 | 0.004 |
| 12453 | 0.004 |
| 12454 | 0.004 |
| 12455 | 0.004 |
| 12456 | 0.004 |
| 12457 | 0.004 |
| 12458 | 0.004 |
| 12459 | 0.004 |
| 12460 | 0.004 |
| 12461 | 0.004 |
| 12462 | 0.004 |
| 12463 | 0.004 |
| 12464 | 0.004 |
| 12465 | 0.004 |
| 12466 | 0.004 |
| 12467 | 0.004 |
| 12468 | 0.004 |
| 12469 | 0.004 |
| 12470 | 0.004 |
| 12471 | 0.004 |
| 12472 | 0.004 |
| 12473 | 0.004 |
| 12474 | 0.004 |
| 12475 | 0.004 |
| 12476 | 0.004 |
| 12477 | 0.004 |
| 12478 | 0.004 |
| 12479 | 0.004 |
| 12480 | 0.004 |
| 12481 | 0.004 |
| 12482 | 0.004 |
| 12483 | 0.004 |
| 12484 | 0.004 |
| 12485 | 0.004 |
| 12486 | 0.004 |
| 12487 | 0.004 |
| 12488 | 0.004 |
| 12489 | 0.004 |
| 12490 | 0.004 |
| 12491 | 0.004 |
| 12492 | 0.004 |
| 12493 | 0.004 |
| 12494 | 0.004 |
| 12495 | 0.004 |
| 12496 | 0.004 |
| 12497 | 0.004 |
| 12498 | 0.004 |
| 12499 | 0.004 |
| 12500 | 0.004 |
| 12501 | 0.004 |
| 12502 | 0.004 |
| 12503 | 0.004 |
| 12504 | 0.004 |
| 12505 | 0.004 |
| 12506 | 0.004 |
| 12507 | 0.004 |
| 12508 | 0.004 |
| 12509 | 0.004 |
| 12510 | 0.004 |
| 12511 | 0.004 |
| 12512 | 0.004 |
| 12513 | 0.004 |
| 12514 | 0.004 |
| 12515 | 0.004 |
| 12516 | 0.004 |
| 12517 | 0.004 |
| 12518 | 0.004 |
| 12519 | 0.004 |
| 12520 | 0.004 |
| 12521 | 0.004 |
| 12522 | 0.004 |
| 12523 | 0.004 |
| 12524 | 0.004 |
| 12525 | 0.004 |
| 12526 | 0.004 |
| 12527 | 0.004 |
| 12528 | 0.005 |
| 12529 | 0.005 |
| 12530 | 0.004 |
| 12531 | 0.004 |
| 12532 | 0.004 |
| 12533 | 0.004 |
| 12534 | 0.004 |
| 12535 | 0.004 |
| 12536 | 0.004 |
| 12537 | 0.004 |
| 12538 | 0.004 |
| 12539 | 0.004 |
| 12540 | 0.004 |
| 12541 | 0.004 |
| 12542 | 0.004 |
| 12543 | 0.004 |
| 12544 | 0.004 |
| 12545 | 0.004 |
| 12546 | 0.004 |
| 12547 | 0.004 |
| 12548 | 0.004 |
| 12549 | 0.004 |
| 12550 | 0.004 |
| 12551 | 0.004 |
| 12552 | 0.004 |
| 12553 | 0.004 |
| 12554 | 0.004 |
| 12555 | 0.004 |
| 12556 | 0.004 |
| 12557 | 0.004 |
| 12558 | 0.004 |
| 12559 | 0.004 |
| 12560 | 0.004 |
| 12561 | 0.004 |
| 12562 | 0.004 |
| 12563 | 0.004 |
| 12564 | 0.004 |
| 12565 | 0.004 |
| 12566 | 0.004 |
| 12567 | 0.004 |
| 12568 | 0.004 |
| 12569 | 0.004 |
| 12570 | 0.004 |
| 12571 | 0.004 |
| 12572 | 0.004 |
| 12573 | 0.004 |
| 12574 | 0.004 |
| 12575 | 0.004 |
| 12576 | 0.004 |
| 12577 | 0.004 |
| 12578 | 0.004 |
| 12579 | 0.004 |
| 12580 | 0.004 |
| 12581 | 0.004 |
| 12582 | 0.004 |
| 12583 | 0.004 |
| 12584 | 0.004 |
| 12585 | 0.004 |
| 12586 | 0.004 |
| 12587 | 0.004 |
| 12588 | 0.004 |
| 12589 | 0.004 |
| 12590 | 0.004 |
| 12591 | 0.004 |
| 12592 | 0.004 |
| 12593 | 0.004 |
| 12594 | 0.004 |
| 12595 | 0.004 |
| 12596 | 0.004 |
| 12597 | 0.004 |
| 12598 | 0.004 |
| 12599 | 0.004 |
| 12600 | 0.004 |
| 12601 | 0.004 |
| 12602 | 0.004 |
| 12603 | 0.004 |
| 12604 | 0.004 |
| 12605 | 0.004 |
| 12606 | 0.004 |
| 12607 | 0.004 |
| 12608 | 0.004 |
| 12609 | 0.004 |
| 12610 | 0.004 |
| 12611 | 0.004 |
| 12612 | 0.004 |
| 12613 | 0.004 |
| 12614 | 0.004 |
| 12615 | 0.004 |
| 12616 | 0.004 |
| 12617 | 0.004 |
| 12618 | 0.004 |
| 12619 | 0.004 |
| 12620 | 0.004 |
| 12621 | 0.004 |
| 12622 | 0.004 |
| 12623 | 0.004 |
| 12624 | 0.004 |
| 12625 | 0.004 |
| 12626 | 0.004 |
| 12627 | 0.004 |
| 12628 | 0.004 |
| 12629 | 0.004 |
| 12630 | 0.004 |
| 12631 | 0.004 |
| 12632 | 0.004 |
| 12633 | 0.004 |
| 12634 | 0.004 |
| 12635 | 0.004 |
| 12636 | 0.004 |
| 12637 | 0.004 |
| 12638 | 0.004 |
| 12639 | 0.004 |
| 12640 | 0.004 |
| 12641 | 0.004 |
| 12642 | 0.004 |
| 12643 | 0.004 |
| 12644 | 0.004 |
| 12645 | 0.004 |
| 12646 | 0.004 |
| 12647 | 0.004 |
| 12648 | 0.004 |
| 12649 | 0.004 |
| 12650 | 0.004 |
| 12651 | 0.004 |
| 12652 | 0.004 |
| 12653 | 0.004 |
| 12654 | 0.004 |
| 12655 | 0.004 |
| 12656 | 0.004 |
| 12657 | 0.004 |
| 12658 | 0.004 |
| 12659 | 0.004 |
| 12660 | 0.004 |
| 12661 | 0.004 |
| 12662 | 0.004 |
| 12663 | 0.004 |
| 12664 | 0.004 |
| 12665 | 0.004 |
| 12666 | 0.004 |
| 12667 | 0.004 |
| 12668 | 0.004 |
| 12669 | 0.004 |
| 12670 | 0.004 |
| 12671 | 0.004 |
| 12672 | 0.004 |
| 12673 | 0.004 |
| 12674 | 0.004 |
| 12675 | 0.004 |
| 12676 | 0.004 |
| 12677 | 0.004 |
| 12678 | 0.004 |
| 12679 | 0.004 |
| 12680 | 0.004 |
| 12681 | 0.004 |
| 12682 | 0.004 |
| 12683 | 0.004 |
| 12684 | 0.004 |
| 12685 | 0.004 |
| 12686 | 0.004 |
| 12687 | 0.004 |
| 12688 | 0.004 |
| 12689 | 0.004 |
| 12690 | 0.004 |
| 12691 | 0.005 |
| 12692 | 0.005 |
| 12693 | 0.004 |
| 12694 | 0.004 |
| 12695 | 0.004 |
| 12696 | 0.004 |
| 12697 | 0.004 |
| 12698 | 0.004 |
| 12699 | 0.004 |
| 12700 | 0.004 |
| 12701 | 0.004 |
| 12702 | 0.004 |
| 12703 | 0.004 |
| 12704 | 0.004 |
| 12705 | 0.004 |
| 12706 | 0.004 |
| 12707 | 0.004 |
| 12708 | 0.004 |
| 12709 | 0.004 |
| 12710 | 0.004 |
| 12711 | 0.004 |
| 12712 | 0.004 |
| 12713 | 0.004 |
| 12714 | 0.004 |
| 12715 | 0.004 |
| 12716 | 0.004 |
| 12717 | 0.004 |
| 12718 | 0.004 |
| 12719 | 0.004 |
| 12720 | 0.004 |
| 12721 | 0.004 |
| 12722 | 0.004 |
| 12723 | 0.004 |
| 12724 | 0.004 |
| 12725 | 0.004 |
| 12726 | 0.004 |
| 12727 | 0.004 |
| 12728 | 0.004 |
| 12729 | 0.004 |
| 12730 | 0.004 |
| 12731 | 0.004 |
| 12732 | 0.004 |
| 12733 | 0.004 |
| 12734 | 0.004 |
| 12735 | 0.004 |
| 12736 | 0.004 |
| 12737 | 0.004 |
| 12738 | 0.004 |
| 12739 | 0.004 |
| 12740 | 0.004 |
| 12741 | 0.004 |
| 12742 | 0.004 |
| 12743 | 0.004 |
| 12744 | 0.004 |
| 12745 | 0.004 |
| 12746 | 0.004 |
| 12747 | 0.004 |
| 12748 | 0.004 |
| 12749 | 0.004 |
| 12750 | 0.004 |
| 12751 | 0.004 |
| 12752 | 0.004 |
| 12753 | 0.004 |
| 12754 | 0.004 |
| 12755 | 0.004 |
| 12756 | 0.004 |
| 12757 | 0.004 |
| 12758 | 0.004 |
| 12759 | 0.004 |
| 12760 | 0.004 |
| 12761 | 0.004 |
| 12762 | 0.004 |
| 12763 | 0.004 |
| 12764 | 0.004 |
| 12765 | 0.004 |
| 12766 | 0.004 |
| 12767 | 0.005 |
| 12768 | 0.005 |
| 12769 | 0.005 |
| 12770 | 0.005 |
| 12771 | 0.005 |
| 12772 | 0.004 |
| 12773 | 0.004 |
| 12774 | 0.005 |
| 12775 | 0.004 |
| 12776 | 0.004 |
| 12777 | 0.004 |
| 12778 | 0.004 |
| 12779 | 0.004 |
| 12780 | 0.004 |
| 12781 | 0.004 |
| 12782 | 0.004 |
| 12783 | 0.004 |
| 12784 | 0.004 |
| 12785 | 0.004 |
| 12786 | 0.004 |
| 12787 | 0.004 |
| 12788 | 0.004 |
| 12789 | 0.004 |
| 12790 | 0.004 |
| 12791 | 0.004 |
| 12792 | 0.004 |
| 12793 | 0.004 |
| 12794 | 0.004 |
| 12795 | 0.004 |
| 12796 | 0.004 |
| 12797 | 0.004 |
| 12798 | 0.004 |
| 12799 | 0.004 |
| 12800 | 0.004 |
| 12801 | 0.004 |
| 12802 | 0.004 |
| 12803 | 0.004 |
| 12804 | 0.004 |
| 12805 | 0.004 |
| 12806 | 0.004 |
| 12807 | 0.004 |
| 12808 | 0.004 |
| 12809 | 0.004 |
| 12810 | 0.004 |
| 12811 | 0.004 |
| 12812 | 0.004 |
| 12813 | 0.004 |
| 12814 | 0.004 |
| 12815 | 0.004 |
| 12816 | 0.004 |
| 12817 | 0.004 |
| 12818 | 0.004 |
| 12819 | 0.004 |
| 12820 | 0.004 |
| 12821 | 0.004 |
| 12822 | 0.004 |
| 12823 | 0.004 |
| 12824 | 0.004 |
| 12825 | 0.004 |
| 12826 | 0.004 |
| 12827 | 0.004 |
| 12828 | 0.004 |
| 12829 | 0.004 |
| 12830 | 0.004 |
| 12831 | 0.004 |
| 12832 | 0.004 |
| 12833 | 0.004 |
| 12834 | 0.004 |
| 12835 | 0.004 |
| 12836 | 0.004 |
| 12837 | 0.004 |
| 12838 | 0.004 |
| 12839 | 0.004 |
| 12840 | 0.004 |
| 12841 | 0.004 |
| 12842 | 0.004 |
| 12843 | 0.004 |
| 12844 | 0.004 |
| 12845 | 0.004 |
| 12846 | 0.004 |
| 12847 | 0.004 |
| 12848 | 0.005 |
| 12849 | 0.005 |
| 12850 | 0.005 |
| 12851 | 0.005 |
| 12852 | 0.004 |
| 12853 | 0.004 |
| 12854 | 0.004 |
| 12855 | 0.004 |
| 12856 | 0.004 |
| 12857 | 0.004 |
| 12858 | 0.004 |
| 12859 | 0.004 |
| 12860 | 0.004 |
| 12861 | 0.004 |
| 12862 | 0.004 |
| 12863 | 0.004 |
| 12864 | 0.004 |
| 12865 | 0.004 |
| 12866 | 0.004 |
| 12867 | 0.004 |
| 12868 | 0.004 |
| 12869 | 0.004 |
| 12870 | 0.004 |
| 12871 | 0.005 |
| 12872 | 0.004 |
| 12873 | 0.004 |
| 12874 | 0.004 |
| 12875 | 0.004 |
| 12876 | 0.004 |
| 12877 | 0.004 |
| 12878 | 0.004 |
| 12879 | 0.005 |
| 12880 | 0.004 |
| 12881 | 0.004 |
| 12882 | 0.004 |
| 12883 | 0.004 |
| 12884 | 0.004 |
| 12885 | 0.004 |
| 12886 | 0.004 |
| 12887 | 0.004 |
| 12888 | 0.004 |
| 12889 | 0.004 |
| 12890 | 0.004 |
| 12891 | 0.004 |
| 12892 | 0.004 |
| 12893 | 0.004 |
| 12894 | 0.004 |
| 12895 | 0.004 |
| 12896 | 0.004 |
| 12897 | 0.004 |
| 12898 | 0.004 |
| 12899 | 0.004 |
| 12900 | 0.004 |
| 12901 | 0.004 |
| 12902 | 0.004 |
| 12903 | 0.004 |
| 12904 | 0.004 |
| 12905 | 0.004 |
| 12906 | 0.004 |
| 12907 | 0.004 |
| 12908 | 0.004 |
| 12909 | 0.004 |
| 12910 | 0.004 |
| 12911 | 0.004 |
| 12912 | 0.004 |
| 12913 | 0.004 |
| 12914 | 0.004 |
| 12915 | 0.004 |
| 12916 | 0.004 |
| 12917 | 0.004 |
| 12918 | 0.004 |
| 12919 | 0.004 |
| 12920 | 0.004 |
| 12921 | 0.004 |
| 12922 | 0.004 |
| 12923 | 0.004 |
| 12924 | 0.004 |
| 12925 | 0.004 |
| 12926 | 0.004 |
| 12927 | 0.005 |
| 12928 | 0.005 |
| 12929 | 0.005 |
| 12930 | 0.005 |
| 12931 | 0.005 |
| 12932 | 0.005 |
| 12933 | 0.004 |
| 12934 | 0.004 |
| 12935 | 0.004 |
| 12936 | 0.004 |
| 12937 | 0.004 |
| 12938 | 0.004 |
| 12939 | 0.004 |
| 12940 | 0.004 |
| 12941 | 0.004 |
| 12942 | 0.004 |
| 12943 | 0.004 |
| 12944 | 0.004 |
| 12945 | 0.004 |
| 12946 | 0.004 |
| 12947 | 0.004 |
| 12948 | 0.005 |
| 12949 | 0.004 |
| 12950 | 0.004 |
| 12951 | 0.004 |
| 12952 | 0.004 |
| 12953 | 0.004 |
| 12954 | 0.004 |
| 12955 | 0.004 |
| 12956 | 0.004 |
| 12957 | 0.004 |
| 12958 | 0.004 |
| 12959 | 0.005 |
| 12960 | 0.005 |
| 12961 | 0.004 |
| 12962 | 0.004 |
| 12963 | 0.004 |
| 12964 | 0.004 |
| 12965 | 0.004 |
| 12966 | 0.004 |
| 12967 | 0.004 |
| 12968 | 0.004 |
| 12969 | 0.004 |
| 12970 | 0.004 |
| 12971 | 0.004 |
| 12972 | 0.004 |
| 12973 | 0.004 |
| 12974 | 0.004 |
| 12975 | 0.004 |
| 12976 | 0.004 |
| 12977 | 0.004 |
| 12978 | 0.004 |
| 12979 | 0.004 |
| 12980 | 0.004 |
| 12981 | 0.004 |
| 12982 | 0.004 |
| 12983 | 0.004 |
| 12984 | 0.004 |
| 12985 | 0.004 |
| 12986 | 0.004 |
| 12987 | 0.004 |
| 12988 | 0.004 |
| 12989 | 0.004 |
| 12990 | 0.004 |
| 12991 | 0.004 |
| 12992 | 0.004 |
| 12993 | 0.004 |
| 12994 | 0.004 |
| 12995 | 0.004 |
| 12996 | 0.004 |
| 12997 | 0.004 |
| 12998 | 0.004 |
| 12999 | 0.004 |
| 13000 | 0.004 |
| 13001 | 0.004 |
| 13002 | 0.004 |
| 13003 | 0.004 |
| 13004 | 0.004 |
| 13005 | 0.005 |
| 13006 | 0.005 |
| 13007 | 0.005 |
| 13008 | 0.005 |
| 13009 | 0.005 |
| 13010 | 0.004 |
| 13011 | 0.004 |
| 13012 | 0.004 |
| 13013 | 0.004 |
| 13014 | 0.004 |
| 13015 | 0.005 |
| 13016 | 0.005 |
| 13017 | 0.004 |
| 13018 | 0.004 |
| 13019 | 0.004 |
| 13020 | 0.004 |
| 13021 | 0.004 |
| 13022 | 0.004 |
| 13023 | 0.004 |
| 13024 | 0.005 |
| 13025 | 0.004 |
| 13026 | 0.004 |
| 13027 | 0.004 |
| 13028 | 0.004 |
| 13029 | 0.004 |
| 13030 | 0.004 |
| 13031 | 0.004 |
| 13032 | 0.004 |
| 13033 | 0.004 |
| 13034 | 0.005 |
| 13035 | 0.005 |
| 13036 | 0.004 |
| 13037 | 0.005 |
| 13038 | 0.004 |
| 13039 | 0.004 |
| 13040 | 0.004 |
| 13041 | 0.004 |
| 13042 | 0.005 |
| 13043 | 0.004 |
| 13044 | 0.004 |
| 13045 | 0.004 |
| 13046 | 0.004 |
| 13047 | 0.004 |
| 13048 | 0.004 |
| 13049 | 0.004 |
| 13050 | 0.004 |
| 13051 | 0.004 |
| 13052 | 0.004 |
| 13053 | 0.004 |
| 13054 | 0.004 |
| 13055 | 0.004 |
| 13056 | 0.004 |
| 13057 | 0.004 |
| 13058 | 0.004 |
| 13059 | 0.004 |
| 13060 | 0.004 |
| 13061 | 0.004 |
| 13062 | 0.004 |
| 13063 | 0.004 |
| 13064 | 0.004 |
| 13065 | 0.004 |
| 13066 | 0.004 |
| 13067 | 0.004 |
| 13068 | 0.004 |
| 13069 | 0.004 |
| 13070 | 0.004 |
| 13071 | 0.004 |
| 13072 | 0.004 |
| 13073 | 0.004 |
| 13074 | 0.004 |
| 13075 | 0.004 |
| 13076 | 0.004 |
| 13077 | 0.004 |
| 13078 | 0.005 |
| 13079 | 0.004 |
| 13080 | 0.004 |
| 13081 | 0.004 |
| 13082 | 0.004 |
| 13083 | 0.004 |
| 13084 | 0.004 |
| 13085 | 0.004 |
| 13086 | 0.005 |
| 13087 | 0.005 |
| 13088 | 0.005 |
| 13089 | 0.005 |
| 13090 | 0.005 |
| 13091 | 0.005 |
| 13092 | 0.004 |
| 13093 | 0.004 |
| 13094 | 0.005 |
| 13095 | 0.005 |
| 13096 | 0.004 |
| 13097 | 0.005 |
| 13098 | 0.005 |
| 13099 | 0.004 |
| 13100 | 0.004 |
| 13101 | 0.004 |
| 13102 | 0.004 |
| 13103 | 0.004 |
| 13104 | 0.004 |
| 13105 | 0.004 |
| 13106 | 0.005 |
| 13107 | 0.005 |
| 13108 | 0.005 |
| 13109 | 0.004 |
| 13110 | 0.004 |
| 13111 | 0.004 |
| 13112 | 0.004 |
| 13113 | 0.005 |
| 13114 | 0.004 |
| 13115 | 0.004 |
| 13116 | 0.004 |
| 13117 | 0.004 |
| 13118 | 0.004 |
| 13119 | 0.004 |
| 13120 | 0.004 |
| 13121 | 0.004 |
| 13122 | 0.004 |
| 13123 | 0.004 |
| 13124 | 0.004 |
| 13125 | 0.004 |
| 13126 | 0.004 |
| 13127 | 0.004 |
| 13128 | 0.004 |
| 13129 | 0.004 |
| 13130 | 0.004 |
| 13131 | 0.004 |
| 13132 | 0.005 |
| 13133 | 0.004 |
| 13134 | 0.004 |
| 13135 | 0.004 |
| 13136 | 0.004 |
| 13137 | 0.004 |
| 13138 | 0.004 |
| 13139 | 0.004 |
| 13140 | 0.004 |
| 13141 | 0.004 |
| 13142 | 0.004 |
| 13143 | 0.004 |
| 13144 | 0.004 |
| 13145 | 0.004 |
| 13146 | 0.004 |
| 13147 | 0.004 |
| 13148 | 0.004 |
| 13149 | 0.004 |
| 13150 | 0.005 |
| 13151 | 0.004 |
| 13152 | 0.004 |
| 13153 | 0.004 |
| 13154 | 0.004 |
| 13155 | 0.004 |
| 13156 | 0.004 |
| 13157 | 0.004 |
| 13158 | 0.004 |
| 13159 | 0.004 |
| 13160 | 0.004 |
| 13161 | 0.005 |
| 13162 | 0.004 |
| 13163 | 0.004 |
| 13164 | 0.005 |
| 13165 | 0.004 |
| 13166 | 0.004 |
| 13167 | 0.005 |
| 13168 | 0.005 |
| 13169 | 0.005 |
| 13170 | 0.005 |
| 13171 | 0.005 |
| 13172 | 0.005 |
| 13173 | 0.005 |
| 13174 | 0.005 |
| 13175 | 0.005 |
| 13176 | 0.004 |
| 13177 | 0.005 |
| 13178 | 0.005 |
| 13179 | 0.005 |
| 13180 | 0.005 |
| 13181 | 0.005 |
| 13182 | 0.005 |
| 13183 | 0.004 |
| 13184 | 0.004 |
| 13185 | 0.004 |
| 13186 | 0.004 |
| 13187 | 0.004 |
| 13188 | 0.005 |
| 13189 | 0.005 |
| 13190 | 0.004 |
| 13191 | 0.004 |
| 13192 | 0.004 |
| 13193 | 0.004 |
| 13194 | 0.004 |
| 13195 | 0.004 |
| 13196 | 0.005 |
| 13197 | 0.005 |
| 13198 | 0.004 |
| 13199 | 0.004 |
| 13200 | 0.004 |
| 13201 | 0.004 |
| 13202 | 0.004 |
| 13203 | 0.005 |
| 13204 | 0.005 |
| 13205 | 0.005 |
| 13206 | 0.004 |
| 13207 | 0.004 |
| 13208 | 0.004 |
| 13209 | 0.004 |
| 13210 | 0.004 |
| 13211 | 0.004 |
| 13212 | 0.004 |
| 13213 | 0.004 |
| 13214 | 0.004 |
| 13215 | 0.004 |
| 13216 | 0.004 |
| 13217 | 0.004 |
| 13218 | 0.004 |
| 13219 | 0.004 |
| 13220 | 0.004 |
| 13221 | 0.005 |
| 13222 | 0.004 |
| 13223 | 0.004 |
| 13224 | 0.004 |
| 13225 | 0.004 |
| 13226 | 0.004 |
| 13227 | 0.004 |
| 13228 | 0.004 |
| 13229 | 0.004 |
| 13230 | 0.005 |
| 13231 | 0.004 |
| 13232 | 0.004 |
| 13233 | 0.004 |
| 13234 | 0.004 |
| 13235 | 0.004 |
| 13236 | 0.004 |
| 13237 | 0.004 |
| 13238 | 0.004 |
| 13239 | 0.004 |
| 13240 | 0.005 |
| 13241 | 0.005 |
| 13242 | 0.005 |
| 13243 | 0.004 |
| 13244 | 0.004 |
| 13245 | 0.005 |
| 13246 | 0.005 |
| 13247 | 0.005 |
| 13248 | 0.005 |
| 13249 | 0.005 |
| 13250 | 0.005 |
| 13251 | 0.005 |
| 13252 | 0.005 |
| 13253 | 0.005 |
| 13254 | 0.005 |
| 13255 | 0.005 |
| 13256 | 0.005 |
| 13257 | 0.005 |
| 13258 | 0.005 |
| 13259 | 0.004 |
| 13260 | 0.004 |
| 13261 | 0.004 |
| 13262 | 0.004 |
| 13263 | 0.004 |
| 13264 | 0.005 |
| 13265 | 0.005 |
| 13266 | 0.005 |
| 13267 | 0.005 |
| 13268 | 0.005 |
| 13269 | 0.005 |
| 13270 | 0.005 |
| 13271 | 0.005 |
| 13272 | 0.005 |
| 13273 | 0.005 |
| 13274 | 0.005 |
| 13275 | 0.005 |
| 13276 | 0.004 |
| 13277 | 0.004 |
| 13278 | 0.005 |
| 13279 | 0.004 |
| 13280 | 0.004 |
| 13281 | 0.005 |
| 13282 | 0.005 |
| 13283 | 0.004 |
| 13284 | 0.004 |
| 13285 | 0.004 |
| 13286 | 0.004 |
| 13287 | 0.004 |
| 13288 | 0.004 |
| 13289 | 0.004 |
| 13290 | 0.004 |
| 13291 | 0.004 |
| 13292 | 0.004 |
| 13293 | 0.004 |
| 13294 | 0.004 |
| 13295 | 0.004 |
| 13296 | 0.004 |
| 13297 | 0.005 |
| 13298 | 0.005 |
| 13299 | 0.004 |
| 13300 | 0.004 |
| 13301 | 0.004 |
| 13302 | 0.004 |
| 13303 | 0.005 |
| 13304 | 0.004 |
| 13305 | 0.004 |
| 13306 | 0.004 |
| 13307 | 0.004 |
| 13308 | 0.004 |
| 13309 | 0.004 |
| 13310 | 0.004 |
| 13311 | 0.004 |
| 13312 | 0.004 |
| 13313 | 0.004 |
| 13314 | 0.004 |
| 13315 | 0.005 |
| 13316 | 0.005 |
| 13317 | 0.004 |
| 13318 | 0.004 |
| 13319 | 0.004 |
| 13320 | 0.004 |
| 13321 | 0.004 |
| 13322 | 0.004 |
| 13323 | 0.004 |
| 13324 | 0.004 |
| 13325 | 0.005 |
| 13326 | 0.005 |
| 13327 | 0.005 |
| 13328 | 0.005 |
| 13329 | 0.005 |
| 13330 | 0.005 |
| 13331 | 0.005 |
| 13332 | 0.005 |
| 13333 | 0.005 |
| 13334 | 0.005 |
| 13335 | 0.005 |
| 13336 | 0.005 |
| 13337 | 0.005 |
| 13338 | 0.005 |
| 13339 | 0.004 |
| 13340 | 0.004 |
| 13341 | 0.004 |
| 13342 | 0.005 |
| 13343 | 0.005 |
| 13344 | 0.005 |
| 13345 | 0.005 |
| 13346 | 0.005 |
| 13347 | 0.005 |
| 13348 | 0.005 |
| 13349 | 0.004 |
| 13350 | 0.005 |
| 13351 | 0.005 |
| 13352 | 0.005 |
| 13353 | 0.005 |
| 13354 | 0.005 |
| 13355 | 0.005 |
| 13356 | 0.004 |
| 13357 | 0.005 |
| 13358 | 0.005 |
| 13359 | 0.004 |
| 13360 | 0.005 |
| 13361 | 0.005 |
| 13362 | 0.005 |
| 13363 | 0.004 |
| 13364 | 0.004 |
| 13365 | 0.004 |
| 13366 | 0.004 |
| 13367 | 0.004 |
| 13368 | 0.004 |
| 13369 | 0.004 |
| 13370 | 0.004 |
| 13371 | 0.004 |
| 13372 | 0.004 |
| 13373 | 0.004 |
| 13374 | 0.004 |
| 13375 | 0.004 |
| 13376 | 0.004 |
| 13377 | 0.005 |
| 13378 | 0.004 |
| 13379 | 0.004 |
| 13380 | 0.004 |
| 13381 | 0.004 |
| 13382 | 0.004 |
| 13383 | 0.004 |
| 13384 | 0.004 |
| 13385 | 0.004 |
| 13386 | 0.004 |
| 13387 | 0.004 |
| 13388 | 0.004 |
| 13389 | 0.004 |
| 13390 | 0.004 |
| 13391 | 0.004 |
| 13392 | 0.004 |
| 13393 | 0.004 |
| 13394 | 0.005 |
| 13395 | 0.005 |
| 13396 | 0.004 |
| 13397 | 0.004 |
| 13398 | 0.004 |
| 13399 | 0.005 |
| 13400 | 0.004 |
| 13401 | 0.004 |
| 13402 | 0.005 |
| 13403 | 0.004 |
| 13404 | 0.005 |
| 13405 | 0.005 |
| 13406 | 0.005 |
| 13407 | 0.005 |
| 13408 | 0.005 |
| 13409 | 0.005 |
| 13410 | 0.005 |
| 13411 | 0.005 |
| 13412 | 0.005 |
| 13413 | 0.005 |
| 13414 | 0.005 |
| 13415 | 0.005 |
| 13416 | 0.005 |
| 13417 | 0.005 |
| 13418 | 0.005 |
| 13419 | 0.005 |
| 13420 | 0.005 |
| 13421 | 0.005 |
| 13422 | 0.004 |
| 13423 | 0.004 |
| 13424 | 0.004 |
| 13425 | 0.004 |
| 13426 | 0.005 |
| 13427 | 0.005 |
| 13428 | 0.005 |
| 13429 | 0.005 |
| 13430 | 0.005 |
| 13431 | 0.005 |
| 13432 | 0.005 |
| 13433 | 0.005 |
| 13434 | 0.005 |
| 13435 | 0.005 |
| 13436 | 0.005 |
| 13437 | 0.005 |
| 13438 | 0.005 |
| 13439 | 0.005 |
| 13440 | 0.004 |
| 13441 | 0.004 |
| 13442 | 0.005 |
| 13443 | 0.005 |
| 13444 | 0.004 |
| 13445 | 0.004 |
| 13446 | 0.004 |
| 13447 | 0.004 |
| 13448 | 0.004 |
| 13449 | 0.004 |
| 13450 | 0.004 |
| 13451 | 0.004 |
| 13452 | 0.004 |
| 13453 | 0.004 |
| 13454 | 0.004 |
| 13455 | 0.004 |
| 13456 | 0.004 |
| 13457 | 0.004 |
| 13458 | 0.004 |
| 13459 | 0.004 |
| 13460 | 0.005 |
| 13461 | 0.005 |
| 13462 | 0.005 |
| 13463 | 0.005 |
| 13464 | 0.005 |
| 13465 | 0.004 |
| 13466 | 0.004 |
| 13467 | 0.004 |
| 13468 | 0.004 |
| 13469 | 0.004 |
| 13470 | 0.004 |
| 13471 | 0.004 |
| 13472 | 0.004 |
| 13473 | 0.004 |
| 13474 | 0.004 |
| 13475 | 0.004 |
| 13476 | 0.004 |
| 13477 | 0.004 |
| 13478 | 0.005 |
| 13479 | 0.004 |
| 13480 | 0.004 |
| 13481 | 0.005 |
| 13482 | 0.005 |
| 13483 | 0.005 |
| 13484 | 0.004 |
| 13485 | 0.004 |
| 13486 | 0.005 |
| 13487 | 0.005 |
| 13488 | 0.005 |
| 13489 | 0.005 |
| 13490 | 0.005 |
| 13491 | 0.005 |
| 13492 | 0.005 |
| 13493 | 0.005 |
| 13494 | 0.005 |
| 13495 | 0.005 |
| 13496 | 0.005 |
| 13497 | 0.005 |
| 13498 | 0.005 |
| 13499 | 0.005 |
| 13500 | 0.005 |
| 13501 | 0.005 |
| 13502 | 0.004 |
| 13503 | 0.004 |
| 13504 | 0.004 |
| 13505 | 0.005 |
| 13506 | 0.005 |
| 13507 | 0.005 |
| 13508 | 0.005 |
| 13509 | 0.005 |
| 13510 | 0.005 |
| 13511 | 0.005 |
| 13512 | 0.005 |
| 13513 | 0.005 |
| 13514 | 0.005 |
| 13515 | 0.005 |
| 13516 | 0.005 |
| 13517 | 0.005 |
| 13518 | 0.005 |
| 13519 | 0.005 |
| 13520 | 0.004 |
| 13521 | 0.005 |
| 13522 | 0.005 |
| 13523 | 0.004 |
| 13524 | 0.005 |
| 13525 | 0.004 |
| 13526 | 0.004 |
| 13527 | 0.004 |
| 13528 | 0.004 |
| 13529 | 0.004 |
| 13530 | 0.004 |
| 13531 | 0.004 |
| 13532 | 0.005 |
| 13533 | 0.004 |
| 13534 | 0.004 |
| 13535 | 0.004 |
| 13536 | 0.004 |
| 13537 | 0.004 |
| 13538 | 0.004 |
| 13539 | 0.005 |
| 13540 | 0.005 |
| 13541 | 0.005 |
| 13542 | 0.005 |
| 13543 | 0.004 |
| 13544 | 0.004 |
| 13545 | 0.004 |
| 13546 | 0.005 |
| 13547 | 0.005 |
| 13548 | 0.004 |
| 13549 | 0.004 |
| 13550 | 0.004 |
| 13551 | 0.004 |
| 13552 | 0.004 |
| 13553 | 0.004 |
| 13554 | 0.004 |
| 13555 | 0.004 |
| 13556 | 0.004 |
| 13557 | 0.004 |
| 13558 | 0.005 |
| 13559 | 0.005 |
| 13560 | 0.005 |
| 13561 | 0.005 |
| 13562 | 0.005 |
| 13563 | 0.004 |
| 13564 | 0.004 |
| 13565 | 0.004 |
| 13566 | 0.005 |
| 13567 | 0.005 |
| 13568 | 0.005 |
| 13569 | 0.005 |
| 13570 | 0.005 |
| 13571 | 0.005 |
| 13572 | 0.005 |
| 13573 | 0.005 |
| 13574 | 0.005 |
| 13575 | 0.005 |
| 13576 | 0.005 |
| 13577 | 0.005 |
| 13578 | 0.005 |
| 13579 | 0.005 |
| 13580 | 0.005 |
| 13581 | 0.005 |
| 13582 | 0.005 |
| 13583 | 0.005 |
| 13584 | 0.004 |
| 13585 | 0.005 |
| 13586 | 0.005 |
| 13587 | 0.005 |
| 13588 | 0.005 |
| 13589 | 0.004 |
| 13590 | 0.004 |
| 13591 | 0.005 |
| 13592 | 0.005 |
| 13593 | 0.005 |
| 13594 | 0.005 |
| 13595 | 0.005 |
| 13596 | 0.005 |
| 13597 | 0.005 |
| 13598 | 0.005 |
| 13599 | 0.004 |
| 13600 | 0.005 |
| 13601 | 0.005 |
| 13602 | 0.005 |
| 13603 | 0.005 |
| 13604 | 0.005 |
| 13605 | 0.004 |
| 13606 | 0.004 |
| 13607 | 0.004 |
| 13608 | 0.004 |
| 13609 | 0.004 |
| 13610 | 0.004 |
| 13611 | 0.004 |
| 13612 | 0.004 |
| 13613 | 0.004 |
| 13614 | 0.004 |
| 13615 | 0.004 |
| 13616 | 0.004 |
| 13617 | 0.004 |
| 13618 | 0.005 |
| 13619 | 0.005 |
| 13620 | 0.005 |
| 13621 | 0.005 |
| 13622 | 0.005 |
| 13623 | 0.004 |
| 13624 | 0.004 |
| 13625 | 0.004 |
| 13626 | 0.004 |
| 13627 | 0.004 |
| 13628 | 0.004 |
| 13629 | 0.005 |
| 13630 | 0.004 |
| 13631 | 0.004 |
| 13632 | 0.004 |
| 13633 | 0.004 |
| 13634 | 0.004 |
| 13635 | 0.004 |
| 13636 | 0.005 |
| 13637 | 0.005 |
| 13638 | 0.004 |
| 13639 | 0.005 |
| 13640 | 0.005 |
| 13641 | 0.004 |
| 13642 | 0.005 |
| 13643 | 0.005 |
| 13644 | 0.005 |
| 13645 | 0.005 |
| 13646 | 0.005 |
| 13647 | 0.005 |
| 13648 | 0.005 |
| 13649 | 0.005 |
| 13650 | 0.005 |
| 13651 | 0.005 |
| 13652 | 0.005 |
| 13653 | 0.005 |
| 13654 | 0.005 |
| 13655 | 0.005 |
| 13656 | 0.005 |
| 13657 | 0.005 |
| 13658 | 0.005 |
| 13659 | 0.005 |
| 13660 | 0.005 |
| 13661 | 0.005 |
| 13662 | 0.005 |
| 13663 | 0.005 |
| 13664 | 0.005 |
| 13665 | 0.005 |
| 13666 | 0.005 |
| 13667 | 0.004 |
| 13668 | 0.005 |
| 13669 | 0.005 |
| 13670 | 0.005 |
| 13671 | 0.005 |
| 13672 | 0.005 |
| 13673 | 0.005 |
| 13674 | 0.005 |
| 13675 | 0.004 |
| 13676 | 0.004 |
| 13677 | 0.004 |
| 13678 | 0.005 |
| 13679 | 0.005 |
| 13680 | 0.005 |
| 13681 | 0.004 |
| 13682 | 0.004 |
| 13683 | 0.004 |
| 13684 | 0.004 |
| 13685 | 0.004 |
| 13686 | 0.004 |
| 13687 | 0.005 |
| 13688 | 0.005 |
| 13689 | 0.005 |
| 13690 | 0.004 |
| 13691 | 0.004 |
| 13692 | 0.004 |
| 13693 | 0.004 |
| 13694 | 0.005 |
| 13695 | 0.004 |
| 13696 | 0.004 |
| 13697 | 0.005 |
| 13698 | 0.004 |
| 13699 | 0.004 |
| 13700 | 0.004 |
| 13701 | 0.004 |
| 13702 | 0.004 |
| 13703 | 0.004 |
| 13704 | 0.005 |
| 13705 | 0.005 |
| 13706 | 0.005 |
| 13707 | 0.005 |
| 13708 | 0.004 |
| 13709 | 0.004 |
| 13710 | 0.004 |
| 13711 | 0.004 |
| 13712 | 0.005 |
| 13713 | 0.005 |
| 13714 | 0.004 |
| 13715 | 0.004 |
| 13716 | 0.004 |
| 13717 | 0.004 |
| 13718 | 0.004 |
| 13719 | 0.004 |
| 13720 | 0.004 |
| 13721 | 0.004 |
| 13722 | 0.005 |
| 13723 | 0.005 |
| 13724 | 0.005 |
| 13725 | 0.005 |
| 13726 | 0.005 |
| 13727 | 0.005 |
| 13728 | 0.005 |
| 13729 | 0.005 |
| 13730 | 0.005 |
| 13731 | 0.005 |
| 13732 | 0.005 |
| 13733 | 0.005 |
| 13734 | 0.005 |
| 13735 | 0.005 |
| 13736 | 0.005 |
| 13737 | 0.005 |
| 13738 | 0.005 |
| 13739 | 0.005 |
| 13740 | 0.005 |
| 13741 | 0.005 |
| 13742 | 0.005 |
| 13743 | 0.005 |
| 13744 | 0.005 |
| 13745 | 0.005 |
| 13746 | 0.004 |
| 13747 | 0.005 |
| 13748 | 0.005 |
| 13749 | 0.005 |
| 13750 | 0.005 |
| 13751 | 0.005 |
| 13752 | 0.005 |
| 13753 | 0.005 |
| 13754 | 0.005 |
| 13755 | 0.004 |
| 13756 | 0.004 |
| 13757 | 0.005 |
| 13758 | 0.005 |
| 13759 | 0.005 |
| 13760 | 0.005 |
| 13761 | 0.004 |
| 13762 | 0.005 |
| 13763 | 0.004 |
| 13764 | 0.004 |
| 13765 | 0.004 |
| 13766 | 0.005 |
| 13767 | 0.005 |
| 13768 | 0.005 |
| 13769 | 0.004 |
| 13770 | 0.004 |
| 13771 | 0.004 |
| 13772 | 0.004 |
| 13773 | 0.004 |
| 13774 | 0.005 |
| 13775 | 0.004 |
| 13776 | 0.004 |
| 13777 | 0.005 |
| 13778 | 0.004 |
| 13779 | 0.004 |
| 13780 | 0.004 |
| 13781 | 0.004 |
| 13782 | 0.004 |
| 13783 | 0.005 |
| 13784 | 0.005 |
| 13785 | 0.005 |
| 13786 | 0.005 |
| 13787 | 0.005 |
| 13788 | 0.004 |
| 13789 | 0.004 |
| 13790 | 0.004 |
| 13791 | 0.005 |
| 13792 | 0.005 |
| 13793 | 0.004 |
| 13794 | 0.005 |
| 13795 | 0.004 |
| 13796 | 0.004 |
| 13797 | 0.004 |
| 13798 | 0.004 |
| 13799 | 0.004 |
| 13800 | 0.004 |
| 13801 | 0.005 |
| 13802 | 0.005 |
| 13803 | 0.005 |
| 13804 | 0.005 |
| 13805 | 0.005 |
| 13806 | 0.005 |
| 13807 | 0.005 |
| 13808 | 0.005 |
| 13809 | 0.005 |
| 13810 | 0.005 |
| 13811 | 0.005 |
| 13812 | 0.005 |
| 13813 | 0.005 |
| 13814 | 0.005 |
| 13815 | 0.005 |
| 13816 | 0.005 |
| 13817 | 0.004 |
| 13818 | 0.005 |
| 13819 | 0.005 |
| 13820 | 0.005 |
| 13821 | 0.005 |
| 13822 | 0.005 |
| 13823 | 0.005 |
| 13824 | 0.005 |
| 13825 | 0.005 |
| 13826 | 0.005 |
| 13827 | 0.005 |
| 13828 | 0.005 |
| 13829 | 0.005 |
| 13830 | 0.005 |
| 13831 | 0.005 |
| 13832 | 0.005 |
| 13833 | 0.005 |
| 13834 | 0.005 |
| 13835 | 0.005 |
| 13836 | 0.005 |
| 13837 | 0.005 |
| 13838 | 0.005 |
| 13839 | 0.005 |
| 13840 | 0.005 |
| 13841 | 0.004 |
| 13842 | 0.004 |
| 13843 | 0.004 |
| 13844 | 0.005 |
| 13845 | 0.005 |
| 13846 | 0.005 |
| 13847 | 0.004 |
| 13848 | 0.004 |
| 13849 | 0.004 |
| 13850 | 0.004 |
| 13851 | 0.004 |
| 13852 | 0.005 |
| 13853 | 0.005 |
| 13854 | 0.005 |
| 13855 | 0.005 |
| 13856 | 0.005 |
| 13857 | 0.004 |
| 13858 | 0.004 |
| 13859 | 0.004 |
| 13860 | 0.004 |
| 13861 | 0.004 |
| 13862 | 0.005 |
| 13863 | 0.005 |
| 13864 | 0.005 |
| 13865 | 0.005 |
| 13866 | 0.004 |
| 13867 | 0.004 |
| 13868 | 0.004 |
| 13869 | 0.004 |
| 13870 | 0.005 |
| 13871 | 0.005 |
| 13872 | 0.005 |
| 13873 | 0.004 |
| 13874 | 0.004 |
| 13875 | 0.004 |
| 13876 | 0.004 |
| 13877 | 0.004 |
| 13878 | 0.004 |
| 13879 | 0.005 |
| 13880 | 0.004 |
| 13881 | 0.005 |
| 13882 | 0.005 |
| 13883 | 0.004 |
| 13884 | 0.005 |
| 13885 | 0.005 |
| 13886 | 0.005 |
| 13887 | 0.005 |
| 13888 | 0.005 |
| 13889 | 0.005 |
| 13890 | 0.005 |
| 13891 | 0.005 |
| 13892 | 0.005 |
| 13893 | 0.005 |
| 13894 | 0.005 |
| 13895 | 0.005 |
| 13896 | 0.005 |
| 13897 | 0.005 |
| 13898 | 0.005 |
| 13899 | 0.005 |
| 13900 | 0.005 |
| 13901 | 0.005 |
| 13902 | 0.005 |
| 13903 | 0.005 |
| 13904 | 0.005 |
| 13905 | 0.005 |
| 13906 | 0.005 |
| 13907 | 0.005 |
| 13908 | 0.005 |
| 13909 | 0.005 |
| 13910 | 0.005 |
| 13911 | 0.005 |
| 13912 | 0.005 |
| 13913 | 0.005 |
| 13914 | 0.005 |
| 13915 | 0.005 |
| 13916 | 0.005 |
| 13917 | 0.005 |
| 13918 | 0.004 |
| 13919 | 0.004 |
| 13920 | 0.004 |
| 13921 | 0.005 |
| 13922 | 0.005 |
| 13923 | 0.005 |
| 13924 | 0.005 |
| 13925 | 0.004 |
| 13926 | 0.004 |
| 13927 | 0.004 |
| 13928 | 0.004 |
| 13929 | 0.004 |
| 13930 | 0.005 |
| 13931 | 0.005 |
| 13932 | 0.005 |
| 13933 | 0.004 |
| 13934 | 0.004 |
| 13935 | 0.004 |
| 13936 | 0.004 |
| 13937 | 0.005 |
| 13938 | 0.004 |
| 13939 | 0.005 |
| 13940 | 0.005 |
| 13941 | 0.005 |
| 13942 | 0.004 |
| 13943 | 0.004 |
| 13944 | 0.004 |
| 13945 | 0.004 |
| 13946 | 0.004 |
| 13947 | 0.005 |
| 13948 | 0.005 |
| 13949 | 0.004 |
| 13950 | 0.004 |
| 13951 | 0.004 |
| 13952 | 0.004 |
| 13953 | 0.004 |
| 13954 | 0.004 |
| 13955 | 0.005 |
| 13956 | 0.004 |
| 13957 | 0.004 |
| 13958 | 0.005 |
| 13959 | 0.005 |
| 13960 | 0.005 |
| 13961 | 0.005 |
| 13962 | 0.005 |
| 13963 | 0.005 |
| 13964 | 0.005 |
| 13965 | 0.005 |
| 13966 | 0.005 |
| 13967 | 0.005 |
| 13968 | 0.005 |
| 13969 | 0.005 |
| 13970 | 0.005 |
| 13971 | 0.005 |
| 13972 | 0.005 |
| 13973 | 0.005 |
| 13974 | 0.005 |
| 13975 | 0.005 |
| 13976 | 0.005 |
| 13977 | 0.005 |
| 13978 | 0.005 |
| 13979 | 0.005 |
| 13980 | 0.005 |
| 13981 | 0.005 |
| 13982 | 0.005 |
| 13983 | 0.005 |
| 13984 | 0.005 |
| 13985 | 0.004 |
| 13986 | 0.005 |
| 13987 | 0.005 |
| 13988 | 0.005 |
| 13989 | 0.005 |
| 13990 | 0.005 |
| 13991 | 0.004 |
| 13992 | 0.005 |
| 13993 | 0.005 |
| 13994 | 0.005 |
| 13995 | 0.005 |
| 13996 | 0.005 |
| 13997 | 0.005 |
| 13998 | 0.005 |
| 13999 | 0.005 |
| 14000 | 0.005 |
| 14001 | 0.005 |
| 14002 | 0.005 |
| 14003 | 0.005 |
| 14004 | 0.005 |
| 14005 | 0.005 |
| 14006 | 0.004 |
| 14007 | 0.004 |
| 14008 | 0.004 |
| 14009 | 0.004 |
| 14010 | 0.004 |
| 14011 | 0.004 |
| 14012 | 0.004 |
| 14013 | 0.004 |
| 14014 | 0.004 |
| 14015 | 0.004 |
| 14016 | 0.004 |
| 14017 | 0.004 |
| 14018 | 0.004 |
| 14019 | 0.004 |
| 14020 | 0.005 |
| 14021 | 0.005 |
| 14022 | 0.005 |
| 14023 | 0.005 |
| 14024 | 0.004 |
| 14025 | 0.004 |
| 14026 | 0.004 |
| 14027 | 0.005 |
| 14028 | 0.005 |
| 14029 | 0.005 |
| 14030 | 0.004 |
| 14031 | 0.004 |
| 14032 | 0.004 |
| 14033 | 0.004 |
| 14034 | 0.004 |
| 14035 | 0.004 |
| 14036 | 0.004 |
| 14037 | 0.004 |
| 14038 | 0.005 |
| 14039 | 0.005 |
| 14040 | 0.005 |
| 14041 | 0.005 |
| 14042 | 0.005 |
| 14043 | 0.005 |
| 14044 | 0.005 |
| 14045 | 0.005 |
| 14046 | 0.005 |
| 14047 | 0.005 |
| 14048 | 0.005 |
| 14049 | 0.005 |
| 14050 | 0.005 |
| 14051 | 0.005 |
| 14052 | 0.005 |
| 14053 | 0.005 |
| 14054 | 0.005 |
| 14055 | 0.005 |
| 14056 | 0.005 |
| 14057 | 0.005 |
| 14058 | 0.005 |
| 14059 | 0.005 |
| 14060 | 0.005 |
| 14061 | 0.005 |
| 14062 | 0.005 |
| 14063 | 0.004 |
| 14064 | 0.005 |
| 14065 | 0.004 |
| 14066 | 0.005 |
| 14067 | 0.005 |
| 14068 | 0.005 |
| 14069 | 0.005 |
| 14070 | 0.004 |
| 14071 | 0.005 |
| 14072 | 0.005 |
| 14073 | 0.005 |
| 14074 | 0.005 |
| 14075 | 0.005 |
| 14076 | 0.005 |
| 14077 | 0.005 |
| 14078 | 0.005 |
| 14079 | 0.004 |
| 14080 | 0.004 |
| 14081 | 0.004 |
| 14082 | 0.005 |
| 14083 | 0.005 |
| 14084 | 0.004 |
| 14085 | 0.004 |
| 14086 | 0.004 |
| 14087 | 0.004 |
| 14088 | 0.004 |
| 14089 | 0.004 |
| 14090 | 0.004 |
| 14091 | 0.004 |
| 14092 | 0.004 |
| 14093 | 0.005 |
| 14094 | 0.004 |
| 14095 | 0.005 |
| 14096 | 0.004 |
| 14097 | 0.004 |
| 14098 | 0.004 |
| 14099 | 0.004 |
| 14100 | 0.005 |
| 14101 | 0.005 |
| 14102 | 0.005 |
| 14103 | 0.004 |
| 14104 | 0.004 |
| 14105 | 0.004 |
| 14106 | 0.004 |
| 14107 | 0.004 |
| 14108 | 0.004 |
| 14109 | 0.004 |
| 14110 | 0.004 |
| 14111 | 0.004 |
| 14112 | 0.004 |
| 14113 | 0.004 |
| 14114 | 0.004 |
| 14115 | 0.004 |
| 14116 | 0.004 |
| 14117 | 0.004 |
| 14118 | 0.005 |
| 14119 | 0.005 |
| 14120 | 0.004 |
| 14121 | 0.005 |
| 14122 | 0.005 |
| 14123 | 0.005 |
| 14124 | 0.005 |
| 14125 | 0.004 |
| 14126 | 0.005 |
| 14127 | 0.005 |
| 14128 | 0.005 |
| 14129 | 0.005 |
| 14130 | 0.005 |
| 14131 | 0.005 |
| 14132 | 0.005 |
| 14133 | 0.005 |
| 14134 | 0.005 |
| 14135 | 0.005 |
| 14136 | 0.005 |
| 14137 | 0.005 |
| 14138 | 0.004 |
| 14139 | 0.005 |
| 14140 | 0.005 |
| 14141 | 0.005 |
| 14142 | 0.004 |
| 14143 | 0.004 |
| 14144 | 0.004 |
| 14145 | 0.004 |
| 14146 | 0.005 |
| 14147 | 0.005 |
| 14148 | 0.005 |
| 14149 | 0.005 |
| 14150 | 0.005 |
| 14151 | 0.005 |
| 14152 | 0.005 |
| 14153 | 0.005 |
| 14154 | 0.005 |
| 14155 | 0.005 |
| 14156 | 0.005 |
| 14157 | 0.005 |
| 14158 | 0.005 |
| 14159 | 0.004 |
| 14160 | 0.004 |
| 14161 | 0.004 |
| 14162 | 0.004 |
| 14163 | 0.004 |
| 14164 | 0.004 |
| 14165 | 0.004 |
| 14166 | 0.004 |
| 14167 | 0.004 |
| 14168 | 0.004 |
| 14169 | 0.004 |
| 14170 | 0.004 |
| 14171 | 0.004 |
| 14172 | 0.004 |
| 14173 | 0.005 |
| 14174 | 0.005 |
| 14175 | 0.005 |
| 14176 | 0.004 |
| 14177 | 0.004 |
| 14178 | 0.004 |
| 14179 | 0.004 |
| 14180 | 0.005 |
| 14181 | 0.005 |
| 14182 | 0.005 |
| 14183 | 0.004 |
| 14184 | 0.004 |
| 14185 | 0.004 |
| 14186 | 0.004 |
| 14187 | 0.004 |
| 14188 | 0.004 |
| 14189 | 0.004 |
| 14190 | 0.004 |
| 14191 | 0.004 |
| 14192 | 0.004 |
| 14193 | 0.004 |
| 14194 | 0.004 |
| 14195 | 0.004 |
| 14196 | 0.004 |
| 14197 | 0.004 |
| 14198 | 0.004 |
| 14199 | 0.004 |
| 14200 | 0.004 |
| 14201 | 0.005 |
| 14202 | 0.005 |
| 14203 | 0.005 |
| 14204 | 0.005 |
| 14205 | 0.005 |
| 14206 | 0.005 |
| 14207 | 0.005 |
| 14208 | 0.005 |
| 14209 | 0.005 |
| 14210 | 0.005 |
| 14211 | 0.005 |
| 14212 | 0.005 |
| 14213 | 0.005 |
| 14214 | 0.005 |
| 14215 | 0.005 |
| 14216 | 0.005 |
| 14217 | 0.004 |
| 14218 | 0.005 |
| 14219 | 0.005 |
| 14220 | 0.005 |
| 14221 | 0.005 |
| 14222 | 0.004 |
| 14223 | 0.004 |
| 14224 | 0.004 |
| 14225 | 0.004 |
| 14226 | 0.005 |
| 14227 | 0.005 |
| 14228 | 0.005 |
| 14229 | 0.005 |
| 14230 | 0.005 |
| 14231 | 0.005 |
| 14232 | 0.005 |
| 14233 | 0.005 |
| 14234 | 0.005 |
| 14235 | 0.005 |
| 14236 | 0.005 |
| 14237 | 0.005 |
| 14238 | 0.005 |
| 14239 | 0.004 |
| 14240 | 0.005 |
| 14241 | 0.005 |
| 14242 | 0.004 |
| 14243 | 0.005 |
| 14244 | 0.005 |
| 14245 | 0.004 |
| 14246 | 0.004 |
| 14247 | 0.004 |
| 14248 | 0.004 |
| 14249 | 0.004 |
| 14250 | 0.004 |
| 14251 | 0.004 |
| 14252 | 0.005 |
| 14253 | 0.005 |
| 14254 | 0.005 |
| 14255 | 0.004 |
| 14256 | 0.004 |
| 14257 | 0.004 |
| 14258 | 0.004 |
| 14259 | 0.005 |
| 14260 | 0.005 |
| 14261 | 0.004 |
| 14262 | 0.004 |
| 14263 | 0.004 |
| 14264 | 0.004 |
| 14265 | 0.004 |
| 14266 | 0.004 |
| 14267 | 0.004 |
| 14268 | 0.004 |
| 14269 | 0.004 |
| 14270 | 0.004 |
| 14271 | 0.004 |
| 14272 | 0.004 |
| 14273 | 0.004 |
| 14274 | 0.004 |
| 14275 | 0.004 |
| 14276 | 0.004 |
| 14277 | 0.005 |
| 14278 | 0.005 |
| 14279 | 0.004 |
| 14280 | 0.005 |
| 14281 | 0.005 |
| 14282 | 0.004 |
| 14283 | 0.004 |
| 14284 | 0.004 |
| 14285 | 0.004 |
| 14286 | 0.005 |
| 14287 | 0.005 |
| 14288 | 0.005 |
| 14289 | 0.005 |
| 14290 | 0.005 |
| 14291 | 0.005 |
| 14292 | 0.005 |
| 14293 | 0.005 |
| 14294 | 0.005 |
| 14295 | 0.005 |
| 14296 | 0.005 |
| 14297 | 0.005 |
| 14298 | 0.005 |
| 14299 | 0.005 |
| 14300 | 0.005 |
| 14301 | 0.004 |
| 14302 | 0.005 |
| 14303 | 0.004 |
| 14304 | 0.005 |
| 14305 | 0.005 |
| 14306 | 0.005 |
| 14307 | 0.005 |
| 14308 | 0.005 |
| 14309 | 0.005 |
| 14310 | 0.005 |
| 14311 | 0.005 |
| 14312 | 0.005 |
| 14313 | 0.005 |
| 14314 | 0.005 |
| 14315 | 0.005 |
| 14316 | 0.005 |
| 14317 | 0.005 |
| 14318 | 0.005 |
| 14319 | 0.005 |
| 14320 | 0.005 |
| 14321 | 0.005 |
| 14322 | 0.005 |
| 14323 | 0.005 |
| 14324 | 0.005 |
| 14325 | 0.004 |
| 14326 | 0.004 |
| 14327 | 0.004 |
| 14328 | 0.004 |
| 14329 | 0.004 |
| 14330 | 0.004 |
| 14331 | 0.005 |
| 14332 | 0.005 |
| 14333 | 0.005 |
| 14334 | 0.005 |
| 14335 | 0.004 |
| 14336 | 0.004 |
| 14337 | 0.004 |
| 14338 | 0.005 |
| 14339 | 0.005 |
| 14340 | 0.005 |
| 14341 | 0.005 |
| 14342 | 0.005 |
| 14343 | 0.004 |
| 14344 | 0.004 |
| 14345 | 0.004 |
| 14346 | 0.004 |
| 14347 | 0.004 |
| 14348 | 0.004 |
| 14349 | 0.005 |
| 14350 | 0.004 |
| 14351 | 0.004 |
| 14352 | 0.004 |
| 14353 | 0.004 |
| 14354 | 0.004 |
| 14355 | 0.004 |
| 14356 | 0.005 |
| 14357 | 0.005 |
| 14358 | 0.005 |
| 14359 | 0.005 |
| 14360 | 0.005 |
| 14361 | 0.005 |
| 14362 | 0.005 |
| 14363 | 0.004 |
| 14364 | 0.005 |
| 14365 | 0.005 |
| 14366 | 0.005 |
| 14367 | 0.005 |
| 14368 | 0.005 |
| 14369 | 0.005 |
| 14370 | 0.005 |
| 14371 | 0.005 |
| 14372 | 0.005 |
| 14373 | 0.005 |
| 14374 | 0.005 |
| 14375 | 0.005 |
| 14376 | 0.005 |
| 14377 | 0.005 |
| 14378 | 0.005 |
| 14379 | 0.005 |
| 14380 | 0.005 |
| 14381 | 0.005 |
| 14382 | 0.005 |
| 14383 | 0.005 |
| 14384 | 0.005 |
| 14385 | 0.005 |
| 14386 | 0.005 |
| 14387 | 0.005 |
| 14388 | 0.005 |
| 14389 | 0.005 |
| 14390 | 0.005 |
| 14391 | 0.005 |
| 14392 | 0.005 |
| 14393 | 0.005 |
| 14394 | 0.005 |
| 14395 | 0.005 |
| 14396 | 0.005 |
| 14397 | 0.005 |
| 14398 | 0.005 |
| 14399 | 0.005 |
| 14400 | 0.004 |
| 14401 | 0.004 |
| 14402 | 0.005 |
| 14403 | 0.005 |
| 14404 | 0.005 |
| 14405 | 0.004 |
| 14406 | 0.004 |
| 14407 | 0.004 |
| 14408 | 0.004 |
| 14409 | 0.004 |
| 14410 | 0.004 |
| 14411 | 0.005 |
| 14412 | 0.005 |
| 14413 | 0.005 |
| 14414 | 0.005 |
| 14415 | 0.004 |
| 14416 | 0.004 |
| 14417 | 0.004 |
| 14418 | 0.005 |
| 14419 | 0.005 |
| 14420 | 0.005 |
| 14421 | 0.005 |
| 14422 | 0.005 |
| 14423 | 0.004 |
| 14424 | 0.004 |
| 14425 | 0.004 |
| 14426 | 0.004 |
| 14427 | 0.004 |
| 14428 | 0.005 |
| 14429 | 0.004 |
| 14430 | 0.004 |
| 14431 | 0.004 |
| 14432 | 0.004 |
| 14433 | 0.004 |
| 14434 | 0.004 |
| 14435 | 0.005 |
| 14436 | 0.005 |
| 14437 | 0.005 |
| 14438 | 0.004 |
| 14439 | 0.005 |
| 14440 | 0.005 |
| 14441 | 0.005 |
| 14442 | 0.005 |
| 14443 | 0.005 |
| 14444 | 0.005 |
| 14445 | 0.005 |
| 14446 | 0.005 |
| 14447 | 0.005 |
| 14448 | 0.005 |
| 14449 | 0.005 |
| 14450 | 0.005 |
| 14451 | 0.005 |
| 14452 | 0.005 |
| 14453 | 0.005 |
| 14454 | 0.005 |
| 14455 | 0.005 |
| 14456 | 0.005 |
| 14457 | 0.005 |
| 14458 | 0.005 |
| 14459 | 0.005 |
| 14460 | 0.005 |
| 14461 | 0.004 |
| 14462 | 0.005 |
| 14463 | 0.005 |
| 14464 | 0.005 |
| 14465 | 0.005 |
| 14466 | 0.005 |
| 14467 | 0.005 |
| 14468 | 0.005 |
| 14469 | 0.005 |
| 14470 | 0.005 |
| 14471 | 0.005 |
| 14472 | 0.005 |
| 14473 | 0.005 |
| 14474 | 0.005 |
| 14475 | 0.005 |
| 14476 | 0.005 |
| 14477 | 0.005 |
| 14478 | 0.005 |
| 14479 | 0.005 |
| 14480 | 0.005 |
| 14481 | 0.005 |
| 14482 | 0.005 |
| 14483 | 0.005 |
| 14484 | 0.005 |
| 14485 | 0.004 |
| 14486 | 0.004 |
| 14487 | 0.004 |
| 14488 | 0.004 |
| 14489 | 0.004 |
| 14490 | 0.005 |
| 14491 | 0.005 |
| 14492 | 0.005 |
| 14493 | 0.005 |
| 14494 | 0.004 |
| 14495 | 0.004 |
| 14496 | 0.004 |
| 14497 | 0.005 |
| 14498 | 0.005 |
| 14499 | 0.005 |
| 14500 | 0.005 |
| 14501 | 0.005 |
| 14502 | 0.005 |
| 14503 | 0.004 |
| 14504 | 0.004 |
| 14505 | 0.004 |
| 14506 | 0.004 |
| 14507 | 0.004 |
| 14508 | 0.005 |
| 14509 | 0.005 |
| 14510 | 0.004 |
| 14511 | 0.004 |
| 14512 | 0.004 |
| 14513 | 0.004 |
| 14514 | 0.004 |
| 14515 | 0.005 |
| 14516 | 0.005 |
| 14517 | 0.005 |
| 14518 | 0.005 |
| 14519 | 0.005 |
| 14520 | 0.005 |
| 14521 | 0.005 |
| 14522 | 0.005 |
| 14523 | 0.005 |
| 14524 | 0.005 |
| 14525 | 0.005 |
| 14526 | 0.005 |
| 14527 | 0.005 |
| 14528 | 0.005 |
| 14529 | 0.005 |
| 14530 | 0.005 |
| 14531 | 0.005 |
| 14532 | 0.005 |
| 14533 | 0.005 |
| 14534 | 0.005 |
| 14535 | 0.005 |
| 14536 | 0.005 |
| 14537 | 0.005 |
| 14538 | 0.005 |
| 14539 | 0.005 |
| 14540 | 0.005 |
| 14541 | 0.005 |
| 14542 | 0.005 |
| 14543 | 0.005 |
| 14544 | 0.005 |
| 14545 | 0.005 |
| 14546 | 0.005 |
| 14547 | 0.005 |
| 14548 | 0.004 |
| 14549 | 0.005 |
| 14550 | 0.005 |
| 14551 | 0.005 |
| 14552 | 0.005 |
| 14553 | 0.005 |
| 14554 | 0.005 |
| 14555 | 0.005 |
| 14556 | 0.005 |
| 14557 | 0.005 |
| 14558 | 0.005 |
| 14559 | 0.005 |
| 14560 | 0.005 |
| 14561 | 0.005 |
| 14562 | 0.005 |
| 14563 | 0.004 |
| 14564 | 0.005 |
| 14565 | 0.005 |
| 14566 | 0.005 |
| 14567 | 0.005 |
| 14568 | 0.005 |
| 14569 | 0.004 |
| 14570 | 0.004 |
| 14571 | 0.004 |
| 14572 | 0.004 |
| 14573 | 0.004 |
| 14574 | 0.004 |
| 14575 | 0.005 |
| 14576 | 0.005 |
| 14577 | 0.005 |
| 14578 | 0.004 |
| 14579 | 0.004 |
| 14580 | 0.004 |
| 14581 | 0.005 |
| 14582 | 0.005 |
| 14583 | 0.005 |
| 14584 | 0.005 |
| 14585 | 0.005 |
| 14586 | 0.005 |
| 14587 | 0.004 |
| 14588 | 0.004 |
| 14589 | 0.004 |
| 14590 | 0.005 |
| 14591 | 0.005 |
| 14592 | 0.004 |
| 14593 | 0.005 |
| 14594 | 0.005 |
| 14595 | 0.004 |
| 14596 | 0.004 |
| 14597 | 0.004 |
| 14598 | 0.005 |
| 14599 | 0.004 |
| 14600 | 0.005 |
| 14601 | 0.005 |
| 14602 | 0.005 |
| 14603 | 0.005 |
| 14604 | 0.005 |
| 14605 | 0.005 |
| 14606 | 0.005 |
| 14607 | 0.005 |
| 14608 | 0.005 |
| 14609 | 0.005 |
| 14610 | 0.005 |
| 14611 | 0.005 |
| 14612 | 0.005 |
| 14613 | 0.005 |
| 14614 | 0.005 |
| 14615 | 0.005 |
| 14616 | 0.005 |
| 14617 | 0.005 |
| 14618 | 0.005 |
| 14619 | 0.005 |
| 14620 | 0.005 |
| 14621 | 0.005 |
| 14622 | 0.005 |
| 14623 | 0.005 |
| 14624 | 0.005 |
| 14625 | 0.005 |
| 14626 | 0.005 |
| 14627 | 0.005 |
| 14628 | 0.005 |
| 14629 | 0.005 |
| 14630 | 0.005 |
| 14631 | 0.005 |
| 14632 | 0.005 |
| 14633 | 0.005 |
| 14634 | 0.005 |
| 14635 | 0.005 |
| 14636 | 0.005 |
| 14637 | 0.005 |
| 14638 | 0.005 |
| 14639 | 0.005 |
| 14640 | 0.004 |
| 14641 | 0.005 |
| 14642 | 0.005 |
| 14643 | 0.005 |
| 14644 | 0.005 |
| 14645 | 0.005 |
| 14646 | 0.004 |
| 14647 | 0.005 |
| 14648 | 0.004 |
| 14649 | 0.004 |
| 14650 | 0.005 |
| 14651 | 0.005 |
| 14652 | 0.005 |
| 14653 | 0.005 |
| 14654 | 0.005 |
| 14655 | 0.005 |
| 14656 | 0.005 |
| 14657 | 0.005 |
| 14658 | 0.005 |
| 14659 | 0.005 |
| 14660 | 0.005 |
| 14661 | 0.005 |
| 14662 | 0.005 |
| 14663 | 0.005 |
| 14664 | 0.005 |
| 14665 | 0.004 |
| 14666 | 0.005 |
| 14667 | 0.005 |
| 14668 | 0.005 |
| 14669 | 0.005 |
| 14670 | 0.005 |
| 14671 | 0.004 |
| 14672 | 0.005 |
| 14673 | 0.004 |
| 14674 | 0.005 |
| 14675 | 0.005 |
| 14676 | 0.005 |
| 14677 | 0.005 |
| 14678 | 0.005 |
| 14679 | 0.005 |
| 14680 | 0.005 |
| 14681 | 0.005 |
| 14682 | 0.005 |
| 14683 | 0.005 |
| 14684 | 0.005 |
| 14685 | 0.005 |
| 14686 | 0.005 |
| 14687 | 0.005 |
| 14688 | 0.005 |
| 14689 | 0.005 |
| 14690 | 0.005 |
| 14691 | 0.005 |
| 14692 | 0.005 |
| 14693 | 0.005 |
| 14694 | 0.005 |
| 14695 | 0.005 |
| 14696 | 0.005 |
| 14697 | 0.005 |
| 14698 | 0.005 |
| 14699 | 0.005 |
| 14700 | 0.005 |
| 14701 | 0.005 |
| 14702 | 0.005 |
| 14703 | 0.005 |
| 14704 | 0.005 |
| 14705 | 0.005 |
| 14706 | 0.005 |
| 14707 | 0.005 |
| 14708 | 0.005 |
| 14709 | 0.005 |
| 14710 | 0.005 |
| 14711 | 0.005 |
| 14712 | 0.005 |
| 14713 | 0.005 |
| 14714 | 0.005 |
| 14715 | 0.005 |
| 14716 | 0.005 |
| 14717 | 0.005 |
| 14718 | 0.005 |
| 14719 | 0.005 |
| 14720 | 0.005 |
| 14721 | 0.005 |
| 14722 | 0.005 |
| 14723 | 0.005 |
| 14724 | 0.005 |
| 14725 | 0.005 |
| 14726 | 0.005 |
| 14727 | 0.005 |
| 14728 | 0.005 |
| 14729 | 0.005 |
| 14730 | 0.005 |
| 14731 | 0.005 |
| 14732 | 0.005 |
| 14733 | 0.005 |
| 14734 | 0.005 |
| 14735 | 0.005 |
| 14736 | 0.005 |
| 14737 | 0.004 |
| 14738 | 0.005 |
| 14739 | 0.005 |
| 14740 | 0.005 |
| 14741 | 0.005 |
| 14742 | 0.005 |
| 14743 | 0.005 |
| 14744 | 0.005 |
| 14745 | 0.005 |
| 14746 | 0.005 |
| 14747 | 0.005 |
| 14748 | 0.005 |
| 14749 | 0.005 |
| 14750 | 0.005 |
| 14751 | 0.005 |
| 14752 | 0.005 |
| 14753 | 0.004 |
| 14754 | 0.004 |
| 14755 | 0.004 |
| 14756 | 0.004 |
| 14757 | 0.004 |
| 14758 | 0.005 |
| 14759 | 0.005 |
| 14760 | 0.005 |
| 14761 | 0.004 |
| 14762 | 0.004 |
| 14763 | 0.004 |
| 14764 | 0.005 |
| 14765 | 0.005 |
| 14766 | 0.005 |
| 14767 | 0.005 |
| 14768 | 0.005 |
| 14769 | 0.005 |
| 14770 | 0.005 |
| 14771 | 0.005 |
| 14772 | 0.004 |
| 14773 | 0.005 |
| 14774 | 0.005 |
| 14775 | 0.005 |
| 14776 | 0.005 |
| 14777 | 0.005 |
| 14778 | 0.004 |
| 14779 | 0.004 |
| 14780 | 0.004 |
| 14781 | 0.004 |
| 14782 | 0.004 |
| 14783 | 0.004 |
| 14784 | 0.004 |
| 14785 | 0.004 |
| 14786 | 0.004 |
| 14787 | 0.004 |
| 14788 | 0.004 |
| 14789 | 0.004 |
| 14790 | 0.004 |
| 14791 | 0.004 |
| 14792 | 0.005 |
| 14793 | 0.005 |
| 14794 | 0.004 |
| 14795 | 0.004 |
| 14796 | 0.004 |
| 14797 | 0.004 |
| 14798 | 0.004 |
| 14799 | 0.004 |
| 14800 | 0.004 |
| 14801 | 0.004 |
| 14802 | 0.004 |
| 14803 | 0.004 |
| 14804 | 0.004 |
| 14805 | 0.004 |
| 14806 | 0.004 |
| 14807 | 0.004 |
| 14808 | 0.004 |
| 14809 | 0.004 |
| 14810 | 0.004 |
| 14811 | 0.004 |
| 14812 | 0.004 |
| 14813 | 0.004 |
| 14814 | 0.004 |
| 14815 | 0.004 |
| 14816 | 0.004 |
| 14817 | 0.004 |
| 14818 | 0.004 |
| 14819 | 0.004 |
| 14820 | 0.004 |
| 14821 | 0.004 |
| 14822 | 0.004 |
| 14823 | 0.004 |
| 14824 | 0.004 |
| 14825 | 0.004 |
| 14826 | 0.004 |
| 14827 | 0.004 |
| 14828 | 0.004 |
| 14829 | 0.004 |
| 14830 | 0.004 |
| 14831 | 0.004 |
| 14832 | 0.004 |
| 14833 | 0.004 |
| 14834 | 0.004 |
| 14835 | 0.004 |
| 14836 | 0.004 |
| 14837 | 0.004 |
| 14838 | 0.004 |
| 14839 | 0.004 |
| 14840 | 0.004 |
| 14841 | 0.004 |
| 14842 | 0.004 |
| 14843 | 0.004 |
| 14844 | 0.004 |
| 14845 | 0.004 |
| 14846 | 0.004 |
| 14847 | 0.004 |
| 14848 | 0.004 |
| 14849 | 0.004 |
| 14850 | 0.004 |
| 14851 | 0.004 |
| 14852 | 0.004 |
| 14853 | 0.004 |
| 14854 | 0.004 |
| 14855 | 0.004 |
| 14856 | 0.004 |
| 14857 | 0.004 |
| 14858 | 0.004 |
| 14859 | 0.004 |
| 14860 | 0.004 |
| 14861 | 0.004 |
| 14862 | 0.004 |
| 14863 | 0.004 |
| 14864 | 0.004 |
| 14865 | 0.004 |
| 14866 | 0.004 |
| 14867 | 0.004 |
| 14868 | 0.004 |
| 14869 | 0.004 |
| 14870 | 0.004 |
| 14871 | 0.004 |
| 14872 | 0.004 |
| 14873 | 0.004 |
| 14874 | 0.004 |
| 14875 | 0.004 |
| 14876 | 0.004 |
| 14877 | 0.004 |
| 14878 | 0.004 |
| 14879 | 0.004 |
| 14880 | 0.004 |
| 14881 | 0.004 |
| 14882 | 0.004 |
| 14883 | 0.004 |
| 14884 | 0.004 |
| 14885 | 0.004 |
| 14886 | 0.004 |
| 14887 | 0.004 |
| 14888 | 0.004 |
| 14889 | 0.004 |
| 14890 | 0.004 |
| 14891 | 0.004 |
| 14892 | 0.004 |
| 14893 | 0.004 |
| 14894 | 0.004 |
| 14895 | 0.004 |
| 14896 | 0.004 |
| 14897 | 0.004 |
| 14898 | 0.004 |
| 14899 | 0.004 |
| 14900 | 0.004 |
| 14901 | 0.004 |
| 14902 | 0.004 |
| 14903 | 0.004 |
| 14904 | 0.004 |
| 14905 | 0.004 |
| 14906 | 0.004 |
| 14907 | 0.004 |
| 14908 | 0.004 |
| 14909 | 0.004 |
| 14910 | 0.004 |
| 14911 | 0.004 |
| 14912 | 0.004 |
| 14913 | 0.004 |
| 14914 | 0.004 |
| 14915 | 0.004 |
| 14916 | 0.004 |
| 14917 | 0.004 |
| 14918 | 0.004 |
| 14919 | 0.004 |
| 14920 | 0.004 |
| 14921 | 0.004 |
| 14922 | 0.004 |
| 14923 | 0.004 |
| 14924 | 0.005 |
| 14925 | 0.005 |
| 14926 | 0.005 |
| 14927 | 0.005 |
| 14928 | 0.005 |
| 14929 | 0.005 |
| 14930 | 0.005 |
| 14931 | 0.005 |
| 14932 | 0.005 |
| 14933 | 0.005 |
| 14934 | 0.005 |
| 14935 | 0.005 |
| 14936 | 0.005 |
| 14937 | 0.004 |
| 14938 | 0.005 |
| 14939 | 0.005 |
| 14940 | 0.004 |
| 14941 | 0.005 |
| 14942 | 0.005 |
| 14943 | 0.004 |
| 14944 | 0.004 |
| 14945 | 0.004 |
| 14946 | 0.004 |
| 14947 | 0.004 |
| 14948 | 0.005 |
| 14949 | 0.005 |
| 14950 | 0.005 |
| 14951 | 0.005 |
| 14952 | 0.005 |
| 14953 | 0.004 |
| 14954 | 0.004 |
| 14955 | 0.005 |
| 14956 | 0.005 |
| 14957 | 0.005 |
| 14958 | 0.005 |
| 14959 | 0.005 |
| 14960 | 0.004 |
| 14961 | 0.004 |
| 14962 | 0.004 |
| 14963 | 0.004 |
| 14964 | 0.004 |
| 14965 | 0.004 |
| 14966 | 0.004 |
| 14967 | 0.004 |
| 14968 | 0.004 |
| 14969 | 0.004 |
| 14970 | 0.004 |
| 14971 | 0.004 |
| 14972 | 0.004 |
| 14973 | 0.004 |
| 14974 | 0.004 |
| 14975 | 0.004 |
| 14976 | 0.005 |
| 14977 | 0.004 |
| 14978 | 0.004 |
| 14979 | 0.004 |
| 14980 | 0.004 |
| 14981 | 0.004 |
| 14982 | 0.005 |
| 14983 | 0.004 |
| 14984 | 0.004 |
| 14985 | 0.004 |
| 14986 | 0.004 |
| 14987 | 0.004 |
| 14988 | 0.004 |
| 14989 | 0.004 |
| 14990 | 0.004 |
| 14991 | 0.004 |
| 14992 | 0.004 |
| 14993 | 0.004 |
| 14994 | 0.005 |
| 14995 | 0.004 |
| 14996 | 0.004 |
| 14997 | 0.004 |
| 14998 | 0.004 |
| 14999 | 0.004 |
| 15000 | 0.004 |
| 15001 | 0.004 |
| 15002 | 0.004 |
| 15003 | 0.004 |
| 15004 | 0.005 |
| 15005 | 0.005 |
| 15006 | 0.005 |
| 15007 | 0.005 |
| 15008 | 0.005 |
| 15009 | 0.005 |
| 15010 | 0.005 |
| 15011 | 0.005 |
| 15012 | 0.005 |
| 15013 | 0.005 |
| 15014 | 0.005 |
| 15015 | 0.005 |
| 15016 | 0.005 |
| 15017 | 0.004 |
| 15018 | 0.005 |
| 15019 | 0.005 |
| 15020 | 0.005 |
| 15021 | 0.005 |
| 15022 | 0.005 |
| 15023 | 0.004 |
| 15024 | 0.005 |
| 15025 | 0.004 |
| 15026 | 0.004 |
| 15027 | 0.004 |
| 15028 | 0.004 |
| 15029 | 0.004 |
| 15030 | 0.004 |
| 15031 | 0.005 |
| 15032 | 0.005 |
| 15033 | 0.004 |
| 15034 | 0.004 |
| 15035 | 0.004 |
| 15036 | 0.004 |
| 15037 | 0.004 |
| 15038 | 0.005 |
| 15039 | 0.005 |
| 15040 | 0.005 |
| 15041 | 0.005 |
| 15042 | 0.004 |
| 15043 | 0.004 |
| 15044 | 0.004 |
| 15045 | 0.004 |
| 15046 | 0.004 |
| 15047 | 0.004 |
| 15048 | 0.004 |
| 15049 | 0.004 |
| 15050 | 0.004 |
| 15051 | 0.004 |
| 15052 | 0.004 |
| 15053 | 0.004 |
| 15054 | 0.004 |
| 15055 | 0.004 |
| 15056 | 0.004 |
| 15057 | 0.004 |
| 15058 | 0.004 |
| 15059 | 0.004 |
| 15060 | 0.004 |
| 15061 | 0.004 |
| 15062 | 0.004 |
| 15063 | 0.004 |
| 15064 | 0.005 |
| 15065 | 0.005 |
| 15066 | 0.004 |
| 15067 | 0.004 |
| 15068 | 0.004 |
| 15069 | 0.004 |
| 15070 | 0.004 |
| 15071 | 0.004 |
| 15072 | 0.004 |
| 15073 | 0.004 |
| 15074 | 0.004 |
| 15075 | 0.004 |
| 15076 | 0.004 |
| 15077 | 0.004 |
| 15078 | 0.004 |
| 15079 | 0.004 |
| 15080 | 0.004 |
| 15081 | 0.004 |
| 15082 | 0.005 |
| 15083 | 0.005 |
| 15084 | 0.005 |
| 15085 | 0.005 |
| 15086 | 0.005 |
| 15087 | 0.005 |
| 15088 | 0.005 |
| 15089 | 0.004 |
| 15090 | 0.004 |
| 15091 | 0.005 |
| 15092 | 0.005 |
| 15093 | 0.005 |
| 15094 | 0.005 |
| 15095 | 0.005 |
| 15096 | 0.005 |
| 15097 | 0.004 |
| 15098 | 0.004 |
| 15099 | 0.005 |
| 15100 | 0.005 |
| 15101 | 0.005 |
| 15102 | 0.005 |
| 15103 | 0.005 |
| 15104 | 0.004 |
| 15105 | 0.004 |
| 15106 | 0.005 |
| 15107 | 0.005 |
| 15108 | 0.005 |
| 15109 | 0.005 |
| 15110 | 0.005 |
| 15111 | 0.004 |
| 15112 | 0.004 |
| 15113 | 0.005 |
| 15114 | 0.004 |
| 15115 | 0.004 |
| 15116 | 0.005 |
| 15117 | 0.005 |
| 15118 | 0.004 |
| 15119 | 0.004 |
| 15120 | 0.004 |
| 15121 | 0.004 |
| 15122 | 0.004 |
| 15123 | 0.004 |
| 15124 | 0.005 |
| 15125 | 0.004 |
| 15126 | 0.004 |
| 15127 | 0.004 |
| 15128 | 0.004 |
| 15129 | 0.004 |
| 15130 | 0.004 |
| 15131 | 0.004 |
| 15132 | 0.005 |
| 15133 | 0.005 |
| 15134 | 0.004 |
| 15135 | 0.004 |
| 15136 | 0.004 |
| 15137 | 0.004 |
| 15138 | 0.004 |
| 15139 | 0.004 |
| 15140 | 0.004 |
| 15141 | 0.005 |
| 15142 | 0.004 |
| 15143 | 0.004 |
| 15144 | 0.004 |
| 15145 | 0.004 |
| 15146 | 0.004 |
| 15147 | 0.004 |
| 15148 | 0.004 |
| 15149 | 0.004 |
| 15150 | 0.004 |
| 15151 | 0.004 |
| 15152 | 0.004 |
| 15153 | 0.004 |
| 15154 | 0.004 |
| 15155 | 0.004 |
| 15156 | 0.004 |
| 15157 | 0.004 |
| 15158 | 0.004 |
| 15159 | 0.004 |
| 15160 | 0.005 |
| 15161 | 0.005 |
| 15162 | 0.005 |
| 15163 | 0.005 |
| 15164 | 0.005 |
| 15165 | 0.005 |
| 15166 | 0.005 |
| 15167 | 0.005 |
| 15168 | 0.005 |
| 15169 | 0.005 |
| 15170 | 0.005 |
| 15171 | 0.005 |
| 15172 | 0.005 |
| 15173 | 0.005 |
| 15174 | 0.005 |
| 15175 | 0.004 |
| 15176 | 0.004 |
| 15177 | 0.005 |
| 15178 | 0.005 |
| 15179 | 0.005 |
| 15180 | 0.005 |
| 15181 | 0.005 |
| 15182 | 0.005 |
| 15183 | 0.004 |
| 15184 | 0.004 |
| 15185 | 0.004 |
| 15186 | 0.005 |
| 15187 | 0.005 |
| 15188 | 0.005 |
| 15189 | 0.005 |
| 15190 | 0.005 |
| 15191 | 0.004 |
| 15192 | 0.004 |
| 15193 | 0.005 |
| 15194 | 0.004 |
| 15195 | 0.004 |
| 15196 | 0.005 |
| 15197 | 0.005 |
| 15198 | 0.005 |
| 15199 | 0.004 |
| 15200 | 0.004 |
| 15201 | 0.004 |
| 15202 | 0.004 |
| 15203 | 0.004 |
| 15204 | 0.004 |
| 15205 | 0.005 |
| 15206 | 0.005 |
| 15207 | 0.004 |
| 15208 | 0.004 |
| 15209 | 0.004 |
| 15210 | 0.004 |
| 15211 | 0.004 |
| 15212 | 0.004 |
| 15213 | 0.004 |
| 15214 | 0.004 |
| 15215 | 0.004 |
| 15216 | 0.004 |
| 15217 | 0.004 |
| 15218 | 0.004 |
| 15219 | 0.004 |
| 15220 | 0.004 |
| 15221 | 0.004 |
| 15222 | 0.005 |
| 15223 | 0.004 |
| 15224 | 0.005 |
| 15225 | 0.004 |
| 15226 | 0.004 |
| 15227 | 0.004 |
| 15228 | 0.004 |
| 15229 | 0.004 |
| 15230 | 0.005 |
| 15231 | 0.004 |
| 15232 | 0.004 |
| 15233 | 0.004 |
| 15234 | 0.004 |
| 15235 | 0.004 |
| 15236 | 0.004 |
| 15237 | 0.004 |
| 15238 | 0.004 |
| 15239 | 0.004 |
| 15240 | 0.004 |
| 15241 | 0.005 |
| 15242 | 0.004 |
| 15243 | 0.004 |
| 15244 | 0.005 |
| 15245 | 0.005 |
| 15246 | 0.005 |
| 15247 | 0.005 |
| 15248 | 0.005 |
| 15249 | 0.005 |
| 15250 | 0.005 |
| 15251 | 0.005 |
| 15252 | 0.005 |
| 15253 | 0.005 |
| 15254 | 0.005 |
| 15255 | 0.005 |
| 15256 | 0.005 |
| 15257 | 0.004 |
| 15258 | 0.005 |
| 15259 | 0.005 |
| 15260 | 0.005 |
| 15261 | 0.005 |
| 15262 | 0.005 |
| 15263 | 0.004 |
| 15264 | 0.004 |
| 15265 | 0.004 |
| 15266 | 0.004 |
| 15267 | 0.004 |
| 15268 | 0.004 |
| 15269 | 0.005 |
| 15270 | 0.005 |
| 15271 | 0.004 |
| 15272 | 0.004 |
| 15273 | 0.005 |
| 15274 | 0.004 |
| 15275 | 0.004 |
| 15276 | 0.005 |
| 15277 | 0.005 |
| 15278 | 0.005 |
| 15279 | 0.005 |
| 15280 | 0.004 |
| 15281 | 0.004 |
| 15282 | 0.004 |
| 15283 | 0.004 |
| 15284 | 0.004 |
| 15285 | 0.004 |
| 15286 | 0.004 |
| 15287 | 0.004 |
| 15288 | 0.004 |
| 15289 | 0.004 |
| 15290 | 0.004 |
| 15291 | 0.004 |
| 15292 | 0.004 |
| 15293 | 0.004 |
| 15294 | 0.004 |
| 15295 | 0.004 |
| 15296 | 0.004 |
| 15297 | 0.004 |
| 15298 | 0.004 |
| 15299 | 0.004 |
| 15300 | 0.004 |
| 15301 | 0.004 |
| 15302 | 0.005 |
| 15303 | 0.005 |
| 15304 | 0.005 |
| 15305 | 0.004 |
| 15306 | 0.004 |
| 15307 | 0.004 |
| 15308 | 0.004 |
| 15309 | 0.004 |
| 15310 | 0.004 |
| 15311 | 0.004 |
| 15312 | 0.004 |
| 15313 | 0.004 |
| 15314 | 0.004 |
| 15315 | 0.004 |
| 15316 | 0.004 |
| 15317 | 0.004 |
| 15318 | 0.004 |
| 15319 | 0.004 |
| 15320 | 0.004 |
| 15321 | 0.004 |
| 15322 | 0.004 |
| 15323 | 0.004 |
| 15324 | 0.005 |
| 15325 | 0.005 |
| 15326 | 0.005 |
| 15327 | 0.005 |
| 15328 | 0.005 |
| 15329 | 0.005 |
| 15330 | 0.005 |
| 15331 | 0.005 |
| 15332 | 0.005 |
| 15333 | 0.005 |
| 15334 | 0.005 |
| 15335 | 0.005 |
| 15336 | 0.005 |
| 15337 | 0.004 |
| 15338 | 0.005 |
| 15339 | 0.005 |
| 15340 | 0.004 |
| 15341 | 0.004 |
| 15342 | 0.005 |
| 15343 | 0.004 |
| 15344 | 0.004 |
| 15345 | 0.004 |
| 15346 | 0.004 |
| 15347 | 0.004 |
| 15348 | 0.005 |
| 15349 | 0.005 |
| 15350 | 0.005 |
| 15351 | 0.005 |
| 15352 | 0.005 |
| 15353 | 0.004 |
| 15354 | 0.004 |
| 15355 | 0.004 |
| 15356 | 0.005 |
| 15357 | 0.005 |
| 15358 | 0.005 |
| 15359 | 0.005 |
| 15360 | 0.004 |
| 15361 | 0.004 |
| 15362 | 0.004 |
| 15363 | 0.004 |
| 15364 | 0.004 |
| 15365 | 0.004 |
| 15366 | 0.004 |
| 15367 | 0.004 |
| 15368 | 0.004 |
| 15369 | 0.004 |
| 15370 | 0.004 |
| 15371 | 0.004 |
| 15372 | 0.004 |
| 15373 | 0.004 |
| 15374 | 0.004 |
| 15375 | 0.004 |
| 15376 | 0.004 |
| 15377 | 0.004 |
| 15378 | 0.004 |
| 15379 | 0.004 |
| 15380 | 0.004 |
| 15381 | 0.004 |
| 15382 | 0.004 |
| 15383 | 0.004 |
| 15384 | 0.004 |
| 15385 | 0.004 |
| 15386 | 0.004 |
| 15387 | 0.004 |
| 15388 | 0.004 |
| 15389 | 0.004 |
| 15390 | 0.004 |
| 15391 | 0.004 |
| 15392 | 0.004 |
| 15393 | 0.004 |
| 15394 | 0.004 |
| 15395 | 0.004 |
| 15396 | 0.004 |
| 15397 | 0.004 |
| 15398 | 0.004 |
| 15399 | 0.004 |
| 15400 | 0.004 |
| 15401 | 0.004 |
| 15402 | 0.005 |
| 15403 | 0.004 |
| 15404 | 0.004 |
| 15405 | 0.005 |
| 15406 | 0.005 |
| 15407 | 0.005 |
| 15408 | 0.005 |
| 15409 | 0.005 |
| 15410 | 0.005 |
| 15411 | 0.005 |
| 15412 | 0.005 |
| 15413 | 0.005 |
| 15414 | 0.005 |
| 15415 | 0.005 |
| 15416 | 0.005 |
| 15417 | 0.005 |
| 15418 | 0.005 |
| 15419 | 0.004 |
| 15420 | 0.004 |
| 15421 | 0.004 |
| 15422 | 0.004 |
| 15423 | 0.004 |
| 15424 | 0.004 |
| 15425 | 0.005 |
| 15426 | 0.005 |
| 15427 | 0.004 |
| 15428 | 0.005 |
| 15429 | 0.005 |
| 15430 | 0.004 |
| 15431 | 0.004 |
| 15432 | 0.004 |
| 15433 | 0.004 |
| 15434 | 0.004 |
| 15435 | 0.004 |
| 15436 | 0.005 |
| 15437 | 0.005 |
| 15438 | 0.004 |
| 15439 | 0.004 |
| 15440 | 0.004 |
| 15441 | 0.004 |
| 15442 | 0.004 |
| 15443 | 0.004 |
| 15444 | 0.004 |
| 15445 | 0.004 |
| 15446 | 0.004 |
| 15447 | 0.004 |
| 15448 | 0.004 |
| 15449 | 0.004 |
| 15450 | 0.004 |
| 15451 | 0.004 |
| 15452 | 0.004 |
| 15453 | 0.004 |
| 15454 | 0.004 |
| 15455 | 0.004 |
| 15456 | 0.004 |
| 15457 | 0.004 |
| 15458 | 0.004 |
| 15459 | 0.004 |
| 15460 | 0.005 |
| 15461 | 0.004 |
| 15462 | 0.004 |
| 15463 | 0.004 |
| 15464 | 0.004 |
| 15465 | 0.004 |
| 15466 | 0.004 |
| 15467 | 0.004 |
| 15468 | 0.004 |
| 15469 | 0.004 |
| 15470 | 0.004 |
| 15471 | 0.004 |
| 15472 | 0.004 |
| 15473 | 0.004 |
| 15474 | 0.004 |
| 15475 | 0.004 |
| 15476 | 0.004 |
| 15477 | 0.004 |
| 15478 | 0.004 |
| 15479 | 0.004 |
| 15480 | 0.004 |
| 15481 | 0.004 |
| 15482 | 0.004 |
| 15483 | 0.004 |
| 15484 | 0.004 |
| 15485 | 0.005 |
| 15486 | 0.004 |
| 15487 | 0.005 |
| 15488 | 0.005 |
| 15489 | 0.005 |
| 15490 | 0.005 |
| 15491 | 0.005 |
| 15492 | 0.005 |
| 15493 | 0.005 |
| 15494 | 0.005 |
| 15495 | 0.004 |
| 15496 | 0.004 |
| 15497 | 0.004 |
| 15498 | 0.004 |
| 15499 | 0.004 |
| 15500 | 0.004 |
| 15501 | 0.004 |
| 15502 | 0.004 |
| 15503 | 0.004 |
| 15504 | 0.004 |
| 15505 | 0.004 |
| 15506 | 0.005 |
| 15507 | 0.005 |
| 15508 | 0.004 |
| 15509 | 0.004 |
| 15510 | 0.005 |
| 15511 | 0.004 |
| 15512 | 0.004 |
| 15513 | 0.005 |
| 15514 | 0.004 |
| 15515 | 0.004 |
| 15516 | 0.004 |
| 15517 | 0.004 |
| 15518 | 0.004 |
| 15519 | 0.004 |
| 15520 | 0.004 |
| 15521 | 0.004 |
| 15522 | 0.004 |
| 15523 | 0.004 |
| 15524 | 0.004 |
| 15525 | 0.004 |
| 15526 | 0.004 |
| 15527 | 0.004 |
| 15528 | 0.004 |
| 15529 | 0.004 |
| 15530 | 0.004 |
| 15531 | 0.004 |
| 15532 | 0.004 |
| 15533 | 0.004 |
| 15534 | 0.004 |
| 15535 | 0.004 |
| 15536 | 0.004 |
| 15537 | 0.004 |
| 15538 | 0.004 |
| 15539 | 0.004 |
| 15540 | 0.004 |
| 15541 | 0.004 |
| 15542 | 0.004 |
| 15543 | 0.004 |
| 15544 | 0.004 |
| 15545 | 0.004 |
| 15546 | 0.004 |
| 15547 | 0.004 |
| 15548 | 0.004 |
| 15549 | 0.004 |
| 15550 | 0.004 |
| 15551 | 0.004 |
| 15552 | 0.004 |
| 15553 | 0.004 |
| 15554 | 0.004 |
| 15555 | 0.004 |
| 15556 | 0.004 |
| 15557 | 0.004 |
| 15558 | 0.004 |
| 15559 | 0.005 |
| 15560 | 0.004 |
| 15561 | 0.004 |
| 15562 | 0.004 |
| 15563 | 0.004 |
| 15564 | 0.004 |
| 15565 | 0.004 |
| 15566 | 0.004 |
| 15567 | 0.005 |
| 15568 | 0.005 |
| 15569 | 0.005 |
| 15570 | 0.004 |
| 15571 | 0.004 |
| 15572 | 0.004 |
| 15573 | 0.004 |
| 15574 | 0.004 |
| 15575 | 0.005 |
| 15576 | 0.005 |
| 15577 | 0.005 |
| 15578 | 0.004 |
| 15579 | 0.004 |
| 15580 | 0.004 |
| 15581 | 0.004 |
| 15582 | 0.004 |
| 15583 | 0.004 |
| 15584 | 0.004 |
| 15585 | 0.004 |
| 15586 | 0.004 |
| 15587 | 0.004 |
| 15588 | 0.004 |
| 15589 | 0.005 |
| 15590 | 0.004 |
| 15591 | 0.004 |
| 15592 | 0.004 |
| 15593 | 0.004 |
| 15594 | 0.004 |
| 15595 | 0.004 |
| 15596 | 0.004 |
| 15597 | 0.004 |
| 15598 | 0.004 |
| 15599 | 0.004 |
| 15600 | 0.004 |
| 15601 | 0.004 |
| 15602 | 0.004 |
| 15603 | 0.004 |
| 15604 | 0.004 |
| 15605 | 0.004 |
| 15606 | 0.005 |
| 15607 | 0.004 |
| 15608 | 0.004 |
| 15609 | 0.004 |
| 15610 | 0.004 |
| 15611 | 0.004 |
| 15612 | 0.004 |
| 15613 | 0.004 |
| 15614 | 0.004 |
| 15615 | 0.004 |
| 15616 | 0.004 |
| 15617 | 0.004 |
| 15618 | 0.004 |
| 15619 | 0.004 |
| 15620 | 0.004 |
| 15621 | 0.004 |
| 15622 | 0.004 |
| 15623 | 0.004 |
| 15624 | 0.004 |
| 15625 | 0.004 |
| 15626 | 0.004 |
| 15627 | 0.004 |
| 15628 | 0.004 |
| 15629 | 0.004 |
| 15630 | 0.004 |
| 15631 | 0.004 |
| 15632 | 0.004 |
| 15633 | 0.004 |
| 15634 | 0.004 |
| 15635 | 0.004 |
| 15636 | 0.004 |
| 15637 | 0.004 |
| 15638 | 0.004 |
| 15639 | 0.004 |
| 15640 | 0.004 |
| 15641 | 0.004 |
| 15642 | 0.004 |
| 15643 | 0.004 |
| 15644 | 0.005 |
| 15645 | 0.005 |
| 15646 | 0.005 |
| 15647 | 0.005 |
| 15648 | 0.005 |
| 15649 | 0.004 |
| 15650 | 0.004 |
| 15651 | 0.004 |
| 15652 | 0.004 |
| 15653 | 0.004 |
| 15654 | 0.004 |
| 15655 | 0.004 |
| 15656 | 0.005 |
| 15657 | 0.005 |
| 15658 | 0.005 |
| 15659 | 0.004 |
| 15660 | 0.004 |
| 15661 | 0.004 |
| 15662 | 0.004 |
| 15663 | 0.004 |
| 15664 | 0.004 |
| 15665 | 0.004 |
| 15666 | 0.004 |
| 15667 | 0.004 |
| 15668 | 0.004 |
| 15669 | 0.004 |
| 15670 | 0.004 |
| 15671 | 0.004 |
| 15672 | 0.004 |
| 15673 | 0.004 |
| 15674 | 0.004 |
| 15675 | 0.004 |
| 15676 | 0.004 |
| 15677 | 0.004 |
| 15678 | 0.004 |
| 15679 | 0.004 |
| 15680 | 0.004 |
| 15681 | 0.004 |
| 15682 | 0.004 |
| 15683 | 0.004 |
| 15684 | 0.004 |
| 15685 | 0.004 |
| 15686 | 0.004 |
| 15687 | 0.004 |
| 15688 | 0.004 |
| 15689 | 0.004 |
| 15690 | 0.004 |
| 15691 | 0.004 |
| 15692 | 0.004 |
| 15693 | 0.004 |
| 15694 | 0.004 |
| 15695 | 0.004 |
| 15696 | 0.004 |
| 15697 | 0.004 |
| 15698 | 0.004 |
| 15699 | 0.004 |
| 15700 | 0.004 |
| 15701 | 0.004 |
| 15702 | 0.004 |
| 15703 | 0.004 |
| 15704 | 0.004 |
| 15705 | 0.004 |
| 15706 | 0.004 |
| 15707 | 0.004 |
| 15708 | 0.004 |
| 15709 | 0.004 |
| 15710 | 0.004 |
| 15711 | 0.004 |
| 15712 | 0.004 |
| 15713 | 0.004 |
| 15714 | 0.004 |
| 15715 | 0.004 |
| 15716 | 0.004 |
| 15717 | 0.004 |
| 15718 | 0.004 |
| 15719 | 0.004 |
| 15720 | 0.004 |
| 15721 | 0.004 |
| 15722 | 0.004 |
| 15723 | 0.004 |
| 15724 | 0.004 |
| 15725 | 0.005 |
| 15726 | 0.005 |
| 15727 | 0.005 |
| 15728 | 0.005 |
| 15729 | 0.004 |
| 15730 | 0.004 |
| 15731 | 0.004 |
| 15732 | 0.004 |
| 15733 | 0.004 |
| 15734 | 0.004 |
| 15735 | 0.004 |
| 15736 | 0.004 |
| 15737 | 0.004 |
| 15738 | 0.004 |
| 15739 | 0.004 |
| 15740 | 0.004 |
| 15741 | 0.004 |
| 15742 | 0.004 |
| 15743 | 0.004 |
| 15744 | 0.004 |
| 15745 | 0.004 |
| 15746 | 0.004 |
| 15747 | 0.004 |
| 15748 | 0.004 |
| 15749 | 0.004 |
| 15750 | 0.004 |
| 15751 | 0.004 |
| 15752 | 0.004 |
| 15753 | 0.004 |
| 15754 | 0.004 |
| 15755 | 0.004 |
| 15756 | 0.004 |
| 15757 | 0.004 |
| 15758 | 0.004 |
| 15759 | 0.004 |
| 15760 | 0.004 |
| 15761 | 0.004 |
| 15762 | 0.004 |
| 15763 | 0.004 |
| 15764 | 0.004 |
| 15765 | 0.004 |
| 15766 | 0.004 |
| 15767 | 0.004 |
| 15768 | 0.004 |
| 15769 | 0.004 |
| 15770 | 0.004 |
| 15771 | 0.004 |
| 15772 | 0.004 |
| 15773 | 0.004 |
| 15774 | 0.004 |
| 15775 | 0.004 |
| 15776 | 0.004 |
| 15777 | 0.004 |
| 15778 | 0.004 |
| 15779 | 0.004 |
| 15780 | 0.004 |
| 15781 | 0.004 |
| 15782 | 0.004 |
| 15783 | 0.004 |
| 15784 | 0.004 |
| 15785 | 0.004 |
| 15786 | 0.004 |
| 15787 | 0.004 |
| 15788 | 0.004 |
| 15789 | 0.004 |
| 15790 | 0.004 |
| 15791 | 0.004 |
| 15792 | 0.004 |
| 15793 | 0.004 |
| 15794 | 0.004 |
| 15795 | 0.004 |
| 15796 | 0.004 |
| 15797 | 0.004 |
| 15798 | 0.004 |
| 15799 | 0.004 |
| 15800 | 0.004 |
| 15801 | 0.004 |
| 15802 | 0.004 |
| 15803 | 0.004 |
| 15804 | 0.004 |
| 15805 | 0.004 |
| 15806 | 0.004 |
| 15807 | 0.005 |
| 15808 | 0.004 |
| 15809 | 0.004 |
| 15810 | 0.004 |
| 15811 | 0.004 |
| 15812 | 0.004 |
| 15813 | 0.004 |
| 15814 | 0.004 |
| 15815 | 0.004 |
| 15816 | 0.004 |
| 15817 | 0.004 |
| 15818 | 0.004 |
| 15819 | 0.004 |
| 15820 | 0.004 |
| 15821 | 0.004 |
| 15822 | 0.004 |
| 15823 | 0.004 |
| 15824 | 0.004 |
| 15825 | 0.004 |
| 15826 | 0.004 |
| 15827 | 0.004 |
| 15828 | 0.004 |
| 15829 | 0.004 |
| 15830 | 0.004 |
| 15831 | 0.004 |
| 15832 | 0.004 |
| 15833 | 0.004 |
| 15834 | 0.004 |
| 15835 | 0.004 |
| 15836 | 0.004 |
| 15837 | 0.004 |
| 15838 | 0.004 |
| 15839 | 0.004 |
| 15840 | 0.004 |
| 15841 | 0.004 |
| 15842 | 0.004 |
| 15843 | 0.004 |
| 15844 | 0.004 |
| 15845 | 0.004 |
| 15846 | 0.004 |
| 15847 | 0.004 |
| 15848 | 0.004 |
| 15849 | 0.004 |
| 15850 | 0.004 |
| 15851 | 0.004 |
| 15852 | 0.004 |
| 15853 | 0.004 |
| 15854 | 0.004 |
| 15855 | 0.004 |
| 15856 | 0.004 |
| 15857 | 0.004 |
| 15858 | 0.004 |
| 15859 | 0.004 |
| 15860 | 0.004 |
| 15861 | 0.004 |
| 15862 | 0.004 |
| 15863 | 0.004 |
| 15864 | 0.004 |
| 15865 | 0.004 |
| 15866 | 0.004 |
| 15867 | 0.004 |
| 15868 | 0.004 |
| 15869 | 0.004 |
| 15870 | 0.004 |
| 15871 | 0.004 |
| 15872 | 0.004 |
| 15873 | 0.004 |
| 15874 | 0.004 |
| 15875 | 0.004 |
| 15876 | 0.004 |
| 15877 | 0.004 |
| 15878 | 0.004 |
| 15879 | 0.004 |
| 15880 | 0.004 |
| 15881 | 0.004 |
| 15882 | 0.004 |
| 15883 | 0.005 |
| 15884 | 0.004 |
| 15885 | 0.004 |
| 15886 | 0.004 |
| 15887 | 0.004 |
| 15888 | 0.004 |
| 15889 | 0.004 |
| 15890 | 0.004 |
| 15891 | 0.004 |
| 15892 | 0.004 |
| 15893 | 0.004 |
| 15894 | 0.004 |
| 15895 | 0.004 |
| 15896 | 0.004 |
| 15897 | 0.004 |
| 15898 | 0.004 |
| 15899 | 0.004 |
| 15900 | 0.004 |
| 15901 | 0.004 |
| 15902 | 0.004 |
| 15903 | 0.004 |
| 15904 | 0.004 |
| 15905 | 0.004 |
| 15906 | 0.004 |
| 15907 | 0.004 |
| 15908 | 0.004 |
| 15909 | 0.004 |
| 15910 | 0.004 |
| 15911 | 0.004 |
| 15912 | 0.004 |
| 15913 | 0.004 |
| 15914 | 0.004 |
| 15915 | 0.004 |
| 15916 | 0.004 |
| 15917 | 0.004 |
| 15918 | 0.004 |
| 15919 | 0.004 |
| 15920 | 0.004 |
| 15921 | 0.004 |
| 15922 | 0.004 |
| 15923 | 0.004 |
| 15924 | 0.004 |
| 15925 | 0.004 |
| 15926 | 0.004 |
| 15927 | 0.004 |
| 15928 | 0.004 |
| 15929 | 0.004 |
| 15930 | 0.004 |
| 15931 | 0.004 |
| 15932 | 0.004 |
| 15933 | 0.004 |
| 15934 | 0.004 |
| 15935 | 0.004 |
| 15936 | 0.004 |
| 15937 | 0.004 |
| 15938 | 0.004 |
| 15939 | 0.004 |
| 15940 | 0.004 |
| 15941 | 0.004 |
| 15942 | 0.004 |
| 15943 | 0.004 |
| 15944 | 0.004 |
| 15945 | 0.004 |
| 15946 | 0.004 |
| 15947 | 0.004 |
| 15948 | 0.004 |
| 15949 | 0.004 |
| 15950 | 0.004 |
| 15951 | 0.004 |
| 15952 | 0.004 |
| 15953 | 0.004 |
| 15954 | 0.004 |
| 15955 | 0.004 |
| 15956 | 0.004 |
| 15957 | 0.004 |
| 15958 | 0.004 |
| 15959 | 0.004 |
| 15960 | 0.004 |
| 15961 | 0.004 |
| 15962 | 0.004 |
| 15963 | 0.004 |
| 15964 | 0.004 |
| 15965 | 0.004 |
| 15966 | 0.004 |
| 15967 | 0.004 |
| 15968 | 0.004 |
| 15969 | 0.004 |
| 15970 | 0.004 |
| 15971 | 0.004 |
| 15972 | 0.004 |
| 15973 | 0.004 |
| 15974 | 0.004 |
| 15975 | 0.004 |
| 15976 | 0.004 |
| 15977 | 0.004 |
| 15978 | 0.004 |
| 15979 | 0.004 |
| 15980 | 0.004 |
| 15981 | 0.004 |
| 15982 | 0.004 |
| 15983 | 0.004 |
| 15984 | 0.004 |
| 15985 | 0.004 |
| 15986 | 0.004 |
| 15987 | 0.004 |
| 15988 | 0.004 |
| 15989 | 0.004 |
| 15990 | 0.004 |
| 15991 | 0.004 |
| 15992 | 0.004 |
| 15993 | 0.004 |
| 15994 | 0.004 |
| 15995 | 0.004 |
| 15996 | 0.004 |
| 15997 | 0.004 |
| 15998 | 0.004 |
| 15999 | 0.004 |
| 16000 | 0.004 |
| 16001 | 0.004 |
| 16002 | 0.004 |
| 16003 | 0.004 |
| 16004 | 0.004 |
| 16005 | 0.004 |
| 16006 | 0.004 |
| 16007 | 0.004 |
| 16008 | 0.004 |
| 16009 | 0.004 |
| 16010 | 0.004 |
| 16011 | 0.004 |
| 16012 | 0.004 |
| 16013 | 0.004 |
| 16014 | 0.004 |
| 16015 | 0.004 |
| 16016 | 0.004 |
| 16017 | 0.004 |
| 16018 | 0.004 |
| 16019 | 0.004 |
| 16020 | 0.004 |
| 16021 | 0.004 |
| 16022 | 0.004 |
| 16023 | 0.004 |
| 16024 | 0.004 |
| 16025 | 0.004 |
| 16026 | 0.004 |
| 16027 | 0.004 |
| 16028 | 0.004 |
| 16029 | 0.004 |
| 16030 | 0.004 |
| 16031 | 0.004 |
| 16032 | 0.004 |
| 16033 | 0.004 |
| 16034 | 0.004 |
| 16035 | 0.004 |
| 16036 | 0.004 |
| 16037 | 0.004 |
| 16038 | 0.004 |
| 16039 | 0.004 |
| 16040 | 0.004 |
| 16041 | 0.004 |
| 16042 | 0.004 |
| 16043 | 0.004 |
| 16044 | 0.004 |
| 16045 | 0.004 |
| 16046 | 0.004 |
| 16047 | 0.004 |
| 16048 | 0.004 |
| 16049 | 0.004 |
| 16050 | 0.004 |
| 16051 | 0.004 |
| 16052 | 0.004 |
| 16053 | 0.004 |
| 16054 | 0.004 |
| 16055 | 0.004 |
| 16056 | 0.004 |
| 16057 | 0.004 |
| 16058 | 0.004 |
| 16059 | 0.004 |
| 16060 | 0.004 |
| 16061 | 0.004 |
| 16062 | 0.004 |
| 16063 | 0.004 |
| 16064 | 0.004 |
| 16065 | 0.004 |
| 16066 | 0.004 |
| 16067 | 0.004 |
| 16068 | 0.004 |
| 16069 | 0.004 |
| 16070 | 0.004 |
| 16071 | 0.004 |
| 16072 | 0.004 |
| 16073 | 0.004 |
| 16074 | 0.004 |
| 16075 | 0.004 |
| 16076 | 0.004 |
| 16077 | 0.004 |
| 16078 | 0.004 |
| 16079 | 0.004 |
| 16080 | 0.004 |
| 16081 | 0.004 |
| 16082 | 0.004 |
| 16083 | 0.004 |
| 16084 | 0.004 |
| 16085 | 0.004 |
| 16086 | 0.004 |
| 16087 | 0.004 |
| 16088 | 0.004 |
| 16089 | 0.004 |
| 16090 | 0.004 |
| 16091 | 0.004 |
| 16092 | 0.004 |
| 16093 | 0.004 |
| 16094 | 0.004 |
| 16095 | 0.004 |
| 16096 | 0.004 |
| 16097 | 0.004 |
| 16098 | 0.004 |
| 16099 | 0.004 |
| 16100 | 0.004 |
| 16101 | 0.004 |
| 16102 | 0.004 |
| 16103 | 0.004 |
| 16104 | 0.004 |
| 16105 | 0.004 |
| 16106 | 0.004 |
| 16107 | 0.004 |
| 16108 | 0.004 |
| 16109 | 0.004 |
| 16110 | 0.004 |
| 16111 | 0.004 |
| 16112 | 0.004 |
| 16113 | 0.004 |
| 16114 | 0.004 |
| 16115 | 0.004 |
| 16116 | 0.004 |
| 16117 | 0.004 |
| 16118 | 0.004 |
| 16119 | 0.004 |
| 16120 | 0.004 |
| 16121 | 0.004 |
| 16122 | 0.004 |
| 16123 | 0.004 |
| 16124 | 0.004 |
| 16125 | 0.004 |
| 16126 | 0.004 |
| 16127 | 0.004 |
| 16128 | 0.004 |
| 16129 | 0.004 |
| 16130 | 0.004 |
| 16131 | 0.004 |
| 16132 | 0.004 |
| 16133 | 0.004 |
| 16134 | 0.004 |
| 16135 | 0.004 |
| 16136 | 0.004 |
| 16137 | 0.004 |
| 16138 | 0.004 |
| 16139 | 0.004 |
| 16140 | 0.004 |
| 16141 | 0.004 |
| 16142 | 0.004 |
| 16143 | 0.004 |
| 16144 | 0.004 |
| 16145 | 0.004 |
| 16146 | 0.004 |
| 16147 | 0.004 |
| 16148 | 0.004 |
| 16149 | 0.004 |
| 16150 | 0.004 |
| 16151 | 0.004 |
| 16152 | 0.004 |
| 16153 | 0.004 |
| 16154 | 0.004 |
| 16155 | 0.004 |
| 16156 | 0.004 |
| 16157 | 0.004 |
| 16158 | 0.004 |
| 16159 | 0.004 |
| 16160 | 0.004 |
| 16161 | 0.004 |
| 16162 | 0.004 |
| 16163 | 0.004 |
| 16164 | 0.004 |
| 16165 | 0.004 |
| 16166 | 0.004 |
| 16167 | 0.004 |
| 16168 | 0.004 |
| 16169 | 0.004 |
| 16170 | 0.004 |
| 16171 | 0.004 |
| 16172 | 0.004 |
| 16173 | 0.004 |
| 16174 | 0.004 |
| 16175 | 0.004 |
| 16176 | 0.004 |
| 16177 | 0.004 |
| 16178 | 0.004 |
| 16179 | 0.004 |
| 16180 | 0.004 |
| 16181 | 0.004 |
| 16182 | 0.004 |
| 16183 | 0.004 |
| 16184 | 0.004 |
| 16185 | 0.004 |
| 16186 | 0.004 |
| 16187 | 0.004 |
| 16188 | 0.004 |
| 16189 | 0.004 |
| 16190 | 0.004 |
| 16191 | 0.004 |
| 16192 | 0.004 |
| 16193 | 0.004 |
| 16194 | 0.004 |
| 16195 | 0.004 |
| 16196 | 0.004 |
| 16197 | 0.004 |
| 16198 | 0.004 |
| 16199 | 0.004 |
| 16200 | 0.004 |
| 16201 | 0.004 |
| 16202 | 0.004 |
| 16203 | 0.004 |
| 16204 | 0.004 |
| 16205 | 0.004 |
| 16206 | 0.004 |
| 16207 | 0.004 |
| 16208 | 0.004 |
| 16209 | 0.004 |
| 16210 | 0.004 |
| 16211 | 0.004 |
| 16212 | 0.004 |
| 16213 | 0.004 |
| 16214 | 0.004 |
| 16215 | 0.004 |
| 16216 | 0.004 |
| 16217 | 0.004 |
| 16218 | 0.004 |
| 16219 | 0.004 |
| 16220 | 0.004 |
| 16221 | 0.004 |
| 16222 | 0.004 |
| 16223 | 0.004 |
| 16224 | 0.004 |
| 16225 | 0.004 |
| 16226 | 0.004 |
| 16227 | 0.004 |
| 16228 | 0.004 |
| 16229 | 0.004 |
| 16230 | 0.004 |
| 16231 | 0.004 |
| 16232 | 0.004 |
| 16233 | 0.004 |
| 16234 | 0.004 |
| 16235 | 0.004 |
| 16236 | 0.004 |
| 16237 | 0.004 |
| 16238 | 0.004 |
| 16239 | 0.004 |
| 16240 | 0.004 |
| 16241 | 0.004 |
| 16242 | 0.004 |
| 16243 | 0.004 |
| 16244 | 0.004 |
| 16245 | 0.004 |
| 16246 | 0.004 |
| 16247 | 0.004 |
| 16248 | 0.004 |
| 16249 | 0.004 |
| 16250 | 0.004 |
| 16251 | 0.004 |
| 16252 | 0.004 |
| 16253 | 0.004 |
| 16254 | 0.004 |
| 16255 | 0.004 |
| 16256 | 0.004 |
| 16257 | 0.004 |
| 16258 | 0.004 |
| 16259 | 0.004 |
| 16260 | 0.004 |
| 16261 | 0.004 |
| 16262 | 0.004 |
| 16263 | 0.004 |
| 16264 | 0.004 |
| 16265 | 0.004 |
| 16266 | 0.004 |
| 16267 | 0.004 |
| 16268 | 0.004 |
| 16269 | 0.004 |
| 16270 | 0.004 |
| 16271 | 0.004 |
| 16272 | 0.004 |
| 16273 | 0.004 |
| 16274 | 0.004 |
| 16275 | 0.004 |
| 16276 | 0.004 |
| 16277 | 0.004 |
| 16278 | 0.004 |
| 16279 | 0.004 |
| 16280 | 0.004 |
| 16281 | 0.004 |
| 16282 | 0.004 |
| 16283 | 0.004 |
| 16284 | 0.004 |
| 16285 | 0.004 |
| 16286 | 0.004 |
| 16287 | 0.004 |
| 16288 | 0.004 |
| 16289 | 0.004 |
| 16290 | 0.004 |
| 16291 | 0.004 |
| 16292 | 0.004 |
| 16293 | 0.004 |
| 16294 | 0.004 |
| 16295 | 0.004 |
| 16296 | 0.004 |
| 16297 | 0.004 |
| 16298 | 0.004 |
| 16299 | 0.004 |
| 16300 | 0.004 |
| 16301 | 0.004 |
| 16302 | 0.004 |
| 16303 | 0.004 |
| 16304 | 0.004 |
| 16305 | 0.004 |
| 16306 | 0.004 |
| 16307 | 0.004 |
| 16308 | 0.004 |
| 16309 | 0.004 |
| 16310 | 0.004 |
| 16311 | 0.004 |
| 16312 | 0.004 |
| 16313 | 0.004 |
| 16314 | 0.004 |
| 16315 | 0.004 |
| 16316 | 0.004 |
| 16317 | 0.004 |
| 16318 | 0.004 |
| 16319 | 0.004 |
| 16320 | 0.004 |
| 16321 | 0.004 |
| 16322 | 0.004 |
| 16323 | 0.004 |
| 16324 | 0.004 |
| 16325 | 0.004 |
| 16326 | 0.004 |
| 16327 | 0.004 |
| 16328 | 0.004 |
| 16329 | 0.004 |
| 16330 | 0.004 |
| 16331 | 0.004 |
| 16332 | 0.004 |
| 16333 | 0.004 |
| 16334 | 0.004 |
| 16335 | 0.004 |
| 16336 | 0.004 |
| 16337 | 0.004 |
| 16338 | 0.004 |
| 16339 | 0.004 |
| 16340 | 0.004 |
| 16341 | 0.004 |
| 16342 | 0.004 |
| 16343 | 0.004 |
| 16344 | 0.004 |
| 16345 | 0.004 |
| 16346 | 0.004 |
| 16347 | 0.004 |
| 16348 | 0.004 |
| 16349 | 0.004 |
| 16350 | 0.004 |
| 16351 | 0.004 |
| 16352 | 0.004 |
| 16353 | 0.004 |
| 16354 | 0.004 |
| 16355 | 0.004 |
| 16356 | 0.004 |
| 16357 | 0.004 |
| 16358 | 0.004 |
| 16359 | 0.004 |
| 16360 | 0.004 |
| 16361 | 0.004 |
| 16362 | 0.004 |
| 16363 | 0.004 |
| 16364 | 0.004 |
| 16365 | 0.004 |
| 16366 | 0.004 |
| 16367 | 0.004 |
| 16368 | 0.004 |
| 16369 | 0.004 |
| 16370 | 0.004 |
| 16371 | 0.004 |
| 16372 | 0.004 |
| 16373 | 0.005 |
| 16374 | 0.004 |
| 16375 | 0.004 |
| 16376 | 0.004 |
| 16377 | 0.004 |
| 16378 | 0.004 |
| 16379 | 0.004 |
| 16380 | 0.004 |
| 16381 | 0.004 |
| 16382 | 0.004 |
| 16383 | 0.004 |
| 16384 | 0.004 |
| 16385 | 0.004 |
| 16386 | 0.004 |
| 16387 | 0.004 |
| 16388 | 0.004 |
| 16389 | 0.004 |
| 16390 | 0.004 |
| 16391 | 0.004 |
| 16392 | 0.004 |
| 16393 | 0.004 |
| 16394 | 0.004 |
| 16395 | 0.004 |
| 16396 | 0.004 |
| 16397 | 0.004 |
| 16398 | 0.004 |
| 16399 | 0.004 |
| 16400 | 0.004 |
| 16401 | 0.004 |
| 16402 | 0.004 |
| 16403 | 0.004 |
| 16404 | 0.004 |
| 16405 | 0.004 |
| 16406 | 0.004 |
| 16407 | 0.004 |
| 16408 | 0.004 |
| 16409 | 0.004 |
| 16410 | 0.004 |
| 16411 | 0.004 |
| 16412 | 0.004 |
| 16413 | 0.004 |
| 16414 | 0.004 |
| 16415 | 0.004 |
| 16416 | 0.004 |
| 16417 | 0.004 |
| 16418 | 0.004 |
| 16419 | 0.004 |
| 16420 | 0.004 |
| 16421 | 0.004 |
| 16422 | 0.004 |
| 16423 | 0.004 |
| 16424 | 0.004 |
| 16425 | 0.004 |
| 16426 | 0.004 |
| 16427 | 0.004 |
| 16428 | 0.004 |
| 16429 | 0.004 |
| 16430 | 0.004 |
| 16431 | 0.004 |
| 16432 | 0.004 |
| 16433 | 0.004 |
| 16434 | 0.004 |
| 16435 | 0.004 |
| 16436 | 0.004 |
| 16437 | 0.004 |
| 16438 | 0.004 |
| 16439 | 0.004 |
| 16440 | 0.004 |
| 16441 | 0.004 |
| 16442 | 0.004 |
| 16443 | 0.004 |
| 16444 | 0.004 |
| 16445 | 0.004 |
| 16446 | 0.005 |
| 16447 | 0.005 |
| 16448 | 0.004 |
| 16449 | 0.004 |
| 16450 | 0.004 |
| 16451 | 0.005 |
| 16452 | 0.004 |
| 16453 | 0.004 |
| 16454 | 0.004 |
| 16455 | 0.004 |
| 16456 | 0.004 |
| 16457 | 0.004 |
| 16458 | 0.004 |
| 16459 | 0.004 |
| 16460 | 0.004 |
| 16461 | 0.004 |
| 16462 | 0.004 |
| 16463 | 0.004 |
| 16464 | 0.004 |
| 16465 | 0.004 |
| 16466 | 0.004 |
| 16467 | 0.004 |
| 16468 | 0.004 |
| 16469 | 0.004 |
| 16470 | 0.004 |
| 16471 | 0.004 |
| 16472 | 0.004 |
| 16473 | 0.004 |
| 16474 | 0.004 |
| 16475 | 0.004 |
| 16476 | 0.004 |
| 16477 | 0.004 |
| 16478 | 0.004 |
| 16479 | 0.004 |
| 16480 | 0.004 |
| 16481 | 0.004 |
| 16482 | 0.004 |
| 16483 | 0.004 |
| 16484 | 0.004 |
| 16485 | 0.004 |
| 16486 | 0.004 |
| 16487 | 0.004 |
| 16488 | 0.004 |
| 16489 | 0.004 |
| 16490 | 0.004 |
| 16491 | 0.004 |
| 16492 | 0.004 |
| 16493 | 0.004 |
| 16494 | 0.004 |
| 16495 | 0.004 |
| 16496 | 0.004 |
| 16497 | 0.004 |
| 16498 | 0.004 |
| 16499 | 0.004 |
| 16500 | 0.004 |
| 16501 | 0.004 |
| 16502 | 0.004 |
| 16503 | 0.004 |
| 16504 | 0.004 |
| 16505 | 0.004 |
| 16506 | 0.004 |
| 16507 | 0.004 |
| 16508 | 0.004 |
| 16509 | 0.004 |
| 16510 | 0.004 |
| 16511 | 0.004 |
| 16512 | 0.004 |
| 16513 | 0.004 |
| 16514 | 0.004 |
| 16515 | 0.004 |
| 16516 | 0.004 |
| 16517 | 0.004 |
| 16518 | 0.004 |
| 16519 | 0.004 |
| 16520 | 0.004 |
| 16521 | 0.004 |
| 16522 | 0.004 |
| 16523 | 0.004 |
| 16524 | 0.004 |
| 16525 | 0.005 |
| 16526 | 0.004 |
| 16527 | 0.004 |
| 16528 | 0.004 |
| 16529 | 0.004 |
| 16530 | 0.005 |
| 16531 | 0.004 |
| 16532 | 0.004 |
| 16533 | 0.005 |
| 16534 | 0.004 |
| 16535 | 0.004 |
| 16536 | 0.004 |
| 16537 | 0.004 |
| 16538 | 0.004 |
| 16539 | 0.004 |
| 16540 | 0.004 |
| 16541 | 0.004 |
| 16542 | 0.004 |
| 16543 | 0.004 |
| 16544 | 0.004 |
| 16545 | 0.004 |
| 16546 | 0.004 |
| 16547 | 0.004 |
| 16548 | 0.004 |
| 16549 | 0.004 |
| 16550 | 0.004 |
| 16551 | 0.004 |
| 16552 | 0.004 |
| 16553 | 0.004 |
| 16554 | 0.004 |
| 16555 | 0.004 |
| 16556 | 0.004 |
| 16557 | 0.004 |
| 16558 | 0.005 |
| 16559 | 0.004 |
| 16560 | 0.004 |
| 16561 | 0.004 |
| 16562 | 0.004 |
| 16563 | 0.004 |
| 16564 | 0.004 |
| 16565 | 0.004 |
| 16566 | 0.004 |
| 16567 | 0.004 |
| 16568 | 0.004 |
| 16569 | 0.004 |
| 16570 | 0.004 |
| 16571 | 0.004 |
| 16572 | 0.004 |
| 16573 | 0.004 |
| 16574 | 0.004 |
| 16575 | 0.004 |
| 16576 | 0.004 |
| 16577 | 0.004 |
| 16578 | 0.004 |
| 16579 | 0.004 |
| 16580 | 0.004 |
| 16581 | 0.004 |
| 16582 | 0.004 |
| 16583 | 0.004 |
| 16584 | 0.004 |
| 16585 | 0.004 |
| 16586 | 0.004 |
| 16587 | 0.004 |
| 16588 | 0.004 |
| 16589 | 0.004 |
| 16590 | 0.004 |
| 16591 | 0.004 |
| 16592 | 0.004 |
| 16593 | 0.004 |
| 16594 | 0.004 |
| 16595 | 0.004 |
| 16596 | 0.004 |
| 16597 | 0.004 |
| 16598 | 0.004 |
| 16599 | 0.004 |
| 16600 | 0.004 |
| 16601 | 0.004 |
| 16602 | 0.004 |
| 16603 | 0.004 |
| 16604 | 0.005 |
| 16605 | 0.005 |
| 16606 | 0.005 |
| 16607 | 0.005 |
| 16608 | 0.005 |
| 16609 | 0.005 |
| 16610 | 0.004 |
| 16611 | 0.004 |
| 16612 | 0.004 |
| 16613 | 0.004 |
| 16614 | 0.004 |
| 16615 | 0.004 |
| 16616 | 0.005 |
| 16617 | 0.005 |
| 16618 | 0.004 |
| 16619 | 0.004 |
| 16620 | 0.004 |
| 16621 | 0.004 |
| 16622 | 0.004 |
| 16623 | 0.004 |
| 16624 | 0.004 |
| 16625 | 0.004 |
| 16626 | 0.004 |
| 16627 | 0.004 |
| 16628 | 0.004 |
| 16629 | 0.004 |
| 16630 | 0.004 |
| 16631 | 0.004 |
| 16632 | 0.004 |
| 16633 | 0.004 |
| 16634 | 0.004 |
| 16635 | 0.004 |
| 16636 | 0.004 |
| 16637 | 0.005 |
| 16638 | 0.005 |
| 16639 | 0.004 |
| 16640 | 0.004 |
| 16641 | 0.004 |
| 16642 | 0.004 |
| 16643 | 0.004 |
| 16644 | 0.004 |
| 16645 | 0.004 |
| 16646 | 0.004 |
| 16647 | 0.004 |
| 16648 | 0.004 |
| 16649 | 0.004 |
| 16650 | 0.004 |
| 16651 | 0.004 |
| 16652 | 0.004 |
| 16653 | 0.004 |
| 16654 | 0.004 |
| 16655 | 0.004 |
| 16656 | 0.004 |
| 16657 | 0.004 |
| 16658 | 0.004 |
| 16659 | 0.004 |
| 16660 | 0.004 |
| 16661 | 0.004 |
| 16662 | 0.004 |
| 16663 | 0.004 |
| 16664 | 0.004 |
| 16665 | 0.004 |
| 16666 | 0.004 |
| 16667 | 0.004 |
| 16668 | 0.004 |
| 16669 | 0.004 |
| 16670 | 0.004 |
| 16671 | 0.004 |
| 16672 | 0.004 |
| 16673 | 0.004 |
| 16674 | 0.004 |
| 16675 | 0.004 |
| 16676 | 0.004 |
| 16677 | 0.004 |
| 16678 | 0.004 |
| 16679 | 0.004 |
| 16680 | 0.004 |
| 16681 | 0.004 |
| 16682 | 0.004 |
| 16683 | 0.005 |
| 16684 | 0.005 |
| 16685 | 0.004 |
| 16686 | 0.005 |
| 16687 | 0.005 |
| 16688 | 0.005 |
| 16689 | 0.005 |
| 16690 | 0.005 |
| 16691 | 0.005 |
| 16692 | 0.004 |
| 16693 | 0.004 |
| 16694 | 0.004 |
| 16695 | 0.004 |
| 16696 | 0.004 |
| 16697 | 0.004 |
| 16698 | 0.004 |
| 16699 | 0.004 |
| 16700 | 0.004 |
| 16701 | 0.004 |
| 16702 | 0.004 |
| 16703 | 0.004 |
| 16704 | 0.004 |
| 16705 | 0.004 |
| 16706 | 0.005 |
| 16707 | 0.004 |
| 16708 | 0.004 |
| 16709 | 0.004 |
| 16710 | 0.004 |
| 16711 | 0.004 |
| 16712 | 0.004 |
| 16713 | 0.004 |
| 16714 | 0.004 |
| 16715 | 0.005 |
| 16716 | 0.004 |
| 16717 | 0.004 |
| 16718 | 0.004 |
| 16719 | 0.004 |
| 16720 | 0.004 |
| 16721 | 0.004 |
| 16722 | 0.004 |
| 16723 | 0.005 |
| 16724 | 0.004 |
| 16725 | 0.004 |
| 16726 | 0.004 |
| 16727 | 0.004 |
| 16728 | 0.004 |
| 16729 | 0.004 |
| 16730 | 0.004 |
| 16731 | 0.004 |
| 16732 | 0.004 |
| 16733 | 0.004 |
| 16734 | 0.004 |
| 16735 | 0.004 |
| 16736 | 0.004 |
| 16737 | 0.004 |
| 16738 | 0.004 |
| 16739 | 0.004 |
| 16740 | 0.004 |
| 16741 | 0.004 |
| 16742 | 0.004 |
| 16743 | 0.004 |
| 16744 | 0.004 |
| 16745 | 0.004 |
| 16746 | 0.004 |
| 16747 | 0.004 |
| 16748 | 0.004 |
| 16749 | 0.004 |
| 16750 | 0.004 |
| 16751 | 0.004 |
| 16752 | 0.004 |
| 16753 | 0.004 |
| 16754 | 0.004 |
| 16755 | 0.004 |
| 16756 | 0.004 |
| 16757 | 0.004 |
| 16758 | 0.004 |
| 16759 | 0.004 |
| 16760 | 0.004 |
| 16761 | 0.004 |
| 16762 | 0.004 |
| 16763 | 0.004 |
| 16764 | 0.005 |
| 16765 | 0.004 |
| 16766 | 0.004 |
| 16767 | 0.005 |
| 16768 | 0.005 |
| 16769 | 0.005 |
| 16770 | 0.005 |
| 16771 | 0.005 |
| 16772 | 0.005 |
| 16773 | 0.004 |
| 16774 | 0.004 |
| 16775 | 0.004 |
| 16776 | 0.004 |
| 16777 | 0.004 |
| 16778 | 0.004 |
| 16779 | 0.004 |
| 16780 | 0.005 |
| 16781 | 0.005 |
| 16782 | 0.004 |
| 16783 | 0.004 |
| 16784 | 0.004 |
| 16785 | 0.004 |
| 16786 | 0.004 |
| 16787 | 0.004 |
| 16788 | 0.004 |
| 16789 | 0.004 |
| 16790 | 0.004 |
| 16791 | 0.005 |
| 16792 | 0.005 |
| 16793 | 0.005 |
| 16794 | 0.004 |
| 16795 | 0.004 |
| 16796 | 0.004 |
| 16797 | 0.004 |
| 16798 | 0.004 |
| 16799 | 0.004 |
| 16800 | 0.004 |
| 16801 | 0.004 |
| 16802 | 0.004 |
| 16803 | 0.004 |
| 16804 | 0.004 |
| 16805 | 0.004 |
| 16806 | 0.004 |
| 16807 | 0.004 |
| 16808 | 0.004 |
| 16809 | 0.004 |
| 16810 | 0.004 |
| 16811 | 0.004 |
| 16812 | 0.004 |
| 16813 | 0.004 |
| 16814 | 0.004 |
| 16815 | 0.004 |
| 16816 | 0.004 |
| 16817 | 0.004 |
| 16818 | 0.004 |
| 16819 | 0.004 |
| 16820 | 0.004 |
| 16821 | 0.004 |
| 16822 | 0.005 |
| 16823 | 0.004 |
| 16824 | 0.004 |
| 16825 | 0.004 |
| 16826 | 0.004 |
| 16827 | 0.004 |
| 16828 | 0.004 |
| 16829 | 0.004 |
| 16830 | 0.004 |
| 16831 | 0.004 |
| 16832 | 0.004 |
| 16833 | 0.004 |
| 16834 | 0.004 |
| 16835 | 0.004 |
| 16836 | 0.004 |
| 16837 | 0.004 |
| 16838 | 0.004 |
| 16839 | 0.005 |
| 16840 | 0.004 |
| 16841 | 0.004 |
| 16842 | 0.004 |
| 16843 | 0.004 |
| 16844 | 0.004 |
| 16845 | 0.004 |
| 16846 | 0.004 |
| 16847 | 0.005 |
| 16848 | 0.005 |
| 16849 | 0.005 |
| 16850 | 0.005 |
| 16851 | 0.005 |
| 16852 | 0.005 |
| 16853 | 0.004 |
| 16854 | 0.004 |
| 16855 | 0.004 |
| 16856 | 0.004 |
| 16857 | 0.004 |
| 16858 | 0.004 |
| 16859 | 0.004 |
| 16860 | 0.005 |
| 16861 | 0.004 |
| 16862 | 0.004 |
| 16863 | 0.004 |
| 16864 | 0.004 |
| 16865 | 0.004 |
| 16866 | 0.004 |
| 16867 | 0.004 |
| 16868 | 0.004 |
| 16869 | 0.004 |
| 16870 | 0.004 |
| 16871 | 0.004 |
| 16872 | 0.004 |
| 16873 | 0.004 |
| 16874 | 0.004 |
| 16875 | 0.004 |
| 16876 | 0.004 |
| 16877 | 0.004 |
| 16878 | 0.004 |
| 16879 | 0.005 |
| 16880 | 0.005 |
| 16881 | 0.004 |
| 16882 | 0.004 |
| 16883 | 0.004 |
| 16884 | 0.004 |
| 16885 | 0.004 |
| 16886 | 0.004 |
| 16887 | 0.004 |
| 16888 | 0.004 |
| 16889 | 0.004 |
| 16890 | 0.004 |
| 16891 | 0.004 |
| 16892 | 0.004 |
| 16893 | 0.004 |
| 16894 | 0.004 |
| 16895 | 0.004 |
| 16896 | 0.004 |
| 16897 | 0.004 |
| 16898 | 0.004 |
| 16899 | 0.004 |
| 16900 | 0.004 |
| 16901 | 0.004 |
| 16902 | 0.004 |
| 16903 | 0.004 |
| 16904 | 0.004 |
| 16905 | 0.004 |
| 16906 | 0.004 |
| 16907 | 0.004 |
| 16908 | 0.004 |
| 16909 | 0.004 |
| 16910 | 0.004 |
| 16911 | 0.004 |
| 16912 | 0.004 |
| 16913 | 0.004 |
| 16914 | 0.004 |
| 16915 | 0.004 |
| 16916 | 0.004 |
| 16917 | 0.004 |
| 16918 | 0.004 |
| 16919 | 0.004 |
| 16920 | 0.004 |
| 16921 | 0.004 |
| 16922 | 0.004 |
| 16923 | 0.004 |
| 16924 | 0.004 |
| 16925 | 0.004 |
| 16926 | 0.005 |
| 16927 | 0.005 |
| 16928 | 0.005 |
| 16929 | 0.005 |
| 16930 | 0.005 |
| 16931 | 0.005 |
| 16932 | 0.004 |
| 16933 | 0.005 |
| 16934 | 0.005 |
| 16935 | 0.004 |
| 16936 | 0.005 |
| 16937 | 0.005 |
| 16938 | 0.005 |
| 16939 | 0.004 |
| 16940 | 0.004 |
| 16941 | 0.004 |
| 16942 | 0.004 |
| 16943 | 0.004 |
| 16944 | 0.004 |
| 16945 | 0.005 |
| 16946 | 0.005 |
| 16947 | 0.005 |
| 16948 | 0.004 |
| 16949 | 0.004 |
| 16950 | 0.004 |
| 16951 | 0.004 |
| 16952 | 0.005 |
| 16953 | 0.005 |
| 16954 | 0.005 |
| 16955 | 0.005 |
| 16956 | 0.004 |
| 16957 | 0.004 |
| 16958 | 0.004 |
| 16959 | 0.004 |
| 16960 | 0.004 |
| 16961 | 0.004 |
| 16962 | 0.004 |
| 16963 | 0.004 |
| 16964 | 0.004 |
| 16965 | 0.004 |
| 16966 | 0.004 |
| 16967 | 0.004 |
| 16968 | 0.004 |
| 16969 | 0.004 |
| 16970 | 0.004 |
| 16971 | 0.004 |
| 16972 | 0.004 |
| 16973 | 0.004 |
| 16974 | 0.004 |
| 16975 | 0.004 |
| 16976 | 0.004 |
| 16977 | 0.005 |
| 16978 | 0.005 |
| 16979 | 0.004 |
| 16980 | 0.004 |
| 16981 | 0.004 |
| 16982 | 0.004 |
| 16983 | 0.004 |
| 16984 | 0.004 |
| 16985 | 0.004 |
| 16986 | 0.004 |
| 16987 | 0.004 |
| 16988 | 0.004 |
| 16989 | 0.004 |
| 16990 | 0.004 |
| 16991 | 0.004 |
| 16992 | 0.004 |
| 16993 | 0.004 |
| 16994 | 0.004 |
| 16995 | 0.004 |
| 16996 | 0.004 |
| 16997 | 0.004 |
| 16998 | 0.004 |
| 16999 | 0.004 |
| 17000 | 0.005 |
| 17001 | 0.005 |
| 17002 | 0.005 |
| 17003 | 0.005 |
| 17004 | 0.005 |
| 17005 | 0.005 |
| 17006 | 0.005 |
| 17007 | 0.005 |
| 17008 | 0.005 |
| 17009 | 0.005 |
| 17010 | 0.005 |
| 17011 | 0.005 |
| 17012 | 0.004 |
| 17013 | 0.005 |
| 17014 | 0.004 |
| 17015 | 0.005 |
| 17016 | 0.005 |
| 17017 | 0.005 |
| 17018 | 0.005 |
| 17019 | 0.004 |
| 17020 | 0.004 |
| 17021 | 0.004 |
| 17022 | 0.004 |
| 17023 | 0.004 |
| 17024 | 0.005 |
| 17025 | 0.005 |
| 17026 | 0.005 |
| 17027 | 0.005 |
| 17028 | 0.005 |
| 17029 | 0.004 |
| 17030 | 0.004 |
| 17031 | 0.005 |
| 17032 | 0.004 |
| 17033 | 0.004 |
| 17034 | 0.005 |
| 17035 | 0.005 |
| 17036 | 0.005 |
| 17037 | 0.004 |
| 17038 | 0.004 |
| 17039 | 0.004 |
| 17040 | 0.004 |
| 17041 | 0.004 |
| 17042 | 0.004 |
| 17043 | 0.005 |
| 17044 | 0.005 |
| 17045 | 0.004 |
| 17046 | 0.004 |
| 17047 | 0.004 |
| 17048 | 0.004 |
| 17049 | 0.004 |
| 17050 | 0.005 |
| 17051 | 0.004 |
| 17052 | 0.004 |
| 17053 | 0.004 |
| 17054 | 0.004 |
| 17055 | 0.004 |
| 17056 | 0.004 |
| 17057 | 0.004 |
| 17058 | 0.004 |
| 17059 | 0.004 |
| 17060 | 0.004 |
| 17061 | 0.005 |
| 17062 | 0.004 |
| 17063 | 0.005 |
| 17064 | 0.004 |
| 17065 | 0.004 |
| 17066 | 0.004 |
| 17067 | 0.004 |
| 17068 | 0.005 |
| 17069 | 0.004 |
| 17070 | 0.004 |
| 17071 | 0.004 |
| 17072 | 0.004 |
| 17073 | 0.004 |
| 17074 | 0.004 |
| 17075 | 0.004 |
| 17076 | 0.004 |
| 17077 | 0.004 |
| 17078 | 0.005 |
| 17079 | 0.005 |
| 17080 | 0.005 |
| 17081 | 0.005 |
| 17082 | 0.005 |
| 17083 | 0.005 |
| 17084 | 0.005 |
| 17085 | 0.005 |
| 17086 | 0.005 |
| 17087 | 0.005 |
| 17088 | 0.005 |
| 17089 | 0.005 |
| 17090 | 0.005 |
| 17091 | 0.005 |
| 17092 | 0.005 |
| 17093 | 0.005 |
| 17094 | 0.005 |
| 17095 | 0.005 |
| 17096 | 0.005 |
| 17097 | 0.005 |
| 17098 | 0.005 |
| 17099 | 0.004 |
| 17100 | 0.005 |
| 17101 | 0.004 |
| 17102 | 0.005 |
| 17103 | 0.005 |
| 17104 | 0.005 |
| 17105 | 0.005 |
| 17106 | 0.005 |
| 17107 | 0.005 |
| 17108 | 0.005 |
| 17109 | 0.005 |
| 17110 | 0.005 |
| 17111 | 0.005 |
| 17112 | 0.004 |
| 17113 | 0.005 |
| 17114 | 0.005 |
| 17115 | 0.005 |
| 17116 | 0.004 |
| 17117 | 0.004 |
| 17118 | 0.004 |
| 17119 | 0.004 |
| 17120 | 0.004 |
| 17121 | 0.005 |
| 17122 | 0.005 |
| 17123 | 0.004 |
| 17124 | 0.004 |
| 17125 | 0.004 |
| 17126 | 0.004 |
| 17127 | 0.004 |
| 17128 | 0.004 |
| 17129 | 0.005 |
| 17130 | 0.005 |
| 17131 | 0.004 |
| 17132 | 0.004 |
| 17133 | 0.004 |
| 17134 | 0.004 |
| 17135 | 0.004 |
| 17136 | 0.005 |
| 17137 | 0.004 |
| 17138 | 0.004 |
| 17139 | 0.005 |
| 17140 | 0.004 |
| 17141 | 0.004 |
| 17142 | 0.004 |
| 17143 | 0.004 |
| 17144 | 0.004 |
| 17145 | 0.004 |
| 17146 | 0.004 |
| 17147 | 0.005 |
| 17148 | 0.004 |
| 17149 | 0.004 |
| 17150 | 0.004 |
| 17151 | 0.004 |
| 17152 | 0.004 |
| 17153 | 0.004 |
| 17154 | 0.005 |
| 17155 | 0.005 |
| 17156 | 0.004 |
| 17157 | 0.005 |
| 17158 | 0.004 |
| 17159 | 0.004 |
| 17160 | 0.004 |
| 17161 | 0.004 |
| 17162 | 0.004 |
| 17163 | 0.005 |
| 17164 | 0.005 |
| 17165 | 0.005 |
| 17166 | 0.005 |
| 17167 | 0.005 |
| 17168 | 0.005 |
| 17169 | 0.005 |
| 17170 | 0.005 |
| 17171 | 0.005 |
| 17172 | 0.005 |
| 17173 | 0.005 |
| 17174 | 0.005 |
| 17175 | 0.005 |
| 17176 | 0.005 |
| 17177 | 0.005 |
| 17178 | 0.005 |
| 17179 | 0.005 |
| 17180 | 0.005 |
| 17181 | 0.005 |
| 17182 | 0.005 |
| 17183 | 0.005 |
| 17184 | 0.004 |
| 17185 | 0.004 |
| 17186 | 0.004 |
| 17187 | 0.004 |
| 17188 | 0.005 |
| 17189 | 0.005 |
| 17190 | 0.005 |
| 17191 | 0.005 |
| 17192 | 0.005 |
| 17193 | 0.005 |
| 17194 | 0.004 |
| 17195 | 0.005 |
| 17196 | 0.005 |
| 17197 | 0.005 |
| 17198 | 0.005 |
| 17199 | 0.005 |
| 17200 | 0.005 |
| 17201 | 0.004 |
| 17202 | 0.004 |
| 17203 | 0.005 |
| 17204 | 0.005 |
| 17205 | 0.005 |
| 17206 | 0.004 |
| 17207 | 0.004 |
| 17208 | 0.004 |
| 17209 | 0.004 |
| 17210 | 0.004 |
| 17211 | 0.004 |
| 17212 | 0.004 |
| 17213 | 0.004 |
| 17214 | 0.004 |
| 17215 | 0.004 |
| 17216 | 0.004 |
| 17217 | 0.004 |
| 17218 | 0.004 |
| 17219 | 0.004 |
| 17220 | 0.005 |
| 17221 | 0.005 |
| 17222 | 0.005 |
| 17223 | 0.005 |
| 17224 | 0.005 |
| 17225 | 0.004 |
| 17226 | 0.004 |
| 17227 | 0.004 |
| 17228 | 0.004 |
| 17229 | 0.005 |
| 17230 | 0.004 |
| 17231 | 0.004 |
| 17232 | 0.005 |
| 17233 | 0.005 |
| 17234 | 0.004 |
| 17235 | 0.005 |
| 17236 | 0.004 |
| 17237 | 0.004 |
| 17238 | 0.004 |
| 17239 | 0.004 |
| 17240 | 0.005 |
| 17241 | 0.005 |
| 17242 | 0.005 |
| 17243 | 0.005 |
| 17244 | 0.005 |
| 17245 | 0.005 |
| 17246 | 0.005 |
| 17247 | 0.005 |
| 17248 | 0.005 |
| 17249 | 0.005 |
| 17250 | 0.005 |
| 17251 | 0.005 |
| 17252 | 0.005 |
| 17253 | 0.005 |
| 17254 | 0.005 |
| 17255 | 0.005 |
| 17256 | 0.005 |
| 17257 | 0.005 |
| 17258 | 0.005 |
| 17259 | 0.005 |
| 17260 | 0.005 |
| 17261 | 0.005 |
| 17262 | 0.005 |
| 17263 | 0.005 |
| 17264 | 0.005 |
| 17265 | 0.004 |
| 17266 | 0.005 |
| 17267 | 0.005 |
| 17268 | 0.005 |
| 17269 | 0.005 |
| 17270 | 0.005 |
| 17271 | 0.005 |
| 17272 | 0.005 |
| 17273 | 0.005 |
| 17274 | 0.005 |
| 17275 | 0.005 |
| 17276 | 0.005 |
| 17277 | 0.005 |
| 17278 | 0.005 |
| 17279 | 0.005 |
| 17280 | 0.005 |
| 17281 | 0.005 |
| 17282 | 0.005 |
| 17283 | 0.005 |
| 17284 | 0.004 |
| 17285 | 0.004 |
| 17286 | 0.004 |
| 17287 | 0.004 |
| 17288 | 0.004 |
| 17289 | 0.004 |
| 17290 | 0.004 |
| 17291 | 0.004 |
| 17292 | 0.004 |
| 17293 | 0.004 |
| 17294 | 0.005 |
| 17295 | 0.005 |
| 17296 | 0.005 |
| 17297 | 0.005 |
| 17298 | 0.004 |
| 17299 | 0.004 |
| 17300 | 0.004 |
| 17301 | 0.005 |
| 17302 | 0.005 |
| 17303 | 0.004 |
| 17304 | 0.005 |
| 17305 | 0.005 |
| 17306 | 0.004 |
| 17307 | 0.004 |
| 17308 | 0.004 |
| 17309 | 0.004 |
| 17310 | 0.004 |
| 17311 | 0.004 |
| 17312 | 0.005 |
| 17313 | 0.005 |
| 17314 | 0.005 |
| 17315 | 0.005 |
| 17316 | 0.005 |
| 17317 | 0.004 |
| 17318 | 0.005 |
| 17319 | 0.004 |
| 17320 | 0.005 |
| 17321 | 0.005 |
| 17322 | 0.005 |
| 17323 | 0.005 |
| 17324 | 0.005 |
| 17325 | 0.005 |
| 17326 | 0.005 |
| 17327 | 0.005 |
| 17328 | 0.005 |
| 17329 | 0.005 |
| 17330 | 0.005 |
| 17331 | 0.005 |
| 17332 | 0.005 |
| 17333 | 0.005 |
| 17334 | 0.005 |
| 17335 | 0.005 |
| 17336 | 0.005 |
| 17337 | 0.005 |
| 17338 | 0.005 |
| 17339 | 0.005 |
| 17340 | 0.005 |
| 17341 | 0.005 |
| 17342 | 0.005 |
| 17343 | 0.005 |
| 17344 | 0.004 |
| 17345 | 0.005 |
| 17346 | 0.005 |
| 17347 | 0.005 |
| 17348 | 0.005 |
| 17349 | 0.005 |
| 17350 | 0.005 |
| 17351 | 0.005 |
| 17352 | 0.005 |
| 17353 | 0.005 |
| 17354 | 0.005 |
| 17355 | 0.005 |
| 17356 | 0.005 |
| 17357 | 0.005 |
| 17358 | 0.005 |
| 17359 | 0.005 |
| 17360 | 0.005 |
| 17361 | 0.004 |
| 17362 | 0.005 |
| 17363 | 0.004 |
| 17364 | 0.004 |
| 17365 | 0.005 |
| 17366 | 0.005 |
| 17367 | 0.004 |
| 17368 | 0.004 |
| 17369 | 0.004 |
| 17370 | 0.004 |
| 17371 | 0.004 |
| 17372 | 0.004 |
| 17373 | 0.005 |
| 17374 | 0.005 |
| 17375 | 0.005 |
| 17376 | 0.005 |
| 17377 | 0.005 |
| 17378 | 0.005 |
| 17379 | 0.004 |
| 17380 | 0.005 |
| 17381 | 0.005 |
| 17382 | 0.004 |
| 17383 | 0.005 |
| 17384 | 0.005 |
| 17385 | 0.005 |
| 17386 | 0.004 |
| 17387 | 0.004 |
| 17388 | 0.004 |
| 17389 | 0.004 |
| 17390 | 0.004 |
| 17391 | 0.005 |
| 17392 | 0.005 |
| 17393 | 0.005 |
| 17394 | 0.005 |
| 17395 | 0.005 |
| 17396 | 0.005 |
| 17397 | 0.004 |
| 17398 | 0.004 |
| 17399 | 0.004 |
| 17400 | 0.004 |
| 17401 | 0.005 |
| 17402 | 0.005 |
| 17403 | 0.005 |
| 17404 | 0.005 |
| 17405 | 0.005 |
| 17406 | 0.005 |
| 17407 | 0.005 |
| 17408 | 0.005 |
| 17409 | 0.005 |
| 17410 | 0.005 |
| 17411 | 0.005 |
| 17412 | 0.005 |
| 17413 | 0.005 |
| 17414 | 0.005 |
| 17415 | 0.005 |
| 17416 | 0.005 |
| 17417 | 0.005 |
| 17418 | 0.005 |
| 17419 | 0.005 |
| 17420 | 0.005 |
| 17421 | 0.005 |
| 17422 | 0.005 |
| 17423 | 0.005 |
| 17424 | 0.005 |
| 17425 | 0.005 |
| 17426 | 0.005 |
| 17427 | 0.005 |
| 17428 | 0.004 |
| 17429 | 0.005 |
| 17430 | 0.005 |
| 17431 | 0.005 |
| 17432 | 0.005 |
| 17433 | 0.005 |
| 17434 | 0.005 |
| 17435 | 0.005 |
| 17436 | 0.005 |
| 17437 | 0.005 |
| 17438 | 0.005 |
| 17439 | 0.005 |
| 17440 | 0.005 |
| 17441 | 0.005 |
| 17442 | 0.005 |
| 17443 | 0.005 |
| 17444 | 0.005 |
| 17445 | 0.004 |
| 17446 | 0.004 |
| 17447 | 0.004 |
| 17448 | 0.004 |
| 17449 | 0.004 |
| 17450 | 0.005 |
| 17451 | 0.004 |
| 17452 | 0.004 |
| 17453 | 0.004 |
| 17454 | 0.004 |
| 17455 | 0.004 |
| 17456 | 0.004 |
| 17457 | 0.004 |
| 17458 | 0.005 |
| 17459 | 0.005 |
| 17460 | 0.005 |
| 17461 | 0.005 |
| 17462 | 0.005 |
| 17463 | 0.004 |
| 17464 | 0.004 |
| 17465 | 0.004 |
| 17466 | 0.004 |
| 17467 | 0.004 |
| 17468 | 0.005 |
| 17469 | 0.004 |
| 17470 | 0.004 |
| 17471 | 0.004 |
| 17472 | 0.005 |
| 17473 | 0.004 |
| 17474 | 0.004 |
| 17475 | 0.004 |
| 17476 | 0.005 |
| 17477 | 0.004 |
| 17478 | 0.004 |
| 17479 | 0.005 |
| 17480 | 0.005 |
| 17481 | 0.005 |
| 17482 | 0.005 |
| 17483 | 0.005 |
| 17484 | 0.005 |
| 17485 | 0.005 |
| 17486 | 0.005 |
| 17487 | 0.005 |
| 17488 | 0.005 |
| 17489 | 0.005 |
| 17490 | 0.005 |
| 17491 | 0.005 |
| 17492 | 0.005 |
| 17493 | 0.005 |
| 17494 | 0.005 |
| 17495 | 0.005 |
| 17496 | 0.005 |
| 17497 | 0.005 |
| 17498 | 0.005 |
| 17499 | 0.005 |
| 17500 | 0.005 |
| 17501 | 0.005 |
| 17502 | 0.005 |
| 17503 | 0.005 |
| 17504 | 0.005 |
| 17505 | 0.005 |
| 17506 | 0.005 |
| 17507 | 0.005 |
| 17508 | 0.005 |
| 17509 | 0.005 |
| 17510 | 0.005 |
| 17511 | 0.005 |
| 17512 | 0.005 |
| 17513 | 0.005 |
| 17514 | 0.005 |
| 17515 | 0.005 |
| 17516 | 0.005 |
| 17517 | 0.005 |
| 17518 | 0.005 |
| 17519 | 0.004 |
| 17520 | 0.004 |
| 17521 | 0.004 |
| 17522 | 0.005 |
| 17523 | 0.005 |
| 17524 | 0.005 |
| 17525 | 0.005 |
| 17526 | 0.005 |
| 17527 | 0.004 |
| 17528 | 0.004 |
| 17529 | 0.004 |
| 17530 | 0.005 |
| 17531 | 0.005 |
| 17532 | 0.005 |
| 17533 | 0.005 |
| 17534 | 0.004 |
| 17535 | 0.004 |
| 17536 | 0.004 |
| 17537 | 0.004 |
| 17538 | 0.004 |
| 17539 | 0.004 |
| 17540 | 0.005 |
| 17541 | 0.005 |
| 17542 | 0.005 |
| 17543 | 0.004 |
| 17544 | 0.004 |
| 17545 | 0.004 |
| 17546 | 0.004 |
| 17547 | 0.004 |
| 17548 | 0.004 |
| 17549 | 0.005 |
| 17550 | 0.005 |
| 17551 | 0.005 |
| 17552 | 0.004 |
| 17553 | 0.004 |
| 17554 | 0.004 |
| 17555 | 0.004 |
| 17556 | 0.004 |
| 17557 | 0.004 |
| 17558 | 0.004 |
| 17559 | 0.005 |
| 17560 | 0.005 |
| 17561 | 0.005 |
| 17562 | 0.005 |
| 17563 | 0.005 |
| 17564 | 0.005 |
| 17565 | 0.005 |
| 17566 | 0.005 |
| 17567 | 0.005 |
| 17568 | 0.005 |
| 17569 | 0.005 |
| 17570 | 0.005 |
| 17571 | 0.005 |
| 17572 | 0.005 |
| 17573 | 0.005 |
| 17574 | 0.005 |
| 17575 | 0.005 |
| 17576 | 0.005 |
| 17577 | 0.005 |
| 17578 | 0.005 |
| 17579 | 0.005 |
| 17580 | 0.005 |
| 17581 | 0.005 |
| 17582 | 0.005 |
| 17583 | 0.005 |
| 17584 | 0.005 |
| 17585 | 0.005 |
| 17586 | 0.005 |
| 17587 | 0.005 |
| 17588 | 0.005 |
| 17589 | 0.005 |
| 17590 | 0.005 |
| 17591 | 0.005 |
| 17592 | 0.005 |
| 17593 | 0.005 |
| 17594 | 0.005 |
| 17595 | 0.005 |
| 17596 | 0.005 |
| 17597 | 0.005 |
| 17598 | 0.005 |
| 17599 | 0.005 |
| 17600 | 0.004 |
| 17601 | 0.005 |
| 17602 | 0.005 |
| 17603 | 0.004 |
| 17604 | 0.004 |
| 17605 | 0.004 |
| 17606 | 0.004 |
| 17607 | 0.004 |
| 17608 | 0.004 |
| 17609 | 0.005 |
| 17610 | 0.005 |
| 17611 | 0.005 |
| 17612 | 0.005 |
| 17613 | 0.004 |
| 17614 | 0.004 |
| 17615 | 0.004 |
| 17616 | 0.004 |
| 17617 | 0.005 |
| 17618 | 0.005 |
| 17619 | 0.005 |
| 17620 | 0.005 |
| 17621 | 0.005 |
| 17622 | 0.004 |
| 17623 | 0.005 |
| 17624 | 0.004 |
| 17625 | 0.004 |
| 17626 | 0.005 |
| 17627 | 0.005 |
| 17628 | 0.004 |
| 17629 | 0.004 |
| 17630 | 0.004 |
| 17631 | 0.004 |
| 17632 | 0.004 |
| 17633 | 0.004 |
| 17634 | 0.005 |
| 17635 | 0.005 |
| 17636 | 0.005 |
| 17637 | 0.005 |
| 17638 | 0.005 |
| 17639 | 0.005 |
| 17640 | 0.005 |
| 17641 | 0.004 |
| 17642 | 0.005 |
| 17643 | 0.005 |
| 17644 | 0.005 |
| 17645 | 0.005 |
| 17646 | 0.005 |
| 17647 | 0.005 |
| 17648 | 0.005 |
| 17649 | 0.005 |
| 17650 | 0.005 |
| 17651 | 0.005 |
| 17652 | 0.005 |
| 17653 | 0.005 |
| 17654 | 0.005 |
| 17655 | 0.005 |
| 17656 | 0.005 |
| 17657 | 0.005 |
| 17658 | 0.005 |
| 17659 | 0.005 |
| 17660 | 0.005 |
| 17661 | 0.005 |
| 17662 | 0.005 |
| 17663 | 0.005 |
| 17664 | 0.005 |
| 17665 | 0.005 |
| 17666 | 0.005 |
| 17667 | 0.005 |
| 17668 | 0.005 |
| 17669 | 0.004 |
| 17670 | 0.005 |
| 17671 | 0.005 |
| 17672 | 0.005 |
| 17673 | 0.005 |
| 17674 | 0.005 |
| 17675 | 0.005 |
| 17676 | 0.005 |
| 17677 | 0.005 |
| 17678 | 0.004 |
| 17679 | 0.004 |
| 17680 | 0.005 |
| 17681 | 0.005 |
| 17682 | 0.005 |
| 17683 | 0.004 |
| 17684 | 0.004 |
| 17685 | 0.004 |
| 17686 | 0.004 |
| 17687 | 0.004 |
| 17688 | 0.004 |
| 17689 | 0.005 |
| 17690 | 0.005 |
| 17691 | 0.005 |
| 17692 | 0.004 |
| 17693 | 0.004 |
| 17694 | 0.004 |
| 17695 | 0.004 |
| 17696 | 0.005 |
| 17697 | 0.004 |
| 17698 | 0.005 |
| 17699 | 0.005 |
| 17700 | 0.005 |
| 17701 | 0.004 |
| 17702 | 0.004 |
| 17703 | 0.004 |
| 17704 | 0.004 |
| 17705 | 0.004 |
| 17706 | 0.005 |
| 17707 | 0.005 |
| 17708 | 0.005 |
| 17709 | 0.005 |
| 17710 | 0.004 |
| 17711 | 0.004 |
| 17712 | 0.004 |
| 17713 | 0.004 |
| 17714 | 0.005 |
| 17715 | 0.005 |
| 17716 | 0.005 |
| 17717 | 0.005 |
| 17718 | 0.005 |
| 17719 | 0.004 |
| 17720 | 0.005 |
| 17721 | 0.005 |
| 17722 | 0.005 |
| 17723 | 0.005 |
| 17724 | 0.005 |
| 17725 | 0.005 |
| 17726 | 0.005 |
| 17727 | 0.005 |
| 17728 | 0.005 |
| 17729 | 0.005 |
| 17730 | 0.005 |
| 17731 | 0.005 |
| 17732 | 0.005 |
| 17733 | 0.005 |
| 17734 | 0.005 |
| 17735 | 0.005 |
| 17736 | 0.005 |
| 17737 | 0.005 |
| 17738 | 0.005 |
| 17739 | 0.005 |
| 17740 | 0.005 |
| 17741 | 0.005 |
| 17742 | 0.005 |
| 17743 | 0.005 |
| 17744 | 0.005 |
| 17745 | 0.005 |
| 17746 | 0.004 |
| 17747 | 0.005 |
| 17748 | 0.005 |
| 17749 | 0.005 |
| 17750 | 0.005 |
| 17751 | 0.005 |
| 17752 | 0.005 |
| 17753 | 0.005 |
| 17754 | 0.005 |
| 17755 | 0.005 |
| 17756 | 0.005 |
| 17757 | 0.005 |
| 17758 | 0.005 |
| 17759 | 0.005 |
| 17760 | 0.005 |
| 17761 | 0.005 |
| 17762 | 0.004 |
| 17763 | 0.004 |
| 17764 | 0.005 |
| 17765 | 0.004 |
| 17766 | 0.004 |
| 17767 | 0.004 |
| 17768 | 0.004 |
| 17769 | 0.004 |
| 17770 | 0.004 |
| 17771 | 0.004 |
| 17772 | 0.004 |
| 17773 | 0.004 |
| 17774 | 0.005 |
| 17775 | 0.005 |
| 17776 | 0.005 |
| 17777 | 0.005 |
| 17778 | 0.005 |
| 17779 | 0.004 |
| 17780 | 0.004 |
| 17781 | 0.005 |
| 17782 | 0.005 |
| 17783 | 0.005 |
| 17784 | 0.005 |
| 17785 | 0.005 |
| 17786 | 0.004 |
| 17787 | 0.004 |
| 17788 | 0.004 |
| 17789 | 0.004 |
| 17790 | 0.004 |
| 17791 | 0.004 |
| 17792 | 0.005 |
| 17793 | 0.005 |
| 17794 | 0.005 |
| 17795 | 0.005 |
| 17796 | 0.005 |
| 17797 | 0.005 |
| 17798 | 0.004 |
| 17799 | 0.004 |
| 17800 | 0.005 |
| 17801 | 0.005 |
| 17802 | 0.005 |
| 17803 | 0.005 |
| 17804 | 0.005 |
| 17805 | 0.005 |
| 17806 | 0.005 |
| 17807 | 0.005 |
| 17808 | 0.005 |
| 17809 | 0.005 |
| 17810 | 0.005 |
| 17811 | 0.005 |
| 17812 | 0.005 |
| 17813 | 0.005 |
| 17814 | 0.005 |
| 17815 | 0.005 |
| 17816 | 0.005 |
| 17817 | 0.005 |
| 17818 | 0.005 |
| 17819 | 0.005 |
| 17820 | 0.005 |
| 17821 | 0.005 |
| 17822 | 0.005 |
| 17823 | 0.005 |
| 17824 | 0.005 |
| 17825 | 0.004 |
| 17826 | 0.005 |
| 17827 | 0.005 |
| 17828 | 0.005 |
| 17829 | 0.005 |
| 17830 | 0.005 |
| 17831 | 0.005 |
| 17832 | 0.005 |
| 17833 | 0.005 |
| 17834 | 0.005 |
| 17835 | 0.005 |
| 17836 | 0.005 |
| 17837 | 0.005 |
| 17838 | 0.005 |
| 17839 | 0.005 |
| 17840 | 0.005 |
| 17841 | 0.005 |
| 17842 | 0.004 |
| 17843 | 0.005 |
| 17844 | 0.005 |
| 17845 | 0.005 |
| 17846 | 0.005 |
| 17847 | 0.004 |
| 17848 | 0.004 |
| 17849 | 0.004 |
| 17850 | 0.004 |
| 17851 | 0.004 |
| 17852 | 0.004 |
| 17853 | 0.005 |
| 17854 | 0.005 |
| 17855 | 0.004 |
| 17856 | 0.004 |
| 17857 | 0.005 |
| 17858 | 0.004 |
| 17859 | 0.004 |
| 17860 | 0.005 |
| 17861 | 0.005 |
| 17862 | 0.005 |
| 17863 | 0.005 |
| 17864 | 0.005 |
| 17865 | 0.004 |
| 17866 | 0.004 |
| 17867 | 0.004 |
| 17868 | 0.005 |
| 17869 | 0.005 |
| 17870 | 0.004 |
| 17871 | 0.004 |
| 17872 | 0.004 |
| 17873 | 0.004 |
| 17874 | 0.004 |
| 17875 | 0.004 |
| 17876 | 0.004 |
| 17877 | 0.004 |
| 17878 | 0.004 |
| 17879 | 0.005 |
| 17880 | 0.005 |
| 17881 | 0.005 |
| 17882 | 0.005 |
| 17883 | 0.005 |
| 17884 | 0.005 |
| 17885 | 0.005 |
| 17886 | 0.005 |
| 17887 | 0.005 |
| 17888 | 0.005 |
| 17889 | 0.005 |
| 17890 | 0.005 |
| 17891 | 0.005 |
| 17892 | 0.005 |
| 17893 | 0.005 |
| 17894 | 0.005 |
| 17895 | 0.005 |
| 17896 | 0.005 |
| 17897 | 0.005 |
| 17898 | 0.004 |
| 17899 | 0.005 |
| 17900 | 0.005 |
| 17901 | 0.005 |
| 17902 | 0.005 |
| 17903 | 0.005 |
| 17904 | 0.005 |
| 17905 | 0.005 |
| 17906 | 0.005 |
| 17907 | 0.005 |
| 17908 | 0.005 |
| 17909 | 0.005 |
| 17910 | 0.005 |
| 17911 | 0.005 |
| 17912 | 0.005 |
| 17913 | 0.005 |
| 17914 | 0.005 |
| 17915 | 0.005 |
| 17916 | 0.005 |
| 17917 | 0.005 |
| 17918 | 0.005 |
| 17919 | 0.005 |
| 17920 | 0.005 |
| 17921 | 0.005 |
| 17922 | 0.004 |
| 17923 | 0.004 |
| 17924 | 0.004 |
| 17925 | 0.004 |
| 17926 | 0.005 |
| 17927 | 0.005 |
| 17928 | 0.004 |
| 17929 | 0.004 |
| 17930 | 0.004 |
| 17931 | 0.004 |
| 17932 | 0.004 |
| 17933 | 0.005 |
| 17934 | 0.005 |
| 17935 | 0.005 |
| 17936 | 0.005 |
| 17937 | 0.005 |
| 17938 | 0.005 |
| 17939 | 0.004 |
| 17940 | 0.005 |
| 17941 | 0.005 |
| 17942 | 0.004 |
| 17943 | 0.005 |
| 17944 | 0.005 |
| 17945 | 0.005 |
| 17946 | 0.004 |
| 17947 | 0.004 |
| 17948 | 0.004 |
| 17949 | 0.004 |
| 17950 | 0.004 |
| 17951 | 0.005 |
| 17952 | 0.005 |
| 17953 | 0.005 |
| 17954 | 0.005 |
| 17955 | 0.005 |
| 17956 | 0.005 |
| 17957 | 0.004 |
| 17958 | 0.004 |
| 17959 | 0.004 |
| 17960 | 0.005 |
| 17961 | 0.005 |
| 17962 | 0.005 |
| 17963 | 0.005 |
| 17964 | 0.005 |
| 17965 | 0.005 |
| 17966 | 0.005 |
| 17967 | 0.005 |
| 17968 | 0.005 |
| 17969 | 0.005 |
| 17970 | 0.005 |
| 17971 | 0.005 |
| 17972 | 0.005 |
| 17973 | 0.005 |
| 17974 | 0.005 |
| 17975 | 0.005 |
| 17976 | 0.005 |
| 17977 | 0.005 |
| 17978 | 0.005 |
| 17979 | 0.005 |
| 17980 | 0.005 |
| 17981 | 0.005 |
| 17982 | 0.005 |
| 17983 | 0.005 |
| 17984 | 0.005 |
| 17985 | 0.005 |
| 17986 | 0.005 |
| 17987 | 0.005 |
| 17988 | 0.005 |
| 17989 | 0.005 |
| 17990 | 0.005 |
| 17991 | 0.005 |
| 17992 | 0.005 |
| 17993 | 0.005 |
| 17994 | 0.005 |
| 17995 | 0.005 |
| 17996 | 0.005 |
| 17997 | 0.005 |
| 17998 | 0.005 |
| 17999 | 0.005 |
| 18000 | 0.005 |
| 18001 | 0.005 |
| 18002 | 0.005 |
| 18003 | 0.005 |
| 18004 | 0.004 |
| 18005 | 0.005 |
| 18006 | 0.005 |
| 18007 | 0.005 |
| 18008 | 0.005 |
| 18009 | 0.005 |
| 18010 | 0.005 |
| 18011 | 0.004 |
| 18012 | 0.004 |
| 18013 | 0.005 |
| 18014 | 0.005 |
| 18015 | 0.005 |
| 18016 | 0.005 |
| 18017 | 0.005 |
| 18018 | 0.005 |
| 18019 | 0.004 |
| 18020 | 0.005 |
| 18021 | 0.004 |
| 18022 | 0.005 |
| 18023 | 0.005 |
| 18024 | 0.005 |
| 18025 | 0.005 |
| 18026 | 0.004 |
| 18027 | 0.004 |
| 18028 | 0.004 |
| 18029 | 0.004 |
| 18030 | 0.005 |
| 18031 | 0.005 |
| 18032 | 0.005 |
| 18033 | 0.005 |
| 18034 | 0.005 |
| 18035 | 0.005 |
| 18036 | 0.005 |
| 18037 | 0.004 |
| 18038 | 0.004 |
| 18039 | 0.004 |
| 18040 | 0.005 |
| 18041 | 0.005 |
| 18042 | 0.005 |
| 18043 | 0.005 |
| 18044 | 0.005 |
| 18045 | 0.005 |
| 18046 | 0.005 |
| 18047 | 0.005 |
| 18048 | 0.005 |
| 18049 | 0.005 |
| 18050 | 0.005 |
| 18051 | 0.005 |
| 18052 | 0.005 |
| 18053 | 0.005 |
| 18054 | 0.005 |
| 18055 | 0.005 |
| 18056 | 0.005 |
| 18057 | 0.005 |
| 18058 | 0.005 |
| 18059 | 0.005 |
| 18060 | 0.005 |
| 18061 | 0.005 |
| 18062 | 0.005 |
| 18063 | 0.005 |
| 18064 | 0.005 |
| 18065 | 0.005 |
| 18066 | 0.005 |
| 18067 | 0.005 |
| 18068 | 0.005 |
| 18069 | 0.005 |
| 18070 | 0.005 |
| 18071 | 0.005 |
| 18072 | 0.005 |
| 18073 | 0.005 |
| 18074 | 0.005 |
| 18075 | 0.005 |
| 18076 | 0.005 |
| 18077 | 0.005 |
| 18078 | 0.005 |
| 18079 | 0.005 |
| 18080 | 0.005 |
| 18081 | 0.005 |
| 18082 | 0.005 |
| 18083 | 0.005 |
| 18084 | 0.005 |
| 18085 | 0.005 |
| 18086 | 0.004 |
| 18087 | 0.004 |
| 18088 | 0.004 |
| 18089 | 0.004 |
| 18090 | 0.004 |
| 18091 | 0.005 |
| 18092 | 0.005 |
| 18093 | 0.005 |
| 18094 | 0.005 |
| 18095 | 0.005 |
| 18096 | 0.005 |
| 18097 | 0.004 |
| 18098 | 0.005 |
| 18099 | 0.005 |
| 18100 | 0.005 |
| 18101 | 0.005 |
| 18102 | 0.005 |
| 18103 | 0.005 |
| 18104 | 0.005 |
| 18105 | 0.004 |
| 18106 | 0.005 |
| 18107 | 0.004 |
| 18108 | 0.004 |
| 18109 | 0.005 |
| 18110 | 0.005 |
| 18111 | 0.005 |
| 18112 | 0.004 |
| 18113 | 0.005 |
| 18114 | 0.005 |
| 18115 | 0.005 |
| 18116 | 0.005 |
| 18117 | 0.005 |
| 18118 | 0.004 |
| 18119 | 0.004 |
| 18120 | 0.005 |
| 18121 | 0.005 |
| 18122 | 0.005 |
| 18123 | 0.005 |
| 18124 | 0.005 |
| 18125 | 0.005 |
| 18126 | 0.005 |
| 18127 | 0.005 |
| 18128 | 0.005 |
| 18129 | 0.005 |
| 18130 | 0.005 |
| 18131 | 0.005 |
| 18132 | 0.005 |
| 18133 | 0.005 |
| 18134 | 0.005 |
| 18135 | 0.005 |
| 18136 | 0.005 |
| 18137 | 0.005 |
| 18138 | 0.005 |
| 18139 | 0.005 |
| 18140 | 0.005 |
| 18141 | 0.005 |
| 18142 | 0.005 |
| 18143 | 0.005 |
| 18144 | 0.005 |
| 18145 | 0.005 |
| 18146 | 0.005 |
| 18147 | 0.005 |
| 18148 | 0.005 |
| 18149 | 0.005 |
| 18150 | 0.005 |
| 18151 | 0.005 |
| 18152 | 0.005 |
| 18153 | 0.005 |
| 18154 | 0.005 |
| 18155 | 0.005 |
| 18156 | 0.005 |
| 18157 | 0.005 |
| 18158 | 0.005 |
| 18159 | 0.005 |
| 18160 | 0.005 |
| 18161 | 0.004 |
| 18162 | 0.004 |
| 18163 | 0.005 |
| 18164 | 0.005 |
| 18165 | 0.005 |
| 18166 | 0.004 |
| 18167 | 0.004 |
| 18168 | 0.004 |
| 18169 | 0.004 |
| 18170 | 0.004 |
| 18171 | 0.005 |
| 18172 | 0.005 |
| 18173 | 0.005 |
| 18174 | 0.005 |
| 18175 | 0.005 |
| 18176 | 0.005 |
| 18177 | 0.005 |
| 18178 | 0.005 |
| 18179 | 0.005 |
| 18180 | 0.004 |
| 18181 | 0.005 |
| 18182 | 0.005 |
| 18183 | 0.005 |
| 18184 | 0.004 |
| 18185 | 0.004 |
| 18186 | 0.004 |
| 18187 | 0.004 |
| 18188 | 0.004 |
| 18189 | 0.005 |
| 18190 | 0.005 |
| 18191 | 0.005 |
| 18192 | 0.005 |
| 18193 | 0.005 |
| 18194 | 0.004 |
| 18195 | 0.004 |
| 18196 | 0.005 |
| 18197 | 0.005 |
| 18198 | 0.005 |
| 18199 | 0.005 |
| 18200 | 0.005 |
| 18201 | 0.005 |
| 18202 | 0.005 |
| 18203 | 0.005 |
| 18204 | 0.005 |
| 18205 | 0.005 |
| 18206 | 0.005 |
| 18207 | 0.005 |
| 18208 | 0.005 |
| 18209 | 0.005 |
| 18210 | 0.005 |
| 18211 | 0.005 |
| 18212 | 0.005 |
| 18213 | 0.005 |
| 18214 | 0.005 |
| 18215 | 0.005 |
| 18216 | 0.005 |
| 18217 | 0.005 |
| 18218 | 0.005 |
| 18219 | 0.005 |
| 18220 | 0.005 |
| 18221 | 0.005 |
| 18222 | 0.005 |
| 18223 | 0.005 |
| 18224 | 0.005 |
| 18225 | 0.005 |
| 18226 | 0.005 |
| 18227 | 0.005 |
| 18228 | 0.005 |
| 18229 | 0.005 |
| 18230 | 0.005 |
| 18231 | 0.005 |
| 18232 | 0.005 |
| 18233 | 0.005 |
| 18234 | 0.005 |
| 18235 | 0.005 |
| 18236 | 0.004 |
| 18237 | 0.005 |
| 18238 | 0.005 |
| 18239 | 0.005 |
| 18240 | 0.005 |
| 18241 | 0.005 |
| 18242 | 0.005 |
| 18243 | 0.004 |
| 18244 | 0.005 |
| 18245 | 0.005 |
| 18246 | 0.005 |
| 18247 | 0.005 |
| 18248 | 0.005 |
| 18249 | 0.005 |
| 18250 | 0.005 |
| 18251 | 0.004 |
| 18252 | 0.004 |
| 18253 | 0.005 |
| 18254 | 0.005 |
| 18255 | 0.005 |
| 18256 | 0.005 |
| 18257 | 0.005 |
| 18258 | 0.005 |
| 18259 | 0.005 |
| 18260 | 0.005 |
| 18261 | 0.004 |
| 18262 | 0.005 |
| 18263 | 0.005 |
| 18264 | 0.005 |
| 18265 | 0.005 |
| 18266 | 0.004 |
| 18267 | 0.004 |
| 18268 | 0.004 |
| 18269 | 0.004 |
| 18270 | 0.005 |
| 18271 | 0.005 |
| 18272 | 0.005 |
| 18273 | 0.005 |
| 18274 | 0.005 |
| 18275 | 0.005 |
| 18276 | 0.005 |
| 18277 | 0.004 |
| 18278 | 0.004 |
| 18279 | 0.005 |
| 18280 | 0.005 |
| 18281 | 0.005 |
| 18282 | 0.005 |
| 18283 | 0.005 |
| 18284 | 0.005 |
| 18285 | 0.005 |
| 18286 | 0.005 |
| 18287 | 0.005 |
| 18288 | 0.005 |
| 18289 | 0.005 |
| 18290 | 0.005 |
| 18291 | 0.005 |
| 18292 | 0.005 |
| 18293 | 0.005 |
| 18294 | 0.005 |
| 18295 | 0.005 |
| 18296 | 0.005 |
| 18297 | 0.005 |
| 18298 | 0.005 |
| 18299 | 0.005 |
| 18300 | 0.005 |
| 18301 | 0.005 |
| 18302 | 0.005 |
| 18303 | 0.005 |
| 18304 | 0.005 |
| 18305 | 0.005 |
| 18306 | 0.005 |
| 18307 | 0.005 |
| 18308 | 0.005 |
| 18309 | 0.005 |
| 18310 | 0.005 |
| 18311 | 0.005 |
| 18312 | 0.005 |
| 18313 | 0.005 |
| 18314 | 0.005 |
| 18315 | 0.004 |
| 18316 | 0.005 |
| 18317 | 0.005 |
| 18318 | 0.005 |
| 18319 | 0.005 |
| 18320 | 0.005 |
| 18321 | 0.005 |
| 18322 | 0.005 |
| 18323 | 0.004 |
| 18324 | 0.005 |
| 18325 | 0.005 |
| 18326 | 0.005 |
| 18327 | 0.005 |
| 18328 | 0.005 |
| 18329 | 0.005 |
| 18330 | 0.004 |
| 18331 | 0.004 |
| 18332 | 0.004 |
| 18333 | 0.004 |
| 18334 | 0.004 |
| 18335 | 0.005 |
| 18336 | 0.005 |
| 18337 | 0.005 |
| 18338 | 0.004 |
| 18339 | 0.004 |
| 18340 | 0.004 |
| 18341 | 0.004 |
| 18342 | 0.005 |
| 18343 | 0.005 |
| 18344 | 0.005 |
| 18345 | 0.005 |
| 18346 | 0.005 |
| 18347 | 0.004 |
| 18348 | 0.004 |
| 18349 | 0.004 |
| 18350 | 0.004 |
| 18351 | 0.005 |
| 18352 | 0.005 |
| 18353 | 0.005 |
| 18354 | 0.005 |
| 18355 | 0.005 |
| 18356 | 0.005 |
| 18357 | 0.005 |
| 18358 | 0.005 |
| 18359 | 0.005 |
| 18360 | 0.005 |
| 18361 | 0.005 |
| 18362 | 0.005 |
| 18363 | 0.005 |
| 18364 | 0.005 |
| 18365 | 0.005 |
| 18366 | 0.005 |
| 18367 | 0.005 |
| 18368 | 0.005 |
| 18369 | 0.005 |
| 18370 | 0.005 |
| 18371 | 0.005 |
| 18372 | 0.005 |
| 18373 | 0.005 |
| 18374 | 0.005 |
| 18375 | 0.005 |
| 18376 | 0.005 |
| 18377 | 0.005 |
| 18378 | 0.005 |
| 18379 | 0.005 |
| 18380 | 0.005 |
| 18381 | 0.005 |
| 18382 | 0.005 |
| 18383 | 0.005 |
| 18384 | 0.005 |
| 18385 | 0.005 |
| 18386 | 0.005 |
| 18387 | 0.005 |
| 18388 | 0.005 |
| 18389 | 0.005 |
| 18390 | 0.005 |
| 18391 | 0.005 |
| 18392 | 0.005 |
| 18393 | 0.005 |
| 18394 | 0.004 |
| 18395 | 0.005 |
| 18396 | 0.005 |
| 18397 | 0.005 |
| 18398 | 0.005 |
| 18399 | 0.005 |
| 18400 | 0.005 |
| 18401 | 0.005 |
| 18402 | 0.004 |
| 18403 | 0.004 |
| 18404 | 0.005 |
| 18405 | 0.005 |
| 18406 | 0.005 |
| 18407 | 0.004 |
| 18408 | 0.004 |
| 18409 | 0.004 |
| 18410 | 0.004 |
| 18411 | 0.004 |
| 18412 | 0.004 |
| 18413 | 0.004 |
| 18414 | 0.004 |
| 18415 | 0.004 |
| 18416 | 0.005 |
| 18417 | 0.005 |
| 18418 | 0.004 |
| 18419 | 0.004 |
| 18420 | 0.004 |
| 18421 | 0.004 |
| 18422 | 0.005 |
| 18423 | 0.005 |
| 18424 | 0.005 |
| 18425 | 0.005 |
| 18426 | 0.004 |
| 18427 | 0.004 |
| 18428 | 0.004 |
| 18429 | 0.004 |
| 18430 | 0.005 |
| 18431 | 0.005 |
| 18432 | 0.004 |
| 18433 | 0.004 |
| 18434 | 0.005 |
| 18435 | 0.004 |
| 18436 | 0.004 |
| 18437 | 0.004 |
| 18438 | 0.004 |
| 18439 | 0.004 |
| 18440 | 0.004 |
| 18441 | 0.005 |
| 18442 | 0.005 |
| 18443 | 0.005 |
| 18444 | 0.005 |
| 18445 | 0.005 |
| 18446 | 0.005 |
| 18447 | 0.005 |
| 18448 | 0.005 |
| 18449 | 0.004 |
| 18450 | 0.005 |
| 18451 | 0.005 |
| 18452 | 0.005 |
| 18453 | 0.005 |
| 18454 | 0.005 |
| 18455 | 0.005 |
| 18456 | 0.005 |
| 18457 | 0.005 |
| 18458 | 0.005 |
| 18459 | 0.005 |
| 18460 | 0.005 |
| 18461 | 0.005 |
| 18462 | 0.005 |
| 18463 | 0.005 |
| 18464 | 0.005 |
| 18465 | 0.005 |
| 18466 | 0.005 |
| 18467 | 0.005 |
| 18468 | 0.005 |
| 18469 | 0.005 |
| 18470 | 0.005 |
| 18471 | 0.005 |
| 18472 | 0.004 |
| 18473 | 0.004 |
| 18474 | 0.004 |
| 18475 | 0.004 |
| 18476 | 0.005 |
| 18477 | 0.005 |
| 18478 | 0.005 |
| 18479 | 0.004 |
| 18480 | 0.004 |
| 18481 | 0.004 |
| 18482 | 0.004 |
| 18483 | 0.004 |
| 18484 | 0.005 |
| 18485 | 0.005 |
| 18486 | 0.005 |
| 18487 | 0.004 |
| 18488 | 0.004 |
| 18489 | 0.004 |
| 18490 | 0.004 |
| 18491 | 0.004 |
| 18492 | 0.004 |
| 18493 | 0.004 |
| 18494 | 0.004 |
| 18495 | 0.004 |
| 18496 | 0.004 |
| 18497 | 0.004 |
| 18498 | 0.004 |
| 18499 | 0.004 |
| 18500 | 0.004 |
| 18501 | 0.004 |
| 18502 | 0.005 |
| 18503 | 0.005 |
| 18504 | 0.005 |
| 18505 | 0.005 |
| 18506 | 0.004 |
| 18507 | 0.004 |
| 18508 | 0.004 |
| 18509 | 0.004 |
| 18510 | 0.004 |
| 18511 | 0.004 |
| 18512 | 0.004 |
| 18513 | 0.004 |
| 18514 | 0.005 |
| 18515 | 0.005 |
| 18516 | 0.005 |
| 18517 | 0.005 |
| 18518 | 0.004 |
| 18519 | 0.004 |
| 18520 | 0.004 |
| 18521 | 0.004 |
| 18522 | 0.004 |
| 18523 | 0.005 |
| 18524 | 0.005 |
| 18525 | 0.005 |
| 18526 | 0.005 |
| 18527 | 0.005 |
| 18528 | 0.005 |
| 18529 | 0.005 |
| 18530 | 0.005 |
| 18531 | 0.005 |
| 18532 | 0.005 |
| 18533 | 0.005 |
| 18534 | 0.005 |
| 18535 | 0.005 |
| 18536 | 0.005 |
| 18537 | 0.005 |
| 18538 | 0.005 |
| 18539 | 0.005 |
| 18540 | 0.005 |
| 18541 | 0.005 |
| 18542 | 0.005 |
| 18543 | 0.005 |
| 18544 | 0.005 |
| 18545 | 0.004 |
| 18546 | 0.004 |
| 18547 | 0.004 |
| 18548 | 0.005 |
| 18549 | 0.005 |
| 18550 | 0.005 |
| 18551 | 0.005 |
| 18552 | 0.004 |
| 18553 | 0.004 |
| 18554 | 0.004 |
| 18555 | 0.004 |
| 18556 | 0.005 |
| 18557 | 0.005 |
| 18558 | 0.005 |
| 18559 | 0.005 |
| 18560 | 0.005 |
| 18561 | 0.004 |
| 18562 | 0.004 |
| 18563 | 0.004 |
| 18564 | 0.005 |
| 18565 | 0.004 |
| 18566 | 0.004 |
| 18567 | 0.004 |
| 18568 | 0.004 |
| 18569 | 0.004 |
| 18570 | 0.004 |
| 18571 | 0.004 |
| 18572 | 0.004 |
| 18573 | 0.004 |
| 18574 | 0.004 |
| 18575 | 0.005 |
| 18576 | 0.004 |
| 18577 | 0.004 |
| 18578 | 0.004 |
| 18579 | 0.004 |
| 18580 | 0.004 |
| 18581 | 0.005 |
| 18582 | 0.005 |
| 18583 | 0.005 |
| 18584 | 0.005 |
| 18585 | 0.005 |
| 18586 | 0.004 |
| 18587 | 0.004 |
| 18588 | 0.004 |
| 18589 | 0.004 |
| 18590 | 0.004 |
| 18591 | 0.004 |
| 18592 | 0.004 |
| 18593 | 0.004 |
| 18594 | 0.004 |
| 18595 | 0.004 |
| 18596 | 0.005 |
| 18597 | 0.004 |
| 18598 | 0.004 |
| 18599 | 0.004 |
| 18600 | 0.005 |
| 18601 | 0.005 |
| 18602 | 0.004 |
| 18603 | 0.005 |
| 18604 | 0.005 |
| 18605 | 0.005 |
| 18606 | 0.005 |
| 18607 | 0.005 |
| 18608 | 0.005 |
| 18609 | 0.005 |
| 18610 | 0.005 |
| 18611 | 0.005 |
| 18612 | 0.005 |
| 18613 | 0.005 |
| 18614 | 0.005 |
| 18615 | 0.005 |
| 18616 | 0.005 |
| 18617 | 0.005 |
| 18618 | 0.005 |
| 18619 | 0.005 |
| 18620 | 0.005 |
| 18621 | 0.005 |
| 18622 | 0.005 |
| 18623 | 0.005 |
| 18624 | 0.004 |
| 18625 | 0.004 |
| 18626 | 0.004 |
| 18627 | 0.004 |
| 18628 | 0.005 |
| 18629 | 0.005 |
| 18630 | 0.005 |
| 18631 | 0.005 |
| 18632 | 0.005 |
| 18633 | 0.005 |
| 18634 | 0.005 |
| 18635 | 0.004 |
| 18636 | 0.005 |
| 18637 | 0.005 |
| 18638 | 0.005 |
| 18639 | 0.005 |
| 18640 | 0.005 |
| 18641 | 0.004 |
| 18642 | 0.004 |
| 18643 | 0.004 |
| 18644 | 0.004 |
| 18645 | 0.004 |
| 18646 | 0.004 |
| 18647 | 0.004 |
| 18648 | 0.004 |
| 18649 | 0.004 |
| 18650 | 0.004 |
| 18651 | 0.004 |
| 18652 | 0.004 |
| 18653 | 0.004 |
| 18654 | 0.004 |
| 18655 | 0.005 |
| 18656 | 0.005 |
| 18657 | 0.005 |
| 18658 | 0.004 |
| 18659 | 0.004 |
| 18660 | 0.004 |
| 18661 | 0.004 |
| 18662 | 0.005 |
| 18663 | 0.004 |
| 18664 | 0.004 |
| 18665 | 0.004 |
| 18666 | 0.004 |
| 18667 | 0.004 |
| 18668 | 0.004 |
| 18669 | 0.004 |
| 18670 | 0.004 |
| 18671 | 0.004 |
| 18672 | 0.005 |
| 18673 | 0.005 |
| 18674 | 0.005 |
| 18675 | 0.005 |
| 18676 | 0.005 |
| 18677 | 0.005 |
| 18678 | 0.004 |
| 18679 | 0.004 |
| 18680 | 0.004 |
| 18681 | 0.004 |
| 18682 | 0.005 |
| 18683 | 0.005 |
| 18684 | 0.005 |
| 18685 | 0.005 |
| 18686 | 0.005 |
| 18687 | 0.005 |
| 18688 | 0.005 |
| 18689 | 0.005 |
| 18690 | 0.005 |
| 18691 | 0.005 |
| 18692 | 0.005 |
| 18693 | 0.005 |
| 18694 | 0.005 |
| 18695 | 0.005 |
| 18696 | 0.005 |
| 18697 | 0.005 |
| 18698 | 0.005 |
| 18699 | 0.005 |
| 18700 | 0.005 |
| 18701 | 0.004 |
| 18702 | 0.005 |
| 18703 | 0.005 |
| 18704 | 0.005 |
| 18705 | 0.005 |
| 18706 | 0.005 |
| 18707 | 0.005 |
| 18708 | 0.004 |
| 18709 | 0.005 |
| 18710 | 0.004 |
| 18711 | 0.004 |
| 18712 | 0.005 |
| 18713 | 0.005 |
| 18714 | 0.005 |
| 18715 | 0.005 |
| 18716 | 0.005 |
| 18717 | 0.005 |
| 18718 | 0.004 |
| 18719 | 0.004 |
| 18720 | 0.005 |
| 18721 | 0.005 |
| 18722 | 0.005 |
| 18723 | 0.005 |
| 18724 | 0.005 |
| 18725 | 0.004 |
| 18726 | 0.004 |
| 18727 | 0.004 |
| 18728 | 0.004 |
| 18729 | 0.004 |
| 18730 | 0.004 |
| 18731 | 0.004 |
| 18732 | 0.004 |
| 18733 | 0.004 |
| 18734 | 0.004 |
| 18735 | 0.004 |
| 18736 | 0.004 |
| 18737 | 0.005 |
| 18738 | 0.005 |
| 18739 | 0.005 |
| 18740 | 0.004 |
| 18741 | 0.004 |
| 18742 | 0.004 |
| 18743 | 0.004 |
| 18744 | 0.004 |
| 18745 | 0.004 |
| 18746 | 0.004 |
| 18747 | 0.004 |
| 18748 | 0.005 |
| 18749 | 0.004 |
| 18750 | 0.004 |
| 18751 | 0.004 |
| 18752 | 0.004 |
| 18753 | 0.005 |
| 18754 | 0.004 |
| 18755 | 0.004 |
| 18756 | 0.005 |
| 18757 | 0.005 |
| 18758 | 0.004 |
| 18759 | 0.005 |
| 18760 | 0.005 |
| 18761 | 0.005 |
| 18762 | 0.005 |
| 18763 | 0.005 |
| 18764 | 0.005 |
| 18765 | 0.005 |
| 18766 | 0.005 |
| 18767 | 0.005 |
| 18768 | 0.005 |
| 18769 | 0.005 |
| 18770 | 0.005 |
| 18771 | 0.005 |
| 18772 | 0.005 |
| 18773 | 0.005 |
| 18774 | 0.005 |
| 18775 | 0.005 |
| 18776 | 0.005 |
| 18777 | 0.005 |
| 18778 | 0.005 |
| 18779 | 0.005 |
| 18780 | 0.005 |
| 18781 | 0.005 |
| 18782 | 0.005 |
| 18783 | 0.005 |
| 18784 | 0.005 |
| 18785 | 0.005 |
| 18786 | 0.005 |
| 18787 | 0.005 |
| 18788 | 0.005 |
| 18789 | 0.005 |
| 18790 | 0.005 |
| 18791 | 0.005 |
| 18792 | 0.005 |
| 18793 | 0.005 |
| 18794 | 0.005 |
| 18795 | 0.004 |
| 18796 | 0.004 |
| 18797 | 0.005 |
| 18798 | 0.005 |
| 18799 | 0.005 |
| 18800 | 0.005 |
| 18801 | 0.005 |
| 18802 | 0.005 |
| 18803 | 0.005 |
| 18804 | 0.004 |
| 18805 | 0.004 |
| 18806 | 0.004 |
| 18807 | 0.005 |
| 18808 | 0.005 |
| 18809 | 0.005 |
| 18810 | 0.004 |
| 18811 | 0.004 |
| 18812 | 0.004 |
| 18813 | 0.004 |
| 18814 | 0.004 |
| 18815 | 0.004 |
| 18816 | 0.004 |
| 18817 | 0.005 |
| 18818 | 0.005 |
| 18819 | 0.004 |
| 18820 | 0.004 |
| 18821 | 0.004 |
| 18822 | 0.004 |
| 18823 | 0.004 |
| 18824 | 0.004 |
| 18825 | 0.005 |
| 18826 | 0.005 |
| 18827 | 0.005 |
| 18828 | 0.004 |
| 18829 | 0.004 |
| 18830 | 0.004 |
| 18831 | 0.004 |
| 18832 | 0.004 |
| 18833 | 0.004 |
| 18834 | 0.004 |
| 18835 | 0.004 |
| 18836 | 0.005 |
| 18837 | 0.005 |
| 18838 | 0.005 |
| 18839 | 0.005 |
| 18840 | 0.005 |
| 18841 | 0.005 |
| 18842 | 0.005 |
| 18843 | 0.005 |
| 18844 | 0.005 |
| 18845 | 0.005 |
| 18846 | 0.005 |
| 18847 | 0.005 |
| 18848 | 0.005 |
| 18849 | 0.005 |
| 18850 | 0.005 |
| 18851 | 0.005 |
| 18852 | 0.005 |
| 18853 | 0.005 |
| 18854 | 0.005 |
| 18855 | 0.005 |
| 18856 | 0.005 |
| 18857 | 0.005 |
| 18858 | 0.005 |
| 18859 | 0.005 |
| 18860 | 0.005 |
| 18861 | 0.004 |
| 18862 | 0.004 |
| 18863 | 0.004 |
| 18864 | 0.005 |
| 18865 | 0.005 |
| 18866 | 0.005 |
| 18867 | 0.005 |
| 18868 | 0.005 |
| 18869 | 0.005 |
| 18870 | 0.005 |
| 18871 | 0.005 |
| 18872 | 0.005 |
| 18873 | 0.005 |
| 18874 | 0.005 |
| 18875 | 0.005 |
| 18876 | 0.005 |
| 18877 | 0.005 |
| 18878 | 0.005 |
| 18879 | 0.005 |
| 18880 | 0.005 |
| 18881 | 0.005 |
| 18882 | 0.004 |
| 18883 | 0.005 |
| 18884 | 0.004 |
| 18885 | 0.004 |
| 18886 | 0.004 |
| 18887 | 0.004 |
| 18888 | 0.004 |
| 18889 | 0.004 |
| 18890 | 0.005 |
| 18891 | 0.005 |
| 18892 | 0.004 |
| 18893 | 0.004 |
| 18894 | 0.004 |
| 18895 | 0.004 |
| 18896 | 0.004 |
| 18897 | 0.005 |
| 18898 | 0.005 |
| 18899 | 0.005 |
| 18900 | 0.005 |
| 18901 | 0.005 |
| 18902 | 0.004 |
| 18903 | 0.004 |
| 18904 | 0.004 |
| 18905 | 0.005 |
| 18906 | 0.004 |
| 18907 | 0.005 |
| 18908 | 0.004 |
| 18909 | 0.004 |
| 18910 | 0.004 |
| 18911 | 0.004 |
| 18912 | 0.004 |
| 18913 | 0.004 |
| 18914 | 0.004 |
| 18915 | 0.005 |
| 18916 | 0.005 |
| 18917 | 0.005 |
| 18918 | 0.005 |
| 18919 | 0.005 |
| 18920 | 0.005 |
| 18921 | 0.005 |
| 18922 | 0.004 |
| 18923 | 0.004 |
| 18924 | 0.005 |
| 18925 | 0.005 |
| 18926 | 0.005 |
| 18927 | 0.005 |
| 18928 | 0.005 |
| 18929 | 0.005 |
| 18930 | 0.005 |
| 18931 | 0.005 |
| 18932 | 0.005 |
| 18933 | 0.005 |
| 18934 | 0.005 |
| 18935 | 0.005 |
| 18936 | 0.005 |
| 18937 | 0.005 |
| 18938 | 0.005 |
| 18939 | 0.005 |
| 18940 | 0.005 |
| 18941 | 0.005 |
| 18942 | 0.004 |
| 18943 | 0.004 |
| 18944 | 0.005 |
| 18945 | 0.005 |
| 18946 | 0.005 |
| 18947 | 0.005 |
| 18948 | 0.004 |
| 18949 | 0.005 |
| 18950 | 0.005 |
| 18951 | 0.005 |
| 18952 | 0.005 |
| 18953 | 0.005 |
| 18954 | 0.005 |
| 18955 | 0.005 |
| 18956 | 0.005 |
| 18957 | 0.004 |
| 18958 | 0.005 |
| 18959 | 0.005 |
| 18960 | 0.005 |
| 18961 | 0.004 |
| 18962 | 0.005 |
| 18963 | 0.005 |
| 18964 | 0.004 |
| 18965 | 0.004 |
| 18966 | 0.004 |
| 18967 | 0.004 |
| 18968 | 0.004 |
| 18969 | 0.004 |
| 18970 | 0.005 |
| 18971 | 0.004 |
| 18972 | 0.004 |
| 18973 | 0.004 |
| 18974 | 0.004 |
| 18975 | 0.004 |
| 18976 | 0.004 |
| 18977 | 0.005 |
| 18978 | 0.005 |
| 18979 | 0.005 |
| 18980 | 0.005 |
| 18981 | 0.004 |
| 18982 | 0.004 |
| 18983 | 0.004 |
| 18984 | 0.005 |
| 18985 | 0.005 |
| 18986 | 0.004 |
| 18987 | 0.005 |
| 18988 | 0.004 |
| 18989 | 0.004 |
| 18990 | 0.004 |
| 18991 | 0.004 |
| 18992 | 0.004 |
| 18993 | 0.004 |
| 18994 | 0.004 |
| 18995 | 0.005 |
| 18996 | 0.005 |
| 18997 | 0.005 |
| 18998 | 0.005 |
| 18999 | 0.005 |
| 19000 | 0.005 |
| 19001 | 0.005 |
| 19002 | 0.004 |
| 19003 | 0.005 |
| 19004 | 0.005 |
| 19005 | 0.005 |
| 19006 | 0.005 |
| 19007 | 0.005 |
| 19008 | 0.005 |
| 19009 | 0.005 |
| 19010 | 0.005 |
| 19011 | 0.005 |
| 19012 | 0.005 |
| 19013 | 0.005 |
| 19014 | 0.005 |
| 19015 | 0.005 |
| 19016 | 0.005 |
| 19017 | 0.005 |
| 19018 | 0.005 |
| 19019 | 0.005 |
| 19020 | 0.005 |
| 19021 | 0.004 |
| 19022 | 0.004 |
| 19023 | 0.005 |
| 19024 | 0.005 |
| 19025 | 0.005 |
| 19026 | 0.005 |
| 19027 | 0.004 |
| 19028 | 0.005 |
| 19029 | 0.005 |
| 19030 | 0.005 |
| 19031 | 0.005 |
| 19032 | 0.005 |
| 19033 | 0.005 |
| 19034 | 0.005 |
| 19035 | 0.005 |
| 19036 | 0.005 |
| 19037 | 0.005 |
| 19038 | 0.005 |
| 19039 | 0.005 |
| 19040 | 0.004 |
| 19041 | 0.005 |
| 19042 | 0.005 |
| 19043 | 0.005 |
| 19044 | 0.004 |
| 19045 | 0.004 |
| 19046 | 0.004 |
| 19047 | 0.004 |
| 19048 | 0.004 |
| 19049 | 0.004 |
| 19050 | 0.005 |
| 19051 | 0.005 |
| 19052 | 0.005 |
| 19053 | 0.004 |
| 19054 | 0.004 |
| 19055 | 0.004 |
| 19056 | 0.004 |
| 19057 | 0.005 |
| 19058 | 0.005 |
| 19059 | 0.005 |
| 19060 | 0.005 |
| 19061 | 0.005 |
| 19062 | 0.004 |
| 19063 | 0.004 |
| 19064 | 0.004 |
| 19065 | 0.004 |
| 19066 | 0.004 |
| 19067 | 0.005 |
| 19068 | 0.004 |
| 19069 | 0.004 |
| 19070 | 0.004 |
| 19071 | 0.004 |
| 19072 | 0.004 |
| 19073 | 0.004 |
| 19074 | 0.005 |
| 19075 | 0.005 |
| 19076 | 0.005 |
| 19077 | 0.005 |
| 19078 | 0.005 |
| 19079 | 0.005 |
| 19080 | 0.005 |
| 19081 | 0.004 |
| 19082 | 0.004 |
| 19083 | 0.005 |
| 19084 | 0.005 |
| 19085 | 0.005 |
| 19086 | 0.005 |
| 19087 | 0.005 |
| 19088 | 0.005 |
| 19089 | 0.005 |
| 19090 | 0.005 |
| 19091 | 0.005 |
| 19092 | 0.005 |
| 19093 | 0.005 |
| 19094 | 0.005 |
| 19095 | 0.005 |
| 19096 | 0.005 |
| 19097 | 0.005 |
| 19098 | 0.005 |
| 19099 | 0.005 |
| 19100 | 0.005 |
| 19101 | 0.005 |
| 19102 | 0.005 |
| 19103 | 0.005 |
| 19104 | 0.005 |
| 19105 | 0.005 |
| 19106 | 0.005 |
| 19107 | 0.005 |
| 19108 | 0.005 |
| 19109 | 0.005 |
| 19110 | 0.005 |
| 19111 | 0.005 |
| 19112 | 0.005 |
| 19113 | 0.005 |
| 19114 | 0.005 |
| 19115 | 0.005 |
| 19116 | 0.005 |
| 19117 | 0.005 |
| 19118 | 0.005 |
| 19119 | 0.005 |
| 19120 | 0.005 |
| 19121 | 0.005 |
| 19122 | 0.005 |
| 19123 | 0.005 |
| 19124 | 0.005 |
| 19125 | 0.005 |
| 19126 | 0.005 |
| 19127 | 0.005 |
| 19128 | 0.005 |
| 19129 | 0.005 |
| 19130 | 0.004 |
| 19131 | 0.005 |
| 19132 | 0.004 |
| 19133 | 0.005 |
| 19134 | 0.005 |
| 19135 | 0.005 |
| 19136 | 0.005 |
| 19137 | 0.005 |
| 19138 | 0.005 |
| 19139 | 0.005 |
| 19140 | 0.005 |
| 19141 | 0.005 |
| 19142 | 0.005 |
| 19143 | 0.005 |
| 19144 | 0.005 |
| 19145 | 0.005 |
| 19146 | 0.005 |
| 19147 | 0.005 |
| 19148 | 0.005 |
| 19149 | 0.005 |
| 19150 | 0.005 |
| 19151 | 0.005 |
| 19152 | 0.005 |
| 19153 | 0.005 |
| 19154 | 0.005 |
| 19155 | 0.005 |
| 19156 | 0.005 |
| 19157 | 0.005 |
| 19158 | 0.005 |
| 19159 | 0.005 |
| 19160 | 0.005 |
| 19161 | 0.005 |
| 19162 | 0.005 |
| 19163 | 0.005 |
| 19164 | 0.005 |
| 19165 | 0.005 |
| 19166 | 0.005 |
| 19167 | 0.005 |
| 19168 | 0.005 |
| 19169 | 0.005 |
| 19170 | 0.005 |
| 19171 | 0.005 |
| 19172 | 0.005 |
| 19173 | 0.005 |
| 19174 | 0.005 |
| 19175 | 0.005 |
| 19176 | 0.005 |
| 19177 | 0.005 |
| 19178 | 0.005 |
| 19179 | 0.005 |
| 19180 | 0.005 |
| 19181 | 0.005 |
| 19182 | 0.005 |
| 19183 | 0.005 |
| 19184 | 0.005 |
| 19185 | 0.004 |
| 19186 | 0.004 |
| 19187 | 0.004 |
| 19188 | 0.004 |
| 19189 | 0.005 |
| 19190 | 0.005 |
| 19191 | 0.004 |
| 19192 | 0.004 |
| 19193 | 0.004 |
| 19194 | 0.004 |
| 19195 | 0.004 |
| 19196 | 0.004 |
| 19197 | 0.005 |
| 19198 | 0.005 |
| 19199 | 0.004 |
| 19200 | 0.004 |
| 19201 | 0.004 |
| 19202 | 0.004 |
| 19203 | 0.004 |
| 19204 | 0.004 |
| 19205 | 0.004 |
| 19206 | 0.004 |
| 19207 | 0.004 |
| 19208 | 0.004 |
| 19209 | 0.004 |
| 19210 | 0.004 |
| 19211 | 0.004 |
| 19212 | 0.004 |
| 19213 | 0.004 |
| 19214 | 0.004 |
| 19215 | 0.004 |
| 19216 | 0.004 |
| 19217 | 0.004 |
| 19218 | 0.004 |
| 19219 | 0.004 |
| 19220 | 0.004 |
| 19221 | 0.004 |
| 19222 | 0.004 |
| 19223 | 0.004 |
| 19224 | 0.004 |
| 19225 | 0.004 |
| 19226 | 0.004 |
| 19227 | 0.004 |
| 19228 | 0.004 |
| 19229 | 0.004 |
| 19230 | 0.004 |
| 19231 | 0.004 |
| 19232 | 0.004 |
| 19233 | 0.004 |
| 19234 | 0.004 |
| 19235 | 0.004 |
| 19236 | 0.004 |
| 19237 | 0.004 |
| 19238 | 0.004 |
| 19239 | 0.004 |
| 19240 | 0.004 |
| 19241 | 0.004 |
| 19242 | 0.004 |
| 19243 | 0.004 |
| 19244 | 0.004 |
| 19245 | 0.004 |
| 19246 | 0.004 |
| 19247 | 0.004 |
| 19248 | 0.004 |
| 19249 | 0.004 |
| 19250 | 0.004 |
| 19251 | 0.004 |
| 19252 | 0.004 |
| 19253 | 0.004 |
| 19254 | 0.004 |
| 19255 | 0.004 |
| 19256 | 0.004 |
| 19257 | 0.004 |
| 19258 | 0.004 |
| 19259 | 0.004 |
| 19260 | 0.004 |
| 19261 | 0.004 |
| 19262 | 0.004 |
| 19263 | 0.004 |
| 19264 | 0.004 |
| 19265 | 0.004 |
| 19266 | 0.004 |
| 19267 | 0.004 |
| 19268 | 0.004 |
| 19269 | 0.004 |
| 19270 | 0.004 |
| 19271 | 0.004 |
| 19272 | 0.004 |
| 19273 | 0.004 |
| 19274 | 0.004 |
| 19275 | 0.004 |
| 19276 | 0.004 |
| 19277 | 0.004 |
| 19278 | 0.004 |
| 19279 | 0.004 |
| 19280 | 0.004 |
| 19281 | 0.004 |
| 19282 | 0.004 |
| 19283 | 0.004 |
| 19284 | 0.004 |
| 19285 | 0.004 |
| 19286 | 0.004 |
| 19287 | 0.004 |
| 19288 | 0.004 |
| 19289 | 0.004 |
| 19290 | 0.004 |
| 19291 | 0.004 |
| 19292 | 0.004 |
| 19293 | 0.004 |
| 19294 | 0.004 |
| 19295 | 0.004 |
| 19296 | 0.004 |
| 19297 | 0.004 |
| 19298 | 0.004 |
| 19299 | 0.004 |
| 19300 | 0.004 |
| 19301 | 0.004 |
| 19302 | 0.004 |
| 19303 | 0.004 |
| 19304 | 0.004 |
| 19305 | 0.004 |
| 19306 | 0.004 |
| 19307 | 0.004 |
| 19308 | 0.004 |
| 19309 | 0.004 |
| 19310 | 0.004 |
| 19311 | 0.004 |
| 19312 | 0.004 |
| 19313 | 0.004 |
| 19314 | 0.004 |
| 19315 | 0.004 |
| 19316 | 0.004 |
| 19317 | 0.004 |
| 19318 | 0.004 |
| 19319 | 0.004 |
| 19320 | 0.004 |
| 19321 | 0.004 |
| 19322 | 0.004 |
| 19323 | 0.004 |
| 19324 | 0.004 |
| 19325 | 0.004 |
| 19326 | 0.004 |
| 19327 | 0.004 |
| 19328 | 0.004 |
| 19329 | 0.004 |
| 19330 | 0.004 |
| 19331 | 0.004 |
| 19332 | 0.005 |
| 19333 | 0.004 |
| 19334 | 0.004 |
| 19335 | 0.004 |
| 19336 | 0.004 |
| 19337 | 0.004 |
| 19338 | 0.005 |
| 19339 | 0.004 |
| 19340 | 0.004 |
| 19341 | 0.004 |
| 19342 | 0.004 |
| 19343 | 0.004 |
| 19344 | 0.004 |
| 19345 | 0.004 |
| 19346 | 0.004 |
| 19347 | 0.004 |
| 19348 | 0.004 |
| 19349 | 0.004 |
| 19350 | 0.004 |
| 19351 | 0.004 |
| 19352 | 0.004 |
| 19353 | 0.004 |
| 19354 | 0.004 |
| 19355 | 0.005 |
| 19356 | 0.005 |
| 19357 | 0.005 |
| 19358 | 0.004 |
| 19359 | 0.004 |
| 19360 | 0.004 |
| 19361 | 0.004 |
| 19362 | 0.004 |
| 19363 | 0.004 |
| 19364 | 0.004 |
| 19365 | 0.004 |
| 19366 | 0.004 |
| 19367 | 0.004 |
| 19368 | 0.004 |
| 19369 | 0.004 |
| 19370 | 0.004 |
| 19371 | 0.004 |
| 19372 | 0.004 |
| 19373 | 0.004 |
| 19374 | 0.004 |
| 19375 | 0.004 |
| 19376 | 0.004 |
| 19377 | 0.004 |
| 19378 | 0.004 |
| 19379 | 0.004 |
| 19380 | 0.004 |
| 19381 | 0.005 |
| 19382 | 0.005 |
| 19383 | 0.004 |
| 19384 | 0.004 |
| 19385 | 0.004 |
| 19386 | 0.004 |
| 19387 | 0.004 |
| 19388 | 0.004 |
| 19389 | 0.004 |
| 19390 | 0.004 |
| 19391 | 0.004 |
| 19392 | 0.004 |
| 19393 | 0.004 |
| 19394 | 0.004 |
| 19395 | 0.004 |
| 19396 | 0.004 |
| 19397 | 0.004 |
| 19398 | 0.004 |
| 19399 | 0.004 |
| 19400 | 0.004 |
| 19401 | 0.004 |
| 19402 | 0.004 |
| 19403 | 0.005 |
| 19404 | 0.005 |
| 19405 | 0.005 |
| 19406 | 0.005 |
| 19407 | 0.005 |
| 19408 | 0.005 |
| 19409 | 0.005 |
| 19410 | 0.004 |
| 19411 | 0.004 |
| 19412 | 0.005 |
| 19413 | 0.005 |
| 19414 | 0.005 |
| 19415 | 0.005 |
| 19416 | 0.005 |
| 19417 | 0.005 |
| 19418 | 0.004 |
| 19419 | 0.004 |
| 19420 | 0.004 |
| 19421 | 0.005 |
| 19422 | 0.005 |
| 19423 | 0.005 |
| 19424 | 0.005 |
| 19425 | 0.004 |
| 19426 | 0.004 |
| 19427 | 0.004 |
| 19428 | 0.005 |
| 19429 | 0.005 |
| 19430 | 0.005 |
| 19431 | 0.005 |
| 19432 | 0.005 |
| 19433 | 0.004 |
| 19434 | 0.004 |
| 19435 | 0.004 |
| 19436 | 0.004 |
| 19437 | 0.004 |
| 19438 | 0.004 |
| 19439 | 0.004 |
| 19440 | 0.005 |
| 19441 | 0.004 |
| 19442 | 0.004 |
| 19443 | 0.004 |
| 19444 | 0.004 |
| 19445 | 0.004 |
| 19446 | 0.004 |
| 19447 | 0.004 |
| 19448 | 0.004 |
| 19449 | 0.004 |
| 19450 | 0.004 |
| 19451 | 0.004 |
| 19452 | 0.004 |
| 19453 | 0.004 |
| 19454 | 0.004 |
| 19455 | 0.004 |
| 19456 | 0.004 |
| 19457 | 0.004 |
| 19458 | 0.004 |
| 19459 | 0.004 |
| 19460 | 0.004 |
| 19461 | 0.004 |
| 19462 | 0.004 |
| 19463 | 0.004 |
| 19464 | 0.004 |
| 19465 | 0.004 |
| 19466 | 0.004 |
| 19467 | 0.004 |
| 19468 | 0.004 |
| 19469 | 0.004 |
| 19470 | 0.004 |
| 19471 | 0.004 |
| 19472 | 0.004 |
| 19473 | 0.004 |
| 19474 | 0.004 |
| 19475 | 0.004 |
| 19476 | 0.004 |
| 19477 | 0.005 |
| 19478 | 0.005 |
| 19479 | 0.004 |
| 19480 | 0.004 |
| 19481 | 0.004 |
| 19482 | 0.004 |
| 19483 | 0.005 |
| 19484 | 0.004 |
| 19485 | 0.005 |
| 19486 | 0.005 |
| 19487 | 0.005 |
| 19488 | 0.005 |
| 19489 | 0.004 |
| 19490 | 0.004 |
| 19491 | 0.004 |
| 19492 | 0.005 |
| 19493 | 0.005 |
| 19494 | 0.005 |
| 19495 | 0.005 |
| 19496 | 0.004 |
| 19497 | 0.004 |
| 19498 | 0.004 |
| 19499 | 0.004 |
| 19500 | 0.004 |
| 19501 | 0.005 |
| 19502 | 0.005 |
| 19503 | 0.005 |
| 19504 | 0.004 |
| 19505 | 0.004 |
| 19506 | 0.004 |
| 19507 | 0.004 |
| 19508 | 0.004 |
| 19509 | 0.004 |
| 19510 | 0.004 |
| 19511 | 0.004 |
| 19512 | 0.005 |
| 19513 | 0.004 |
| 19514 | 0.004 |
| 19515 | 0.004 |
| 19516 | 0.004 |
| 19517 | 0.004 |
| 19518 | 0.004 |
| 19519 | 0.004 |
| 19520 | 0.005 |
| 19521 | 0.005 |
| 19522 | 0.004 |
| 19523 | 0.004 |
| 19524 | 0.004 |
| 19525 | 0.004 |
| 19526 | 0.004 |
| 19527 | 0.004 |
| 19528 | 0.004 |
| 19529 | 0.004 |
| 19530 | 0.004 |
| 19531 | 0.004 |
| 19532 | 0.004 |
| 19533 | 0.004 |
| 19534 | 0.004 |
| 19535 | 0.004 |
| 19536 | 0.004 |
| 19537 | 0.004 |
| 19538 | 0.004 |
| 19539 | 0.004 |
| 19540 | 0.004 |
| 19541 | 0.004 |
| 19542 | 0.004 |
| 19543 | 0.004 |
| 19544 | 0.004 |
| 19545 | 0.004 |
| 19546 | 0.005 |
| 19547 | 0.004 |
| 19548 | 0.004 |
| 19549 | 0.004 |
| 19550 | 0.004 |
| 19551 | 0.004 |
| 19552 | 0.004 |
| 19553 | 0.004 |
| 19554 | 0.004 |
| 19555 | 0.004 |
| 19556 | 0.004 |
| 19557 | 0.005 |
| 19558 | 0.004 |
| 19559 | 0.004 |
| 19560 | 0.004 |
| 19561 | 0.004 |
| 19562 | 0.004 |
| 19563 | 0.005 |
| 19564 | 0.005 |
| 19565 | 0.005 |
| 19566 | 0.005 |
| 19567 | 0.005 |
| 19568 | 0.004 |
| 19569 | 0.004 |
| 19570 | 0.004 |
| 19571 | 0.004 |
| 19572 | 0.005 |
| 19573 | 0.005 |
| 19574 | 0.005 |
| 19575 | 0.005 |
| 19576 | 0.004 |
| 19577 | 0.004 |
| 19578 | 0.004 |
| 19579 | 0.004 |
| 19580 | 0.004 |
| 19581 | 0.005 |
| 19582 | 0.005 |
| 19583 | 0.005 |
| 19584 | 0.004 |
| 19585 | 0.004 |
| 19586 | 0.004 |
| 19587 | 0.004 |
| 19588 | 0.005 |
| 19589 | 0.004 |
| 19590 | 0.004 |
| 19591 | 0.004 |
| 19592 | 0.004 |
| 19593 | 0.004 |
| 19594 | 0.004 |
| 19595 | 0.004 |
| 19596 | 0.004 |
| 19597 | 0.004 |
| 19598 | 0.004 |
| 19599 | 0.005 |
| 19600 | 0.004 |
| 19601 | 0.004 |
| 19602 | 0.004 |
| 19603 | 0.004 |
| 19604 | 0.004 |
| 19605 | 0.004 |
| 19606 | 0.004 |
| 19607 | 0.004 |
| 19608 | 0.004 |
| 19609 | 0.004 |
| 19610 | 0.004 |
| 19611 | 0.004 |
| 19612 | 0.004 |
| 19613 | 0.004 |
| 19614 | 0.004 |
| 19615 | 0.004 |
| 19616 | 0.004 |
| 19617 | 0.004 |
| 19618 | 0.004 |
| 19619 | 0.004 |
| 19620 | 0.004 |
| 19621 | 0.004 |
| 19622 | 0.004 |
| 19623 | 0.004 |
| 19624 | 0.004 |
| 19625 | 0.004 |
| 19626 | 0.004 |
| 19627 | 0.004 |
| 19628 | 0.004 |
| 19629 | 0.004 |
| 19630 | 0.004 |
| 19631 | 0.004 |
| 19632 | 0.005 |
| 19633 | 0.004 |
| 19634 | 0.004 |
| 19635 | 0.004 |
| 19636 | 0.004 |
| 19637 | 0.004 |
| 19638 | 0.004 |
| 19639 | 0.004 |
| 19640 | 0.004 |
| 19641 | 0.004 |
| 19642 | 0.005 |
| 19643 | 0.005 |
| 19644 | 0.005 |
| 19645 | 0.005 |
| 19646 | 0.005 |
| 19647 | 0.005 |
| 19648 | 0.005 |
| 19649 | 0.004 |
| 19650 | 0.004 |
| 19651 | 0.005 |
| 19652 | 0.005 |
| 19653 | 0.005 |
| 19654 | 0.005 |
| 19655 | 0.004 |
| 19656 | 0.004 |
| 19657 | 0.004 |
| 19658 | 0.004 |
| 19659 | 0.005 |
| 19660 | 0.005 |
| 19661 | 0.004 |
| 19662 | 0.004 |
| 19663 | 0.004 |
| 19664 | 0.004 |
| 19665 | 0.004 |
| 19666 | 0.004 |
| 19667 | 0.005 |
| 19668 | 0.005 |
| 19669 | 0.005 |
| 19670 | 0.005 |
| 19671 | 0.004 |
| 19672 | 0.004 |
| 19673 | 0.004 |
| 19674 | 0.005 |
| 19675 | 0.004 |
| 19676 | 0.004 |
| 19677 | 0.004 |
| 19678 | 0.004 |
| 19679 | 0.004 |
| 19680 | 0.004 |
| 19681 | 0.004 |
| 19682 | 0.004 |
| 19683 | 0.004 |
| 19684 | 0.004 |
| 19685 | 0.004 |
| 19686 | 0.004 |
| 19687 | 0.004 |
| 19688 | 0.004 |
| 19689 | 0.004 |
| 19690 | 0.004 |
| 19691 | 0.004 |
| 19692 | 0.004 |
| 19693 | 0.004 |
| 19694 | 0.004 |
| 19695 | 0.004 |
| 19696 | 0.004 |
| 19697 | 0.004 |
| 19698 | 0.004 |
| 19699 | 0.005 |
| 19700 | 0.004 |
| 19701 | 0.004 |
| 19702 | 0.004 |
| 19703 | 0.004 |
| 19704 | 0.004 |
| 19705 | 0.004 |
| 19706 | 0.004 |
| 19707 | 0.004 |
| 19708 | 0.004 |
| 19709 | 0.004 |
| 19710 | 0.004 |
| 19711 | 0.004 |
| 19712 | 0.004 |
| 19713 | 0.004 |
| 19714 | 0.004 |
| 19715 | 0.004 |
| 19716 | 0.004 |
| 19717 | 0.004 |
| 19718 | 0.005 |
| 19719 | 0.004 |
| 19720 | 0.004 |
| 19721 | 0.004 |
| 19722 | 0.004 |
| 19723 | 0.004 |
| 19724 | 0.004 |
| 19725 | 0.004 |
| 19726 | 0.005 |
| 19727 | 0.005 |
| 19728 | 0.005 |
| 19729 | 0.005 |
| 19730 | 0.004 |
| 19731 | 0.004 |
| 19732 | 0.004 |
| 19733 | 0.004 |
| 19734 | 0.005 |
| 19735 | 0.005 |
| 19736 | 0.005 |
| 19737 | 0.005 |
| 19738 | 0.005 |
| 19739 | 0.004 |
| 19740 | 0.004 |
| 19741 | 0.004 |
| 19742 | 0.005 |
| 19743 | 0.005 |
| 19744 | 0.005 |
| 19745 | 0.005 |
| 19746 | 0.004 |
| 19747 | 0.004 |
| 19748 | 0.004 |
| 19749 | 0.004 |
| 19750 | 0.004 |
| 19751 | 0.004 |
| 19752 | 0.005 |
| 19753 | 0.005 |
| 19754 | 0.005 |
| 19755 | 0.005 |
| 19756 | 0.005 |
| 19757 | 0.004 |
| 19758 | 0.004 |
| 19759 | 0.004 |
| 19760 | 0.005 |
| 19761 | 0.005 |
| 19762 | 0.005 |
| 19763 | 0.004 |
| 19764 | 0.004 |
| 19765 | 0.004 |
| 19766 | 0.004 |
| 19767 | 0.005 |
| 19768 | 0.005 |
| 19769 | 0.004 |
| 19770 | 0.004 |
| 19771 | 0.004 |
| 19772 | 0.004 |
| 19773 | 0.004 |
| 19774 | 0.004 |
| 19775 | 0.004 |
| 19776 | 0.004 |
| 19777 | 0.004 |
| 19778 | 0.004 |
| 19779 | 0.004 |
| 19780 | 0.004 |
| 19781 | 0.004 |
| 19782 | 0.004 |
| 19783 | 0.004 |
| 19784 | 0.004 |
| 19785 | 0.004 |
| 19786 | 0.004 |
| 19787 | 0.004 |
| 19788 | 0.004 |
| 19789 | 0.004 |
| 19790 | 0.004 |
| 19791 | 0.004 |
| 19792 | 0.005 |
| 19793 | 0.004 |
| 19794 | 0.004 |
| 19795 | 0.004 |
| 19796 | 0.004 |
| 19797 | 0.004 |
| 19798 | 0.004 |
| 19799 | 0.004 |
| 19800 | 0.004 |
| 19801 | 0.004 |
| 19802 | 0.005 |
| 19803 | 0.005 |
| 19804 | 0.005 |
| 19805 | 0.005 |
| 19806 | 0.005 |
| 19807 | 0.005 |
| 19808 | 0.005 |
| 19809 | 0.005 |
| 19810 | 0.005 |
| 19811 | 0.005 |
| 19812 | 0.005 |
| 19813 | 0.005 |
| 19814 | 0.005 |
| 19815 | 0.005 |
| 19816 | 0.005 |
| 19817 | 0.004 |
| 19818 | 0.004 |
| 19819 | 0.005 |
| 19820 | 0.005 |
| 19821 | 0.005 |
| 19822 | 0.004 |
| 19823 | 0.004 |
| 19824 | 0.004 |
| 19825 | 0.004 |
| 19826 | 0.004 |
| 19827 | 0.005 |
| 19828 | 0.005 |
| 19829 | 0.005 |
| 19830 | 0.005 |
| 19831 | 0.005 |
| 19832 | 0.005 |
| 19833 | 0.004 |
| 19834 | 0.004 |
| 19835 | 0.005 |
| 19836 | 0.004 |
| 19837 | 0.005 |
| 19838 | 0.005 |
| 19839 | 0.004 |
| 19840 | 0.004 |
| 19841 | 0.004 |
| 19842 | 0.004 |
| 19843 | 0.004 |
| 19844 | 0.004 |
| 19845 | 0.004 |
| 19846 | 0.004 |
| 19847 | 0.004 |
| 19848 | 0.004 |
| 19849 | 0.004 |
| 19850 | 0.004 |
| 19851 | 0.004 |
| 19852 | 0.004 |
| 19853 | 0.005 |
| 19854 | 0.005 |
| 19855 | 0.004 |
| 19856 | 0.004 |
| 19857 | 0.004 |
| 19858 | 0.004 |
| 19859 | 0.004 |
| 19860 | 0.005 |
| 19861 | 0.004 |
| 19862 | 0.004 |
| 19863 | 0.004 |
| 19864 | 0.004 |
| 19865 | 0.004 |
| 19866 | 0.004 |
| 19867 | 0.004 |
| 19868 | 0.004 |
| 19869 | 0.004 |
| 19870 | 0.004 |
| 19871 | 0.004 |
| 19872 | 0.004 |
| 19873 | 0.005 |
| 19874 | 0.004 |
| 19875 | 0.004 |
| 19876 | 0.004 |
| 19877 | 0.004 |
| 19878 | 0.004 |
| 19879 | 0.004 |
| 19880 | 0.004 |
| 19881 | 0.005 |
| 19882 | 0.005 |
| 19883 | 0.005 |
| 19884 | 0.005 |
| 19885 | 0.005 |
| 19886 | 0.005 |
| 19887 | 0.005 |
| 19888 | 0.005 |
| 19889 | 0.005 |
| 19890 | 0.005 |
| 19891 | 0.005 |
| 19892 | 0.005 |
| 19893 | 0.005 |
| 19894 | 0.005 |
| 19895 | 0.005 |
| 19896 | 0.005 |
| 19897 | 0.004 |
| 19898 | 0.004 |
| 19899 | 0.005 |
| 19900 | 0.005 |
| 19901 | 0.004 |
| 19902 | 0.004 |
| 19903 | 0.004 |
| 19904 | 0.004 |
| 19905 | 0.004 |
| 19906 | 0.005 |
| 19907 | 0.005 |
| 19908 | 0.005 |
| 19909 | 0.005 |
| 19910 | 0.005 |
| 19911 | 0.004 |
| 19912 | 0.004 |
| 19913 | 0.005 |
| 19914 | 0.005 |
| 19915 | 0.005 |
| 19916 | 0.005 |
| 19917 | 0.005 |
| 19918 | 0.005 |
| 19919 | 0.004 |
| 19920 | 0.004 |
| 19921 | 0.004 |
| 19922 | 0.004 |
| 19923 | 0.004 |
| 19924 | 0.004 |
| 19925 | 0.004 |
| 19926 | 0.004 |
| 19927 | 0.004 |
| 19928 | 0.004 |
| 19929 | 0.004 |
| 19930 | 0.004 |
| 19931 | 0.004 |
| 19932 | 0.004 |
| 19933 | 0.004 |
| 19934 | 0.004 |
| 19935 | 0.004 |
| 19936 | 0.004 |
| 19937 | 0.004 |
| 19938 | 0.004 |
| 19939 | 0.005 |
| 19940 | 0.005 |
| 19941 | 0.005 |
| 19942 | 0.004 |
| 19943 | 0.004 |
| 19944 | 0.004 |
| 19945 | 0.004 |
| 19946 | 0.004 |
| 19947 | 0.004 |
| 19948 | 0.004 |
| 19949 | 0.004 |
| 19950 | 0.004 |
| 19951 | 0.004 |
| 19952 | 0.004 |
| 19953 | 0.004 |
| 19954 | 0.004 |
| 19955 | 0.004 |
| 19956 | 0.004 |
| 19957 | 0.004 |
| 19958 | 0.005 |
| 19959 | 0.005 |
| 19960 | 0.004 |
| 19961 | 0.004 |
| 19962 | 0.004 |
| 19963 | 0.004 |
| 19964 | 0.005 |
| 19965 | 0.005 |
| 19966 | 0.005 |
| 19967 | 0.005 |
| 19968 | 0.005 |
| 19969 | 0.005 |
| 19970 | 0.004 |
| 19971 | 0.004 |
| 19972 | 0.004 |
| 19973 | 0.005 |
| 19974 | 0.005 |
| 19975 | 0.005 |
| 19976 | 0.004 |
| 19977 | 0.004 |
| 19978 | 0.004 |
| 19979 | 0.004 |
| 19980 | 0.004 |
| 19981 | 0.005 |
| 19982 | 0.005 |
| 19983 | 0.005 |
| 19984 | 0.005 |
| 19985 | 0.004 |
| 19986 | 0.004 |
| 19987 | 0.004 |
| 19988 | 0.004 |
| 19989 | 0.005 |
| 19990 | 0.004 |
| 19991 | 0.004 |
| 19992 | 0.004 |
| 19993 | 0.005 |
| 19994 | 0.004 |
| 19995 | 0.004 |
| 19996 | 0.004 |
| 19997 | 0.004 |
| 19998 | 0.004 |
| 19999 | 0.004 |